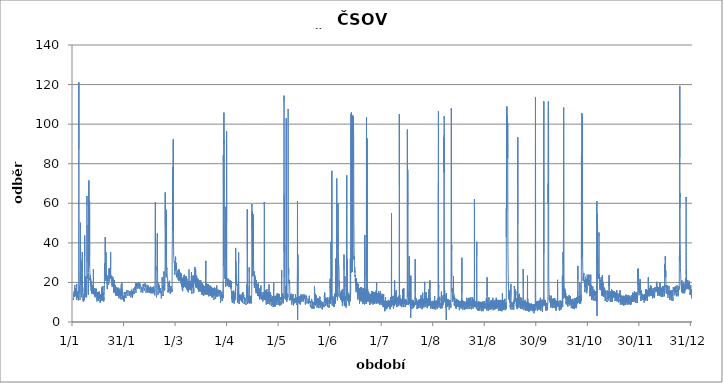
| Category | Series 0 |
|---|---|
| 2012-01-01 01:00:00 | 11.96 |
| 2012-01-01 02:00:00 | 12.22 |
| 2012-01-01 03:00:00 | 12.22 |
| 2012-01-01 04:00:00 | 11.7 |
| 2012-01-01 05:00:00 | 11.18 |
| 2012-01-01 06:00:00 | 11.44 |
| 2012-01-01 07:00:00 | 11.44 |
| 2012-01-01 08:00:00 | 11.7 |
| 2012-01-01 09:00:00 | 11.7 |
| 2012-01-01 10:00:00 | 11.7 |
| 2012-01-01 11:00:00 | 13 |
| 2012-01-01 12:00:00 | 13 |
| 2012-01-01 13:00:00 | 13.26 |
| 2012-01-01 14:00:00 | 13.26 |
| 2012-01-01 15:00:00 | 14.04 |
| 2012-01-01 16:00:00 | 12.74 |
| 2012-01-01 17:00:00 | 15.34 |
| 2012-01-01 18:00:00 | 13.78 |
| 2012-01-01 19:00:00 | 12.74 |
| 2012-01-01 20:00:00 | 13.26 |
| 2012-01-01 21:00:00 | 14.56 |
| 2012-01-01 22:00:00 | 14.3 |
| 2012-01-01 23:00:00 | 15.08 |
| 2012-01-02 | 16.12 |
| 2012-01-02 01:00:00 | 17.94 |
| 2012-01-02 02:00:00 | 18.72 |
| 2012-01-02 03:00:00 | 17.94 |
| 2012-01-02 04:00:00 | 14.82 |
| 2012-01-02 05:00:00 | 13.52 |
| 2012-01-02 06:00:00 | 13 |
| 2012-01-02 07:00:00 | 13 |
| 2012-01-02 08:00:00 | 12.74 |
| 2012-01-02 09:00:00 | 13.78 |
| 2012-01-02 10:00:00 | 16.38 |
| 2012-01-02 11:00:00 | 16.9 |
| 2012-01-02 12:00:00 | 15.34 |
| 2012-01-02 13:00:00 | 14.56 |
| 2012-01-02 14:00:00 | 14.3 |
| 2012-01-02 15:00:00 | 16.9 |
| 2012-01-02 16:00:00 | 15.86 |
| 2012-01-02 17:00:00 | 14.56 |
| 2012-01-02 18:00:00 | 14.04 |
| 2012-01-02 19:00:00 | 14.04 |
| 2012-01-02 20:00:00 | 14.3 |
| 2012-01-02 21:00:00 | 14.3 |
| 2012-01-02 22:00:00 | 13.26 |
| 2012-01-02 23:00:00 | 13 |
| 2012-01-03 | 14.82 |
| 2012-01-03 01:00:00 | 12.48 |
| 2012-01-03 02:00:00 | 11.18 |
| 2012-01-03 03:00:00 | 11.96 |
| 2012-01-03 04:00:00 | 17.16 |
| 2012-01-03 05:00:00 | 19.24 |
| 2012-01-03 06:00:00 | 17.68 |
| 2012-01-03 07:00:00 | 16.12 |
| 2012-01-03 08:00:00 | 14.3 |
| 2012-01-03 09:00:00 | 14.3 |
| 2012-01-03 10:00:00 | 15.6 |
| 2012-01-03 11:00:00 | 13.52 |
| 2012-01-03 12:00:00 | 13 |
| 2012-01-03 13:00:00 | 13.52 |
| 2012-01-03 14:00:00 | 14.82 |
| 2012-01-03 15:00:00 | 13.78 |
| 2012-01-03 16:00:00 | 14.04 |
| 2012-01-03 17:00:00 | 12.74 |
| 2012-01-03 18:00:00 | 12.22 |
| 2012-01-03 19:00:00 | 13.52 |
| 2012-01-03 20:00:00 | 14.56 |
| 2012-01-03 21:00:00 | 13 |
| 2012-01-03 22:00:00 | 14.04 |
| 2012-01-03 23:00:00 | 15.34 |
| 2012-01-04 | 14.3 |
| 2012-01-04 01:00:00 | 13 |
| 2012-01-04 02:00:00 | 11.44 |
| 2012-01-04 03:00:00 | 11.7 |
| 2012-01-04 04:00:00 | 10.92 |
| 2012-01-04 05:00:00 | 11.18 |
| 2012-01-04 06:00:00 | 12.22 |
| 2012-01-04 07:00:00 | 13 |
| 2012-01-04 08:00:00 | 12.22 |
| 2012-01-04 09:00:00 | 13.26 |
| 2012-01-04 10:00:00 | 20.02 |
| 2012-01-04 11:00:00 | 94.9 |
| 2012-01-04 12:00:00 | 121.16 |
| 2012-01-04 13:00:00 | 87.36 |
| 2012-01-04 14:00:00 | 41.86 |
| 2012-01-04 15:00:00 | 27.56 |
| 2012-01-04 16:00:00 | 24.18 |
| 2012-01-04 17:00:00 | 22.1 |
| 2012-01-04 18:00:00 | 15.08 |
| 2012-01-04 19:00:00 | 15.86 |
| 2012-01-04 20:00:00 | 16.12 |
| 2012-01-04 21:00:00 | 18.2 |
| 2012-01-04 22:00:00 | 16.12 |
| 2012-01-04 23:00:00 | 16.38 |
| 2012-01-05 | 15.6 |
| 2012-01-05 01:00:00 | 13.78 |
| 2012-01-05 02:00:00 | 12.48 |
| 2012-01-05 03:00:00 | 11.7 |
| 2012-01-05 04:00:00 | 11.18 |
| 2012-01-05 05:00:00 | 11.18 |
| 2012-01-05 06:00:00 | 11.96 |
| 2012-01-05 07:00:00 | 13.52 |
| 2012-01-05 08:00:00 | 14.04 |
| 2012-01-05 09:00:00 | 20.28 |
| 2012-01-05 10:00:00 | 50.18 |
| 2012-01-05 11:00:00 | 48.88 |
| 2012-01-05 12:00:00 | 43.16 |
| 2012-01-05 13:00:00 | 30.42 |
| 2012-01-05 14:00:00 | 23.66 |
| 2012-01-05 15:00:00 | 23.14 |
| 2012-01-05 16:00:00 | 30.16 |
| 2012-01-05 17:00:00 | 30.94 |
| 2012-01-05 18:00:00 | 23.92 |
| 2012-01-05 19:00:00 | 18.72 |
| 2012-01-05 20:00:00 | 22.62 |
| 2012-01-05 21:00:00 | 23.66 |
| 2012-01-05 22:00:00 | 18.72 |
| 2012-01-05 23:00:00 | 17.16 |
| 2012-01-06 | 15.6 |
| 2012-01-06 01:00:00 | 13.52 |
| 2012-01-06 02:00:00 | 14.3 |
| 2012-01-06 03:00:00 | 14.3 |
| 2012-01-06 04:00:00 | 13.52 |
| 2012-01-06 05:00:00 | 12.48 |
| 2012-01-06 06:00:00 | 12.22 |
| 2012-01-06 07:00:00 | 15.08 |
| 2012-01-06 08:00:00 | 15.34 |
| 2012-01-06 09:00:00 | 21.84 |
| 2012-01-06 10:00:00 | 29.38 |
| 2012-01-06 11:00:00 | 26.52 |
| 2012-01-06 12:00:00 | 31.98 |
| 2012-01-06 13:00:00 | 35.36 |
| 2012-01-06 14:00:00 | 27.56 |
| 2012-01-06 15:00:00 | 22.62 |
| 2012-01-06 16:00:00 | 16.9 |
| 2012-01-06 17:00:00 | 15.08 |
| 2012-01-06 18:00:00 | 17.42 |
| 2012-01-06 19:00:00 | 15.34 |
| 2012-01-06 20:00:00 | 15.34 |
| 2012-01-06 21:00:00 | 15.34 |
| 2012-01-06 22:00:00 | 15.08 |
| 2012-01-06 23:00:00 | 14.82 |
| 2012-01-07 | 13 |
| 2012-01-07 01:00:00 | 11.96 |
| 2012-01-07 02:00:00 | 10.66 |
| 2012-01-07 03:00:00 | 12.74 |
| 2012-01-07 04:00:00 | 10.4 |
| 2012-01-07 05:00:00 | 10.4 |
| 2012-01-07 06:00:00 | 10.14 |
| 2012-01-07 07:00:00 | 10.66 |
| 2012-01-07 08:00:00 | 11.7 |
| 2012-01-07 09:00:00 | 10.66 |
| 2012-01-07 10:00:00 | 11.44 |
| 2012-01-07 11:00:00 | 13.26 |
| 2012-01-07 12:00:00 | 13 |
| 2012-01-07 13:00:00 | 13 |
| 2012-01-07 14:00:00 | 14.3 |
| 2012-01-07 15:00:00 | 12.74 |
| 2012-01-07 16:00:00 | 12.22 |
| 2012-01-07 17:00:00 | 11.96 |
| 2012-01-07 18:00:00 | 11.7 |
| 2012-01-07 19:00:00 | 11.18 |
| 2012-01-07 20:00:00 | 11.44 |
| 2012-01-07 21:00:00 | 16.9 |
| 2012-01-07 22:00:00 | 40.56 |
| 2012-01-07 23:00:00 | 43.68 |
| 2012-01-08 | 33.28 |
| 2012-01-08 01:00:00 | 24.7 |
| 2012-01-08 02:00:00 | 17.94 |
| 2012-01-08 03:00:00 | 13.26 |
| 2012-01-08 04:00:00 | 12.48 |
| 2012-01-08 05:00:00 | 20.02 |
| 2012-01-08 06:00:00 | 19.5 |
| 2012-01-08 07:00:00 | 16.12 |
| 2012-01-08 08:00:00 | 21.58 |
| 2012-01-08 09:00:00 | 18.46 |
| 2012-01-08 10:00:00 | 16.12 |
| 2012-01-08 11:00:00 | 14.04 |
| 2012-01-08 12:00:00 | 14.3 |
| 2012-01-08 13:00:00 | 14.04 |
| 2012-01-08 14:00:00 | 17.16 |
| 2012-01-08 15:00:00 | 23.14 |
| 2012-01-08 16:00:00 | 17.42 |
| 2012-01-08 17:00:00 | 15.34 |
| 2012-01-08 18:00:00 | 21.06 |
| 2012-01-08 19:00:00 | 20.28 |
| 2012-01-08 20:00:00 | 16.12 |
| 2012-01-08 21:00:00 | 15.86 |
| 2012-01-08 22:00:00 | 15.08 |
| 2012-01-08 23:00:00 | 14.3 |
| 2012-01-09 | 14.56 |
| 2012-01-09 01:00:00 | 12.48 |
| 2012-01-09 02:00:00 | 13.52 |
| 2012-01-09 03:00:00 | 13.26 |
| 2012-01-09 04:00:00 | 18.46 |
| 2012-01-09 05:00:00 | 24.18 |
| 2012-01-09 06:00:00 | 63.7 |
| 2012-01-09 07:00:00 | 59.02 |
| 2012-01-09 08:00:00 | 48.1 |
| 2012-01-09 09:00:00 | 48.62 |
| 2012-01-09 10:00:00 | 30.16 |
| 2012-01-09 11:00:00 | 24.96 |
| 2012-01-09 12:00:00 | 23.66 |
| 2012-01-09 13:00:00 | 22.36 |
| 2012-01-09 14:00:00 | 22.1 |
| 2012-01-09 15:00:00 | 21.84 |
| 2012-01-09 16:00:00 | 21.58 |
| 2012-01-09 17:00:00 | 23.14 |
| 2012-01-09 18:00:00 | 23.14 |
| 2012-01-09 19:00:00 | 23.14 |
| 2012-01-09 20:00:00 | 23.92 |
| 2012-01-09 21:00:00 | 24.18 |
| 2012-01-09 22:00:00 | 23.66 |
| 2012-01-09 23:00:00 | 23.14 |
| 2012-01-10 | 22.1 |
| 2012-01-10 01:00:00 | 17.94 |
| 2012-01-10 02:00:00 | 13.78 |
| 2012-01-10 03:00:00 | 20.8 |
| 2012-01-10 04:00:00 | 24.96 |
| 2012-01-10 05:00:00 | 28.86 |
| 2012-01-10 06:00:00 | 42.38 |
| 2012-01-10 07:00:00 | 62.14 |
| 2012-01-10 08:00:00 | 47.32 |
| 2012-01-10 09:00:00 | 71.5 |
| 2012-01-10 10:00:00 | 40.3 |
| 2012-01-10 11:00:00 | 33.02 |
| 2012-01-10 12:00:00 | 33.54 |
| 2012-01-10 13:00:00 | 32.24 |
| 2012-01-10 14:00:00 | 28.34 |
| 2012-01-10 15:00:00 | 28.34 |
| 2012-01-10 16:00:00 | 30.42 |
| 2012-01-10 17:00:00 | 33.02 |
| 2012-01-10 18:00:00 | 29.64 |
| 2012-01-10 19:00:00 | 40.56 |
| 2012-01-10 20:00:00 | 60.84 |
| 2012-01-10 21:00:00 | 33.8 |
| 2012-01-10 22:00:00 | 27.04 |
| 2012-01-10 23:00:00 | 26.52 |
| 2012-01-11 | 26 |
| 2012-01-11 01:00:00 | 23.66 |
| 2012-01-11 02:00:00 | 21.32 |
| 2012-01-11 03:00:00 | 22.36 |
| 2012-01-11 04:00:00 | 22.62 |
| 2012-01-11 05:00:00 | 20.8 |
| 2012-01-11 06:00:00 | 20.8 |
| 2012-01-11 07:00:00 | 22.62 |
| 2012-01-11 08:00:00 | 23.66 |
| 2012-01-11 09:00:00 | 23.14 |
| 2012-01-11 10:00:00 | 21.32 |
| 2012-01-11 11:00:00 | 22.1 |
| 2012-01-11 12:00:00 | 19.5 |
| 2012-01-11 13:00:00 | 18.2 |
| 2012-01-11 14:00:00 | 18.2 |
| 2012-01-11 15:00:00 | 18.46 |
| 2012-01-11 16:00:00 | 20.02 |
| 2012-01-11 17:00:00 | 18.46 |
| 2012-01-11 18:00:00 | 15.86 |
| 2012-01-11 19:00:00 | 18.98 |
| 2012-01-11 20:00:00 | 18.98 |
| 2012-01-11 21:00:00 | 18.72 |
| 2012-01-11 22:00:00 | 17.94 |
| 2012-01-11 23:00:00 | 18.98 |
| 2012-01-12 | 20.8 |
| 2012-01-12 01:00:00 | 19.5 |
| 2012-01-12 02:00:00 | 14.56 |
| 2012-01-12 03:00:00 | 14.56 |
| 2012-01-12 04:00:00 | 15.86 |
| 2012-01-12 05:00:00 | 16.12 |
| 2012-01-12 06:00:00 | 14.3 |
| 2012-01-12 07:00:00 | 16.12 |
| 2012-01-12 08:00:00 | 18.46 |
| 2012-01-12 09:00:00 | 16.38 |
| 2012-01-12 10:00:00 | 16.12 |
| 2012-01-12 11:00:00 | 16.38 |
| 2012-01-12 12:00:00 | 18.2 |
| 2012-01-12 13:00:00 | 14.56 |
| 2012-01-12 14:00:00 | 16.9 |
| 2012-01-12 15:00:00 | 17.94 |
| 2012-01-12 16:00:00 | 18.2 |
| 2012-01-12 17:00:00 | 18.2 |
| 2012-01-12 18:00:00 | 14.56 |
| 2012-01-12 19:00:00 | 17.16 |
| 2012-01-12 20:00:00 | 18.72 |
| 2012-01-12 21:00:00 | 17.42 |
| 2012-01-12 22:00:00 | 16.38 |
| 2012-01-12 23:00:00 | 17.94 |
| 2012-01-13 | 17.94 |
| 2012-01-13 01:00:00 | 20.8 |
| 2012-01-13 02:00:00 | 26.78 |
| 2012-01-13 03:00:00 | 21.32 |
| 2012-01-13 04:00:00 | 17.42 |
| 2012-01-13 05:00:00 | 14.04 |
| 2012-01-13 06:00:00 | 14.04 |
| 2012-01-13 07:00:00 | 15.6 |
| 2012-01-13 08:00:00 | 16.64 |
| 2012-01-13 09:00:00 | 15.34 |
| 2012-01-13 10:00:00 | 14.56 |
| 2012-01-13 11:00:00 | 15.34 |
| 2012-01-13 12:00:00 | 17.16 |
| 2012-01-13 13:00:00 | 14.82 |
| 2012-01-13 14:00:00 | 15.08 |
| 2012-01-13 15:00:00 | 15.6 |
| 2012-01-13 16:00:00 | 16.9 |
| 2012-01-13 17:00:00 | 13.52 |
| 2012-01-13 18:00:00 | 14.82 |
| 2012-01-13 19:00:00 | 15.34 |
| 2012-01-13 20:00:00 | 17.16 |
| 2012-01-13 21:00:00 | 16.12 |
| 2012-01-13 22:00:00 | 13.78 |
| 2012-01-13 23:00:00 | 15.86 |
| 2012-01-14 | 14.3 |
| 2012-01-14 01:00:00 | 13.26 |
| 2012-01-14 02:00:00 | 12.48 |
| 2012-01-14 03:00:00 | 14.3 |
| 2012-01-14 04:00:00 | 13 |
| 2012-01-14 05:00:00 | 12.74 |
| 2012-01-14 06:00:00 | 13 |
| 2012-01-14 07:00:00 | 15.34 |
| 2012-01-14 08:00:00 | 13.78 |
| 2012-01-14 09:00:00 | 13.78 |
| 2012-01-14 10:00:00 | 14.04 |
| 2012-01-14 11:00:00 | 13.26 |
| 2012-01-14 12:00:00 | 15.08 |
| 2012-01-14 13:00:00 | 15.08 |
| 2012-01-14 14:00:00 | 15.08 |
| 2012-01-14 15:00:00 | 16.9 |
| 2012-01-14 16:00:00 | 13.78 |
| 2012-01-14 17:00:00 | 13.78 |
| 2012-01-14 18:00:00 | 13.78 |
| 2012-01-14 19:00:00 | 13.78 |
| 2012-01-14 20:00:00 | 13.52 |
| 2012-01-14 21:00:00 | 13.52 |
| 2012-01-14 22:00:00 | 16.64 |
| 2012-01-14 23:00:00 | 13.26 |
| 2012-01-15 | 13.26 |
| 2012-01-15 01:00:00 | 12.48 |
| 2012-01-15 02:00:00 | 11.7 |
| 2012-01-15 03:00:00 | 11.44 |
| 2012-01-15 04:00:00 | 10.4 |
| 2012-01-15 05:00:00 | 10.92 |
| 2012-01-15 06:00:00 | 10.92 |
| 2012-01-15 07:00:00 | 12.48 |
| 2012-01-15 08:00:00 | 11.44 |
| 2012-01-15 09:00:00 | 11.44 |
| 2012-01-15 10:00:00 | 12.22 |
| 2012-01-15 11:00:00 | 13.26 |
| 2012-01-15 12:00:00 | 13.52 |
| 2012-01-15 13:00:00 | 13.26 |
| 2012-01-15 14:00:00 | 13.52 |
| 2012-01-15 15:00:00 | 15.08 |
| 2012-01-15 16:00:00 | 13.52 |
| 2012-01-15 17:00:00 | 12.48 |
| 2012-01-15 18:00:00 | 13.26 |
| 2012-01-15 19:00:00 | 13.26 |
| 2012-01-15 20:00:00 | 13 |
| 2012-01-15 21:00:00 | 13.26 |
| 2012-01-15 22:00:00 | 14.3 |
| 2012-01-15 23:00:00 | 15.08 |
| 2012-01-16 | 13.26 |
| 2012-01-16 01:00:00 | 11.96 |
| 2012-01-16 02:00:00 | 10.66 |
| 2012-01-16 03:00:00 | 13 |
| 2012-01-16 04:00:00 | 11.96 |
| 2012-01-16 05:00:00 | 10.66 |
| 2012-01-16 06:00:00 | 10.66 |
| 2012-01-16 07:00:00 | 13.26 |
| 2012-01-16 08:00:00 | 13 |
| 2012-01-16 09:00:00 | 12.48 |
| 2012-01-16 10:00:00 | 12.74 |
| 2012-01-16 11:00:00 | 15.34 |
| 2012-01-16 12:00:00 | 13.52 |
| 2012-01-16 13:00:00 | 13.26 |
| 2012-01-16 14:00:00 | 11.7 |
| 2012-01-16 15:00:00 | 15.08 |
| 2012-01-16 16:00:00 | 15.34 |
| 2012-01-16 17:00:00 | 14.82 |
| 2012-01-16 18:00:00 | 12.48 |
| 2012-01-16 19:00:00 | 11.96 |
| 2012-01-16 20:00:00 | 13.78 |
| 2012-01-16 21:00:00 | 13.78 |
| 2012-01-16 22:00:00 | 12.22 |
| 2012-01-16 23:00:00 | 13.78 |
| 2012-01-17 | 13.26 |
| 2012-01-17 01:00:00 | 11.96 |
| 2012-01-17 02:00:00 | 9.88 |
| 2012-01-17 03:00:00 | 10.4 |
| 2012-01-17 04:00:00 | 11.18 |
| 2012-01-17 05:00:00 | 10.66 |
| 2012-01-17 06:00:00 | 9.62 |
| 2012-01-17 07:00:00 | 10.92 |
| 2012-01-17 08:00:00 | 13 |
| 2012-01-17 09:00:00 | 12.22 |
| 2012-01-17 10:00:00 | 11.96 |
| 2012-01-17 11:00:00 | 12.74 |
| 2012-01-17 12:00:00 | 12.74 |
| 2012-01-17 13:00:00 | 11.44 |
| 2012-01-17 14:00:00 | 14.04 |
| 2012-01-17 15:00:00 | 13.78 |
| 2012-01-17 16:00:00 | 14.3 |
| 2012-01-17 17:00:00 | 14.04 |
| 2012-01-17 18:00:00 | 14.3 |
| 2012-01-17 19:00:00 | 14.3 |
| 2012-01-17 20:00:00 | 13.52 |
| 2012-01-17 21:00:00 | 13.78 |
| 2012-01-17 22:00:00 | 17.42 |
| 2012-01-17 23:00:00 | 14.3 |
| 2012-01-18 | 15.08 |
| 2012-01-18 01:00:00 | 11.96 |
| 2012-01-18 02:00:00 | 11.96 |
| 2012-01-18 03:00:00 | 13 |
| 2012-01-18 04:00:00 | 11.18 |
| 2012-01-18 05:00:00 | 10.66 |
| 2012-01-18 06:00:00 | 12.48 |
| 2012-01-18 07:00:00 | 13.26 |
| 2012-01-18 08:00:00 | 13.52 |
| 2012-01-18 09:00:00 | 13.78 |
| 2012-01-18 10:00:00 | 12.48 |
| 2012-01-18 11:00:00 | 16.12 |
| 2012-01-18 12:00:00 | 14.82 |
| 2012-01-18 13:00:00 | 13.52 |
| 2012-01-18 14:00:00 | 13 |
| 2012-01-18 15:00:00 | 15.34 |
| 2012-01-18 16:00:00 | 18.2 |
| 2012-01-18 17:00:00 | 16.38 |
| 2012-01-18 18:00:00 | 14.3 |
| 2012-01-18 19:00:00 | 13 |
| 2012-01-18 20:00:00 | 13.26 |
| 2012-01-18 21:00:00 | 14.82 |
| 2012-01-18 22:00:00 | 15.08 |
| 2012-01-18 23:00:00 | 13.26 |
| 2012-01-19 | 12.48 |
| 2012-01-19 01:00:00 | 11.44 |
| 2012-01-19 02:00:00 | 12.22 |
| 2012-01-19 03:00:00 | 11.44 |
| 2012-01-19 04:00:00 | 10.4 |
| 2012-01-19 05:00:00 | 10.14 |
| 2012-01-19 06:00:00 | 11.96 |
| 2012-01-19 07:00:00 | 11.7 |
| 2012-01-19 08:00:00 | 11.44 |
| 2012-01-19 09:00:00 | 12.22 |
| 2012-01-19 10:00:00 | 13.26 |
| 2012-01-19 11:00:00 | 13.26 |
| 2012-01-19 12:00:00 | 13 |
| 2012-01-19 13:00:00 | 15.34 |
| 2012-01-19 14:00:00 | 18.98 |
| 2012-01-19 15:00:00 | 26 |
| 2012-01-19 16:00:00 | 29.64 |
| 2012-01-19 17:00:00 | 28.86 |
| 2012-01-19 18:00:00 | 25.74 |
| 2012-01-19 19:00:00 | 25.74 |
| 2012-01-19 20:00:00 | 27.04 |
| 2012-01-19 21:00:00 | 27.82 |
| 2012-01-19 22:00:00 | 29.9 |
| 2012-01-19 23:00:00 | 34.32 |
| 2012-01-20 | 36.92 |
| 2012-01-20 01:00:00 | 40.56 |
| 2012-01-20 02:00:00 | 42.9 |
| 2012-01-20 03:00:00 | 34.06 |
| 2012-01-20 04:00:00 | 28.08 |
| 2012-01-20 05:00:00 | 24.96 |
| 2012-01-20 06:00:00 | 25.48 |
| 2012-01-20 07:00:00 | 22.88 |
| 2012-01-20 08:00:00 | 22.36 |
| 2012-01-20 09:00:00 | 22.1 |
| 2012-01-20 10:00:00 | 21.32 |
| 2012-01-20 11:00:00 | 21.58 |
| 2012-01-20 12:00:00 | 20.8 |
| 2012-01-20 13:00:00 | 23.92 |
| 2012-01-20 14:00:00 | 35.1 |
| 2012-01-20 15:00:00 | 33.8 |
| 2012-01-20 16:00:00 | 32.24 |
| 2012-01-20 17:00:00 | 28.08 |
| 2012-01-20 18:00:00 | 23.66 |
| 2012-01-20 19:00:00 | 22.1 |
| 2012-01-20 20:00:00 | 23.4 |
| 2012-01-20 21:00:00 | 23.4 |
| 2012-01-20 22:00:00 | 21.58 |
| 2012-01-20 23:00:00 | 20.8 |
| 2012-01-21 | 21.06 |
| 2012-01-21 01:00:00 | 18.98 |
| 2012-01-21 02:00:00 | 18.98 |
| 2012-01-21 03:00:00 | 18.98 |
| 2012-01-21 04:00:00 | 18.98 |
| 2012-01-21 05:00:00 | 17.42 |
| 2012-01-21 06:00:00 | 17.68 |
| 2012-01-21 07:00:00 | 16.64 |
| 2012-01-21 08:00:00 | 16.9 |
| 2012-01-21 09:00:00 | 18.2 |
| 2012-01-21 10:00:00 | 19.24 |
| 2012-01-21 11:00:00 | 19.5 |
| 2012-01-21 12:00:00 | 23.4 |
| 2012-01-21 13:00:00 | 23.14 |
| 2012-01-21 14:00:00 | 22.1 |
| 2012-01-21 15:00:00 | 21.58 |
| 2012-01-21 16:00:00 | 20.54 |
| 2012-01-21 17:00:00 | 19.76 |
| 2012-01-21 18:00:00 | 19.24 |
| 2012-01-21 19:00:00 | 19.24 |
| 2012-01-21 20:00:00 | 18.98 |
| 2012-01-21 21:00:00 | 19.5 |
| 2012-01-21 22:00:00 | 18.98 |
| 2012-01-21 23:00:00 | 18.72 |
| 2012-01-22 | 18.72 |
| 2012-01-22 01:00:00 | 18.98 |
| 2012-01-22 02:00:00 | 18.72 |
| 2012-01-22 03:00:00 | 18.72 |
| 2012-01-22 04:00:00 | 18.98 |
| 2012-01-22 05:00:00 | 19.24 |
| 2012-01-22 06:00:00 | 19.5 |
| 2012-01-22 07:00:00 | 27.04 |
| 2012-01-22 08:00:00 | 23.14 |
| 2012-01-22 09:00:00 | 20.54 |
| 2012-01-22 10:00:00 | 22.1 |
| 2012-01-22 11:00:00 | 25.48 |
| 2012-01-22 12:00:00 | 25.48 |
| 2012-01-22 13:00:00 | 26 |
| 2012-01-22 14:00:00 | 26.78 |
| 2012-01-22 15:00:00 | 26 |
| 2012-01-22 16:00:00 | 27.04 |
| 2012-01-22 17:00:00 | 26.52 |
| 2012-01-22 18:00:00 | 25.22 |
| 2012-01-22 19:00:00 | 24.96 |
| 2012-01-22 20:00:00 | 26 |
| 2012-01-22 21:00:00 | 25.74 |
| 2012-01-22 22:00:00 | 24.7 |
| 2012-01-22 23:00:00 | 25.48 |
| 2012-01-23 | 23.66 |
| 2012-01-23 01:00:00 | 22.36 |
| 2012-01-23 02:00:00 | 21.84 |
| 2012-01-23 03:00:00 | 22.62 |
| 2012-01-23 04:00:00 | 22.88 |
| 2012-01-23 05:00:00 | 29.9 |
| 2012-01-23 06:00:00 | 35.36 |
| 2012-01-23 07:00:00 | 26.78 |
| 2012-01-23 08:00:00 | 24.96 |
| 2012-01-23 09:00:00 | 24.7 |
| 2012-01-23 10:00:00 | 23.14 |
| 2012-01-23 11:00:00 | 22.1 |
| 2012-01-23 12:00:00 | 22.1 |
| 2012-01-23 13:00:00 | 23.4 |
| 2012-01-23 14:00:00 | 22.1 |
| 2012-01-23 15:00:00 | 21.84 |
| 2012-01-23 16:00:00 | 22.36 |
| 2012-01-23 17:00:00 | 21.32 |
| 2012-01-23 18:00:00 | 20.28 |
| 2012-01-23 19:00:00 | 21.06 |
| 2012-01-23 20:00:00 | 21.84 |
| 2012-01-23 21:00:00 | 21.06 |
| 2012-01-23 22:00:00 | 20.28 |
| 2012-01-23 23:00:00 | 21.06 |
| 2012-01-24 | 20.54 |
| 2012-01-24 01:00:00 | 18.98 |
| 2012-01-24 02:00:00 | 18.72 |
| 2012-01-24 03:00:00 | 19.24 |
| 2012-01-24 04:00:00 | 19.76 |
| 2012-01-24 05:00:00 | 17.68 |
| 2012-01-24 06:00:00 | 17.68 |
| 2012-01-24 07:00:00 | 19.76 |
| 2012-01-24 08:00:00 | 22.62 |
| 2012-01-24 09:00:00 | 21.32 |
| 2012-01-24 10:00:00 | 21.58 |
| 2012-01-24 11:00:00 | 22.88 |
| 2012-01-24 12:00:00 | 22.1 |
| 2012-01-24 13:00:00 | 21.84 |
| 2012-01-24 14:00:00 | 19.24 |
| 2012-01-24 15:00:00 | 19.76 |
| 2012-01-24 16:00:00 | 20.8 |
| 2012-01-24 17:00:00 | 19.24 |
| 2012-01-24 18:00:00 | 18.46 |
| 2012-01-24 19:00:00 | 18.72 |
| 2012-01-24 20:00:00 | 19.76 |
| 2012-01-24 21:00:00 | 21.84 |
| 2012-01-24 22:00:00 | 18.98 |
| 2012-01-24 23:00:00 | 20.02 |
| 2012-01-25 | 19.76 |
| 2012-01-25 01:00:00 | 17.68 |
| 2012-01-25 02:00:00 | 15.08 |
| 2012-01-25 03:00:00 | 17.16 |
| 2012-01-25 04:00:00 | 17.16 |
| 2012-01-25 05:00:00 | 14.82 |
| 2012-01-25 06:00:00 | 15.08 |
| 2012-01-25 07:00:00 | 17.94 |
| 2012-01-25 08:00:00 | 18.72 |
| 2012-01-25 09:00:00 | 17.68 |
| 2012-01-25 10:00:00 | 15.86 |
| 2012-01-25 11:00:00 | 18.2 |
| 2012-01-25 12:00:00 | 19.76 |
| 2012-01-25 13:00:00 | 21.06 |
| 2012-01-25 14:00:00 | 17.42 |
| 2012-01-25 15:00:00 | 17.68 |
| 2012-01-25 16:00:00 | 18.46 |
| 2012-01-25 17:00:00 | 18.2 |
| 2012-01-25 18:00:00 | 16.38 |
| 2012-01-25 19:00:00 | 16.64 |
| 2012-01-25 20:00:00 | 17.68 |
| 2012-01-25 21:00:00 | 18.46 |
| 2012-01-25 22:00:00 | 16.9 |
| 2012-01-25 23:00:00 | 18.46 |
| 2012-01-26 | 17.68 |
| 2012-01-26 01:00:00 | 14.82 |
| 2012-01-26 02:00:00 | 13.52 |
| 2012-01-26 03:00:00 | 13.52 |
| 2012-01-26 04:00:00 | 14.82 |
| 2012-01-26 05:00:00 | 13.52 |
| 2012-01-26 06:00:00 | 13.26 |
| 2012-01-26 07:00:00 | 15.08 |
| 2012-01-26 08:00:00 | 16.9 |
| 2012-01-26 09:00:00 | 16.9 |
| 2012-01-26 10:00:00 | 13.78 |
| 2012-01-26 11:00:00 | 17.16 |
| 2012-01-26 12:00:00 | 17.68 |
| 2012-01-26 13:00:00 | 15.34 |
| 2012-01-26 14:00:00 | 14.82 |
| 2012-01-26 15:00:00 | 17.42 |
| 2012-01-26 16:00:00 | 16.12 |
| 2012-01-26 17:00:00 | 16.38 |
| 2012-01-26 18:00:00 | 17.16 |
| 2012-01-26 19:00:00 | 13.52 |
| 2012-01-26 20:00:00 | 16.38 |
| 2012-01-26 21:00:00 | 17.16 |
| 2012-01-26 22:00:00 | 17.42 |
| 2012-01-26 23:00:00 | 17.42 |
| 2012-01-27 | 13.52 |
| 2012-01-27 01:00:00 | 13.78 |
| 2012-01-27 02:00:00 | 14.82 |
| 2012-01-27 03:00:00 | 14.82 |
| 2012-01-27 04:00:00 | 13.26 |
| 2012-01-27 05:00:00 | 15.34 |
| 2012-01-27 06:00:00 | 15.34 |
| 2012-01-27 07:00:00 | 15.08 |
| 2012-01-27 08:00:00 | 16.64 |
| 2012-01-27 09:00:00 | 13.78 |
| 2012-01-27 10:00:00 | 14.3 |
| 2012-01-27 11:00:00 | 16.9 |
| 2012-01-27 12:00:00 | 15.34 |
| 2012-01-27 13:00:00 | 14.04 |
| 2012-01-27 14:00:00 | 16.12 |
| 2012-01-27 15:00:00 | 17.42 |
| 2012-01-27 16:00:00 | 16.9 |
| 2012-01-27 17:00:00 | 13.26 |
| 2012-01-27 18:00:00 | 14.56 |
| 2012-01-27 19:00:00 | 16.64 |
| 2012-01-27 20:00:00 | 15.34 |
| 2012-01-27 21:00:00 | 14.82 |
| 2012-01-27 22:00:00 | 14.82 |
| 2012-01-27 23:00:00 | 16.38 |
| 2012-01-28 | 15.08 |
| 2012-01-28 01:00:00 | 13.26 |
| 2012-01-28 02:00:00 | 13 |
| 2012-01-28 03:00:00 | 13 |
| 2012-01-28 04:00:00 | 11.96 |
| 2012-01-28 05:00:00 | 12.22 |
| 2012-01-28 06:00:00 | 11.96 |
| 2012-01-28 07:00:00 | 12.22 |
| 2012-01-28 08:00:00 | 14.04 |
| 2012-01-28 09:00:00 | 13.78 |
| 2012-01-28 10:00:00 | 13.52 |
| 2012-01-28 11:00:00 | 14.56 |
| 2012-01-28 12:00:00 | 15.34 |
| 2012-01-28 13:00:00 | 15.08 |
| 2012-01-28 14:00:00 | 15.08 |
| 2012-01-28 15:00:00 | 15.08 |
| 2012-01-28 16:00:00 | 15.86 |
| 2012-01-28 17:00:00 | 16.9 |
| 2012-01-28 18:00:00 | 13.52 |
| 2012-01-28 19:00:00 | 13.78 |
| 2012-01-28 20:00:00 | 13.78 |
| 2012-01-28 21:00:00 | 13.78 |
| 2012-01-28 22:00:00 | 14.04 |
| 2012-01-28 23:00:00 | 15.6 |
| 2012-01-29 | 13.78 |
| 2012-01-29 01:00:00 | 13.52 |
| 2012-01-29 02:00:00 | 12.48 |
| 2012-01-29 03:00:00 | 12.48 |
| 2012-01-29 04:00:00 | 12.22 |
| 2012-01-29 05:00:00 | 12.48 |
| 2012-01-29 06:00:00 | 12.22 |
| 2012-01-29 07:00:00 | 11.44 |
| 2012-01-29 08:00:00 | 13 |
| 2012-01-29 09:00:00 | 14.56 |
| 2012-01-29 10:00:00 | 13.26 |
| 2012-01-29 11:00:00 | 15.08 |
| 2012-01-29 12:00:00 | 15.86 |
| 2012-01-29 13:00:00 | 18.98 |
| 2012-01-29 14:00:00 | 15.6 |
| 2012-01-29 15:00:00 | 15.34 |
| 2012-01-29 16:00:00 | 15.34 |
| 2012-01-29 17:00:00 | 17.94 |
| 2012-01-29 18:00:00 | 14.3 |
| 2012-01-29 19:00:00 | 14.04 |
| 2012-01-29 20:00:00 | 15.6 |
| 2012-01-29 21:00:00 | 20.02 |
| 2012-01-29 22:00:00 | 15.86 |
| 2012-01-29 23:00:00 | 16.38 |
| 2012-01-30 | 16.38 |
| 2012-01-30 01:00:00 | 15.6 |
| 2012-01-30 02:00:00 | 12.48 |
| 2012-01-30 03:00:00 | 11.44 |
| 2012-01-30 04:00:00 | 12.48 |
| 2012-01-30 05:00:00 | 13 |
| 2012-01-30 06:00:00 | 12.48 |
| 2012-01-30 07:00:00 | 12.48 |
| 2012-01-30 08:00:00 | 13 |
| 2012-01-30 09:00:00 | 15.34 |
| 2012-01-30 10:00:00 | 13.26 |
| 2012-01-30 11:00:00 | 13 |
| 2012-01-30 12:00:00 | 12.22 |
| 2012-01-30 13:00:00 | 13.26 |
| 2012-01-30 14:00:00 | 12.74 |
| 2012-01-30 15:00:00 | 13 |
| 2012-01-30 16:00:00 | 13 |
| 2012-01-30 17:00:00 | 12.48 |
| 2012-01-30 18:00:00 | 11.7 |
| 2012-01-30 19:00:00 | 11.96 |
| 2012-01-30 20:00:00 | 11.44 |
| 2012-01-30 21:00:00 | 13 |
| 2012-01-30 22:00:00 | 12.22 |
| 2012-01-30 23:00:00 | 11.96 |
| 2012-01-31 | 12.22 |
| 2012-01-31 01:00:00 | 11.7 |
| 2012-01-31 02:00:00 | 10.92 |
| 2012-01-31 03:00:00 | 11.44 |
| 2012-01-31 04:00:00 | 10.4 |
| 2012-01-31 05:00:00 | 11.18 |
| 2012-01-31 06:00:00 | 10.66 |
| 2012-01-31 07:00:00 | 11.7 |
| 2012-01-31 08:00:00 | 12.48 |
| 2012-01-31 09:00:00 | 13 |
| 2012-01-31 10:00:00 | 12.22 |
| 2012-01-31 11:00:00 | 12.22 |
| 2012-01-31 12:00:00 | 12.22 |
| 2012-01-31 13:00:00 | 13.78 |
| 2012-01-31 14:00:00 | 14.56 |
| 2012-01-31 15:00:00 | 14.04 |
| 2012-01-31 16:00:00 | 14.3 |
| 2012-01-31 17:00:00 | 14.04 |
| 2012-01-31 18:00:00 | 14.04 |
| 2012-01-31 19:00:00 | 15.08 |
| 2012-01-31 20:00:00 | 14.3 |
| 2012-01-31 21:00:00 | 15.08 |
| 2012-01-31 22:00:00 | 15.34 |
| 2012-01-31 23:00:00 | 14.3 |
| 2012-02-01 | 14.3 |
| 2012-02-01 01:00:00 | 13.52 |
| 2012-02-01 02:00:00 | 13.78 |
| 2012-02-01 03:00:00 | 12.22 |
| 2012-02-01 04:00:00 | 12.74 |
| 2012-02-01 05:00:00 | 12.22 |
| 2012-02-01 06:00:00 | 12.74 |
| 2012-02-01 07:00:00 | 12.74 |
| 2012-02-01 08:00:00 | 13.26 |
| 2012-02-01 09:00:00 | 14.04 |
| 2012-02-01 10:00:00 | 14.3 |
| 2012-02-01 11:00:00 | 14.3 |
| 2012-02-01 12:00:00 | 14.82 |
| 2012-02-01 13:00:00 | 15.08 |
| 2012-02-01 14:00:00 | 15.6 |
| 2012-02-01 15:00:00 | 15.86 |
| 2012-02-01 16:00:00 | 15.86 |
| 2012-02-01 17:00:00 | 15.86 |
| 2012-02-01 18:00:00 | 14.82 |
| 2012-02-01 19:00:00 | 15.6 |
| 2012-02-01 20:00:00 | 15.34 |
| 2012-02-01 21:00:00 | 16.12 |
| 2012-02-01 22:00:00 | 16.38 |
| 2012-02-01 23:00:00 | 16.38 |
| 2012-02-02 | 15.6 |
| 2012-02-02 01:00:00 | 14.56 |
| 2012-02-02 02:00:00 | 13.78 |
| 2012-02-02 03:00:00 | 13.26 |
| 2012-02-02 04:00:00 | 13.26 |
| 2012-02-02 05:00:00 | 13.26 |
| 2012-02-02 06:00:00 | 13.26 |
| 2012-02-02 07:00:00 | 13 |
| 2012-02-02 08:00:00 | 13.78 |
| 2012-02-02 09:00:00 | 14.04 |
| 2012-02-02 10:00:00 | 14.3 |
| 2012-02-02 11:00:00 | 14.3 |
| 2012-02-02 12:00:00 | 14.3 |
| 2012-02-02 13:00:00 | 14.82 |
| 2012-02-02 14:00:00 | 15.34 |
| 2012-02-02 15:00:00 | 15.08 |
| 2012-02-02 16:00:00 | 15.34 |
| 2012-02-02 17:00:00 | 15.34 |
| 2012-02-02 18:00:00 | 15.08 |
| 2012-02-02 19:00:00 | 15.34 |
| 2012-02-02 20:00:00 | 15.86 |
| 2012-02-02 21:00:00 | 15.6 |
| 2012-02-02 22:00:00 | 15.86 |
| 2012-02-02 23:00:00 | 15.86 |
| 2012-02-03 | 15.34 |
| 2012-02-03 01:00:00 | 14.56 |
| 2012-02-03 02:00:00 | 14.04 |
| 2012-02-03 03:00:00 | 13.26 |
| 2012-02-03 04:00:00 | 13.26 |
| 2012-02-03 05:00:00 | 13.26 |
| 2012-02-03 06:00:00 | 13 |
| 2012-02-03 07:00:00 | 13.26 |
| 2012-02-03 08:00:00 | 13 |
| 2012-02-03 09:00:00 | 14.3 |
| 2012-02-03 10:00:00 | 15.34 |
| 2012-02-03 11:00:00 | 14.82 |
| 2012-02-03 12:00:00 | 15.08 |
| 2012-02-03 13:00:00 | 15.34 |
| 2012-02-03 14:00:00 | 15.34 |
| 2012-02-03 15:00:00 | 15.34 |
| 2012-02-03 16:00:00 | 14.56 |
| 2012-02-03 17:00:00 | 14.3 |
| 2012-02-03 18:00:00 | 14.56 |
| 2012-02-03 19:00:00 | 14.56 |
| 2012-02-03 20:00:00 | 14.56 |
| 2012-02-03 21:00:00 | 14.82 |
| 2012-02-03 22:00:00 | 15.34 |
| 2012-02-03 23:00:00 | 14.3 |
| 2012-02-04 | 14.56 |
| 2012-02-04 01:00:00 | 14.3 |
| 2012-02-04 02:00:00 | 14.04 |
| 2012-02-04 03:00:00 | 13.52 |
| 2012-02-04 04:00:00 | 13.26 |
| 2012-02-04 05:00:00 | 12.48 |
| 2012-02-04 06:00:00 | 13 |
| 2012-02-04 07:00:00 | 13.26 |
| 2012-02-04 08:00:00 | 13.26 |
| 2012-02-04 09:00:00 | 13.26 |
| 2012-02-04 10:00:00 | 14.56 |
| 2012-02-04 11:00:00 | 15.34 |
| 2012-02-04 12:00:00 | 15.34 |
| 2012-02-04 13:00:00 | 16.38 |
| 2012-02-04 14:00:00 | 15.6 |
| 2012-02-04 15:00:00 | 15.34 |
| 2012-02-04 16:00:00 | 14.56 |
| 2012-02-04 17:00:00 | 14.3 |
| 2012-02-04 18:00:00 | 14.3 |
| 2012-02-04 19:00:00 | 14.56 |
| 2012-02-04 20:00:00 | 14.82 |
| 2012-02-04 21:00:00 | 14.56 |
| 2012-02-04 22:00:00 | 15.6 |
| 2012-02-04 23:00:00 | 13.52 |
| 2012-02-05 | 14.56 |
| 2012-02-05 01:00:00 | 14.3 |
| 2012-02-05 02:00:00 | 13.26 |
| 2012-02-05 03:00:00 | 13.26 |
| 2012-02-05 04:00:00 | 12.22 |
| 2012-02-05 05:00:00 | 13 |
| 2012-02-05 06:00:00 | 13 |
| 2012-02-05 07:00:00 | 13 |
| 2012-02-05 08:00:00 | 13.26 |
| 2012-02-05 09:00:00 | 13.52 |
| 2012-02-05 10:00:00 | 14.3 |
| 2012-02-05 11:00:00 | 15.08 |
| 2012-02-05 12:00:00 | 15.86 |
| 2012-02-05 13:00:00 | 16.12 |
| 2012-02-05 14:00:00 | 15.6 |
| 2012-02-05 15:00:00 | 16.9 |
| 2012-02-05 16:00:00 | 16.9 |
| 2012-02-05 17:00:00 | 16.12 |
| 2012-02-05 18:00:00 | 15.08 |
| 2012-02-05 19:00:00 | 14.82 |
| 2012-02-05 20:00:00 | 15.34 |
| 2012-02-05 21:00:00 | 15.6 |
| 2012-02-05 22:00:00 | 15.6 |
| 2012-02-05 23:00:00 | 15.6 |
| 2012-02-06 | 15.08 |
| 2012-02-06 01:00:00 | 14.56 |
| 2012-02-06 02:00:00 | 15.08 |
| 2012-02-06 03:00:00 | 15.34 |
| 2012-02-06 04:00:00 | 14.3 |
| 2012-02-06 05:00:00 | 15.08 |
| 2012-02-06 06:00:00 | 14.3 |
| 2012-02-06 07:00:00 | 15.34 |
| 2012-02-06 08:00:00 | 16.12 |
| 2012-02-06 09:00:00 | 16.12 |
| 2012-02-06 10:00:00 | 16.38 |
| 2012-02-06 11:00:00 | 16.38 |
| 2012-02-06 12:00:00 | 17.16 |
| 2012-02-06 13:00:00 | 16.9 |
| 2012-02-06 14:00:00 | 16.64 |
| 2012-02-06 15:00:00 | 17.68 |
| 2012-02-06 16:00:00 | 16.38 |
| 2012-02-06 17:00:00 | 17.68 |
| 2012-02-06 18:00:00 | 17.94 |
| 2012-02-06 19:00:00 | 17.94 |
| 2012-02-06 20:00:00 | 18.46 |
| 2012-02-06 21:00:00 | 18.98 |
| 2012-02-06 22:00:00 | 19.5 |
| 2012-02-06 23:00:00 | 18.2 |
| 2012-02-07 | 17.42 |
| 2012-02-07 01:00:00 | 17.42 |
| 2012-02-07 02:00:00 | 16.12 |
| 2012-02-07 03:00:00 | 15.6 |
| 2012-02-07 04:00:00 | 15.6 |
| 2012-02-07 05:00:00 | 14.82 |
| 2012-02-07 06:00:00 | 15.34 |
| 2012-02-07 07:00:00 | 15.34 |
| 2012-02-07 08:00:00 | 15.34 |
| 2012-02-07 09:00:00 | 16.38 |
| 2012-02-07 10:00:00 | 16.64 |
| 2012-02-07 11:00:00 | 18.72 |
| 2012-02-07 12:00:00 | 18.46 |
| 2012-02-07 13:00:00 | 19.5 |
| 2012-02-07 14:00:00 | 18.72 |
| 2012-02-07 15:00:00 | 18.46 |
| 2012-02-07 16:00:00 | 18.2 |
| 2012-02-07 17:00:00 | 17.94 |
| 2012-02-07 18:00:00 | 17.68 |
| 2012-02-07 19:00:00 | 17.94 |
| 2012-02-07 20:00:00 | 17.94 |
| 2012-02-07 21:00:00 | 17.94 |
| 2012-02-07 22:00:00 | 19.5 |
| 2012-02-07 23:00:00 | 17.94 |
| 2012-02-08 | 18.2 |
| 2012-02-08 01:00:00 | 17.94 |
| 2012-02-08 02:00:00 | 17.94 |
| 2012-02-08 03:00:00 | 16.9 |
| 2012-02-08 04:00:00 | 16.9 |
| 2012-02-08 05:00:00 | 16.64 |
| 2012-02-08 06:00:00 | 16.9 |
| 2012-02-08 07:00:00 | 17.42 |
| 2012-02-08 08:00:00 | 17.42 |
| 2012-02-08 09:00:00 | 17.94 |
| 2012-02-08 10:00:00 | 17.94 |
| 2012-02-08 11:00:00 | 17.94 |
| 2012-02-08 12:00:00 | 17.94 |
| 2012-02-08 13:00:00 | 18.2 |
| 2012-02-08 14:00:00 | 17.94 |
| 2012-02-08 15:00:00 | 18.2 |
| 2012-02-08 16:00:00 | 18.2 |
| 2012-02-08 17:00:00 | 17.68 |
| 2012-02-08 18:00:00 | 17.42 |
| 2012-02-08 19:00:00 | 18.2 |
| 2012-02-08 20:00:00 | 18.46 |
| 2012-02-08 21:00:00 | 20.02 |
| 2012-02-08 22:00:00 | 18.72 |
| 2012-02-08 23:00:00 | 18.72 |
| 2012-02-09 | 18.72 |
| 2012-02-09 01:00:00 | 18.46 |
| 2012-02-09 02:00:00 | 18.2 |
| 2012-02-09 03:00:00 | 17.42 |
| 2012-02-09 04:00:00 | 16.64 |
| 2012-02-09 05:00:00 | 17.16 |
| 2012-02-09 06:00:00 | 17.16 |
| 2012-02-09 07:00:00 | 17.68 |
| 2012-02-09 08:00:00 | 17.68 |
| 2012-02-09 09:00:00 | 17.94 |
| 2012-02-09 10:00:00 | 18.2 |
| 2012-02-09 11:00:00 | 18.2 |
| 2012-02-09 12:00:00 | 19.5 |
| 2012-02-09 13:00:00 | 17.94 |
| 2012-02-09 14:00:00 | 17.94 |
| 2012-02-09 15:00:00 | 17.94 |
| 2012-02-09 16:00:00 | 17.94 |
| 2012-02-09 17:00:00 | 17.94 |
| 2012-02-09 18:00:00 | 17.94 |
| 2012-02-09 19:00:00 | 18.46 |
| 2012-02-09 20:00:00 | 17.94 |
| 2012-02-09 21:00:00 | 18.2 |
| 2012-02-09 22:00:00 | 18.46 |
| 2012-02-09 23:00:00 | 17.94 |
| 2012-02-10 | 17.94 |
| 2012-02-10 01:00:00 | 16.9 |
| 2012-02-10 02:00:00 | 16.9 |
| 2012-02-10 03:00:00 | 16.38 |
| 2012-02-10 04:00:00 | 15.08 |
| 2012-02-10 05:00:00 | 15.6 |
| 2012-02-10 06:00:00 | 15.6 |
| 2012-02-10 07:00:00 | 15.86 |
| 2012-02-10 08:00:00 | 16.12 |
| 2012-02-10 09:00:00 | 16.9 |
| 2012-02-10 10:00:00 | 17.16 |
| 2012-02-10 11:00:00 | 16.9 |
| 2012-02-10 12:00:00 | 17.42 |
| 2012-02-10 13:00:00 | 16.9 |
| 2012-02-10 14:00:00 | 17.68 |
| 2012-02-10 15:00:00 | 17.42 |
| 2012-02-10 16:00:00 | 17.68 |
| 2012-02-10 17:00:00 | 16.64 |
| 2012-02-10 18:00:00 | 16.9 |
| 2012-02-10 19:00:00 | 17.16 |
| 2012-02-10 20:00:00 | 17.42 |
| 2012-02-10 21:00:00 | 17.42 |
| 2012-02-10 22:00:00 | 17.16 |
| 2012-02-10 23:00:00 | 17.16 |
| 2012-02-11 | 16.9 |
| 2012-02-11 01:00:00 | 16.38 |
| 2012-02-11 02:00:00 | 15.34 |
| 2012-02-11 03:00:00 | 15.34 |
| 2012-02-11 04:00:00 | 15.34 |
| 2012-02-11 05:00:00 | 14.82 |
| 2012-02-11 06:00:00 | 14.56 |
| 2012-02-11 07:00:00 | 15.34 |
| 2012-02-11 08:00:00 | 15.34 |
| 2012-02-11 09:00:00 | 16.12 |
| 2012-02-11 10:00:00 | 17.42 |
| 2012-02-11 11:00:00 | 17.42 |
| 2012-02-11 12:00:00 | 18.98 |
| 2012-02-11 13:00:00 | 17.94 |
| 2012-02-11 14:00:00 | 19.24 |
| 2012-02-11 15:00:00 | 17.42 |
| 2012-02-11 16:00:00 | 17.68 |
| 2012-02-11 17:00:00 | 17.68 |
| 2012-02-11 18:00:00 | 17.68 |
| 2012-02-11 19:00:00 | 17.42 |
| 2012-02-11 20:00:00 | 17.68 |
| 2012-02-11 21:00:00 | 17.42 |
| 2012-02-11 22:00:00 | 17.68 |
| 2012-02-11 23:00:00 | 17.68 |
| 2012-02-12 | 17.68 |
| 2012-02-12 01:00:00 | 16.64 |
| 2012-02-12 02:00:00 | 16.64 |
| 2012-02-12 03:00:00 | 15.86 |
| 2012-02-12 04:00:00 | 15.86 |
| 2012-02-12 05:00:00 | 15.6 |
| 2012-02-12 06:00:00 | 15.6 |
| 2012-02-12 07:00:00 | 16.12 |
| 2012-02-12 08:00:00 | 15.6 |
| 2012-02-12 09:00:00 | 16.9 |
| 2012-02-12 10:00:00 | 17.42 |
| 2012-02-12 11:00:00 | 17.68 |
| 2012-02-12 12:00:00 | 17.68 |
| 2012-02-12 13:00:00 | 19.5 |
| 2012-02-12 14:00:00 | 18.2 |
| 2012-02-12 15:00:00 | 18.46 |
| 2012-02-12 16:00:00 | 17.68 |
| 2012-02-12 17:00:00 | 17.94 |
| 2012-02-12 18:00:00 | 17.68 |
| 2012-02-12 19:00:00 | 17.68 |
| 2012-02-12 20:00:00 | 17.42 |
| 2012-02-12 21:00:00 | 17.94 |
| 2012-02-12 22:00:00 | 19.24 |
| 2012-02-12 23:00:00 | 17.94 |
| 2012-02-13 | 17.68 |
| 2012-02-13 01:00:00 | 17.16 |
| 2012-02-13 02:00:00 | 14.82 |
| 2012-02-13 03:00:00 | 14.82 |
| 2012-02-13 04:00:00 | 14.56 |
| 2012-02-13 05:00:00 | 14.56 |
| 2012-02-13 06:00:00 | 14.56 |
| 2012-02-13 07:00:00 | 14.82 |
| 2012-02-13 08:00:00 | 15.34 |
| 2012-02-13 09:00:00 | 16.12 |
| 2012-02-13 10:00:00 | 15.86 |
| 2012-02-13 11:00:00 | 16.12 |
| 2012-02-13 12:00:00 | 15.6 |
| 2012-02-13 13:00:00 | 16.12 |
| 2012-02-13 14:00:00 | 15.86 |
| 2012-02-13 15:00:00 | 16.9 |
| 2012-02-13 16:00:00 | 16.38 |
| 2012-02-13 17:00:00 | 16.12 |
| 2012-02-13 18:00:00 | 16.38 |
| 2012-02-13 19:00:00 | 16.64 |
| 2012-02-13 20:00:00 | 16.64 |
| 2012-02-13 21:00:00 | 18.72 |
| 2012-02-13 22:00:00 | 17.68 |
| 2012-02-13 23:00:00 | 16.9 |
| 2012-02-14 | 17.16 |
| 2012-02-14 01:00:00 | 15.86 |
| 2012-02-14 02:00:00 | 16.12 |
| 2012-02-14 03:00:00 | 15.86 |
| 2012-02-14 04:00:00 | 15.08 |
| 2012-02-14 05:00:00 | 15.86 |
| 2012-02-14 06:00:00 | 14.82 |
| 2012-02-14 07:00:00 | 15.86 |
| 2012-02-14 08:00:00 | 17.16 |
| 2012-02-14 09:00:00 | 16.64 |
| 2012-02-14 10:00:00 | 17.16 |
| 2012-02-14 11:00:00 | 18.46 |
| 2012-02-14 12:00:00 | 18.72 |
| 2012-02-14 13:00:00 | 17.94 |
| 2012-02-14 14:00:00 | 16.12 |
| 2012-02-14 15:00:00 | 17.16 |
| 2012-02-14 16:00:00 | 16.64 |
| 2012-02-14 17:00:00 | 17.16 |
| 2012-02-14 18:00:00 | 16.38 |
| 2012-02-14 19:00:00 | 16.64 |
| 2012-02-14 20:00:00 | 16.9 |
| 2012-02-14 21:00:00 | 17.68 |
| 2012-02-14 22:00:00 | 17.94 |
| 2012-02-14 23:00:00 | 17.68 |
| 2012-02-15 | 16.38 |
| 2012-02-15 01:00:00 | 16.64 |
| 2012-02-15 02:00:00 | 16.12 |
| 2012-02-15 03:00:00 | 15.34 |
| 2012-02-15 04:00:00 | 15.08 |
| 2012-02-15 05:00:00 | 14.82 |
| 2012-02-15 06:00:00 | 15.34 |
| 2012-02-15 07:00:00 | 16.12 |
| 2012-02-15 08:00:00 | 16.12 |
| 2012-02-15 09:00:00 | 17.42 |
| 2012-02-15 10:00:00 | 17.16 |
| 2012-02-15 11:00:00 | 17.42 |
| 2012-02-15 12:00:00 | 17.16 |
| 2012-02-15 13:00:00 | 15.86 |
| 2012-02-15 14:00:00 | 16.12 |
| 2012-02-15 15:00:00 | 16.12 |
| 2012-02-15 16:00:00 | 15.86 |
| 2012-02-15 17:00:00 | 15.34 |
| 2012-02-15 18:00:00 | 16.12 |
| 2012-02-15 19:00:00 | 16.9 |
| 2012-02-15 20:00:00 | 16.9 |
| 2012-02-15 21:00:00 | 17.94 |
| 2012-02-15 22:00:00 | 17.16 |
| 2012-02-15 23:00:00 | 17.16 |
| 2012-02-16 | 16.64 |
| 2012-02-16 01:00:00 | 16.64 |
| 2012-02-16 02:00:00 | 15.6 |
| 2012-02-16 03:00:00 | 14.56 |
| 2012-02-16 04:00:00 | 15.34 |
| 2012-02-16 05:00:00 | 14.56 |
| 2012-02-16 06:00:00 | 15.08 |
| 2012-02-16 07:00:00 | 15.6 |
| 2012-02-16 08:00:00 | 16.12 |
| 2012-02-16 09:00:00 | 16.64 |
| 2012-02-16 10:00:00 | 15.86 |
| 2012-02-16 11:00:00 | 16.38 |
| 2012-02-16 12:00:00 | 16.64 |
| 2012-02-16 13:00:00 | 15.86 |
| 2012-02-16 14:00:00 | 16.9 |
| 2012-02-16 15:00:00 | 16.64 |
| 2012-02-16 16:00:00 | 16.64 |
| 2012-02-16 17:00:00 | 16.38 |
| 2012-02-16 18:00:00 | 17.16 |
| 2012-02-16 19:00:00 | 16.38 |
| 2012-02-16 20:00:00 | 17.42 |
| 2012-02-16 21:00:00 | 16.64 |
| 2012-02-16 22:00:00 | 17.68 |
| 2012-02-16 23:00:00 | 16.9 |
| 2012-02-17 | 16.64 |
| 2012-02-17 01:00:00 | 15.86 |
| 2012-02-17 02:00:00 | 15.6 |
| 2012-02-17 03:00:00 | 14.56 |
| 2012-02-17 04:00:00 | 15.34 |
| 2012-02-17 05:00:00 | 15.08 |
| 2012-02-17 06:00:00 | 14.56 |
| 2012-02-17 07:00:00 | 15.86 |
| 2012-02-17 08:00:00 | 15.34 |
| 2012-02-17 09:00:00 | 16.38 |
| 2012-02-17 10:00:00 | 17.16 |
| 2012-02-17 11:00:00 | 16.12 |
| 2012-02-17 12:00:00 | 16.64 |
| 2012-02-17 13:00:00 | 16.12 |
| 2012-02-17 14:00:00 | 17.42 |
| 2012-02-17 15:00:00 | 17.68 |
| 2012-02-17 16:00:00 | 17.68 |
| 2012-02-17 17:00:00 | 17.42 |
| 2012-02-17 18:00:00 | 17.94 |
| 2012-02-17 19:00:00 | 17.94 |
| 2012-02-17 20:00:00 | 15.86 |
| 2012-02-17 21:00:00 | 15.6 |
| 2012-02-17 22:00:00 | 16.38 |
| 2012-02-17 23:00:00 | 15.6 |
| 2012-02-18 | 16.12 |
| 2012-02-18 01:00:00 | 16.12 |
| 2012-02-18 02:00:00 | 15.6 |
| 2012-02-18 03:00:00 | 15.08 |
| 2012-02-18 04:00:00 | 14.3 |
| 2012-02-18 05:00:00 | 14.3 |
| 2012-02-18 06:00:00 | 13.52 |
| 2012-02-18 07:00:00 | 14.3 |
| 2012-02-18 08:00:00 | 14.3 |
| 2012-02-18 09:00:00 | 14.3 |
| 2012-02-18 10:00:00 | 17.16 |
| 2012-02-18 11:00:00 | 22.1 |
| 2012-02-18 12:00:00 | 29.12 |
| 2012-02-18 13:00:00 | 35.62 |
| 2012-02-18 14:00:00 | 45.5 |
| 2012-02-18 15:00:00 | 51.74 |
| 2012-02-18 16:00:00 | 60.58 |
| 2012-02-18 17:00:00 | 40.82 |
| 2012-02-18 18:00:00 | 30.42 |
| 2012-02-18 19:00:00 | 26.26 |
| 2012-02-18 20:00:00 | 23.4 |
| 2012-02-18 21:00:00 | 22.1 |
| 2012-02-18 22:00:00 | 21.32 |
| 2012-02-18 23:00:00 | 17.68 |
| 2012-02-19 | 16.64 |
| 2012-02-19 01:00:00 | 15.34 |
| 2012-02-19 02:00:00 | 14.3 |
| 2012-02-19 03:00:00 | 13.78 |
| 2012-02-19 04:00:00 | 13.78 |
| 2012-02-19 05:00:00 | 13.52 |
| 2012-02-19 06:00:00 | 13 |
| 2012-02-19 07:00:00 | 12.48 |
| 2012-02-19 08:00:00 | 12.22 |
| 2012-02-19 09:00:00 | 13.26 |
| 2012-02-19 10:00:00 | 14.56 |
| 2012-02-19 11:00:00 | 16.38 |
| 2012-02-19 12:00:00 | 18.98 |
| 2012-02-19 13:00:00 | 23.14 |
| 2012-02-19 14:00:00 | 26.78 |
| 2012-02-19 15:00:00 | 28.08 |
| 2012-02-19 16:00:00 | 27.82 |
| 2012-02-19 17:00:00 | 27.56 |
| 2012-02-19 18:00:00 | 25.74 |
| 2012-02-19 19:00:00 | 41.6 |
| 2012-02-19 20:00:00 | 44.72 |
| 2012-02-19 21:00:00 | 34.84 |
| 2012-02-19 22:00:00 | 28.08 |
| 2012-02-19 23:00:00 | 28.34 |
| 2012-02-20 | 22.62 |
| 2012-02-20 01:00:00 | 17.68 |
| 2012-02-20 02:00:00 | 15.86 |
| 2012-02-20 03:00:00 | 14.82 |
| 2012-02-20 04:00:00 | 14.56 |
| 2012-02-20 05:00:00 | 13.78 |
| 2012-02-20 06:00:00 | 13.78 |
| 2012-02-20 07:00:00 | 13.78 |
| 2012-02-20 08:00:00 | 14.82 |
| 2012-02-20 09:00:00 | 15.08 |
| 2012-02-20 10:00:00 | 15.08 |
| 2012-02-20 11:00:00 | 14.82 |
| 2012-02-20 12:00:00 | 15.86 |
| 2012-02-20 13:00:00 | 17.42 |
| 2012-02-20 14:00:00 | 19.5 |
| 2012-02-20 15:00:00 | 19.76 |
| 2012-02-20 16:00:00 | 19.76 |
| 2012-02-20 17:00:00 | 19.24 |
| 2012-02-20 18:00:00 | 17.42 |
| 2012-02-20 19:00:00 | 16.12 |
| 2012-02-20 20:00:00 | 17.94 |
| 2012-02-20 21:00:00 | 18.46 |
| 2012-02-20 22:00:00 | 18.46 |
| 2012-02-20 23:00:00 | 18.72 |
| 2012-02-21 | 17.16 |
| 2012-02-21 01:00:00 | 16.38 |
| 2012-02-21 02:00:00 | 16.12 |
| 2012-02-21 03:00:00 | 15.08 |
| 2012-02-21 04:00:00 | 15.08 |
| 2012-02-21 05:00:00 | 15.86 |
| 2012-02-21 06:00:00 | 14.82 |
| 2012-02-21 07:00:00 | 15.08 |
| 2012-02-21 08:00:00 | 16.64 |
| 2012-02-21 09:00:00 | 17.16 |
| 2012-02-21 10:00:00 | 16.9 |
| 2012-02-21 11:00:00 | 15.34 |
| 2012-02-21 12:00:00 | 14.56 |
| 2012-02-21 13:00:00 | 14.56 |
| 2012-02-21 14:00:00 | 15.34 |
| 2012-02-21 15:00:00 | 15.86 |
| 2012-02-21 16:00:00 | 17.16 |
| 2012-02-21 17:00:00 | 15.6 |
| 2012-02-21 18:00:00 | 15.6 |
| 2012-02-21 19:00:00 | 14.82 |
| 2012-02-21 20:00:00 | 14.82 |
| 2012-02-21 21:00:00 | 15.6 |
| 2012-02-21 22:00:00 | 15.86 |
| 2012-02-21 23:00:00 | 14.82 |
| 2012-02-22 | 14.04 |
| 2012-02-22 01:00:00 | 13.78 |
| 2012-02-22 02:00:00 | 13 |
| 2012-02-22 03:00:00 | 12.48 |
| 2012-02-22 04:00:00 | 11.96 |
| 2012-02-22 05:00:00 | 12.48 |
| 2012-02-22 06:00:00 | 12.74 |
| 2012-02-22 07:00:00 | 12.74 |
| 2012-02-22 08:00:00 | 14.56 |
| 2012-02-22 09:00:00 | 14.82 |
| 2012-02-22 10:00:00 | 14.3 |
| 2012-02-22 11:00:00 | 15.86 |
| 2012-02-22 12:00:00 | 15.86 |
| 2012-02-22 13:00:00 | 15.86 |
| 2012-02-22 14:00:00 | 18.2 |
| 2012-02-22 15:00:00 | 21.58 |
| 2012-02-22 16:00:00 | 21.58 |
| 2012-02-22 17:00:00 | 22.62 |
| 2012-02-22 18:00:00 | 20.8 |
| 2012-02-22 19:00:00 | 19.5 |
| 2012-02-22 20:00:00 | 18.98 |
| 2012-02-22 21:00:00 | 18.72 |
| 2012-02-22 22:00:00 | 17.16 |
| 2012-02-22 23:00:00 | 18.2 |
| 2012-02-23 | 15.6 |
| 2012-02-23 01:00:00 | 15.6 |
| 2012-02-23 02:00:00 | 14.04 |
| 2012-02-23 03:00:00 | 14.3 |
| 2012-02-23 04:00:00 | 13.26 |
| 2012-02-23 05:00:00 | 13.78 |
| 2012-02-23 06:00:00 | 13.26 |
| 2012-02-23 07:00:00 | 13.78 |
| 2012-02-23 08:00:00 | 14.3 |
| 2012-02-23 09:00:00 | 15.86 |
| 2012-02-23 10:00:00 | 17.94 |
| 2012-02-23 11:00:00 | 16.64 |
| 2012-02-23 12:00:00 | 17.42 |
| 2012-02-23 13:00:00 | 23.4 |
| 2012-02-23 14:00:00 | 24.96 |
| 2012-02-23 15:00:00 | 24.7 |
| 2012-02-23 16:00:00 | 24.96 |
| 2012-02-23 17:00:00 | 24.44 |
| 2012-02-23 18:00:00 | 25.48 |
| 2012-02-23 19:00:00 | 25.48 |
| 2012-02-23 20:00:00 | 25.22 |
| 2012-02-23 21:00:00 | 24.44 |
| 2012-02-23 22:00:00 | 22.62 |
| 2012-02-23 23:00:00 | 21.58 |
| 2012-02-24 | 19.5 |
| 2012-02-24 01:00:00 | 17.94 |
| 2012-02-24 02:00:00 | 15.86 |
| 2012-02-24 03:00:00 | 15.86 |
| 2012-02-24 04:00:00 | 15.6 |
| 2012-02-24 05:00:00 | 15.86 |
| 2012-02-24 06:00:00 | 17.16 |
| 2012-02-24 07:00:00 | 19.76 |
| 2012-02-24 08:00:00 | 24.18 |
| 2012-02-24 09:00:00 | 26.78 |
| 2012-02-24 10:00:00 | 28.86 |
| 2012-02-24 11:00:00 | 65 |
| 2012-02-24 12:00:00 | 65.52 |
| 2012-02-24 13:00:00 | 48.1 |
| 2012-02-24 14:00:00 | 45.24 |
| 2012-02-24 15:00:00 | 42.38 |
| 2012-02-24 16:00:00 | 39.26 |
| 2012-02-24 17:00:00 | 34.32 |
| 2012-02-24 18:00:00 | 31.2 |
| 2012-02-24 19:00:00 | 29.38 |
| 2012-02-24 20:00:00 | 26.78 |
| 2012-02-24 21:00:00 | 25.74 |
| 2012-02-24 22:00:00 | 24.7 |
| 2012-02-24 23:00:00 | 23.4 |
| 2012-02-25 | 23.14 |
| 2012-02-25 01:00:00 | 22.62 |
| 2012-02-25 02:00:00 | 22.62 |
| 2012-02-25 03:00:00 | 24.44 |
| 2012-02-25 04:00:00 | 56.68 |
| 2012-02-25 05:00:00 | 47.84 |
| 2012-02-25 06:00:00 | 31.46 |
| 2012-02-25 07:00:00 | 28.34 |
| 2012-02-25 08:00:00 | 27.3 |
| 2012-02-25 09:00:00 | 26.78 |
| 2012-02-25 10:00:00 | 27.3 |
| 2012-02-25 11:00:00 | 27.3 |
| 2012-02-25 12:00:00 | 26.52 |
| 2012-02-25 13:00:00 | 26.26 |
| 2012-02-25 14:00:00 | 26 |
| 2012-02-25 15:00:00 | 24.96 |
| 2012-02-25 16:00:00 | 24.44 |
| 2012-02-25 17:00:00 | 24.18 |
| 2012-02-25 18:00:00 | 23.4 |
| 2012-02-25 19:00:00 | 23.14 |
| 2012-02-25 20:00:00 | 23.14 |
| 2012-02-25 21:00:00 | 22.88 |
| 2012-02-25 22:00:00 | 22.62 |
| 2012-02-25 23:00:00 | 19.76 |
| 2012-02-26 | 18.98 |
| 2012-02-26 01:00:00 | 17.68 |
| 2012-02-26 02:00:00 | 17.68 |
| 2012-02-26 03:00:00 | 16.38 |
| 2012-02-26 04:00:00 | 16.38 |
| 2012-02-26 05:00:00 | 15.08 |
| 2012-02-26 06:00:00 | 16.12 |
| 2012-02-26 07:00:00 | 15.08 |
| 2012-02-26 08:00:00 | 17.42 |
| 2012-02-26 09:00:00 | 19.5 |
| 2012-02-26 10:00:00 | 20.02 |
| 2012-02-26 11:00:00 | 19.76 |
| 2012-02-26 12:00:00 | 19.76 |
| 2012-02-26 13:00:00 | 19.5 |
| 2012-02-26 14:00:00 | 19.5 |
| 2012-02-26 15:00:00 | 18.98 |
| 2012-02-26 16:00:00 | 18.72 |
| 2012-02-26 17:00:00 | 18.72 |
| 2012-02-26 18:00:00 | 18.2 |
| 2012-02-26 19:00:00 | 18.2 |
| 2012-02-26 20:00:00 | 18.2 |
| 2012-02-26 21:00:00 | 19.24 |
| 2012-02-26 22:00:00 | 17.94 |
| 2012-02-26 23:00:00 | 20.8 |
| 2012-02-27 | 18.98 |
| 2012-02-27 01:00:00 | 17.16 |
| 2012-02-27 02:00:00 | 16.9 |
| 2012-02-27 03:00:00 | 15.86 |
| 2012-02-27 04:00:00 | 16.12 |
| 2012-02-27 05:00:00 | 15.6 |
| 2012-02-27 06:00:00 | 16.64 |
| 2012-02-27 07:00:00 | 16.64 |
| 2012-02-27 08:00:00 | 16.64 |
| 2012-02-27 09:00:00 | 16.9 |
| 2012-02-27 10:00:00 | 16.64 |
| 2012-02-27 11:00:00 | 14.3 |
| 2012-02-27 12:00:00 | 14.3 |
| 2012-02-27 13:00:00 | 14.3 |
| 2012-02-27 14:00:00 | 14.3 |
| 2012-02-27 15:00:00 | 14.04 |
| 2012-02-27 16:00:00 | 14.3 |
| 2012-02-27 17:00:00 | 14.3 |
| 2012-02-27 18:00:00 | 14.56 |
| 2012-02-27 19:00:00 | 14.56 |
| 2012-02-27 20:00:00 | 14.3 |
| 2012-02-27 21:00:00 | 14.3 |
| 2012-02-27 22:00:00 | 18.2 |
| 2012-02-27 23:00:00 | 17.16 |
| 2012-02-28 | 17.42 |
| 2012-02-28 01:00:00 | 17.42 |
| 2012-02-28 02:00:00 | 15.86 |
| 2012-02-28 03:00:00 | 15.6 |
| 2012-02-28 04:00:00 | 15.08 |
| 2012-02-28 05:00:00 | 15.6 |
| 2012-02-28 06:00:00 | 15.6 |
| 2012-02-28 07:00:00 | 15.86 |
| 2012-02-28 08:00:00 | 16.38 |
| 2012-02-28 09:00:00 | 16.9 |
| 2012-02-28 10:00:00 | 16.9 |
| 2012-02-28 11:00:00 | 15.34 |
| 2012-02-28 12:00:00 | 16.12 |
| 2012-02-28 13:00:00 | 22.88 |
| 2012-02-28 14:00:00 | 36.92 |
| 2012-02-28 15:00:00 | 37.96 |
| 2012-02-28 16:00:00 | 41.6 |
| 2012-02-28 17:00:00 | 48.88 |
| 2012-02-28 18:00:00 | 60.58 |
| 2012-02-28 19:00:00 | 78.26 |
| 2012-02-28 20:00:00 | 49.66 |
| 2012-02-28 21:00:00 | 50.44 |
| 2012-02-28 22:00:00 | 52 |
| 2012-02-28 23:00:00 | 58.76 |
| 2012-02-29 | 66.04 |
| 2012-02-29 01:00:00 | 50.18 |
| 2012-02-29 02:00:00 | 46.28 |
| 2012-02-29 03:00:00 | 50.44 |
| 2012-02-29 04:00:00 | 72.02 |
| 2012-02-29 05:00:00 | 92.3 |
| 2012-02-29 06:00:00 | 70.2 |
| 2012-02-29 07:00:00 | 48.88 |
| 2012-02-29 08:00:00 | 43.94 |
| 2012-02-29 09:00:00 | 39.78 |
| 2012-02-29 10:00:00 | 37.44 |
| 2012-02-29 11:00:00 | 36.14 |
| 2012-02-29 12:00:00 | 33.54 |
| 2012-02-29 13:00:00 | 33.28 |
| 2012-02-29 14:00:00 | 32.76 |
| 2012-02-29 15:00:00 | 31.46 |
| 2012-02-29 16:00:00 | 30.94 |
| 2012-02-29 17:00:00 | 30.42 |
| 2012-02-29 18:00:00 | 30.16 |
| 2012-02-29 19:00:00 | 29.9 |
| 2012-02-29 20:00:00 | 29.9 |
| 2012-02-29 21:00:00 | 29.9 |
| 2012-02-29 22:00:00 | 28.86 |
| 2012-02-29 23:00:00 | 28.34 |
| 2012-03-01 | 26.78 |
| 2012-03-01 01:00:00 | 25.74 |
| 2012-03-01 02:00:00 | 24.7 |
| 2012-03-01 03:00:00 | 23.92 |
| 2012-03-01 04:00:00 | 24.96 |
| 2012-03-01 05:00:00 | 27.04 |
| 2012-03-01 06:00:00 | 28.34 |
| 2012-03-01 07:00:00 | 30.94 |
| 2012-03-01 08:00:00 | 31.2 |
| 2012-03-01 09:00:00 | 28.34 |
| 2012-03-01 10:00:00 | 26.78 |
| 2012-03-01 11:00:00 | 26.78 |
| 2012-03-01 12:00:00 | 25.74 |
| 2012-03-01 13:00:00 | 28.86 |
| 2012-03-01 14:00:00 | 33.02 |
| 2012-03-01 15:00:00 | 31.2 |
| 2012-03-01 16:00:00 | 27.82 |
| 2012-03-01 17:00:00 | 27.3 |
| 2012-03-01 18:00:00 | 27.04 |
| 2012-03-01 19:00:00 | 26.52 |
| 2012-03-01 20:00:00 | 27.3 |
| 2012-03-01 21:00:00 | 27.3 |
| 2012-03-01 22:00:00 | 28.08 |
| 2012-03-01 23:00:00 | 29.9 |
| 2012-03-02 | 26 |
| 2012-03-02 01:00:00 | 24.44 |
| 2012-03-02 02:00:00 | 23.14 |
| 2012-03-02 03:00:00 | 22.88 |
| 2012-03-02 04:00:00 | 22.62 |
| 2012-03-02 05:00:00 | 22.36 |
| 2012-03-02 06:00:00 | 22.36 |
| 2012-03-02 07:00:00 | 24.44 |
| 2012-03-02 08:00:00 | 24.7 |
| 2012-03-02 09:00:00 | 23.92 |
| 2012-03-02 10:00:00 | 23.66 |
| 2012-03-02 11:00:00 | 23.4 |
| 2012-03-02 12:00:00 | 24.7 |
| 2012-03-02 13:00:00 | 23.4 |
| 2012-03-02 14:00:00 | 22.62 |
| 2012-03-02 15:00:00 | 24.7 |
| 2012-03-02 16:00:00 | 24.7 |
| 2012-03-02 17:00:00 | 24.44 |
| 2012-03-02 18:00:00 | 23.66 |
| 2012-03-02 19:00:00 | 22.88 |
| 2012-03-02 20:00:00 | 25.22 |
| 2012-03-02 21:00:00 | 26 |
| 2012-03-02 22:00:00 | 25.22 |
| 2012-03-02 23:00:00 | 24.7 |
| 2012-03-03 | 22.88 |
| 2012-03-03 01:00:00 | 23.14 |
| 2012-03-03 02:00:00 | 23.14 |
| 2012-03-03 03:00:00 | 21.58 |
| 2012-03-03 04:00:00 | 21.84 |
| 2012-03-03 05:00:00 | 22.36 |
| 2012-03-03 06:00:00 | 21.32 |
| 2012-03-03 07:00:00 | 21.58 |
| 2012-03-03 08:00:00 | 23.92 |
| 2012-03-03 09:00:00 | 20.8 |
| 2012-03-03 10:00:00 | 23.14 |
| 2012-03-03 11:00:00 | 22.88 |
| 2012-03-03 12:00:00 | 26.78 |
| 2012-03-03 13:00:00 | 24.96 |
| 2012-03-03 14:00:00 | 25.22 |
| 2012-03-03 15:00:00 | 23.14 |
| 2012-03-03 16:00:00 | 24.96 |
| 2012-03-03 17:00:00 | 23.4 |
| 2012-03-03 18:00:00 | 22.36 |
| 2012-03-03 19:00:00 | 22.36 |
| 2012-03-03 20:00:00 | 22.62 |
| 2012-03-03 21:00:00 | 26.26 |
| 2012-03-03 22:00:00 | 22.62 |
| 2012-03-03 23:00:00 | 21.06 |
| 2012-03-04 | 23.14 |
| 2012-03-04 01:00:00 | 23.66 |
| 2012-03-04 02:00:00 | 25.22 |
| 2012-03-04 03:00:00 | 21.58 |
| 2012-03-04 04:00:00 | 21.84 |
| 2012-03-04 05:00:00 | 20.8 |
| 2012-03-04 06:00:00 | 21.06 |
| 2012-03-04 07:00:00 | 22.1 |
| 2012-03-04 08:00:00 | 23.92 |
| 2012-03-04 09:00:00 | 23.14 |
| 2012-03-04 10:00:00 | 22.88 |
| 2012-03-04 11:00:00 | 22.1 |
| 2012-03-04 12:00:00 | 22.36 |
| 2012-03-04 13:00:00 | 23.14 |
| 2012-03-04 14:00:00 | 22.1 |
| 2012-03-04 15:00:00 | 24.7 |
| 2012-03-04 16:00:00 | 20.54 |
| 2012-03-04 17:00:00 | 20.28 |
| 2012-03-04 18:00:00 | 20.28 |
| 2012-03-04 19:00:00 | 21.06 |
| 2012-03-04 20:00:00 | 22.88 |
| 2012-03-04 21:00:00 | 24.44 |
| 2012-03-04 22:00:00 | 19.5 |
| 2012-03-04 23:00:00 | 20.8 |
| 2012-03-05 | 20.54 |
| 2012-03-05 01:00:00 | 18.98 |
| 2012-03-05 02:00:00 | 20.54 |
| 2012-03-05 03:00:00 | 20.8 |
| 2012-03-05 04:00:00 | 20.02 |
| 2012-03-05 05:00:00 | 17.68 |
| 2012-03-05 06:00:00 | 21.06 |
| 2012-03-05 07:00:00 | 22.1 |
| 2012-03-05 08:00:00 | 22.62 |
| 2012-03-05 09:00:00 | 20.02 |
| 2012-03-05 10:00:00 | 21.84 |
| 2012-03-05 11:00:00 | 20.54 |
| 2012-03-05 12:00:00 | 18.46 |
| 2012-03-05 13:00:00 | 17.94 |
| 2012-03-05 14:00:00 | 16.12 |
| 2012-03-05 15:00:00 | 18.2 |
| 2012-03-05 16:00:00 | 20.02 |
| 2012-03-05 17:00:00 | 18.2 |
| 2012-03-05 18:00:00 | 15.6 |
| 2012-03-05 19:00:00 | 18.72 |
| 2012-03-05 20:00:00 | 19.5 |
| 2012-03-05 21:00:00 | 20.02 |
| 2012-03-05 22:00:00 | 19.24 |
| 2012-03-05 23:00:00 | 21.32 |
| 2012-03-06 | 21.06 |
| 2012-03-06 01:00:00 | 17.94 |
| 2012-03-06 02:00:00 | 17.68 |
| 2012-03-06 03:00:00 | 19.24 |
| 2012-03-06 04:00:00 | 20.8 |
| 2012-03-06 05:00:00 | 17.42 |
| 2012-03-06 06:00:00 | 17.42 |
| 2012-03-06 07:00:00 | 18.98 |
| 2012-03-06 08:00:00 | 21.58 |
| 2012-03-06 09:00:00 | 22.36 |
| 2012-03-06 10:00:00 | 18.98 |
| 2012-03-06 11:00:00 | 22.36 |
| 2012-03-06 12:00:00 | 23.66 |
| 2012-03-06 13:00:00 | 20.54 |
| 2012-03-06 14:00:00 | 17.68 |
| 2012-03-06 15:00:00 | 20.54 |
| 2012-03-06 16:00:00 | 20.8 |
| 2012-03-06 17:00:00 | 20.02 |
| 2012-03-06 18:00:00 | 18.2 |
| 2012-03-06 19:00:00 | 18.46 |
| 2012-03-06 20:00:00 | 23.4 |
| 2012-03-06 21:00:00 | 23.92 |
| 2012-03-06 22:00:00 | 23.66 |
| 2012-03-06 23:00:00 | 22.62 |
| 2012-03-07 | 21.58 |
| 2012-03-07 01:00:00 | 18.46 |
| 2012-03-07 02:00:00 | 20.02 |
| 2012-03-07 03:00:00 | 18.46 |
| 2012-03-07 04:00:00 | 18.2 |
| 2012-03-07 05:00:00 | 17.68 |
| 2012-03-07 06:00:00 | 19.76 |
| 2012-03-07 07:00:00 | 20.54 |
| 2012-03-07 08:00:00 | 18.98 |
| 2012-03-07 09:00:00 | 22.88 |
| 2012-03-07 10:00:00 | 22.88 |
| 2012-03-07 11:00:00 | 18.98 |
| 2012-03-07 12:00:00 | 18.2 |
| 2012-03-07 13:00:00 | 20.02 |
| 2012-03-07 14:00:00 | 19.76 |
| 2012-03-07 15:00:00 | 18.98 |
| 2012-03-07 16:00:00 | 18.72 |
| 2012-03-07 17:00:00 | 18.98 |
| 2012-03-07 18:00:00 | 17.16 |
| 2012-03-07 19:00:00 | 18.72 |
| 2012-03-07 20:00:00 | 18.98 |
| 2012-03-07 21:00:00 | 20.02 |
| 2012-03-07 22:00:00 | 20.28 |
| 2012-03-07 23:00:00 | 23.14 |
| 2012-03-08 | 21.06 |
| 2012-03-08 01:00:00 | 20.8 |
| 2012-03-08 02:00:00 | 17.94 |
| 2012-03-08 03:00:00 | 17.42 |
| 2012-03-08 04:00:00 | 18.46 |
| 2012-03-08 05:00:00 | 17.16 |
| 2012-03-08 06:00:00 | 17.42 |
| 2012-03-08 07:00:00 | 18.2 |
| 2012-03-08 08:00:00 | 21.84 |
| 2012-03-08 09:00:00 | 19.24 |
| 2012-03-08 10:00:00 | 16.12 |
| 2012-03-08 11:00:00 | 19.5 |
| 2012-03-08 12:00:00 | 19.5 |
| 2012-03-08 13:00:00 | 16.12 |
| 2012-03-08 14:00:00 | 19.24 |
| 2012-03-08 15:00:00 | 17.68 |
| 2012-03-08 16:00:00 | 19.5 |
| 2012-03-08 17:00:00 | 17.16 |
| 2012-03-08 18:00:00 | 16.12 |
| 2012-03-08 19:00:00 | 19.24 |
| 2012-03-08 20:00:00 | 17.94 |
| 2012-03-08 21:00:00 | 17.68 |
| 2012-03-08 22:00:00 | 18.46 |
| 2012-03-08 23:00:00 | 20.28 |
| 2012-03-09 | 17.94 |
| 2012-03-09 01:00:00 | 17.94 |
| 2012-03-09 02:00:00 | 15.08 |
| 2012-03-09 03:00:00 | 16.12 |
| 2012-03-09 04:00:00 | 15.86 |
| 2012-03-09 05:00:00 | 15.08 |
| 2012-03-09 06:00:00 | 15.08 |
| 2012-03-09 07:00:00 | 17.16 |
| 2012-03-09 08:00:00 | 19.24 |
| 2012-03-09 09:00:00 | 17.68 |
| 2012-03-09 10:00:00 | 20.8 |
| 2012-03-09 11:00:00 | 20.8 |
| 2012-03-09 12:00:00 | 26.52 |
| 2012-03-09 13:00:00 | 26 |
| 2012-03-09 14:00:00 | 21.32 |
| 2012-03-09 15:00:00 | 20.54 |
| 2012-03-09 16:00:00 | 18.46 |
| 2012-03-09 17:00:00 | 16.38 |
| 2012-03-09 18:00:00 | 18.2 |
| 2012-03-09 19:00:00 | 17.94 |
| 2012-03-09 20:00:00 | 18.2 |
| 2012-03-09 21:00:00 | 17.94 |
| 2012-03-09 22:00:00 | 19.5 |
| 2012-03-09 23:00:00 | 20.8 |
| 2012-03-10 | 20.8 |
| 2012-03-10 01:00:00 | 20.28 |
| 2012-03-10 02:00:00 | 17.94 |
| 2012-03-10 03:00:00 | 18.2 |
| 2012-03-10 04:00:00 | 18.2 |
| 2012-03-10 05:00:00 | 18.2 |
| 2012-03-10 06:00:00 | 18.2 |
| 2012-03-10 07:00:00 | 16.64 |
| 2012-03-10 08:00:00 | 18.46 |
| 2012-03-10 09:00:00 | 16.9 |
| 2012-03-10 10:00:00 | 16.12 |
| 2012-03-10 11:00:00 | 17.68 |
| 2012-03-10 12:00:00 | 17.68 |
| 2012-03-10 13:00:00 | 20.54 |
| 2012-03-10 14:00:00 | 17.94 |
| 2012-03-10 15:00:00 | 16.12 |
| 2012-03-10 16:00:00 | 16.38 |
| 2012-03-10 17:00:00 | 18.46 |
| 2012-03-10 18:00:00 | 16.38 |
| 2012-03-10 19:00:00 | 16.38 |
| 2012-03-10 20:00:00 | 16.38 |
| 2012-03-10 21:00:00 | 16.38 |
| 2012-03-10 22:00:00 | 23.4 |
| 2012-03-10 23:00:00 | 25.22 |
| 2012-03-11 | 20.54 |
| 2012-03-11 01:00:00 | 17.42 |
| 2012-03-11 02:00:00 | 15.34 |
| 2012-03-11 03:00:00 | 15.34 |
| 2012-03-11 04:00:00 | 14.3 |
| 2012-03-11 05:00:00 | 14.56 |
| 2012-03-11 06:00:00 | 15.08 |
| 2012-03-11 07:00:00 | 19.24 |
| 2012-03-11 08:00:00 | 17.42 |
| 2012-03-11 09:00:00 | 19.24 |
| 2012-03-11 10:00:00 | 23.4 |
| 2012-03-11 11:00:00 | 23.66 |
| 2012-03-11 12:00:00 | 19.76 |
| 2012-03-11 13:00:00 | 20.54 |
| 2012-03-11 14:00:00 | 22.1 |
| 2012-03-11 15:00:00 | 19.5 |
| 2012-03-11 16:00:00 | 20.28 |
| 2012-03-11 17:00:00 | 18.98 |
| 2012-03-11 18:00:00 | 19.24 |
| 2012-03-11 19:00:00 | 17.94 |
| 2012-03-11 20:00:00 | 18.46 |
| 2012-03-11 21:00:00 | 20.28 |
| 2012-03-11 22:00:00 | 22.88 |
| 2012-03-11 23:00:00 | 18.46 |
| 2012-03-12 | 18.98 |
| 2012-03-12 01:00:00 | 16.9 |
| 2012-03-12 02:00:00 | 16.38 |
| 2012-03-12 03:00:00 | 16.38 |
| 2012-03-12 04:00:00 | 14.56 |
| 2012-03-12 05:00:00 | 14.82 |
| 2012-03-12 06:00:00 | 17.16 |
| 2012-03-12 07:00:00 | 14.82 |
| 2012-03-12 08:00:00 | 15.34 |
| 2012-03-12 09:00:00 | 20.02 |
| 2012-03-12 10:00:00 | 22.36 |
| 2012-03-12 11:00:00 | 23.66 |
| 2012-03-12 12:00:00 | 21.32 |
| 2012-03-12 13:00:00 | 20.8 |
| 2012-03-12 14:00:00 | 19.5 |
| 2012-03-12 15:00:00 | 20.02 |
| 2012-03-12 16:00:00 | 21.84 |
| 2012-03-12 17:00:00 | 22.36 |
| 2012-03-12 18:00:00 | 20.54 |
| 2012-03-12 19:00:00 | 23.66 |
| 2012-03-12 20:00:00 | 24.18 |
| 2012-03-12 21:00:00 | 24.7 |
| 2012-03-12 22:00:00 | 22.1 |
| 2012-03-12 23:00:00 | 27.04 |
| 2012-03-13 | 27.82 |
| 2012-03-13 01:00:00 | 26 |
| 2012-03-13 02:00:00 | 23.4 |
| 2012-03-13 03:00:00 | 20.28 |
| 2012-03-13 04:00:00 | 22.62 |
| 2012-03-13 05:00:00 | 20.8 |
| 2012-03-13 06:00:00 | 23.66 |
| 2012-03-13 07:00:00 | 23.14 |
| 2012-03-13 08:00:00 | 19.5 |
| 2012-03-13 09:00:00 | 20.54 |
| 2012-03-13 10:00:00 | 26.52 |
| 2012-03-13 11:00:00 | 23.92 |
| 2012-03-13 12:00:00 | 17.68 |
| 2012-03-13 13:00:00 | 21.06 |
| 2012-03-13 14:00:00 | 22.88 |
| 2012-03-13 15:00:00 | 19.76 |
| 2012-03-13 16:00:00 | 17.42 |
| 2012-03-13 17:00:00 | 20.8 |
| 2012-03-13 18:00:00 | 22.36 |
| 2012-03-13 19:00:00 | 17.68 |
| 2012-03-13 20:00:00 | 22.1 |
| 2012-03-13 21:00:00 | 21.32 |
| 2012-03-13 22:00:00 | 21.06 |
| 2012-03-13 23:00:00 | 20.02 |
| 2012-03-14 | 23.4 |
| 2012-03-14 01:00:00 | 17.68 |
| 2012-03-14 02:00:00 | 18.2 |
| 2012-03-14 03:00:00 | 17.68 |
| 2012-03-14 04:00:00 | 20.02 |
| 2012-03-14 05:00:00 | 17.42 |
| 2012-03-14 06:00:00 | 17.68 |
| 2012-03-14 07:00:00 | 20.02 |
| 2012-03-14 08:00:00 | 20.54 |
| 2012-03-14 09:00:00 | 19.76 |
| 2012-03-14 10:00:00 | 22.1 |
| 2012-03-14 11:00:00 | 21.84 |
| 2012-03-14 12:00:00 | 19.5 |
| 2012-03-14 13:00:00 | 20.02 |
| 2012-03-14 14:00:00 | 19.24 |
| 2012-03-14 15:00:00 | 17.16 |
| 2012-03-14 16:00:00 | 20.54 |
| 2012-03-14 17:00:00 | 21.32 |
| 2012-03-14 18:00:00 | 16.64 |
| 2012-03-14 19:00:00 | 20.28 |
| 2012-03-14 20:00:00 | 21.84 |
| 2012-03-14 21:00:00 | 18.2 |
| 2012-03-14 22:00:00 | 19.76 |
| 2012-03-14 23:00:00 | 20.8 |
| 2012-03-15 | 18.46 |
| 2012-03-15 01:00:00 | 18.72 |
| 2012-03-15 02:00:00 | 16.64 |
| 2012-03-15 03:00:00 | 17.16 |
| 2012-03-15 04:00:00 | 15.34 |
| 2012-03-15 05:00:00 | 16.64 |
| 2012-03-15 06:00:00 | 18.2 |
| 2012-03-15 07:00:00 | 16.38 |
| 2012-03-15 08:00:00 | 18.72 |
| 2012-03-15 09:00:00 | 19.76 |
| 2012-03-15 10:00:00 | 17.94 |
| 2012-03-15 11:00:00 | 21.06 |
| 2012-03-15 12:00:00 | 18.72 |
| 2012-03-15 13:00:00 | 17.42 |
| 2012-03-15 14:00:00 | 18.98 |
| 2012-03-15 15:00:00 | 18.46 |
| 2012-03-15 16:00:00 | 18.46 |
| 2012-03-15 17:00:00 | 15.6 |
| 2012-03-15 18:00:00 | 17.68 |
| 2012-03-15 19:00:00 | 19.76 |
| 2012-03-15 20:00:00 | 15.86 |
| 2012-03-15 21:00:00 | 17.68 |
| 2012-03-15 22:00:00 | 20.28 |
| 2012-03-15 23:00:00 | 18.2 |
| 2012-03-16 | 17.16 |
| 2012-03-16 01:00:00 | 16.12 |
| 2012-03-16 02:00:00 | 18.46 |
| 2012-03-16 03:00:00 | 17.42 |
| 2012-03-16 04:00:00 | 15.34 |
| 2012-03-16 05:00:00 | 15.08 |
| 2012-03-16 06:00:00 | 15.34 |
| 2012-03-16 07:00:00 | 17.94 |
| 2012-03-16 08:00:00 | 16.9 |
| 2012-03-16 09:00:00 | 17.42 |
| 2012-03-16 10:00:00 | 17.68 |
| 2012-03-16 11:00:00 | 18.98 |
| 2012-03-16 12:00:00 | 21.06 |
| 2012-03-16 13:00:00 | 17.68 |
| 2012-03-16 14:00:00 | 17.68 |
| 2012-03-16 15:00:00 | 18.98 |
| 2012-03-16 16:00:00 | 18.72 |
| 2012-03-16 17:00:00 | 17.68 |
| 2012-03-16 18:00:00 | 16.12 |
| 2012-03-16 19:00:00 | 16.9 |
| 2012-03-16 20:00:00 | 19.5 |
| 2012-03-16 21:00:00 | 19.24 |
| 2012-03-16 22:00:00 | 16.9 |
| 2012-03-16 23:00:00 | 18.98 |
| 2012-03-17 | 17.68 |
| 2012-03-17 01:00:00 | 16.38 |
| 2012-03-17 02:00:00 | 15.34 |
| 2012-03-17 03:00:00 | 15.6 |
| 2012-03-17 04:00:00 | 14.3 |
| 2012-03-17 05:00:00 | 15.86 |
| 2012-03-17 06:00:00 | 13.78 |
| 2012-03-17 07:00:00 | 13.52 |
| 2012-03-17 08:00:00 | 16.38 |
| 2012-03-17 09:00:00 | 15.6 |
| 2012-03-17 10:00:00 | 16.64 |
| 2012-03-17 11:00:00 | 16.38 |
| 2012-03-17 12:00:00 | 19.5 |
| 2012-03-17 13:00:00 | 19.24 |
| 2012-03-17 14:00:00 | 16.12 |
| 2012-03-17 15:00:00 | 16.12 |
| 2012-03-17 16:00:00 | 16.12 |
| 2012-03-17 17:00:00 | 18.72 |
| 2012-03-17 18:00:00 | 14.82 |
| 2012-03-17 19:00:00 | 16.38 |
| 2012-03-17 20:00:00 | 16.12 |
| 2012-03-17 21:00:00 | 16.38 |
| 2012-03-17 22:00:00 | 16.12 |
| 2012-03-17 23:00:00 | 18.72 |
| 2012-03-18 | 15.34 |
| 2012-03-18 01:00:00 | 14.3 |
| 2012-03-18 02:00:00 | 14.04 |
| 2012-03-18 03:00:00 | 14.04 |
| 2012-03-18 04:00:00 | 13.26 |
| 2012-03-18 05:00:00 | 13.26 |
| 2012-03-18 06:00:00 | 13.26 |
| 2012-03-18 07:00:00 | 14.3 |
| 2012-03-18 08:00:00 | 14.04 |
| 2012-03-18 09:00:00 | 14.04 |
| 2012-03-18 10:00:00 | 15.86 |
| 2012-03-18 11:00:00 | 16.38 |
| 2012-03-18 12:00:00 | 17.42 |
| 2012-03-18 13:00:00 | 17.68 |
| 2012-03-18 14:00:00 | 17.68 |
| 2012-03-18 15:00:00 | 17.16 |
| 2012-03-18 16:00:00 | 18.2 |
| 2012-03-18 17:00:00 | 14.3 |
| 2012-03-18 18:00:00 | 14.56 |
| 2012-03-18 19:00:00 | 14.3 |
| 2012-03-18 20:00:00 | 14.56 |
| 2012-03-18 21:00:00 | 18.2 |
| 2012-03-18 22:00:00 | 18.2 |
| 2012-03-18 23:00:00 | 17.42 |
| 2012-03-19 | 15.08 |
| 2012-03-19 01:00:00 | 15.08 |
| 2012-03-19 02:00:00 | 16.12 |
| 2012-03-19 03:00:00 | 15.34 |
| 2012-03-19 04:00:00 | 13.78 |
| 2012-03-19 05:00:00 | 13.78 |
| 2012-03-19 06:00:00 | 16.12 |
| 2012-03-19 07:00:00 | 16.12 |
| 2012-03-19 08:00:00 | 15.6 |
| 2012-03-19 09:00:00 | 24.18 |
| 2012-03-19 10:00:00 | 30.94 |
| 2012-03-19 11:00:00 | 23.66 |
| 2012-03-19 12:00:00 | 18.2 |
| 2012-03-19 13:00:00 | 17.68 |
| 2012-03-19 14:00:00 | 19.5 |
| 2012-03-19 15:00:00 | 18.2 |
| 2012-03-19 16:00:00 | 18.2 |
| 2012-03-19 17:00:00 | 16.38 |
| 2012-03-19 18:00:00 | 15.86 |
| 2012-03-19 19:00:00 | 18.2 |
| 2012-03-19 20:00:00 | 18.46 |
| 2012-03-19 21:00:00 | 17.68 |
| 2012-03-19 22:00:00 | 17.42 |
| 2012-03-19 23:00:00 | 17.68 |
| 2012-03-20 | 19.24 |
| 2012-03-20 01:00:00 | 15.34 |
| 2012-03-20 02:00:00 | 14.04 |
| 2012-03-20 03:00:00 | 16.64 |
| 2012-03-20 04:00:00 | 14.56 |
| 2012-03-20 05:00:00 | 13.78 |
| 2012-03-20 06:00:00 | 13.78 |
| 2012-03-20 07:00:00 | 17.68 |
| 2012-03-20 08:00:00 | 16.64 |
| 2012-03-20 09:00:00 | 16.64 |
| 2012-03-20 10:00:00 | 16.64 |
| 2012-03-20 11:00:00 | 16.38 |
| 2012-03-20 12:00:00 | 18.98 |
| 2012-03-20 13:00:00 | 14.56 |
| 2012-03-20 14:00:00 | 16.9 |
| 2012-03-20 15:00:00 | 16.9 |
| 2012-03-20 16:00:00 | 17.94 |
| 2012-03-20 17:00:00 | 17.68 |
| 2012-03-20 18:00:00 | 14.3 |
| 2012-03-20 19:00:00 | 16.9 |
| 2012-03-20 20:00:00 | 17.42 |
| 2012-03-20 21:00:00 | 16.38 |
| 2012-03-20 22:00:00 | 18.98 |
| 2012-03-20 23:00:00 | 18.2 |
| 2012-03-21 | 17.16 |
| 2012-03-21 01:00:00 | 14.56 |
| 2012-03-21 02:00:00 | 14.04 |
| 2012-03-21 03:00:00 | 14.82 |
| 2012-03-21 04:00:00 | 14.82 |
| 2012-03-21 05:00:00 | 13 |
| 2012-03-21 06:00:00 | 14.56 |
| 2012-03-21 07:00:00 | 16.12 |
| 2012-03-21 08:00:00 | 17.94 |
| 2012-03-21 09:00:00 | 16.9 |
| 2012-03-21 10:00:00 | 15.86 |
| 2012-03-21 11:00:00 | 14.56 |
| 2012-03-21 12:00:00 | 16.12 |
| 2012-03-21 13:00:00 | 17.68 |
| 2012-03-21 14:00:00 | 16.12 |
| 2012-03-21 15:00:00 | 16.12 |
| 2012-03-21 16:00:00 | 17.94 |
| 2012-03-21 17:00:00 | 16.12 |
| 2012-03-21 18:00:00 | 16.38 |
| 2012-03-21 19:00:00 | 16.12 |
| 2012-03-21 20:00:00 | 16.9 |
| 2012-03-21 21:00:00 | 18.46 |
| 2012-03-21 22:00:00 | 18.2 |
| 2012-03-21 23:00:00 | 16.64 |
| 2012-03-22 | 16.38 |
| 2012-03-22 01:00:00 | 14.56 |
| 2012-03-22 02:00:00 | 14.56 |
| 2012-03-22 03:00:00 | 13.26 |
| 2012-03-22 04:00:00 | 13 |
| 2012-03-22 05:00:00 | 14.82 |
| 2012-03-22 06:00:00 | 14.3 |
| 2012-03-22 07:00:00 | 14.56 |
| 2012-03-22 08:00:00 | 16.12 |
| 2012-03-22 09:00:00 | 16.12 |
| 2012-03-22 10:00:00 | 16.38 |
| 2012-03-22 11:00:00 | 17.94 |
| 2012-03-22 12:00:00 | 13.26 |
| 2012-03-22 13:00:00 | 14.82 |
| 2012-03-22 14:00:00 | 15.08 |
| 2012-03-22 15:00:00 | 15.08 |
| 2012-03-22 16:00:00 | 15.08 |
| 2012-03-22 17:00:00 | 14.82 |
| 2012-03-22 18:00:00 | 15.08 |
| 2012-03-22 19:00:00 | 15.08 |
| 2012-03-22 20:00:00 | 13.26 |
| 2012-03-22 21:00:00 | 17.16 |
| 2012-03-22 22:00:00 | 15.6 |
| 2012-03-22 23:00:00 | 17.42 |
| 2012-03-23 | 15.08 |
| 2012-03-23 01:00:00 | 13.52 |
| 2012-03-23 02:00:00 | 12.48 |
| 2012-03-23 03:00:00 | 12.74 |
| 2012-03-23 04:00:00 | 13.26 |
| 2012-03-23 05:00:00 | 13.52 |
| 2012-03-23 06:00:00 | 12.48 |
| 2012-03-23 07:00:00 | 12.74 |
| 2012-03-23 08:00:00 | 14.04 |
| 2012-03-23 09:00:00 | 16.38 |
| 2012-03-23 10:00:00 | 15.08 |
| 2012-03-23 11:00:00 | 15.34 |
| 2012-03-23 12:00:00 | 15.34 |
| 2012-03-23 13:00:00 | 17.16 |
| 2012-03-23 14:00:00 | 15.34 |
| 2012-03-23 15:00:00 | 15.34 |
| 2012-03-23 16:00:00 | 16.9 |
| 2012-03-23 17:00:00 | 14.82 |
| 2012-03-23 18:00:00 | 13.26 |
| 2012-03-23 19:00:00 | 13 |
| 2012-03-23 20:00:00 | 16.9 |
| 2012-03-23 21:00:00 | 15.34 |
| 2012-03-23 22:00:00 | 15.08 |
| 2012-03-23 23:00:00 | 14.82 |
| 2012-03-24 | 15.08 |
| 2012-03-24 01:00:00 | 13 |
| 2012-03-24 02:00:00 | 13.26 |
| 2012-03-24 03:00:00 | 13.26 |
| 2012-03-24 04:00:00 | 11.96 |
| 2012-03-24 05:00:00 | 11.18 |
| 2012-03-24 06:00:00 | 11.44 |
| 2012-03-24 07:00:00 | 11.96 |
| 2012-03-24 08:00:00 | 13.26 |
| 2012-03-24 09:00:00 | 13.26 |
| 2012-03-24 10:00:00 | 13.78 |
| 2012-03-24 11:00:00 | 13.78 |
| 2012-03-24 12:00:00 | 14.82 |
| 2012-03-24 13:00:00 | 16.9 |
| 2012-03-24 14:00:00 | 17.42 |
| 2012-03-24 15:00:00 | 15.08 |
| 2012-03-24 16:00:00 | 15.34 |
| 2012-03-24 17:00:00 | 15.6 |
| 2012-03-24 18:00:00 | 17.16 |
| 2012-03-24 19:00:00 | 13.52 |
| 2012-03-24 20:00:00 | 15.6 |
| 2012-03-24 21:00:00 | 15.34 |
| 2012-03-24 22:00:00 | 15.34 |
| 2012-03-24 23:00:00 | 13.78 |
| 2012-03-25 | 14.56 |
| 2012-03-25 01:00:00 | 14.82 |
| 2012-03-25 03:00:00 | 13.52 |
| 2012-03-25 04:00:00 | 12.74 |
| 2012-03-25 05:00:00 | 12.48 |
| 2012-03-25 06:00:00 | 11.7 |
| 2012-03-25 07:00:00 | 13 |
| 2012-03-25 08:00:00 | 13.26 |
| 2012-03-25 09:00:00 | 13 |
| 2012-03-25 10:00:00 | 13 |
| 2012-03-25 11:00:00 | 15.34 |
| 2012-03-25 12:00:00 | 16.12 |
| 2012-03-25 13:00:00 | 14.82 |
| 2012-03-25 14:00:00 | 16.64 |
| 2012-03-25 15:00:00 | 14.82 |
| 2012-03-25 16:00:00 | 15.08 |
| 2012-03-25 17:00:00 | 16.9 |
| 2012-03-25 18:00:00 | 14.56 |
| 2012-03-25 19:00:00 | 13 |
| 2012-03-25 20:00:00 | 14.82 |
| 2012-03-25 21:00:00 | 17.94 |
| 2012-03-25 22:00:00 | 18.46 |
| 2012-03-25 23:00:00 | 16.12 |
| 2012-03-26 | 14.56 |
| 2012-03-26 01:00:00 | 13.26 |
| 2012-03-26 02:00:00 | 13.78 |
| 2012-03-26 03:00:00 | 13.26 |
| 2012-03-26 04:00:00 | 13.52 |
| 2012-03-26 05:00:00 | 13.78 |
| 2012-03-26 06:00:00 | 12.74 |
| 2012-03-26 07:00:00 | 13.78 |
| 2012-03-26 08:00:00 | 15.6 |
| 2012-03-26 09:00:00 | 15.86 |
| 2012-03-26 10:00:00 | 15.6 |
| 2012-03-26 11:00:00 | 15.6 |
| 2012-03-26 12:00:00 | 15.6 |
| 2012-03-26 13:00:00 | 15.08 |
| 2012-03-26 14:00:00 | 14.56 |
| 2012-03-26 15:00:00 | 15.86 |
| 2012-03-26 16:00:00 | 16.38 |
| 2012-03-26 17:00:00 | 15.6 |
| 2012-03-26 18:00:00 | 16.12 |
| 2012-03-26 19:00:00 | 15.6 |
| 2012-03-26 20:00:00 | 15.86 |
| 2012-03-26 21:00:00 | 15.86 |
| 2012-03-26 22:00:00 | 15.86 |
| 2012-03-26 23:00:00 | 16.12 |
| 2012-03-27 | 16.12 |
| 2012-03-27 01:00:00 | 15.34 |
| 2012-03-27 02:00:00 | 14.04 |
| 2012-03-27 03:00:00 | 14.04 |
| 2012-03-27 04:00:00 | 14.04 |
| 2012-03-27 05:00:00 | 14.3 |
| 2012-03-27 06:00:00 | 13 |
| 2012-03-27 07:00:00 | 14.82 |
| 2012-03-27 08:00:00 | 14.3 |
| 2012-03-27 09:00:00 | 15.34 |
| 2012-03-27 10:00:00 | 14.56 |
| 2012-03-27 11:00:00 | 15.08 |
| 2012-03-27 12:00:00 | 15.86 |
| 2012-03-27 13:00:00 | 16.12 |
| 2012-03-27 14:00:00 | 15.34 |
| 2012-03-27 15:00:00 | 14.56 |
| 2012-03-27 16:00:00 | 14.82 |
| 2012-03-27 17:00:00 | 14.56 |
| 2012-03-27 18:00:00 | 14.56 |
| 2012-03-27 19:00:00 | 14.3 |
| 2012-03-27 20:00:00 | 14.3 |
| 2012-03-27 21:00:00 | 14.3 |
| 2012-03-27 22:00:00 | 16.12 |
| 2012-03-27 23:00:00 | 14.04 |
| 2012-03-28 | 14.04 |
| 2012-03-28 01:00:00 | 12.74 |
| 2012-03-28 02:00:00 | 12.74 |
| 2012-03-28 03:00:00 | 11.44 |
| 2012-03-28 04:00:00 | 9.62 |
| 2012-03-28 05:00:00 | 10.4 |
| 2012-03-28 06:00:00 | 11.7 |
| 2012-03-28 07:00:00 | 12.22 |
| 2012-03-28 08:00:00 | 12.22 |
| 2012-03-28 09:00:00 | 13.26 |
| 2012-03-28 10:00:00 | 13.52 |
| 2012-03-28 11:00:00 | 12.48 |
| 2012-03-28 12:00:00 | 13 |
| 2012-03-28 13:00:00 | 13.26 |
| 2012-03-28 14:00:00 | 14.04 |
| 2012-03-28 15:00:00 | 13 |
| 2012-03-28 16:00:00 | 14.04 |
| 2012-03-28 17:00:00 | 13.26 |
| 2012-03-28 18:00:00 | 13.78 |
| 2012-03-28 19:00:00 | 13.26 |
| 2012-03-28 20:00:00 | 11.96 |
| 2012-03-28 21:00:00 | 13.26 |
| 2012-03-28 22:00:00 | 15.34 |
| 2012-03-28 23:00:00 | 13.52 |
| 2012-03-29 | 14.04 |
| 2012-03-29 01:00:00 | 14.3 |
| 2012-03-29 02:00:00 | 12.22 |
| 2012-03-29 03:00:00 | 10.66 |
| 2012-03-29 04:00:00 | 10.66 |
| 2012-03-29 05:00:00 | 11.7 |
| 2012-03-29 06:00:00 | 12.74 |
| 2012-03-29 07:00:00 | 12.74 |
| 2012-03-29 08:00:00 | 13.52 |
| 2012-03-29 09:00:00 | 12.74 |
| 2012-03-29 10:00:00 | 13.52 |
| 2012-03-29 11:00:00 | 12.48 |
| 2012-03-29 12:00:00 | 12.74 |
| 2012-03-29 13:00:00 | 12.22 |
| 2012-03-29 14:00:00 | 11.96 |
| 2012-03-29 15:00:00 | 13.26 |
| 2012-03-29 16:00:00 | 13.26 |
| 2012-03-29 17:00:00 | 12.48 |
| 2012-03-29 18:00:00 | 20.8 |
| 2012-03-29 19:00:00 | 84.24 |
| 2012-03-29 20:00:00 | 81.38 |
| 2012-03-29 21:00:00 | 48.88 |
| 2012-03-29 22:00:00 | 31.98 |
| 2012-03-29 23:00:00 | 28.34 |
| 2012-03-30 | 36.14 |
| 2012-03-30 01:00:00 | 53.3 |
| 2012-03-30 02:00:00 | 74.36 |
| 2012-03-30 03:00:00 | 102.44 |
| 2012-03-30 04:00:00 | 105.82 |
| 2012-03-30 05:00:00 | 89.96 |
| 2012-03-30 06:00:00 | 91.78 |
| 2012-03-30 07:00:00 | 57.46 |
| 2012-03-30 08:00:00 | 32.24 |
| 2012-03-30 09:00:00 | 29.12 |
| 2012-03-30 10:00:00 | 26.26 |
| 2012-03-30 11:00:00 | 24.96 |
| 2012-03-30 12:00:00 | 23.66 |
| 2012-03-30 13:00:00 | 23.14 |
| 2012-03-30 14:00:00 | 22.88 |
| 2012-03-30 15:00:00 | 22.36 |
| 2012-03-30 16:00:00 | 21.84 |
| 2012-03-30 17:00:00 | 22.1 |
| 2012-03-30 18:00:00 | 21.84 |
| 2012-03-30 19:00:00 | 22.36 |
| 2012-03-30 20:00:00 | 22.1 |
| 2012-03-30 21:00:00 | 30.16 |
| 2012-03-30 22:00:00 | 58.24 |
| 2012-03-30 23:00:00 | 31.98 |
| 2012-03-31 | 24.18 |
| 2012-03-31 01:00:00 | 21.58 |
| 2012-03-31 02:00:00 | 20.54 |
| 2012-03-31 03:00:00 | 19.5 |
| 2012-03-31 04:00:00 | 19.24 |
| 2012-03-31 05:00:00 | 18.98 |
| 2012-03-31 06:00:00 | 17.94 |
| 2012-03-31 07:00:00 | 17.94 |
| 2012-03-31 08:00:00 | 19.5 |
| 2012-03-31 09:00:00 | 20.8 |
| 2012-03-31 10:00:00 | 20.54 |
| 2012-03-31 11:00:00 | 21.06 |
| 2012-03-31 12:00:00 | 22.36 |
| 2012-03-31 13:00:00 | 23.66 |
| 2012-03-31 14:00:00 | 22.62 |
| 2012-03-31 15:00:00 | 21.58 |
| 2012-03-31 16:00:00 | 21.06 |
| 2012-03-31 17:00:00 | 41.6 |
| 2012-03-31 18:00:00 | 96.46 |
| 2012-03-31 19:00:00 | 50.7 |
| 2012-03-31 20:00:00 | 33.28 |
| 2012-03-31 21:00:00 | 23.92 |
| 2012-03-31 22:00:00 | 22.62 |
| 2012-03-31 23:00:00 | 21.32 |
| 2012-04-01 | 20.54 |
| 2012-04-01 01:00:00 | 20.28 |
| 2012-04-01 02:00:00 | 18.98 |
| 2012-04-01 03:00:00 | 20.28 |
| 2012-04-01 04:00:00 | 18.98 |
| 2012-04-01 05:00:00 | 18.2 |
| 2012-04-01 06:00:00 | 18.2 |
| 2012-04-01 07:00:00 | 17.94 |
| 2012-04-01 08:00:00 | 18.2 |
| 2012-04-01 09:00:00 | 18.98 |
| 2012-04-01 10:00:00 | 21.06 |
| 2012-04-01 11:00:00 | 21.84 |
| 2012-04-01 12:00:00 | 21.58 |
| 2012-04-01 13:00:00 | 21.06 |
| 2012-04-01 14:00:00 | 20.8 |
| 2012-04-01 15:00:00 | 20.54 |
| 2012-04-01 16:00:00 | 20.8 |
| 2012-04-01 17:00:00 | 21.32 |
| 2012-04-01 18:00:00 | 20.28 |
| 2012-04-01 19:00:00 | 20.02 |
| 2012-04-01 20:00:00 | 20.54 |
| 2012-04-01 21:00:00 | 21.32 |
| 2012-04-01 22:00:00 | 21.84 |
| 2012-04-01 23:00:00 | 21.58 |
| 2012-04-02 | 20.8 |
| 2012-04-02 01:00:00 | 18.46 |
| 2012-04-02 02:00:00 | 17.68 |
| 2012-04-02 03:00:00 | 18.2 |
| 2012-04-02 04:00:00 | 18.2 |
| 2012-04-02 05:00:00 | 17.94 |
| 2012-04-02 06:00:00 | 17.68 |
| 2012-04-02 07:00:00 | 17.94 |
| 2012-04-02 08:00:00 | 19.76 |
| 2012-04-02 09:00:00 | 19.24 |
| 2012-04-02 10:00:00 | 18.72 |
| 2012-04-02 11:00:00 | 20.8 |
| 2012-04-02 12:00:00 | 21.06 |
| 2012-04-02 13:00:00 | 20.28 |
| 2012-04-02 14:00:00 | 18.46 |
| 2012-04-02 15:00:00 | 20.54 |
| 2012-04-02 16:00:00 | 20.02 |
| 2012-04-02 17:00:00 | 20.02 |
| 2012-04-02 18:00:00 | 18.98 |
| 2012-04-02 19:00:00 | 17.94 |
| 2012-04-02 20:00:00 | 20.54 |
| 2012-04-02 21:00:00 | 21.06 |
| 2012-04-02 22:00:00 | 20.54 |
| 2012-04-02 23:00:00 | 20.28 |
| 2012-04-03 | 20.54 |
| 2012-04-03 01:00:00 | 18.2 |
| 2012-04-03 02:00:00 | 17.16 |
| 2012-04-03 03:00:00 | 17.68 |
| 2012-04-03 04:00:00 | 18.46 |
| 2012-04-03 05:00:00 | 16.9 |
| 2012-04-03 06:00:00 | 16.9 |
| 2012-04-03 07:00:00 | 19.24 |
| 2012-04-03 08:00:00 | 20.02 |
| 2012-04-03 09:00:00 | 18.98 |
| 2012-04-03 10:00:00 | 19.24 |
| 2012-04-03 11:00:00 | 20.54 |
| 2012-04-03 12:00:00 | 17.16 |
| 2012-04-03 13:00:00 | 16.38 |
| 2012-04-03 14:00:00 | 14.82 |
| 2012-04-03 15:00:00 | 14.82 |
| 2012-04-03 16:00:00 | 14.04 |
| 2012-04-03 17:00:00 | 13.26 |
| 2012-04-03 18:00:00 | 11.7 |
| 2012-04-03 19:00:00 | 13.26 |
| 2012-04-03 20:00:00 | 15.34 |
| 2012-04-03 21:00:00 | 13.52 |
| 2012-04-03 22:00:00 | 13.26 |
| 2012-04-03 23:00:00 | 15.34 |
| 2012-04-04 | 13.52 |
| 2012-04-04 01:00:00 | 13 |
| 2012-04-04 02:00:00 | 10.14 |
| 2012-04-04 03:00:00 | 11.7 |
| 2012-04-04 04:00:00 | 11.44 |
| 2012-04-04 05:00:00 | 9.62 |
| 2012-04-04 06:00:00 | 10.4 |
| 2012-04-04 07:00:00 | 12.74 |
| 2012-04-04 08:00:00 | 12.74 |
| 2012-04-04 09:00:00 | 14.04 |
| 2012-04-04 10:00:00 | 13 |
| 2012-04-04 11:00:00 | 15.6 |
| 2012-04-04 12:00:00 | 15.34 |
| 2012-04-04 13:00:00 | 11.44 |
| 2012-04-04 14:00:00 | 13 |
| 2012-04-04 15:00:00 | 13.52 |
| 2012-04-04 16:00:00 | 14.3 |
| 2012-04-04 17:00:00 | 13 |
| 2012-04-04 18:00:00 | 11.44 |
| 2012-04-04 19:00:00 | 11.18 |
| 2012-04-04 20:00:00 | 14.82 |
| 2012-04-04 21:00:00 | 13.26 |
| 2012-04-04 22:00:00 | 15.08 |
| 2012-04-04 23:00:00 | 15.86 |
| 2012-04-05 | 14.04 |
| 2012-04-05 01:00:00 | 12.22 |
| 2012-04-05 02:00:00 | 10.66 |
| 2012-04-05 03:00:00 | 10.14 |
| 2012-04-05 04:00:00 | 10.92 |
| 2012-04-05 05:00:00 | 9.36 |
| 2012-04-05 06:00:00 | 9.88 |
| 2012-04-05 07:00:00 | 11.18 |
| 2012-04-05 08:00:00 | 12.48 |
| 2012-04-05 09:00:00 | 11.44 |
| 2012-04-05 10:00:00 | 11.96 |
| 2012-04-05 11:00:00 | 13.52 |
| 2012-04-05 12:00:00 | 13.26 |
| 2012-04-05 13:00:00 | 13 |
| 2012-04-05 14:00:00 | 10.92 |
| 2012-04-05 15:00:00 | 13.78 |
| 2012-04-05 16:00:00 | 14.56 |
| 2012-04-05 17:00:00 | 13 |
| 2012-04-05 18:00:00 | 12.48 |
| 2012-04-05 19:00:00 | 11.18 |
| 2012-04-05 20:00:00 | 13.52 |
| 2012-04-05 21:00:00 | 15.08 |
| 2012-04-05 22:00:00 | 13.26 |
| 2012-04-05 23:00:00 | 13.78 |
| 2012-04-06 | 13.78 |
| 2012-04-06 01:00:00 | 18.46 |
| 2012-04-06 02:00:00 | 37.44 |
| 2012-04-06 03:00:00 | 22.1 |
| 2012-04-06 04:00:00 | 23.14 |
| 2012-04-06 05:00:00 | 30.68 |
| 2012-04-06 06:00:00 | 21.58 |
| 2012-04-06 07:00:00 | 19.24 |
| 2012-04-06 08:00:00 | 19.24 |
| 2012-04-06 09:00:00 | 23.4 |
| 2012-04-06 10:00:00 | 23.92 |
| 2012-04-06 11:00:00 | 19.5 |
| 2012-04-06 12:00:00 | 19.5 |
| 2012-04-06 13:00:00 | 20.02 |
| 2012-04-06 14:00:00 | 19.76 |
| 2012-04-06 15:00:00 | 19.76 |
| 2012-04-06 16:00:00 | 19.76 |
| 2012-04-06 17:00:00 | 19.24 |
| 2012-04-06 18:00:00 | 18.2 |
| 2012-04-06 19:00:00 | 18.2 |
| 2012-04-06 20:00:00 | 18.98 |
| 2012-04-06 21:00:00 | 19.24 |
| 2012-04-06 22:00:00 | 18.2 |
| 2012-04-06 23:00:00 | 18.98 |
| 2012-04-07 | 18.98 |
| 2012-04-07 01:00:00 | 18.2 |
| 2012-04-07 02:00:00 | 11.18 |
| 2012-04-07 03:00:00 | 10.66 |
| 2012-04-07 04:00:00 | 9.88 |
| 2012-04-07 05:00:00 | 11.44 |
| 2012-04-07 06:00:00 | 10.4 |
| 2012-04-07 07:00:00 | 9.62 |
| 2012-04-07 08:00:00 | 11.18 |
| 2012-04-07 09:00:00 | 13 |
| 2012-04-07 10:00:00 | 11.44 |
| 2012-04-07 11:00:00 | 13 |
| 2012-04-07 12:00:00 | 13.26 |
| 2012-04-07 13:00:00 | 15.34 |
| 2012-04-07 14:00:00 | 14.04 |
| 2012-04-07 15:00:00 | 11.7 |
| 2012-04-07 16:00:00 | 11.7 |
| 2012-04-07 17:00:00 | 11.7 |
| 2012-04-07 18:00:00 | 11.44 |
| 2012-04-07 19:00:00 | 11.7 |
| 2012-04-07 20:00:00 | 35.1 |
| 2012-04-07 21:00:00 | 29.64 |
| 2012-04-07 22:00:00 | 20.28 |
| 2012-04-07 23:00:00 | 18.98 |
| 2012-04-08 | 16.38 |
| 2012-04-08 01:00:00 | 11.7 |
| 2012-04-08 02:00:00 | 10.66 |
| 2012-04-08 03:00:00 | 10.92 |
| 2012-04-08 04:00:00 | 11.7 |
| 2012-04-08 05:00:00 | 9.1 |
| 2012-04-08 06:00:00 | 10.14 |
| 2012-04-08 07:00:00 | 10.14 |
| 2012-04-08 08:00:00 | 10.92 |
| 2012-04-08 09:00:00 | 10.66 |
| 2012-04-08 10:00:00 | 13.26 |
| 2012-04-08 11:00:00 | 13.78 |
| 2012-04-08 12:00:00 | 11.7 |
| 2012-04-08 13:00:00 | 13.52 |
| 2012-04-08 14:00:00 | 11.7 |
| 2012-04-08 15:00:00 | 11.96 |
| 2012-04-08 16:00:00 | 13.78 |
| 2012-04-08 17:00:00 | 12.22 |
| 2012-04-08 18:00:00 | 10.92 |
| 2012-04-08 19:00:00 | 12.48 |
| 2012-04-08 20:00:00 | 11.96 |
| 2012-04-08 21:00:00 | 11.7 |
| 2012-04-08 22:00:00 | 11.7 |
| 2012-04-08 23:00:00 | 11.7 |
| 2012-04-09 | 13.26 |
| 2012-04-09 01:00:00 | 12.74 |
| 2012-04-09 02:00:00 | 13.26 |
| 2012-04-09 03:00:00 | 11.96 |
| 2012-04-09 04:00:00 | 11.7 |
| 2012-04-09 05:00:00 | 11.7 |
| 2012-04-09 06:00:00 | 11.96 |
| 2012-04-09 07:00:00 | 12.48 |
| 2012-04-09 08:00:00 | 13 |
| 2012-04-09 09:00:00 | 12.74 |
| 2012-04-09 10:00:00 | 13 |
| 2012-04-09 11:00:00 | 12.48 |
| 2012-04-09 12:00:00 | 12.22 |
| 2012-04-09 13:00:00 | 12.22 |
| 2012-04-09 14:00:00 | 12.74 |
| 2012-04-09 15:00:00 | 12.74 |
| 2012-04-09 16:00:00 | 10.66 |
| 2012-04-09 17:00:00 | 10.4 |
| 2012-04-09 18:00:00 | 11.18 |
| 2012-04-09 19:00:00 | 10.14 |
| 2012-04-09 20:00:00 | 12.48 |
| 2012-04-09 21:00:00 | 13.52 |
| 2012-04-09 22:00:00 | 14.04 |
| 2012-04-09 23:00:00 | 12.74 |
| 2012-04-10 | 14.3 |
| 2012-04-10 01:00:00 | 13 |
| 2012-04-10 02:00:00 | 11.96 |
| 2012-04-10 03:00:00 | 9.62 |
| 2012-04-10 04:00:00 | 12.22 |
| 2012-04-10 05:00:00 | 14.3 |
| 2012-04-10 06:00:00 | 13 |
| 2012-04-10 07:00:00 | 12.48 |
| 2012-04-10 08:00:00 | 15.08 |
| 2012-04-10 09:00:00 | 13.52 |
| 2012-04-10 10:00:00 | 13.26 |
| 2012-04-10 11:00:00 | 11.96 |
| 2012-04-10 12:00:00 | 13.52 |
| 2012-04-10 13:00:00 | 13.52 |
| 2012-04-10 14:00:00 | 13.78 |
| 2012-04-10 15:00:00 | 13.26 |
| 2012-04-10 16:00:00 | 13.78 |
| 2012-04-10 17:00:00 | 12.74 |
| 2012-04-10 18:00:00 | 12.48 |
| 2012-04-10 19:00:00 | 13.78 |
| 2012-04-10 20:00:00 | 13.52 |
| 2012-04-10 21:00:00 | 13.78 |
| 2012-04-10 22:00:00 | 13.26 |
| 2012-04-10 23:00:00 | 11.96 |
| 2012-04-11 | 11.7 |
| 2012-04-11 01:00:00 | 11.44 |
| 2012-04-11 02:00:00 | 10.66 |
| 2012-04-11 03:00:00 | 9.1 |
| 2012-04-11 04:00:00 | 10.14 |
| 2012-04-11 05:00:00 | 10.4 |
| 2012-04-11 06:00:00 | 10.14 |
| 2012-04-11 07:00:00 | 10.66 |
| 2012-04-11 08:00:00 | 12.48 |
| 2012-04-11 09:00:00 | 12.22 |
| 2012-04-11 10:00:00 | 12.48 |
| 2012-04-11 11:00:00 | 12.74 |
| 2012-04-11 12:00:00 | 12.48 |
| 2012-04-11 13:00:00 | 12.48 |
| 2012-04-11 14:00:00 | 12.48 |
| 2012-04-11 15:00:00 | 11.7 |
| 2012-04-11 16:00:00 | 11.44 |
| 2012-04-11 17:00:00 | 11.44 |
| 2012-04-11 18:00:00 | 10.66 |
| 2012-04-11 19:00:00 | 11.7 |
| 2012-04-11 20:00:00 | 11.44 |
| 2012-04-11 21:00:00 | 11.7 |
| 2012-04-11 22:00:00 | 11.7 |
| 2012-04-11 23:00:00 | 11.7 |
| 2012-04-12 | 11.7 |
| 2012-04-12 01:00:00 | 10.92 |
| 2012-04-12 02:00:00 | 9.88 |
| 2012-04-12 03:00:00 | 9.1 |
| 2012-04-12 04:00:00 | 8.58 |
| 2012-04-12 05:00:00 | 9.1 |
| 2012-04-12 06:00:00 | 10.14 |
| 2012-04-12 07:00:00 | 10.4 |
| 2012-04-12 08:00:00 | 11.96 |
| 2012-04-12 09:00:00 | 11.96 |
| 2012-04-12 10:00:00 | 11.96 |
| 2012-04-12 11:00:00 | 12.22 |
| 2012-04-12 12:00:00 | 12.22 |
| 2012-04-12 13:00:00 | 12.22 |
| 2012-04-12 14:00:00 | 12.22 |
| 2012-04-12 15:00:00 | 11.96 |
| 2012-04-12 16:00:00 | 14.56 |
| 2012-04-12 17:00:00 | 18.98 |
| 2012-04-12 18:00:00 | 12.48 |
| 2012-04-12 19:00:00 | 11.7 |
| 2012-04-12 20:00:00 | 11.44 |
| 2012-04-12 21:00:00 | 13.78 |
| 2012-04-12 22:00:00 | 32.76 |
| 2012-04-12 23:00:00 | 56.94 |
| 2012-04-13 | 36.66 |
| 2012-04-13 01:00:00 | 19.76 |
| 2012-04-13 02:00:00 | 11.7 |
| 2012-04-13 03:00:00 | 9.1 |
| 2012-04-13 04:00:00 | 9.36 |
| 2012-04-13 05:00:00 | 10.4 |
| 2012-04-13 06:00:00 | 10.14 |
| 2012-04-13 07:00:00 | 10.14 |
| 2012-04-13 08:00:00 | 11.18 |
| 2012-04-13 09:00:00 | 11.7 |
| 2012-04-13 10:00:00 | 11.7 |
| 2012-04-13 11:00:00 | 11.7 |
| 2012-04-13 12:00:00 | 11.7 |
| 2012-04-13 13:00:00 | 11.7 |
| 2012-04-13 14:00:00 | 10.66 |
| 2012-04-13 15:00:00 | 10.66 |
| 2012-04-13 16:00:00 | 11.44 |
| 2012-04-13 17:00:00 | 11.44 |
| 2012-04-13 18:00:00 | 11.44 |
| 2012-04-13 19:00:00 | 9.88 |
| 2012-04-13 20:00:00 | 11.44 |
| 2012-04-13 21:00:00 | 13.26 |
| 2012-04-13 22:00:00 | 11.7 |
| 2012-04-13 23:00:00 | 11.44 |
| 2012-04-14 | 11.44 |
| 2012-04-14 01:00:00 | 18.2 |
| 2012-04-14 02:00:00 | 27.56 |
| 2012-04-14 03:00:00 | 25.22 |
| 2012-04-14 04:00:00 | 14.04 |
| 2012-04-14 05:00:00 | 9.88 |
| 2012-04-14 06:00:00 | 9.36 |
| 2012-04-14 07:00:00 | 10.92 |
| 2012-04-14 08:00:00 | 10.66 |
| 2012-04-14 09:00:00 | 9.88 |
| 2012-04-14 10:00:00 | 10.92 |
| 2012-04-14 11:00:00 | 11.7 |
| 2012-04-14 12:00:00 | 13 |
| 2012-04-14 13:00:00 | 11.44 |
| 2012-04-14 14:00:00 | 11.44 |
| 2012-04-14 15:00:00 | 11.7 |
| 2012-04-14 16:00:00 | 11.7 |
| 2012-04-14 17:00:00 | 10.66 |
| 2012-04-14 18:00:00 | 10.66 |
| 2012-04-14 19:00:00 | 10.66 |
| 2012-04-14 20:00:00 | 11.18 |
| 2012-04-14 21:00:00 | 11.44 |
| 2012-04-14 22:00:00 | 11.18 |
| 2012-04-14 23:00:00 | 10.66 |
| 2012-04-15 | 10.66 |
| 2012-04-15 01:00:00 | 9.62 |
| 2012-04-15 02:00:00 | 10.66 |
| 2012-04-15 03:00:00 | 13.26 |
| 2012-04-15 04:00:00 | 9.88 |
| 2012-04-15 05:00:00 | 9.62 |
| 2012-04-15 06:00:00 | 9.36 |
| 2012-04-15 07:00:00 | 10.14 |
| 2012-04-15 08:00:00 | 11.18 |
| 2012-04-15 09:00:00 | 11.18 |
| 2012-04-15 10:00:00 | 11.44 |
| 2012-04-15 11:00:00 | 11.44 |
| 2012-04-15 12:00:00 | 11.44 |
| 2012-04-15 13:00:00 | 11.44 |
| 2012-04-15 14:00:00 | 13.78 |
| 2012-04-15 15:00:00 | 44.72 |
| 2012-04-15 16:00:00 | 59.54 |
| 2012-04-15 17:00:00 | 57.98 |
| 2012-04-15 18:00:00 | 57.72 |
| 2012-04-15 19:00:00 | 53.56 |
| 2012-04-15 20:00:00 | 47.84 |
| 2012-04-15 21:00:00 | 55.9 |
| 2012-04-15 22:00:00 | 53.82 |
| 2012-04-15 23:00:00 | 40.56 |
| 2012-04-16 | 50.96 |
| 2012-04-16 01:00:00 | 32.76 |
| 2012-04-16 02:00:00 | 30.42 |
| 2012-04-16 03:00:00 | 31.98 |
| 2012-04-16 04:00:00 | 28.34 |
| 2012-04-16 05:00:00 | 23.14 |
| 2012-04-16 06:00:00 | 25.22 |
| 2012-04-16 07:00:00 | 53.04 |
| 2012-04-16 08:00:00 | 54.6 |
| 2012-04-16 09:00:00 | 41.34 |
| 2012-04-16 10:00:00 | 33.02 |
| 2012-04-16 11:00:00 | 52.52 |
| 2012-04-16 12:00:00 | 54.08 |
| 2012-04-16 13:00:00 | 34.32 |
| 2012-04-16 14:00:00 | 44.98 |
| 2012-04-16 15:00:00 | 32.5 |
| 2012-04-16 16:00:00 | 30.42 |
| 2012-04-16 17:00:00 | 28.34 |
| 2012-04-16 18:00:00 | 26 |
| 2012-04-16 19:00:00 | 24.96 |
| 2012-04-16 20:00:00 | 23.4 |
| 2012-04-16 21:00:00 | 23.92 |
| 2012-04-16 22:00:00 | 25.74 |
| 2012-04-16 23:00:00 | 24.7 |
| 2012-04-17 | 23.4 |
| 2012-04-17 01:00:00 | 19.76 |
| 2012-04-17 02:00:00 | 18.98 |
| 2012-04-17 03:00:00 | 19.5 |
| 2012-04-17 04:00:00 | 17.42 |
| 2012-04-17 05:00:00 | 20.54 |
| 2012-04-17 06:00:00 | 21.06 |
| 2012-04-17 07:00:00 | 21.58 |
| 2012-04-17 08:00:00 | 21.32 |
| 2012-04-17 09:00:00 | 23.66 |
| 2012-04-17 10:00:00 | 21.06 |
| 2012-04-17 11:00:00 | 19.24 |
| 2012-04-17 12:00:00 | 22.88 |
| 2012-04-17 13:00:00 | 21.58 |
| 2012-04-17 14:00:00 | 21.06 |
| 2012-04-17 15:00:00 | 19.24 |
| 2012-04-17 16:00:00 | 20.54 |
| 2012-04-17 17:00:00 | 20.8 |
| 2012-04-17 18:00:00 | 18.72 |
| 2012-04-17 19:00:00 | 18.98 |
| 2012-04-17 20:00:00 | 21.06 |
| 2012-04-17 21:00:00 | 21.06 |
| 2012-04-17 22:00:00 | 21.32 |
| 2012-04-17 23:00:00 | 19.24 |
| 2012-04-18 | 20.8 |
| 2012-04-18 01:00:00 | 17.16 |
| 2012-04-18 02:00:00 | 16.64 |
| 2012-04-18 03:00:00 | 15.6 |
| 2012-04-18 04:00:00 | 17.68 |
| 2012-04-18 05:00:00 | 14.56 |
| 2012-04-18 06:00:00 | 16.64 |
| 2012-04-18 07:00:00 | 17.16 |
| 2012-04-18 08:00:00 | 21.06 |
| 2012-04-18 09:00:00 | 18.98 |
| 2012-04-18 10:00:00 | 17.16 |
| 2012-04-18 11:00:00 | 19.24 |
| 2012-04-18 12:00:00 | 17.94 |
| 2012-04-18 13:00:00 | 18.2 |
| 2012-04-18 14:00:00 | 16.9 |
| 2012-04-18 15:00:00 | 17.16 |
| 2012-04-18 16:00:00 | 18.98 |
| 2012-04-18 17:00:00 | 16.9 |
| 2012-04-18 18:00:00 | 18.72 |
| 2012-04-18 19:00:00 | 16.9 |
| 2012-04-18 20:00:00 | 15.86 |
| 2012-04-18 21:00:00 | 17.68 |
| 2012-04-18 22:00:00 | 18.98 |
| 2012-04-18 23:00:00 | 18.98 |
| 2012-04-19 | 16.9 |
| 2012-04-19 01:00:00 | 16.38 |
| 2012-04-19 02:00:00 | 13.26 |
| 2012-04-19 03:00:00 | 13 |
| 2012-04-19 04:00:00 | 16.12 |
| 2012-04-19 05:00:00 | 13.26 |
| 2012-04-19 06:00:00 | 13 |
| 2012-04-19 07:00:00 | 16.12 |
| 2012-04-19 08:00:00 | 16.64 |
| 2012-04-19 09:00:00 | 16.9 |
| 2012-04-19 10:00:00 | 15.34 |
| 2012-04-19 11:00:00 | 19.5 |
| 2012-04-19 12:00:00 | 16.64 |
| 2012-04-19 13:00:00 | 16.38 |
| 2012-04-19 14:00:00 | 14.82 |
| 2012-04-19 15:00:00 | 16.38 |
| 2012-04-19 16:00:00 | 16.12 |
| 2012-04-19 17:00:00 | 16.12 |
| 2012-04-19 18:00:00 | 16.12 |
| 2012-04-19 19:00:00 | 13.26 |
| 2012-04-19 20:00:00 | 16.38 |
| 2012-04-19 21:00:00 | 17.16 |
| 2012-04-19 22:00:00 | 17.16 |
| 2012-04-19 23:00:00 | 16.38 |
| 2012-04-20 | 14.82 |
| 2012-04-20 01:00:00 | 12.74 |
| 2012-04-20 02:00:00 | 12.74 |
| 2012-04-20 03:00:00 | 14.56 |
| 2012-04-20 04:00:00 | 13 |
| 2012-04-20 05:00:00 | 11.44 |
| 2012-04-20 06:00:00 | 11.44 |
| 2012-04-20 07:00:00 | 14.56 |
| 2012-04-20 08:00:00 | 15.34 |
| 2012-04-20 09:00:00 | 15.6 |
| 2012-04-20 10:00:00 | 14.3 |
| 2012-04-20 11:00:00 | 15.34 |
| 2012-04-20 12:00:00 | 16.64 |
| 2012-04-20 13:00:00 | 15.34 |
| 2012-04-20 14:00:00 | 14.82 |
| 2012-04-20 15:00:00 | 14.56 |
| 2012-04-20 16:00:00 | 14.82 |
| 2012-04-20 17:00:00 | 13.52 |
| 2012-04-20 18:00:00 | 13 |
| 2012-04-20 19:00:00 | 15.08 |
| 2012-04-20 20:00:00 | 14.82 |
| 2012-04-20 21:00:00 | 12.74 |
| 2012-04-20 22:00:00 | 15.34 |
| 2012-04-20 23:00:00 | 16.12 |
| 2012-04-21 | 18.46 |
| 2012-04-21 01:00:00 | 16.12 |
| 2012-04-21 02:00:00 | 11.7 |
| 2012-04-21 03:00:00 | 11.7 |
| 2012-04-21 04:00:00 | 11.7 |
| 2012-04-21 05:00:00 | 12.74 |
| 2012-04-21 06:00:00 | 11.44 |
| 2012-04-21 07:00:00 | 11.18 |
| 2012-04-21 08:00:00 | 11.44 |
| 2012-04-21 09:00:00 | 13 |
| 2012-04-21 10:00:00 | 13.26 |
| 2012-04-21 11:00:00 | 14.04 |
| 2012-04-21 12:00:00 | 13.26 |
| 2012-04-21 13:00:00 | 15.08 |
| 2012-04-21 14:00:00 | 15.34 |
| 2012-04-21 15:00:00 | 13 |
| 2012-04-21 16:00:00 | 13 |
| 2012-04-21 17:00:00 | 13.26 |
| 2012-04-21 18:00:00 | 13.26 |
| 2012-04-21 19:00:00 | 13 |
| 2012-04-21 20:00:00 | 12.48 |
| 2012-04-21 21:00:00 | 11.96 |
| 2012-04-21 22:00:00 | 13 |
| 2012-04-21 23:00:00 | 12.74 |
| 2012-04-22 | 13.26 |
| 2012-04-22 01:00:00 | 13 |
| 2012-04-22 02:00:00 | 11.7 |
| 2012-04-22 03:00:00 | 10.4 |
| 2012-04-22 04:00:00 | 10.66 |
| 2012-04-22 05:00:00 | 10.14 |
| 2012-04-22 06:00:00 | 10.4 |
| 2012-04-22 07:00:00 | 11.18 |
| 2012-04-22 08:00:00 | 11.18 |
| 2012-04-22 09:00:00 | 11.18 |
| 2012-04-22 10:00:00 | 12.48 |
| 2012-04-22 11:00:00 | 13 |
| 2012-04-22 12:00:00 | 14.04 |
| 2012-04-22 13:00:00 | 13.78 |
| 2012-04-22 14:00:00 | 15.08 |
| 2012-04-22 15:00:00 | 12.74 |
| 2012-04-22 16:00:00 | 11.44 |
| 2012-04-22 17:00:00 | 12.48 |
| 2012-04-22 18:00:00 | 11.96 |
| 2012-04-22 19:00:00 | 13.78 |
| 2012-04-22 20:00:00 | 13 |
| 2012-04-22 21:00:00 | 13.52 |
| 2012-04-22 22:00:00 | 19.24 |
| 2012-04-22 23:00:00 | 37.96 |
| 2012-04-23 | 60.58 |
| 2012-04-23 01:00:00 | 58.76 |
| 2012-04-23 02:00:00 | 43.94 |
| 2012-04-23 03:00:00 | 20.8 |
| 2012-04-23 04:00:00 | 16.38 |
| 2012-04-23 05:00:00 | 13 |
| 2012-04-23 06:00:00 | 11.18 |
| 2012-04-23 07:00:00 | 12.48 |
| 2012-04-23 08:00:00 | 15.34 |
| 2012-04-23 09:00:00 | 15.34 |
| 2012-04-23 10:00:00 | 12.74 |
| 2012-04-23 11:00:00 | 13.26 |
| 2012-04-23 12:00:00 | 15.86 |
| 2012-04-23 13:00:00 | 13.52 |
| 2012-04-23 14:00:00 | 15.08 |
| 2012-04-23 15:00:00 | 14.82 |
| 2012-04-23 16:00:00 | 13.26 |
| 2012-04-23 17:00:00 | 13.26 |
| 2012-04-23 18:00:00 | 11.18 |
| 2012-04-23 19:00:00 | 10.92 |
| 2012-04-23 20:00:00 | 14.04 |
| 2012-04-23 21:00:00 | 15.6 |
| 2012-04-23 22:00:00 | 14.3 |
| 2012-04-23 23:00:00 | 15.86 |
| 2012-04-24 | 10.66 |
| 2012-04-24 01:00:00 | 10.92 |
| 2012-04-24 02:00:00 | 10.92 |
| 2012-04-24 03:00:00 | 10.92 |
| 2012-04-24 04:00:00 | 8.84 |
| 2012-04-24 05:00:00 | 9.88 |
| 2012-04-24 06:00:00 | 10.92 |
| 2012-04-24 07:00:00 | 10.92 |
| 2012-04-24 08:00:00 | 12.74 |
| 2012-04-24 09:00:00 | 11.18 |
| 2012-04-24 10:00:00 | 14.56 |
| 2012-04-24 11:00:00 | 15.08 |
| 2012-04-24 12:00:00 | 16.64 |
| 2012-04-24 13:00:00 | 14.56 |
| 2012-04-24 14:00:00 | 13.78 |
| 2012-04-24 15:00:00 | 12.74 |
| 2012-04-24 16:00:00 | 13 |
| 2012-04-24 17:00:00 | 10.92 |
| 2012-04-24 18:00:00 | 10.66 |
| 2012-04-24 19:00:00 | 13.78 |
| 2012-04-24 20:00:00 | 13.26 |
| 2012-04-24 21:00:00 | 13.52 |
| 2012-04-24 22:00:00 | 14.82 |
| 2012-04-24 23:00:00 | 15.08 |
| 2012-04-25 | 13 |
| 2012-04-25 01:00:00 | 10.4 |
| 2012-04-25 02:00:00 | 10.14 |
| 2012-04-25 03:00:00 | 10.92 |
| 2012-04-25 04:00:00 | 9.1 |
| 2012-04-25 05:00:00 | 9.36 |
| 2012-04-25 06:00:00 | 9.88 |
| 2012-04-25 07:00:00 | 10.92 |
| 2012-04-25 08:00:00 | 13.26 |
| 2012-04-25 09:00:00 | 15.08 |
| 2012-04-25 10:00:00 | 12.74 |
| 2012-04-25 11:00:00 | 12.48 |
| 2012-04-25 12:00:00 | 11.7 |
| 2012-04-25 13:00:00 | 13 |
| 2012-04-25 14:00:00 | 12.48 |
| 2012-04-25 15:00:00 | 11.44 |
| 2012-04-25 16:00:00 | 12.74 |
| 2012-04-25 17:00:00 | 13.52 |
| 2012-04-25 18:00:00 | 18.2 |
| 2012-04-25 19:00:00 | 18.98 |
| 2012-04-25 20:00:00 | 12.74 |
| 2012-04-25 21:00:00 | 14.04 |
| 2012-04-25 22:00:00 | 14.3 |
| 2012-04-25 23:00:00 | 13.26 |
| 2012-04-26 | 11.44 |
| 2012-04-26 01:00:00 | 9.62 |
| 2012-04-26 02:00:00 | 10.14 |
| 2012-04-26 03:00:00 | 10.4 |
| 2012-04-26 04:00:00 | 9.36 |
| 2012-04-26 05:00:00 | 8.84 |
| 2012-04-26 06:00:00 | 9.88 |
| 2012-04-26 07:00:00 | 10.92 |
| 2012-04-26 08:00:00 | 10.92 |
| 2012-04-26 09:00:00 | 12.74 |
| 2012-04-26 10:00:00 | 10.92 |
| 2012-04-26 11:00:00 | 11.44 |
| 2012-04-26 12:00:00 | 13.78 |
| 2012-04-26 13:00:00 | 15.08 |
| 2012-04-26 14:00:00 | 11.44 |
| 2012-04-26 15:00:00 | 11.18 |
| 2012-04-26 16:00:00 | 11.18 |
| 2012-04-26 17:00:00 | 10.14 |
| 2012-04-26 18:00:00 | 10.66 |
| 2012-04-26 19:00:00 | 10.92 |
| 2012-04-26 20:00:00 | 11.44 |
| 2012-04-26 21:00:00 | 11.44 |
| 2012-04-26 22:00:00 | 13.78 |
| 2012-04-26 23:00:00 | 10.66 |
| 2012-04-27 | 11.96 |
| 2012-04-27 01:00:00 | 11.44 |
| 2012-04-27 02:00:00 | 10.66 |
| 2012-04-27 03:00:00 | 9.88 |
| 2012-04-27 04:00:00 | 8.06 |
| 2012-04-27 05:00:00 | 9.1 |
| 2012-04-27 06:00:00 | 9.88 |
| 2012-04-27 07:00:00 | 10.14 |
| 2012-04-27 08:00:00 | 10.66 |
| 2012-04-27 09:00:00 | 11.96 |
| 2012-04-27 10:00:00 | 11.7 |
| 2012-04-27 11:00:00 | 10.92 |
| 2012-04-27 12:00:00 | 10.92 |
| 2012-04-27 13:00:00 | 10.14 |
| 2012-04-27 14:00:00 | 10.92 |
| 2012-04-27 15:00:00 | 10.92 |
| 2012-04-27 16:00:00 | 10.92 |
| 2012-04-27 17:00:00 | 10.92 |
| 2012-04-27 18:00:00 | 12.48 |
| 2012-04-27 19:00:00 | 10.92 |
| 2012-04-27 20:00:00 | 9.88 |
| 2012-04-27 21:00:00 | 10.14 |
| 2012-04-27 22:00:00 | 13 |
| 2012-04-27 23:00:00 | 11.18 |
| 2012-04-28 | 10.92 |
| 2012-04-28 01:00:00 | 10.14 |
| 2012-04-28 02:00:00 | 8.58 |
| 2012-04-28 03:00:00 | 9.62 |
| 2012-04-28 04:00:00 | 9.62 |
| 2012-04-28 05:00:00 | 8.84 |
| 2012-04-28 06:00:00 | 7.54 |
| 2012-04-28 07:00:00 | 10.14 |
| 2012-04-28 08:00:00 | 10.92 |
| 2012-04-28 09:00:00 | 10.92 |
| 2012-04-28 10:00:00 | 12.48 |
| 2012-04-28 11:00:00 | 10.92 |
| 2012-04-28 12:00:00 | 12.74 |
| 2012-04-28 13:00:00 | 19.76 |
| 2012-04-28 14:00:00 | 15.86 |
| 2012-04-28 15:00:00 | 13.26 |
| 2012-04-28 16:00:00 | 11.18 |
| 2012-04-28 17:00:00 | 13 |
| 2012-04-28 18:00:00 | 12.22 |
| 2012-04-28 19:00:00 | 9.62 |
| 2012-04-28 20:00:00 | 9.88 |
| 2012-04-28 21:00:00 | 9.62 |
| 2012-04-28 22:00:00 | 10.4 |
| 2012-04-28 23:00:00 | 12.22 |
| 2012-04-29 | 9.62 |
| 2012-04-29 01:00:00 | 9.1 |
| 2012-04-29 02:00:00 | 8.06 |
| 2012-04-29 03:00:00 | 8.32 |
| 2012-04-29 04:00:00 | 8.06 |
| 2012-04-29 05:00:00 | 8.58 |
| 2012-04-29 06:00:00 | 8.84 |
| 2012-04-29 07:00:00 | 7.8 |
| 2012-04-29 08:00:00 | 8.06 |
| 2012-04-29 09:00:00 | 8.58 |
| 2012-04-29 10:00:00 | 10.4 |
| 2012-04-29 11:00:00 | 13.26 |
| 2012-04-29 12:00:00 | 12.22 |
| 2012-04-29 13:00:00 | 10.14 |
| 2012-04-29 14:00:00 | 10.4 |
| 2012-04-29 15:00:00 | 10.4 |
| 2012-04-29 16:00:00 | 11.7 |
| 2012-04-29 17:00:00 | 11.96 |
| 2012-04-29 18:00:00 | 9.62 |
| 2012-04-29 19:00:00 | 9.36 |
| 2012-04-29 20:00:00 | 9.62 |
| 2012-04-29 21:00:00 | 10.14 |
| 2012-04-29 22:00:00 | 10.14 |
| 2012-04-29 23:00:00 | 12.48 |
| 2012-04-30 | 12.22 |
| 2012-04-30 01:00:00 | 8.58 |
| 2012-04-30 02:00:00 | 9.88 |
| 2012-04-30 03:00:00 | 10.92 |
| 2012-04-30 04:00:00 | 9.36 |
| 2012-04-30 05:00:00 | 9.1 |
| 2012-04-30 06:00:00 | 10.66 |
| 2012-04-30 07:00:00 | 10.66 |
| 2012-04-30 08:00:00 | 11.18 |
| 2012-04-30 09:00:00 | 11.96 |
| 2012-04-30 10:00:00 | 11.18 |
| 2012-04-30 11:00:00 | 13 |
| 2012-04-30 12:00:00 | 13.78 |
| 2012-04-30 13:00:00 | 10.92 |
| 2012-04-30 14:00:00 | 10.92 |
| 2012-04-30 15:00:00 | 13.78 |
| 2012-04-30 16:00:00 | 11.7 |
| 2012-04-30 17:00:00 | 14.56 |
| 2012-04-30 18:00:00 | 13.26 |
| 2012-04-30 19:00:00 | 10.92 |
| 2012-04-30 20:00:00 | 11.96 |
| 2012-04-30 21:00:00 | 12.22 |
| 2012-04-30 22:00:00 | 13.52 |
| 2012-04-30 23:00:00 | 11.96 |
| 2012-05-01 | 11.7 |
| 2012-05-01 01:00:00 | 11.7 |
| 2012-05-01 02:00:00 | 11.7 |
| 2012-05-01 03:00:00 | 10.4 |
| 2012-05-01 04:00:00 | 8.58 |
| 2012-05-01 05:00:00 | 11.18 |
| 2012-05-01 06:00:00 | 10.92 |
| 2012-05-01 07:00:00 | 10.14 |
| 2012-05-01 08:00:00 | 10.14 |
| 2012-05-01 09:00:00 | 10.4 |
| 2012-05-01 10:00:00 | 12.74 |
| 2012-05-01 11:00:00 | 12.74 |
| 2012-05-01 12:00:00 | 11.18 |
| 2012-05-01 13:00:00 | 13.52 |
| 2012-05-01 14:00:00 | 14.3 |
| 2012-05-01 15:00:00 | 12.74 |
| 2012-05-01 16:00:00 | 11.44 |
| 2012-05-01 17:00:00 | 11.18 |
| 2012-05-01 18:00:00 | 11.96 |
| 2012-05-01 19:00:00 | 11.96 |
| 2012-05-01 20:00:00 | 14.04 |
| 2012-05-01 21:00:00 | 11.7 |
| 2012-05-01 22:00:00 | 11.96 |
| 2012-05-01 23:00:00 | 14.04 |
| 2012-05-02 | 12.22 |
| 2012-05-02 01:00:00 | 11.44 |
| 2012-05-02 02:00:00 | 9.1 |
| 2012-05-02 03:00:00 | 9.88 |
| 2012-05-02 04:00:00 | 10.66 |
| 2012-05-02 05:00:00 | 8.32 |
| 2012-05-02 06:00:00 | 10.14 |
| 2012-05-02 07:00:00 | 10.66 |
| 2012-05-02 08:00:00 | 12.22 |
| 2012-05-02 09:00:00 | 12.48 |
| 2012-05-02 10:00:00 | 12.22 |
| 2012-05-02 11:00:00 | 12.22 |
| 2012-05-02 12:00:00 | 12.48 |
| 2012-05-02 13:00:00 | 11.44 |
| 2012-05-02 14:00:00 | 11.96 |
| 2012-05-02 15:00:00 | 12.48 |
| 2012-05-02 16:00:00 | 12.74 |
| 2012-05-02 17:00:00 | 11.18 |
| 2012-05-02 18:00:00 | 10.92 |
| 2012-05-02 19:00:00 | 10.92 |
| 2012-05-02 20:00:00 | 12.48 |
| 2012-05-02 21:00:00 | 12.74 |
| 2012-05-02 22:00:00 | 12.74 |
| 2012-05-02 23:00:00 | 11.44 |
| 2012-05-03 | 12.48 |
| 2012-05-03 01:00:00 | 11.18 |
| 2012-05-03 02:00:00 | 10.14 |
| 2012-05-03 03:00:00 | 8.84 |
| 2012-05-03 04:00:00 | 9.88 |
| 2012-05-03 05:00:00 | 10.14 |
| 2012-05-03 06:00:00 | 26.26 |
| 2012-05-03 07:00:00 | 22.36 |
| 2012-05-03 08:00:00 | 16.38 |
| 2012-05-03 09:00:00 | 13.78 |
| 2012-05-03 10:00:00 | 13.78 |
| 2012-05-03 11:00:00 | 13.78 |
| 2012-05-03 12:00:00 | 13.52 |
| 2012-05-03 13:00:00 | 13.26 |
| 2012-05-03 14:00:00 | 14.3 |
| 2012-05-03 15:00:00 | 13.52 |
| 2012-05-03 16:00:00 | 13.52 |
| 2012-05-03 17:00:00 | 13.52 |
| 2012-05-03 18:00:00 | 13.52 |
| 2012-05-03 19:00:00 | 11.96 |
| 2012-05-03 20:00:00 | 11.18 |
| 2012-05-03 21:00:00 | 13.52 |
| 2012-05-03 22:00:00 | 14.3 |
| 2012-05-03 23:00:00 | 13.78 |
| 2012-05-04 | 12.22 |
| 2012-05-04 01:00:00 | 12.74 |
| 2012-05-04 02:00:00 | 10.66 |
| 2012-05-04 03:00:00 | 9.36 |
| 2012-05-04 04:00:00 | 11.44 |
| 2012-05-04 05:00:00 | 10.92 |
| 2012-05-04 06:00:00 | 9.62 |
| 2012-05-04 07:00:00 | 10.66 |
| 2012-05-04 08:00:00 | 11.44 |
| 2012-05-04 09:00:00 | 13 |
| 2012-05-04 10:00:00 | 11.96 |
| 2012-05-04 11:00:00 | 12.74 |
| 2012-05-04 12:00:00 | 11.7 |
| 2012-05-04 13:00:00 | 12.74 |
| 2012-05-04 14:00:00 | 60.58 |
| 2012-05-04 15:00:00 | 114.4 |
| 2012-05-04 16:00:00 | 111.28 |
| 2012-05-04 17:00:00 | 107.64 |
| 2012-05-04 18:00:00 | 35.62 |
| 2012-05-04 19:00:00 | 38.74 |
| 2012-05-04 20:00:00 | 64.22 |
| 2012-05-04 21:00:00 | 51.48 |
| 2012-05-04 22:00:00 | 35.62 |
| 2012-05-04 23:00:00 | 36.4 |
| 2012-05-05 | 39 |
| 2012-05-05 01:00:00 | 22.62 |
| 2012-05-05 02:00:00 | 18.72 |
| 2012-05-05 03:00:00 | 18.2 |
| 2012-05-05 04:00:00 | 18.2 |
| 2012-05-05 05:00:00 | 18.46 |
| 2012-05-05 06:00:00 | 13.26 |
| 2012-05-05 07:00:00 | 12.48 |
| 2012-05-05 08:00:00 | 14.56 |
| 2012-05-05 09:00:00 | 14.3 |
| 2012-05-05 10:00:00 | 14.56 |
| 2012-05-05 11:00:00 | 17.68 |
| 2012-05-05 12:00:00 | 15.34 |
| 2012-05-05 13:00:00 | 18.2 |
| 2012-05-05 14:00:00 | 16.38 |
| 2012-05-05 15:00:00 | 17.16 |
| 2012-05-05 16:00:00 | 14.56 |
| 2012-05-05 17:00:00 | 12.48 |
| 2012-05-05 18:00:00 | 13.26 |
| 2012-05-05 19:00:00 | 11.18 |
| 2012-05-05 20:00:00 | 12.22 |
| 2012-05-05 21:00:00 | 15.34 |
| 2012-05-05 22:00:00 | 84.5 |
| 2012-05-05 23:00:00 | 102.96 |
| 2012-05-06 | 33.54 |
| 2012-05-06 01:00:00 | 22.36 |
| 2012-05-06 02:00:00 | 20.02 |
| 2012-05-06 03:00:00 | 12.48 |
| 2012-05-06 04:00:00 | 11.44 |
| 2012-05-06 05:00:00 | 10.92 |
| 2012-05-06 06:00:00 | 10.14 |
| 2012-05-06 07:00:00 | 11.96 |
| 2012-05-06 08:00:00 | 11.7 |
| 2012-05-06 09:00:00 | 11.96 |
| 2012-05-06 10:00:00 | 12.74 |
| 2012-05-06 11:00:00 | 12.48 |
| 2012-05-06 12:00:00 | 12.74 |
| 2012-05-06 13:00:00 | 14.3 |
| 2012-05-06 14:00:00 | 12.74 |
| 2012-05-06 15:00:00 | 12.74 |
| 2012-05-06 16:00:00 | 11.44 |
| 2012-05-06 17:00:00 | 12.48 |
| 2012-05-06 18:00:00 | 11.18 |
| 2012-05-06 19:00:00 | 11.7 |
| 2012-05-06 20:00:00 | 14.04 |
| 2012-05-06 21:00:00 | 12.48 |
| 2012-05-06 22:00:00 | 12.48 |
| 2012-05-06 23:00:00 | 13 |
| 2012-05-07 | 48.62 |
| 2012-05-07 01:00:00 | 107.64 |
| 2012-05-07 02:00:00 | 107.12 |
| 2012-05-07 03:00:00 | 81.64 |
| 2012-05-07 04:00:00 | 31.2 |
| 2012-05-07 05:00:00 | 26.52 |
| 2012-05-07 06:00:00 | 25.74 |
| 2012-05-07 07:00:00 | 24.18 |
| 2012-05-07 08:00:00 | 23.92 |
| 2012-05-07 09:00:00 | 27.04 |
| 2012-05-07 10:00:00 | 23.92 |
| 2012-05-07 11:00:00 | 21.58 |
| 2012-05-07 12:00:00 | 19.76 |
| 2012-05-07 13:00:00 | 21.32 |
| 2012-05-07 14:00:00 | 21.06 |
| 2012-05-07 15:00:00 | 20.8 |
| 2012-05-07 16:00:00 | 19.5 |
| 2012-05-07 17:00:00 | 19.24 |
| 2012-05-07 18:00:00 | 20.02 |
| 2012-05-07 19:00:00 | 19.5 |
| 2012-05-07 20:00:00 | 18.98 |
| 2012-05-07 21:00:00 | 20.02 |
| 2012-05-07 22:00:00 | 20.8 |
| 2012-05-07 23:00:00 | 19.76 |
| 2012-05-08 | 18.98 |
| 2012-05-08 01:00:00 | 18.98 |
| 2012-05-08 02:00:00 | 18.98 |
| 2012-05-08 03:00:00 | 10.92 |
| 2012-05-08 04:00:00 | 10.66 |
| 2012-05-08 05:00:00 | 12.22 |
| 2012-05-08 06:00:00 | 11.96 |
| 2012-05-08 07:00:00 | 11.96 |
| 2012-05-08 08:00:00 | 12.48 |
| 2012-05-08 09:00:00 | 11.18 |
| 2012-05-08 10:00:00 | 12.22 |
| 2012-05-08 11:00:00 | 13.78 |
| 2012-05-08 12:00:00 | 13.78 |
| 2012-05-08 13:00:00 | 11.96 |
| 2012-05-08 14:00:00 | 13.52 |
| 2012-05-08 15:00:00 | 11.7 |
| 2012-05-08 16:00:00 | 13.78 |
| 2012-05-08 17:00:00 | 12.22 |
| 2012-05-08 18:00:00 | 11.7 |
| 2012-05-08 19:00:00 | 11.44 |
| 2012-05-08 20:00:00 | 11.7 |
| 2012-05-08 21:00:00 | 13.78 |
| 2012-05-08 22:00:00 | 14.3 |
| 2012-05-08 23:00:00 | 13.52 |
| 2012-05-09 | 11.44 |
| 2012-05-09 01:00:00 | 10.92 |
| 2012-05-09 02:00:00 | 10.92 |
| 2012-05-09 03:00:00 | 10.14 |
| 2012-05-09 04:00:00 | 10.4 |
| 2012-05-09 05:00:00 | 8.84 |
| 2012-05-09 06:00:00 | 9.36 |
| 2012-05-09 07:00:00 | 10.92 |
| 2012-05-09 08:00:00 | 11.18 |
| 2012-05-09 09:00:00 | 13 |
| 2012-05-09 10:00:00 | 11.7 |
| 2012-05-09 11:00:00 | 12.74 |
| 2012-05-09 12:00:00 | 11.44 |
| 2012-05-09 13:00:00 | 10.4 |
| 2012-05-09 14:00:00 | 11.7 |
| 2012-05-09 15:00:00 | 11.7 |
| 2012-05-09 16:00:00 | 11.44 |
| 2012-05-09 17:00:00 | 11.7 |
| 2012-05-09 18:00:00 | 11.44 |
| 2012-05-09 19:00:00 | 11.44 |
| 2012-05-09 20:00:00 | 10.66 |
| 2012-05-09 21:00:00 | 10.66 |
| 2012-05-09 22:00:00 | 14.04 |
| 2012-05-09 23:00:00 | 13.26 |
| 2012-05-10 | 11.7 |
| 2012-05-10 01:00:00 | 10.66 |
| 2012-05-10 02:00:00 | 10.66 |
| 2012-05-10 03:00:00 | 9.1 |
| 2012-05-10 04:00:00 | 8.32 |
| 2012-05-10 05:00:00 | 9.88 |
| 2012-05-10 06:00:00 | 9.62 |
| 2012-05-10 07:00:00 | 10.66 |
| 2012-05-10 08:00:00 | 11.44 |
| 2012-05-10 09:00:00 | 11.18 |
| 2012-05-10 10:00:00 | 11.7 |
| 2012-05-10 11:00:00 | 11.7 |
| 2012-05-10 12:00:00 | 11.44 |
| 2012-05-10 13:00:00 | 11.44 |
| 2012-05-10 14:00:00 | 11.18 |
| 2012-05-10 15:00:00 | 10.4 |
| 2012-05-10 16:00:00 | 10.4 |
| 2012-05-10 17:00:00 | 9.36 |
| 2012-05-10 18:00:00 | 10.4 |
| 2012-05-10 19:00:00 | 11.96 |
| 2012-05-10 20:00:00 | 11.96 |
| 2012-05-10 21:00:00 | 11.96 |
| 2012-05-10 22:00:00 | 12.22 |
| 2012-05-10 23:00:00 | 12.22 |
| 2012-05-11 | 12.22 |
| 2012-05-11 01:00:00 | 11.18 |
| 2012-05-11 02:00:00 | 11.44 |
| 2012-05-11 03:00:00 | 10.4 |
| 2012-05-11 04:00:00 | 10.4 |
| 2012-05-11 05:00:00 | 9.62 |
| 2012-05-11 06:00:00 | 11.44 |
| 2012-05-11 07:00:00 | 11.18 |
| 2012-05-11 08:00:00 | 12.22 |
| 2012-05-11 09:00:00 | 12.48 |
| 2012-05-11 10:00:00 | 14.04 |
| 2012-05-11 11:00:00 | 12.48 |
| 2012-05-11 12:00:00 | 11.96 |
| 2012-05-11 13:00:00 | 11.96 |
| 2012-05-11 14:00:00 | 11.18 |
| 2012-05-11 15:00:00 | 11.44 |
| 2012-05-11 16:00:00 | 11.7 |
| 2012-05-11 17:00:00 | 10.92 |
| 2012-05-11 18:00:00 | 11.44 |
| 2012-05-11 19:00:00 | 10.92 |
| 2012-05-11 20:00:00 | 10.92 |
| 2012-05-11 21:00:00 | 11.7 |
| 2012-05-11 22:00:00 | 12.48 |
| 2012-05-11 23:00:00 | 11.7 |
| 2012-05-12 | 11.44 |
| 2012-05-12 01:00:00 | 9.88 |
| 2012-05-12 02:00:00 | 10.14 |
| 2012-05-12 03:00:00 | 9.62 |
| 2012-05-12 04:00:00 | 9.88 |
| 2012-05-12 05:00:00 | 9.1 |
| 2012-05-12 06:00:00 | 8.58 |
| 2012-05-12 07:00:00 | 9.88 |
| 2012-05-12 08:00:00 | 10.4 |
| 2012-05-12 09:00:00 | 10.92 |
| 2012-05-12 10:00:00 | 11.18 |
| 2012-05-12 11:00:00 | 10.92 |
| 2012-05-12 12:00:00 | 10.4 |
| 2012-05-12 13:00:00 | 24.44 |
| 2012-05-12 14:00:00 | 61.1 |
| 2012-05-12 15:00:00 | 50.18 |
| 2012-05-12 16:00:00 | 1.04 |
| 2012-05-12 17:00:00 | 0.78 |
| 2012-05-12 18:00:00 | 0.78 |
| 2012-05-12 19:00:00 | 27.56 |
| 2012-05-12 20:00:00 | 34.06 |
| 2012-05-12 21:00:00 | 21.06 |
| 2012-05-12 22:00:00 | 20.02 |
| 2012-05-12 23:00:00 | 12.74 |
| 2012-05-13 | 12.48 |
| 2012-05-13 01:00:00 | 12.22 |
| 2012-05-13 02:00:00 | 10.66 |
| 2012-05-13 03:00:00 | 10.4 |
| 2012-05-13 04:00:00 | 9.88 |
| 2012-05-13 05:00:00 | 10.4 |
| 2012-05-13 06:00:00 | 10.4 |
| 2012-05-13 07:00:00 | 9.62 |
| 2012-05-13 08:00:00 | 10.14 |
| 2012-05-13 09:00:00 | 10.14 |
| 2012-05-13 10:00:00 | 11.7 |
| 2012-05-13 11:00:00 | 13 |
| 2012-05-13 12:00:00 | 12.48 |
| 2012-05-13 13:00:00 | 12.48 |
| 2012-05-13 14:00:00 | 11.96 |
| 2012-05-13 15:00:00 | 12.74 |
| 2012-05-13 16:00:00 | 12.48 |
| 2012-05-13 17:00:00 | 10.4 |
| 2012-05-13 18:00:00 | 10.14 |
| 2012-05-13 19:00:00 | 10.14 |
| 2012-05-13 20:00:00 | 11.18 |
| 2012-05-13 21:00:00 | 11.96 |
| 2012-05-13 22:00:00 | 12.74 |
| 2012-05-13 23:00:00 | 10.92 |
| 2012-05-14 | 9.88 |
| 2012-05-14 01:00:00 | 9.1 |
| 2012-05-14 02:00:00 | 10.92 |
| 2012-05-14 03:00:00 | 11.18 |
| 2012-05-14 04:00:00 | 9.62 |
| 2012-05-14 05:00:00 | 8.84 |
| 2012-05-14 06:00:00 | 8.84 |
| 2012-05-14 07:00:00 | 11.7 |
| 2012-05-14 08:00:00 | 11.96 |
| 2012-05-14 09:00:00 | 11.96 |
| 2012-05-14 10:00:00 | 12.22 |
| 2012-05-14 11:00:00 | 12.48 |
| 2012-05-14 12:00:00 | 13.78 |
| 2012-05-14 13:00:00 | 12.48 |
| 2012-05-14 14:00:00 | 12.48 |
| 2012-05-14 15:00:00 | 12.74 |
| 2012-05-14 16:00:00 | 12.22 |
| 2012-05-14 17:00:00 | 12.48 |
| 2012-05-14 18:00:00 | 12.22 |
| 2012-05-14 19:00:00 | 12.22 |
| 2012-05-14 20:00:00 | 12.48 |
| 2012-05-14 21:00:00 | 13.78 |
| 2012-05-14 22:00:00 | 13.78 |
| 2012-05-14 23:00:00 | 12.22 |
| 2012-05-15 | 13.26 |
| 2012-05-15 01:00:00 | 11.96 |
| 2012-05-15 02:00:00 | 11.18 |
| 2012-05-15 03:00:00 | 11.18 |
| 2012-05-15 04:00:00 | 10.14 |
| 2012-05-15 05:00:00 | 10.14 |
| 2012-05-15 06:00:00 | 10.14 |
| 2012-05-15 07:00:00 | 11.96 |
| 2012-05-15 08:00:00 | 11.44 |
| 2012-05-15 09:00:00 | 11.96 |
| 2012-05-15 10:00:00 | 11.96 |
| 2012-05-15 11:00:00 | 12.22 |
| 2012-05-15 12:00:00 | 12.74 |
| 2012-05-15 13:00:00 | 12.22 |
| 2012-05-15 14:00:00 | 11.96 |
| 2012-05-15 15:00:00 | 11.96 |
| 2012-05-15 16:00:00 | 12.22 |
| 2012-05-15 17:00:00 | 11.96 |
| 2012-05-15 18:00:00 | 12.22 |
| 2012-05-15 19:00:00 | 12.48 |
| 2012-05-15 20:00:00 | 12.74 |
| 2012-05-15 21:00:00 | 12.48 |
| 2012-05-15 22:00:00 | 14.04 |
| 2012-05-15 23:00:00 | 12.48 |
| 2012-05-16 | 12.48 |
| 2012-05-16 01:00:00 | 12.22 |
| 2012-05-16 02:00:00 | 11.44 |
| 2012-05-16 03:00:00 | 10.4 |
| 2012-05-16 04:00:00 | 10.14 |
| 2012-05-16 05:00:00 | 10.14 |
| 2012-05-16 06:00:00 | 11.18 |
| 2012-05-16 07:00:00 | 10.92 |
| 2012-05-16 08:00:00 | 11.18 |
| 2012-05-16 09:00:00 | 12.48 |
| 2012-05-16 10:00:00 | 13.26 |
| 2012-05-16 11:00:00 | 11.7 |
| 2012-05-16 12:00:00 | 11.7 |
| 2012-05-16 13:00:00 | 11.44 |
| 2012-05-16 14:00:00 | 11.44 |
| 2012-05-16 15:00:00 | 11.44 |
| 2012-05-16 16:00:00 | 11.44 |
| 2012-05-16 17:00:00 | 11.7 |
| 2012-05-16 18:00:00 | 11.44 |
| 2012-05-16 19:00:00 | 11.7 |
| 2012-05-16 20:00:00 | 13.26 |
| 2012-05-16 21:00:00 | 11.96 |
| 2012-05-16 22:00:00 | 13.78 |
| 2012-05-16 23:00:00 | 12.48 |
| 2012-05-17 | 12.22 |
| 2012-05-17 01:00:00 | 11.7 |
| 2012-05-17 02:00:00 | 10.92 |
| 2012-05-17 03:00:00 | 10.4 |
| 2012-05-17 04:00:00 | 9.36 |
| 2012-05-17 05:00:00 | 9.62 |
| 2012-05-17 06:00:00 | 8.84 |
| 2012-05-17 07:00:00 | 10.4 |
| 2012-05-17 08:00:00 | 11.18 |
| 2012-05-17 09:00:00 | 11.44 |
| 2012-05-17 10:00:00 | 11.7 |
| 2012-05-17 11:00:00 | 11.7 |
| 2012-05-17 12:00:00 | 11.7 |
| 2012-05-17 13:00:00 | 11.44 |
| 2012-05-17 14:00:00 | 12.22 |
| 2012-05-17 15:00:00 | 11.96 |
| 2012-05-17 16:00:00 | 11.7 |
| 2012-05-17 17:00:00 | 11.96 |
| 2012-05-17 18:00:00 | 11.7 |
| 2012-05-17 19:00:00 | 11.96 |
| 2012-05-17 20:00:00 | 11.7 |
| 2012-05-17 21:00:00 | 13.26 |
| 2012-05-17 22:00:00 | 12.48 |
| 2012-05-17 23:00:00 | 13 |
| 2012-05-18 | 12.22 |
| 2012-05-18 01:00:00 | 11.96 |
| 2012-05-18 02:00:00 | 10.92 |
| 2012-05-18 03:00:00 | 10.14 |
| 2012-05-18 04:00:00 | 9.88 |
| 2012-05-18 05:00:00 | 9.36 |
| 2012-05-18 06:00:00 | 9.1 |
| 2012-05-18 07:00:00 | 10.66 |
| 2012-05-18 08:00:00 | 11.44 |
| 2012-05-18 09:00:00 | 11.44 |
| 2012-05-18 10:00:00 | 11.7 |
| 2012-05-18 11:00:00 | 11.7 |
| 2012-05-18 12:00:00 | 11.7 |
| 2012-05-18 13:00:00 | 11.7 |
| 2012-05-18 14:00:00 | 11.7 |
| 2012-05-18 15:00:00 | 11.7 |
| 2012-05-18 16:00:00 | 11.7 |
| 2012-05-18 17:00:00 | 11.7 |
| 2012-05-18 18:00:00 | 11.7 |
| 2012-05-18 19:00:00 | 11.96 |
| 2012-05-18 20:00:00 | 11.7 |
| 2012-05-18 21:00:00 | 11.96 |
| 2012-05-18 22:00:00 | 11.96 |
| 2012-05-18 23:00:00 | 11.96 |
| 2012-05-19 | 11.7 |
| 2012-05-19 01:00:00 | 11.44 |
| 2012-05-19 02:00:00 | 11.18 |
| 2012-05-19 03:00:00 | 9.36 |
| 2012-05-19 04:00:00 | 9.88 |
| 2012-05-19 05:00:00 | 9.88 |
| 2012-05-19 06:00:00 | 9.62 |
| 2012-05-19 07:00:00 | 10.4 |
| 2012-05-19 08:00:00 | 9.62 |
| 2012-05-19 09:00:00 | 10.66 |
| 2012-05-19 10:00:00 | 10.66 |
| 2012-05-19 11:00:00 | 11.7 |
| 2012-05-19 12:00:00 | 11.7 |
| 2012-05-19 13:00:00 | 12.22 |
| 2012-05-19 14:00:00 | 13.26 |
| 2012-05-19 15:00:00 | 11.7 |
| 2012-05-19 16:00:00 | 10.4 |
| 2012-05-19 17:00:00 | 10.14 |
| 2012-05-19 18:00:00 | 9.88 |
| 2012-05-19 19:00:00 | 10.4 |
| 2012-05-19 20:00:00 | 9.88 |
| 2012-05-19 21:00:00 | 10.4 |
| 2012-05-19 22:00:00 | 10.4 |
| 2012-05-19 23:00:00 | 10.66 |
| 2012-05-20 | 10.66 |
| 2012-05-20 01:00:00 | 9.88 |
| 2012-05-20 02:00:00 | 8.84 |
| 2012-05-20 03:00:00 | 8.58 |
| 2012-05-20 04:00:00 | 8.58 |
| 2012-05-20 05:00:00 | 7.8 |
| 2012-05-20 06:00:00 | 8.58 |
| 2012-05-20 07:00:00 | 7.54 |
| 2012-05-20 08:00:00 | 8.84 |
| 2012-05-20 09:00:00 | 9.62 |
| 2012-05-20 10:00:00 | 10.66 |
| 2012-05-20 11:00:00 | 10.92 |
| 2012-05-20 12:00:00 | 10.92 |
| 2012-05-20 13:00:00 | 10.66 |
| 2012-05-20 14:00:00 | 10.66 |
| 2012-05-20 15:00:00 | 10.66 |
| 2012-05-20 16:00:00 | 10.4 |
| 2012-05-20 17:00:00 | 10.66 |
| 2012-05-20 18:00:00 | 10.66 |
| 2012-05-20 19:00:00 | 10.14 |
| 2012-05-20 20:00:00 | 9.88 |
| 2012-05-20 21:00:00 | 10.4 |
| 2012-05-20 22:00:00 | 11.7 |
| 2012-05-20 23:00:00 | 11.44 |
| 2012-05-21 | 11.18 |
| 2012-05-21 01:00:00 | 9.36 |
| 2012-05-21 02:00:00 | 8.32 |
| 2012-05-21 03:00:00 | 8.06 |
| 2012-05-21 04:00:00 | 6.76 |
| 2012-05-21 05:00:00 | 8.06 |
| 2012-05-21 06:00:00 | 7.02 |
| 2012-05-21 07:00:00 | 8.32 |
| 2012-05-21 08:00:00 | 8.84 |
| 2012-05-21 09:00:00 | 10.66 |
| 2012-05-21 10:00:00 | 10.66 |
| 2012-05-21 11:00:00 | 9.88 |
| 2012-05-21 12:00:00 | 9.1 |
| 2012-05-21 13:00:00 | 9.62 |
| 2012-05-21 14:00:00 | 8.58 |
| 2012-05-21 15:00:00 | 9.62 |
| 2012-05-21 16:00:00 | 8.58 |
| 2012-05-21 17:00:00 | 8.58 |
| 2012-05-21 18:00:00 | 8.84 |
| 2012-05-21 19:00:00 | 9.36 |
| 2012-05-21 20:00:00 | 8.84 |
| 2012-05-21 21:00:00 | 9.88 |
| 2012-05-21 22:00:00 | 10.14 |
| 2012-05-21 23:00:00 | 9.62 |
| 2012-05-22 | 9.36 |
| 2012-05-22 01:00:00 | 8.58 |
| 2012-05-22 02:00:00 | 8.32 |
| 2012-05-22 03:00:00 | 7.02 |
| 2012-05-22 04:00:00 | 7.8 |
| 2012-05-22 05:00:00 | 6.76 |
| 2012-05-22 06:00:00 | 6.76 |
| 2012-05-22 07:00:00 | 8.06 |
| 2012-05-22 08:00:00 | 8.84 |
| 2012-05-22 09:00:00 | 9.62 |
| 2012-05-22 10:00:00 | 8.84 |
| 2012-05-22 11:00:00 | 9.62 |
| 2012-05-22 12:00:00 | 9.62 |
| 2012-05-22 13:00:00 | 9.88 |
| 2012-05-22 14:00:00 | 11.18 |
| 2012-05-22 15:00:00 | 18.2 |
| 2012-05-22 16:00:00 | 18.46 |
| 2012-05-22 17:00:00 | 15.6 |
| 2012-05-22 18:00:00 | 14.82 |
| 2012-05-22 19:00:00 | 13 |
| 2012-05-22 20:00:00 | 11.44 |
| 2012-05-22 21:00:00 | 12.48 |
| 2012-05-22 22:00:00 | 13.52 |
| 2012-05-22 23:00:00 | 14.3 |
| 2012-05-23 | 11.44 |
| 2012-05-23 01:00:00 | 8.84 |
| 2012-05-23 02:00:00 | 11.96 |
| 2012-05-23 03:00:00 | 8.32 |
| 2012-05-23 04:00:00 | 8.06 |
| 2012-05-23 05:00:00 | 10.4 |
| 2012-05-23 06:00:00 | 9.36 |
| 2012-05-23 07:00:00 | 10.66 |
| 2012-05-23 08:00:00 | 12.74 |
| 2012-05-23 09:00:00 | 10.92 |
| 2012-05-23 10:00:00 | 11.96 |
| 2012-05-23 11:00:00 | 13.26 |
| 2012-05-23 12:00:00 | 12.48 |
| 2012-05-23 13:00:00 | 13.52 |
| 2012-05-23 14:00:00 | 13 |
| 2012-05-23 15:00:00 | 12.22 |
| 2012-05-23 16:00:00 | 10.66 |
| 2012-05-23 17:00:00 | 11.7 |
| 2012-05-23 18:00:00 | 11.96 |
| 2012-05-23 19:00:00 | 10.4 |
| 2012-05-23 20:00:00 | 12.74 |
| 2012-05-23 21:00:00 | 12.22 |
| 2012-05-23 22:00:00 | 10.66 |
| 2012-05-23 23:00:00 | 11.96 |
| 2012-05-24 | 11.96 |
| 2012-05-24 01:00:00 | 8.84 |
| 2012-05-24 02:00:00 | 8.58 |
| 2012-05-24 03:00:00 | 9.1 |
| 2012-05-24 04:00:00 | 7.28 |
| 2012-05-24 05:00:00 | 8.58 |
| 2012-05-24 06:00:00 | 9.62 |
| 2012-05-24 07:00:00 | 8.84 |
| 2012-05-24 08:00:00 | 10.66 |
| 2012-05-24 09:00:00 | 11.44 |
| 2012-05-24 10:00:00 | 9.36 |
| 2012-05-24 11:00:00 | 10.66 |
| 2012-05-24 12:00:00 | 11.44 |
| 2012-05-24 13:00:00 | 9.36 |
| 2012-05-24 14:00:00 | 10.66 |
| 2012-05-24 15:00:00 | 11.44 |
| 2012-05-24 16:00:00 | 11.96 |
| 2012-05-24 17:00:00 | 9.88 |
| 2012-05-24 18:00:00 | 10.66 |
| 2012-05-24 19:00:00 | 11.18 |
| 2012-05-24 20:00:00 | 9.62 |
| 2012-05-24 21:00:00 | 11.18 |
| 2012-05-24 22:00:00 | 11.7 |
| 2012-05-24 23:00:00 | 11.44 |
| 2012-05-25 | 10.4 |
| 2012-05-25 01:00:00 | 10.66 |
| 2012-05-25 02:00:00 | 9.1 |
| 2012-05-25 03:00:00 | 8.58 |
| 2012-05-25 04:00:00 | 8.32 |
| 2012-05-25 05:00:00 | 7.02 |
| 2012-05-25 06:00:00 | 7.28 |
| 2012-05-25 07:00:00 | 7.28 |
| 2012-05-25 08:00:00 | 9.62 |
| 2012-05-25 09:00:00 | 10.14 |
| 2012-05-25 10:00:00 | 9.62 |
| 2012-05-25 11:00:00 | 8.84 |
| 2012-05-25 12:00:00 | 9.62 |
| 2012-05-25 13:00:00 | 8.58 |
| 2012-05-25 14:00:00 | 9.62 |
| 2012-05-25 15:00:00 | 12.74 |
| 2012-05-25 16:00:00 | 12.74 |
| 2012-05-25 17:00:00 | 12.22 |
| 2012-05-25 18:00:00 | 11.7 |
| 2012-05-25 19:00:00 | 12.74 |
| 2012-05-25 20:00:00 | 12.22 |
| 2012-05-25 21:00:00 | 8.84 |
| 2012-05-25 22:00:00 | 10.92 |
| 2012-05-25 23:00:00 | 9.88 |
| 2012-05-26 | 11.18 |
| 2012-05-26 01:00:00 | 9.36 |
| 2012-05-26 02:00:00 | 8.84 |
| 2012-05-26 03:00:00 | 8.32 |
| 2012-05-26 04:00:00 | 8.32 |
| 2012-05-26 05:00:00 | 8.06 |
| 2012-05-26 06:00:00 | 7.28 |
| 2012-05-26 07:00:00 | 7.8 |
| 2012-05-26 08:00:00 | 8.32 |
| 2012-05-26 09:00:00 | 8.06 |
| 2012-05-26 10:00:00 | 8.32 |
| 2012-05-26 11:00:00 | 9.88 |
| 2012-05-26 12:00:00 | 10.66 |
| 2012-05-26 13:00:00 | 9.62 |
| 2012-05-26 14:00:00 | 9.36 |
| 2012-05-26 15:00:00 | 8.32 |
| 2012-05-26 16:00:00 | 9.36 |
| 2012-05-26 17:00:00 | 8.06 |
| 2012-05-26 18:00:00 | 7.8 |
| 2012-05-26 19:00:00 | 8.06 |
| 2012-05-26 20:00:00 | 7.8 |
| 2012-05-26 21:00:00 | 8.84 |
| 2012-05-26 22:00:00 | 8.06 |
| 2012-05-26 23:00:00 | 8.84 |
| 2012-05-27 | 8.06 |
| 2012-05-27 01:00:00 | 7.8 |
| 2012-05-27 02:00:00 | 7.8 |
| 2012-05-27 03:00:00 | 6.76 |
| 2012-05-27 04:00:00 | 7.28 |
| 2012-05-27 05:00:00 | 6.5 |
| 2012-05-27 06:00:00 | 6.5 |
| 2012-05-27 07:00:00 | 7.54 |
| 2012-05-27 08:00:00 | 6.5 |
| 2012-05-27 09:00:00 | 8.06 |
| 2012-05-27 10:00:00 | 8.06 |
| 2012-05-27 11:00:00 | 9.1 |
| 2012-05-27 12:00:00 | 10.14 |
| 2012-05-27 13:00:00 | 9.62 |
| 2012-05-27 14:00:00 | 8.84 |
| 2012-05-27 15:00:00 | 8.58 |
| 2012-05-27 16:00:00 | 8.32 |
| 2012-05-27 17:00:00 | 7.8 |
| 2012-05-27 18:00:00 | 8.06 |
| 2012-05-27 19:00:00 | 9.36 |
| 2012-05-27 20:00:00 | 8.84 |
| 2012-05-27 21:00:00 | 9.62 |
| 2012-05-27 22:00:00 | 9.1 |
| 2012-05-27 23:00:00 | 9.62 |
| 2012-05-28 | 8.58 |
| 2012-05-28 01:00:00 | 8.58 |
| 2012-05-28 02:00:00 | 7.54 |
| 2012-05-28 03:00:00 | 8.06 |
| 2012-05-28 04:00:00 | 8.06 |
| 2012-05-28 05:00:00 | 7.54 |
| 2012-05-28 06:00:00 | 7.28 |
| 2012-05-28 07:00:00 | 9.1 |
| 2012-05-28 08:00:00 | 9.1 |
| 2012-05-28 09:00:00 | 10.14 |
| 2012-05-28 10:00:00 | 11.96 |
| 2012-05-28 11:00:00 | 13.52 |
| 2012-05-28 12:00:00 | 12.74 |
| 2012-05-28 13:00:00 | 12.22 |
| 2012-05-28 14:00:00 | 10.14 |
| 2012-05-28 15:00:00 | 14.82 |
| 2012-05-28 16:00:00 | 14.56 |
| 2012-05-28 17:00:00 | 10.92 |
| 2012-05-28 18:00:00 | 9.88 |
| 2012-05-28 19:00:00 | 12.22 |
| 2012-05-28 20:00:00 | 10.92 |
| 2012-05-28 21:00:00 | 11.7 |
| 2012-05-28 22:00:00 | 11.7 |
| 2012-05-28 23:00:00 | 11.7 |
| 2012-05-29 | 12.22 |
| 2012-05-29 01:00:00 | 10.92 |
| 2012-05-29 02:00:00 | 9.1 |
| 2012-05-29 03:00:00 | 8.06 |
| 2012-05-29 04:00:00 | 8.06 |
| 2012-05-29 05:00:00 | 7.8 |
| 2012-05-29 06:00:00 | 8.06 |
| 2012-05-29 07:00:00 | 8.32 |
| 2012-05-29 08:00:00 | 8.84 |
| 2012-05-29 09:00:00 | 10.4 |
| 2012-05-29 10:00:00 | 10.66 |
| 2012-05-29 11:00:00 | 12.22 |
| 2012-05-29 12:00:00 | 12.22 |
| 2012-05-29 13:00:00 | 11.96 |
| 2012-05-29 14:00:00 | 11.96 |
| 2012-05-29 15:00:00 | 12.22 |
| 2012-05-29 16:00:00 | 11.96 |
| 2012-05-29 17:00:00 | 10.92 |
| 2012-05-29 18:00:00 | 9.36 |
| 2012-05-29 19:00:00 | 10.66 |
| 2012-05-29 20:00:00 | 11.7 |
| 2012-05-29 21:00:00 | 11.7 |
| 2012-05-29 22:00:00 | 11.44 |
| 2012-05-29 23:00:00 | 11.44 |
| 2012-05-30 | 11.7 |
| 2012-05-30 01:00:00 | 10.66 |
| 2012-05-30 02:00:00 | 9.88 |
| 2012-05-30 03:00:00 | 8.58 |
| 2012-05-30 04:00:00 | 9.1 |
| 2012-05-30 05:00:00 | 8.32 |
| 2012-05-30 06:00:00 | 8.32 |
| 2012-05-30 07:00:00 | 7.54 |
| 2012-05-30 08:00:00 | 9.88 |
| 2012-05-30 09:00:00 | 9.88 |
| 2012-05-30 10:00:00 | 12.48 |
| 2012-05-30 11:00:00 | 12.22 |
| 2012-05-30 12:00:00 | 10.66 |
| 2012-05-30 13:00:00 | 10.14 |
| 2012-05-30 14:00:00 | 9.88 |
| 2012-05-30 15:00:00 | 10.92 |
| 2012-05-30 16:00:00 | 10.66 |
| 2012-05-30 17:00:00 | 10.66 |
| 2012-05-30 18:00:00 | 10.92 |
| 2012-05-30 19:00:00 | 10.92 |
| 2012-05-30 20:00:00 | 10.92 |
| 2012-05-30 21:00:00 | 10.92 |
| 2012-05-30 22:00:00 | 11.18 |
| 2012-05-30 23:00:00 | 11.18 |
| 2012-05-31 | 11.18 |
| 2012-05-31 01:00:00 | 10.14 |
| 2012-05-31 02:00:00 | 9.62 |
| 2012-05-31 03:00:00 | 8.84 |
| 2012-05-31 04:00:00 | 7.8 |
| 2012-05-31 05:00:00 | 8.32 |
| 2012-05-31 06:00:00 | 7.28 |
| 2012-05-31 07:00:00 | 7.8 |
| 2012-05-31 08:00:00 | 11.18 |
| 2012-05-31 09:00:00 | 10.92 |
| 2012-05-31 10:00:00 | 12.48 |
| 2012-05-31 11:00:00 | 9.1 |
| 2012-05-31 12:00:00 | 9.88 |
| 2012-05-31 13:00:00 | 11.18 |
| 2012-05-31 14:00:00 | 9.1 |
| 2012-05-31 15:00:00 | 10.92 |
| 2012-05-31 16:00:00 | 11.18 |
| 2012-05-31 17:00:00 | 9.1 |
| 2012-05-31 18:00:00 | 10.66 |
| 2012-05-31 19:00:00 | 10.66 |
| 2012-05-31 20:00:00 | 19.76 |
| 2012-05-31 21:00:00 | 21.84 |
| 2012-05-31 22:00:00 | 17.16 |
| 2012-05-31 23:00:00 | 17.94 |
| 2012-06-01 | 16.12 |
| 2012-06-01 01:00:00 | 12.48 |
| 2012-06-01 02:00:00 | 11.7 |
| 2012-06-01 03:00:00 | 10.4 |
| 2012-06-01 04:00:00 | 9.36 |
| 2012-06-01 05:00:00 | 11.18 |
| 2012-06-01 06:00:00 | 16.64 |
| 2012-06-01 07:00:00 | 20.8 |
| 2012-06-01 08:00:00 | 24.7 |
| 2012-06-01 09:00:00 | 40.56 |
| 2012-06-01 10:00:00 | 31.72 |
| 2012-06-01 11:00:00 | 18.2 |
| 2012-06-01 12:00:00 | 12.74 |
| 2012-06-01 13:00:00 | 11.44 |
| 2012-06-01 14:00:00 | 17.68 |
| 2012-06-01 15:00:00 | 34.06 |
| 2012-06-01 16:00:00 | 17.94 |
| 2012-06-01 17:00:00 | 13.52 |
| 2012-06-01 18:00:00 | 11.7 |
| 2012-06-01 19:00:00 | 11.7 |
| 2012-06-01 20:00:00 | 24.7 |
| 2012-06-01 21:00:00 | 76.44 |
| 2012-06-01 22:00:00 | 22.88 |
| 2012-06-01 23:00:00 | 14.56 |
| 2012-06-02 | 12.48 |
| 2012-06-02 01:00:00 | 10.66 |
| 2012-06-02 02:00:00 | 10.4 |
| 2012-06-02 03:00:00 | 8.32 |
| 2012-06-02 04:00:00 | 12.74 |
| 2012-06-02 05:00:00 | 12.22 |
| 2012-06-02 06:00:00 | 9.62 |
| 2012-06-02 07:00:00 | 9.62 |
| 2012-06-02 08:00:00 | 12.48 |
| 2012-06-02 09:00:00 | 11.18 |
| 2012-06-02 10:00:00 | 12.22 |
| 2012-06-02 11:00:00 | 13 |
| 2012-06-02 12:00:00 | 12.74 |
| 2012-06-02 13:00:00 | 10.92 |
| 2012-06-02 14:00:00 | 10.92 |
| 2012-06-02 15:00:00 | 11.44 |
| 2012-06-02 16:00:00 | 10.4 |
| 2012-06-02 17:00:00 | 10.4 |
| 2012-06-02 18:00:00 | 9.1 |
| 2012-06-02 19:00:00 | 10.14 |
| 2012-06-02 20:00:00 | 11.18 |
| 2012-06-02 21:00:00 | 10.14 |
| 2012-06-02 22:00:00 | 9.88 |
| 2012-06-02 23:00:00 | 9.36 |
| 2012-06-03 | 9.88 |
| 2012-06-03 01:00:00 | 10.92 |
| 2012-06-03 02:00:00 | 7.8 |
| 2012-06-03 03:00:00 | 7.8 |
| 2012-06-03 04:00:00 | 8.06 |
| 2012-06-03 05:00:00 | 7.8 |
| 2012-06-03 06:00:00 | 8.84 |
| 2012-06-03 07:00:00 | 9.88 |
| 2012-06-03 08:00:00 | 7.8 |
| 2012-06-03 09:00:00 | 8.84 |
| 2012-06-03 10:00:00 | 10.14 |
| 2012-06-03 11:00:00 | 10.92 |
| 2012-06-03 12:00:00 | 10.92 |
| 2012-06-03 13:00:00 | 13 |
| 2012-06-03 14:00:00 | 11.44 |
| 2012-06-03 15:00:00 | 14.3 |
| 2012-06-03 16:00:00 | 10.66 |
| 2012-06-03 17:00:00 | 9.1 |
| 2012-06-03 18:00:00 | 10.14 |
| 2012-06-03 19:00:00 | 10.14 |
| 2012-06-03 20:00:00 | 10.14 |
| 2012-06-03 21:00:00 | 12.74 |
| 2012-06-03 22:00:00 | 11.18 |
| 2012-06-03 23:00:00 | 11.18 |
| 2012-06-04 | 9.62 |
| 2012-06-04 01:00:00 | 18.2 |
| 2012-06-04 02:00:00 | 23.14 |
| 2012-06-04 03:00:00 | 20.02 |
| 2012-06-04 04:00:00 | 31.98 |
| 2012-06-04 05:00:00 | 27.82 |
| 2012-06-04 06:00:00 | 30.68 |
| 2012-06-04 07:00:00 | 18.98 |
| 2012-06-04 08:00:00 | 19.76 |
| 2012-06-04 09:00:00 | 15.08 |
| 2012-06-04 10:00:00 | 13.26 |
| 2012-06-04 11:00:00 | 13.52 |
| 2012-06-04 12:00:00 | 13 |
| 2012-06-04 13:00:00 | 13 |
| 2012-06-04 14:00:00 | 13 |
| 2012-06-04 15:00:00 | 12.74 |
| 2012-06-04 16:00:00 | 18.98 |
| 2012-06-04 17:00:00 | 50.44 |
| 2012-06-04 18:00:00 | 72.54 |
| 2012-06-04 19:00:00 | 29.9 |
| 2012-06-04 20:00:00 | 20.8 |
| 2012-06-04 21:00:00 | 21.32 |
| 2012-06-04 22:00:00 | 27.82 |
| 2012-06-04 23:00:00 | 24.44 |
| 2012-06-05 | 19.76 |
| 2012-06-05 01:00:00 | 14.82 |
| 2012-06-05 02:00:00 | 12.74 |
| 2012-06-05 03:00:00 | 11.7 |
| 2012-06-05 04:00:00 | 10.92 |
| 2012-06-05 05:00:00 | 10.66 |
| 2012-06-05 06:00:00 | 11.7 |
| 2012-06-05 07:00:00 | 12.48 |
| 2012-06-05 08:00:00 | 12.22 |
| 2012-06-05 09:00:00 | 12.48 |
| 2012-06-05 10:00:00 | 14.3 |
| 2012-06-05 11:00:00 | 13 |
| 2012-06-05 12:00:00 | 42.38 |
| 2012-06-05 13:00:00 | 60.06 |
| 2012-06-05 14:00:00 | 36.66 |
| 2012-06-05 15:00:00 | 27.3 |
| 2012-06-05 16:00:00 | 28.34 |
| 2012-06-05 17:00:00 | 30.42 |
| 2012-06-05 18:00:00 | 31.72 |
| 2012-06-05 19:00:00 | 31.46 |
| 2012-06-05 20:00:00 | 30.94 |
| 2012-06-05 21:00:00 | 30.16 |
| 2012-06-05 22:00:00 | 29.38 |
| 2012-06-05 23:00:00 | 28.86 |
| 2012-06-06 | 28.08 |
| 2012-06-06 01:00:00 | 28.08 |
| 2012-06-06 02:00:00 | 28.34 |
| 2012-06-06 03:00:00 | 26.52 |
| 2012-06-06 04:00:00 | 19.76 |
| 2012-06-06 05:00:00 | 20.02 |
| 2012-06-06 06:00:00 | 20.8 |
| 2012-06-06 07:00:00 | 17.94 |
| 2012-06-06 08:00:00 | 20.28 |
| 2012-06-06 09:00:00 | 19.24 |
| 2012-06-06 10:00:00 | 17.94 |
| 2012-06-06 11:00:00 | 14.3 |
| 2012-06-06 12:00:00 | 13.52 |
| 2012-06-06 13:00:00 | 13.26 |
| 2012-06-06 14:00:00 | 13.26 |
| 2012-06-06 15:00:00 | 13 |
| 2012-06-06 16:00:00 | 13.26 |
| 2012-06-06 17:00:00 | 12.22 |
| 2012-06-06 18:00:00 | 12.48 |
| 2012-06-06 19:00:00 | 12.74 |
| 2012-06-06 20:00:00 | 12.74 |
| 2012-06-06 21:00:00 | 14.56 |
| 2012-06-06 22:00:00 | 14.3 |
| 2012-06-06 23:00:00 | 12.48 |
| 2012-06-07 | 14.3 |
| 2012-06-07 01:00:00 | 12.22 |
| 2012-06-07 02:00:00 | 11.7 |
| 2012-06-07 03:00:00 | 12.22 |
| 2012-06-07 04:00:00 | 11.96 |
| 2012-06-07 05:00:00 | 11.18 |
| 2012-06-07 06:00:00 | 11.7 |
| 2012-06-07 07:00:00 | 12.74 |
| 2012-06-07 08:00:00 | 12.74 |
| 2012-06-07 09:00:00 | 14.82 |
| 2012-06-07 10:00:00 | 15.34 |
| 2012-06-07 11:00:00 | 14.56 |
| 2012-06-07 12:00:00 | 15.86 |
| 2012-06-07 13:00:00 | 14.56 |
| 2012-06-07 14:00:00 | 11.44 |
| 2012-06-07 15:00:00 | 11.18 |
| 2012-06-07 16:00:00 | 11.44 |
| 2012-06-07 17:00:00 | 11.44 |
| 2012-06-07 18:00:00 | 11.18 |
| 2012-06-07 19:00:00 | 11.7 |
| 2012-06-07 20:00:00 | 10.92 |
| 2012-06-07 21:00:00 | 10.4 |
| 2012-06-07 22:00:00 | 13.26 |
| 2012-06-07 23:00:00 | 11.44 |
| 2012-06-08 | 10.4 |
| 2012-06-08 01:00:00 | 10.92 |
| 2012-06-08 02:00:00 | 8.84 |
| 2012-06-08 03:00:00 | 8.06 |
| 2012-06-08 04:00:00 | 9.88 |
| 2012-06-08 05:00:00 | 8.58 |
| 2012-06-08 06:00:00 | 8.58 |
| 2012-06-08 07:00:00 | 10.66 |
| 2012-06-08 08:00:00 | 16.64 |
| 2012-06-08 09:00:00 | 11.44 |
| 2012-06-08 10:00:00 | 12.22 |
| 2012-06-08 11:00:00 | 10.92 |
| 2012-06-08 12:00:00 | 10.4 |
| 2012-06-08 13:00:00 | 11.96 |
| 2012-06-08 14:00:00 | 11.7 |
| 2012-06-08 15:00:00 | 11.96 |
| 2012-06-08 16:00:00 | 11.96 |
| 2012-06-08 17:00:00 | 12.22 |
| 2012-06-08 18:00:00 | 13 |
| 2012-06-08 19:00:00 | 13 |
| 2012-06-08 20:00:00 | 12.74 |
| 2012-06-08 21:00:00 | 11.7 |
| 2012-06-08 22:00:00 | 13.26 |
| 2012-06-08 23:00:00 | 13.52 |
| 2012-06-09 | 15.86 |
| 2012-06-09 01:00:00 | 34.06 |
| 2012-06-09 02:00:00 | 26.26 |
| 2012-06-09 03:00:00 | 14.82 |
| 2012-06-09 04:00:00 | 12.74 |
| 2012-06-09 05:00:00 | 12.74 |
| 2012-06-09 06:00:00 | 11.18 |
| 2012-06-09 07:00:00 | 8.06 |
| 2012-06-09 08:00:00 | 10.66 |
| 2012-06-09 09:00:00 | 9.88 |
| 2012-06-09 10:00:00 | 10.14 |
| 2012-06-09 11:00:00 | 10.14 |
| 2012-06-09 12:00:00 | 11.96 |
| 2012-06-09 13:00:00 | 15.6 |
| 2012-06-09 14:00:00 | 23.14 |
| 2012-06-09 15:00:00 | 17.68 |
| 2012-06-09 16:00:00 | 13 |
| 2012-06-09 17:00:00 | 11.44 |
| 2012-06-09 18:00:00 | 10.92 |
| 2012-06-09 19:00:00 | 11.44 |
| 2012-06-09 20:00:00 | 12.74 |
| 2012-06-09 21:00:00 | 11.7 |
| 2012-06-09 22:00:00 | 11.7 |
| 2012-06-09 23:00:00 | 11.18 |
| 2012-06-10 | 13 |
| 2012-06-10 01:00:00 | 10.66 |
| 2012-06-10 02:00:00 | 9.36 |
| 2012-06-10 03:00:00 | 9.36 |
| 2012-06-10 04:00:00 | 9.1 |
| 2012-06-10 05:00:00 | 8.84 |
| 2012-06-10 06:00:00 | 7.28 |
| 2012-06-10 07:00:00 | 9.88 |
| 2012-06-10 08:00:00 | 8.32 |
| 2012-06-10 09:00:00 | 8.58 |
| 2012-06-10 10:00:00 | 9.88 |
| 2012-06-10 11:00:00 | 10.66 |
| 2012-06-10 12:00:00 | 10.66 |
| 2012-06-10 13:00:00 | 11.44 |
| 2012-06-10 14:00:00 | 14.04 |
| 2012-06-10 15:00:00 | 59.8 |
| 2012-06-10 16:00:00 | 74.1 |
| 2012-06-10 17:00:00 | 18.72 |
| 2012-06-10 18:00:00 | 13 |
| 2012-06-10 19:00:00 | 12.74 |
| 2012-06-10 20:00:00 | 12.74 |
| 2012-06-10 21:00:00 | 13 |
| 2012-06-10 22:00:00 | 18.2 |
| 2012-06-10 23:00:00 | 31.98 |
| 2012-06-11 | 23.14 |
| 2012-06-11 01:00:00 | 17.68 |
| 2012-06-11 02:00:00 | 16.38 |
| 2012-06-11 03:00:00 | 16.9 |
| 2012-06-11 04:00:00 | 10.66 |
| 2012-06-11 05:00:00 | 10.4 |
| 2012-06-11 06:00:00 | 11.44 |
| 2012-06-11 07:00:00 | 10.66 |
| 2012-06-11 08:00:00 | 11.96 |
| 2012-06-11 09:00:00 | 14.82 |
| 2012-06-11 10:00:00 | 11.18 |
| 2012-06-11 11:00:00 | 14.04 |
| 2012-06-11 12:00:00 | 12.48 |
| 2012-06-11 13:00:00 | 11.44 |
| 2012-06-11 14:00:00 | 12.22 |
| 2012-06-11 15:00:00 | 12.48 |
| 2012-06-11 16:00:00 | 12.48 |
| 2012-06-11 17:00:00 | 11.96 |
| 2012-06-11 18:00:00 | 10.14 |
| 2012-06-11 19:00:00 | 11.96 |
| 2012-06-11 20:00:00 | 13.52 |
| 2012-06-11 21:00:00 | 13 |
| 2012-06-11 22:00:00 | 12.22 |
| 2012-06-11 23:00:00 | 13.78 |
| 2012-06-12 | 13.52 |
| 2012-06-12 01:00:00 | 10.92 |
| 2012-06-12 02:00:00 | 9.88 |
| 2012-06-12 03:00:00 | 11.44 |
| 2012-06-12 04:00:00 | 8.32 |
| 2012-06-12 05:00:00 | 10.4 |
| 2012-06-12 06:00:00 | 9.36 |
| 2012-06-12 07:00:00 | 9.36 |
| 2012-06-12 08:00:00 | 11.44 |
| 2012-06-12 09:00:00 | 12.48 |
| 2012-06-12 10:00:00 | 10.66 |
| 2012-06-12 11:00:00 | 11.96 |
| 2012-06-12 12:00:00 | 13 |
| 2012-06-12 13:00:00 | 10.4 |
| 2012-06-12 14:00:00 | 13.52 |
| 2012-06-12 15:00:00 | 11.96 |
| 2012-06-12 16:00:00 | 11.96 |
| 2012-06-12 17:00:00 | 15.08 |
| 2012-06-12 18:00:00 | 18.2 |
| 2012-06-12 19:00:00 | 31.98 |
| 2012-06-12 20:00:00 | 22.88 |
| 2012-06-12 21:00:00 | 14.82 |
| 2012-06-12 22:00:00 | 14.04 |
| 2012-06-12 23:00:00 | 17.42 |
| 2012-06-13 | 21.58 |
| 2012-06-13 01:00:00 | 89.7 |
| 2012-06-13 02:00:00 | 105.3 |
| 2012-06-13 03:00:00 | 104.78 |
| 2012-06-13 04:00:00 | 104.52 |
| 2012-06-13 05:00:00 | 87.62 |
| 2012-06-13 06:00:00 | 24.96 |
| 2012-06-13 07:00:00 | 37.7 |
| 2012-06-13 08:00:00 | 97.5 |
| 2012-06-13 09:00:00 | 78.78 |
| 2012-06-13 10:00:00 | 61.62 |
| 2012-06-13 11:00:00 | 106.08 |
| 2012-06-13 12:00:00 | 104.52 |
| 2012-06-13 13:00:00 | 104.26 |
| 2012-06-13 14:00:00 | 102.18 |
| 2012-06-13 15:00:00 | 72.02 |
| 2012-06-13 16:00:00 | 44.72 |
| 2012-06-13 17:00:00 | 34.84 |
| 2012-06-13 18:00:00 | 28.86 |
| 2012-06-13 19:00:00 | 29.64 |
| 2012-06-13 20:00:00 | 28.34 |
| 2012-06-13 21:00:00 | 25.48 |
| 2012-06-13 22:00:00 | 27.04 |
| 2012-06-13 23:00:00 | 25.48 |
| 2012-06-14 | 35.1 |
| 2012-06-14 01:00:00 | 40.56 |
| 2012-06-14 02:00:00 | 40.82 |
| 2012-06-14 03:00:00 | 104 |
| 2012-06-14 04:00:00 | 104.52 |
| 2012-06-14 05:00:00 | 73.32 |
| 2012-06-14 06:00:00 | 31.72 |
| 2012-06-14 07:00:00 | 34.84 |
| 2012-06-14 08:00:00 | 47.84 |
| 2012-06-14 09:00:00 | 53.56 |
| 2012-06-14 10:00:00 | 54.08 |
| 2012-06-14 11:00:00 | 97.76 |
| 2012-06-14 12:00:00 | 78.26 |
| 2012-06-14 13:00:00 | 101.66 |
| 2012-06-14 14:00:00 | 104 |
| 2012-06-14 15:00:00 | 102.7 |
| 2012-06-14 16:00:00 | 102.44 |
| 2012-06-14 17:00:00 | 102.7 |
| 2012-06-14 18:00:00 | 93.86 |
| 2012-06-14 19:00:00 | 76.7 |
| 2012-06-14 20:00:00 | 55.38 |
| 2012-06-14 21:00:00 | 49.4 |
| 2012-06-14 22:00:00 | 48.1 |
| 2012-06-14 23:00:00 | 42.9 |
| 2012-06-15 | 37.44 |
| 2012-06-15 01:00:00 | 31.72 |
| 2012-06-15 02:00:00 | 33.28 |
| 2012-06-15 03:00:00 | 31.2 |
| 2012-06-15 04:00:00 | 28.34 |
| 2012-06-15 05:00:00 | 28.6 |
| 2012-06-15 06:00:00 | 27.3 |
| 2012-06-15 07:00:00 | 26.26 |
| 2012-06-15 08:00:00 | 27.82 |
| 2012-06-15 09:00:00 | 27.3 |
| 2012-06-15 10:00:00 | 24.96 |
| 2012-06-15 11:00:00 | 26 |
| 2012-06-15 12:00:00 | 25.48 |
| 2012-06-15 13:00:00 | 24.96 |
| 2012-06-15 14:00:00 | 22.88 |
| 2012-06-15 15:00:00 | 22.88 |
| 2012-06-15 16:00:00 | 23.66 |
| 2012-06-15 17:00:00 | 23.14 |
| 2012-06-15 18:00:00 | 20.28 |
| 2012-06-15 19:00:00 | 21.84 |
| 2012-06-15 20:00:00 | 22.1 |
| 2012-06-15 21:00:00 | 19.76 |
| 2012-06-15 22:00:00 | 21.84 |
| 2012-06-15 23:00:00 | 21.32 |
| 2012-06-16 | 21.06 |
| 2012-06-16 01:00:00 | 19.5 |
| 2012-06-16 02:00:00 | 18.72 |
| 2012-06-16 03:00:00 | 19.76 |
| 2012-06-16 04:00:00 | 18.72 |
| 2012-06-16 05:00:00 | 15.08 |
| 2012-06-16 06:00:00 | 20.28 |
| 2012-06-16 07:00:00 | 17.16 |
| 2012-06-16 08:00:00 | 16.38 |
| 2012-06-16 09:00:00 | 17.94 |
| 2012-06-16 10:00:00 | 22.1 |
| 2012-06-16 11:00:00 | 18.98 |
| 2012-06-16 12:00:00 | 18.72 |
| 2012-06-16 13:00:00 | 20.02 |
| 2012-06-16 14:00:00 | 20.02 |
| 2012-06-16 15:00:00 | 18.2 |
| 2012-06-16 16:00:00 | 18.72 |
| 2012-06-16 17:00:00 | 20.02 |
| 2012-06-16 18:00:00 | 17.16 |
| 2012-06-16 19:00:00 | 16.9 |
| 2012-06-16 20:00:00 | 16.38 |
| 2012-06-16 21:00:00 | 18.46 |
| 2012-06-16 22:00:00 | 19.24 |
| 2012-06-16 23:00:00 | 16.12 |
| 2012-06-17 | 15.08 |
| 2012-06-17 01:00:00 | 14.82 |
| 2012-06-17 02:00:00 | 13.78 |
| 2012-06-17 03:00:00 | 16.38 |
| 2012-06-17 04:00:00 | 11.44 |
| 2012-06-17 05:00:00 | 11.7 |
| 2012-06-17 06:00:00 | 11.44 |
| 2012-06-17 07:00:00 | 13.78 |
| 2012-06-17 08:00:00 | 15.34 |
| 2012-06-17 09:00:00 | 13.52 |
| 2012-06-17 10:00:00 | 17.42 |
| 2012-06-17 11:00:00 | 16.9 |
| 2012-06-17 12:00:00 | 15.6 |
| 2012-06-17 13:00:00 | 16.38 |
| 2012-06-17 14:00:00 | 17.16 |
| 2012-06-17 15:00:00 | 19.24 |
| 2012-06-17 16:00:00 | 14.04 |
| 2012-06-17 17:00:00 | 15.34 |
| 2012-06-17 18:00:00 | 14.82 |
| 2012-06-17 19:00:00 | 15.34 |
| 2012-06-17 20:00:00 | 15.86 |
| 2012-06-17 21:00:00 | 16.64 |
| 2012-06-17 22:00:00 | 15.34 |
| 2012-06-17 23:00:00 | 16.64 |
| 2012-06-18 | 17.16 |
| 2012-06-18 01:00:00 | 13.78 |
| 2012-06-18 02:00:00 | 11.7 |
| 2012-06-18 03:00:00 | 11.18 |
| 2012-06-18 04:00:00 | 11.96 |
| 2012-06-18 05:00:00 | 9.36 |
| 2012-06-18 06:00:00 | 11.18 |
| 2012-06-18 07:00:00 | 13.26 |
| 2012-06-18 08:00:00 | 10.92 |
| 2012-06-18 09:00:00 | 16.12 |
| 2012-06-18 10:00:00 | 15.6 |
| 2012-06-18 11:00:00 | 13.78 |
| 2012-06-18 12:00:00 | 16.9 |
| 2012-06-18 13:00:00 | 15.34 |
| 2012-06-18 14:00:00 | 13.26 |
| 2012-06-18 15:00:00 | 14.82 |
| 2012-06-18 16:00:00 | 16.9 |
| 2012-06-18 17:00:00 | 14.82 |
| 2012-06-18 18:00:00 | 11.7 |
| 2012-06-18 19:00:00 | 14.82 |
| 2012-06-18 20:00:00 | 14.04 |
| 2012-06-18 21:00:00 | 13.52 |
| 2012-06-18 22:00:00 | 17.68 |
| 2012-06-18 23:00:00 | 16.38 |
| 2012-06-19 | 15.08 |
| 2012-06-19 01:00:00 | 11.18 |
| 2012-06-19 02:00:00 | 13.26 |
| 2012-06-19 03:00:00 | 10.66 |
| 2012-06-19 04:00:00 | 10.66 |
| 2012-06-19 05:00:00 | 11.7 |
| 2012-06-19 06:00:00 | 10.4 |
| 2012-06-19 07:00:00 | 11.7 |
| 2012-06-19 08:00:00 | 15.34 |
| 2012-06-19 09:00:00 | 15.34 |
| 2012-06-19 10:00:00 | 11.7 |
| 2012-06-19 11:00:00 | 17.42 |
| 2012-06-19 12:00:00 | 16.12 |
| 2012-06-19 13:00:00 | 11.96 |
| 2012-06-19 14:00:00 | 15.86 |
| 2012-06-19 15:00:00 | 16.9 |
| 2012-06-19 16:00:00 | 16.64 |
| 2012-06-19 17:00:00 | 15.08 |
| 2012-06-19 18:00:00 | 11.96 |
| 2012-06-19 19:00:00 | 15.34 |
| 2012-06-19 20:00:00 | 15.08 |
| 2012-06-19 21:00:00 | 11.44 |
| 2012-06-19 22:00:00 | 14.82 |
| 2012-06-19 23:00:00 | 15.08 |
| 2012-06-20 | 13.78 |
| 2012-06-20 01:00:00 | 10.66 |
| 2012-06-20 02:00:00 | 10.92 |
| 2012-06-20 03:00:00 | 10.14 |
| 2012-06-20 04:00:00 | 9.1 |
| 2012-06-20 05:00:00 | 10.66 |
| 2012-06-20 06:00:00 | 9.88 |
| 2012-06-20 07:00:00 | 9.62 |
| 2012-06-20 08:00:00 | 13.26 |
| 2012-06-20 09:00:00 | 13.78 |
| 2012-06-20 10:00:00 | 14.04 |
| 2012-06-20 11:00:00 | 15.34 |
| 2012-06-20 12:00:00 | 17.16 |
| 2012-06-20 13:00:00 | 13.26 |
| 2012-06-20 14:00:00 | 14.3 |
| 2012-06-20 15:00:00 | 13.26 |
| 2012-06-20 16:00:00 | 13.52 |
| 2012-06-20 17:00:00 | 13.78 |
| 2012-06-20 18:00:00 | 14.04 |
| 2012-06-20 19:00:00 | 13.26 |
| 2012-06-20 20:00:00 | 10.66 |
| 2012-06-20 21:00:00 | 16.64 |
| 2012-06-20 22:00:00 | 15.08 |
| 2012-06-20 23:00:00 | 15.08 |
| 2012-06-21 | 11.44 |
| 2012-06-21 01:00:00 | 11.7 |
| 2012-06-21 02:00:00 | 11.7 |
| 2012-06-21 03:00:00 | 8.84 |
| 2012-06-21 04:00:00 | 10.66 |
| 2012-06-21 05:00:00 | 9.88 |
| 2012-06-21 06:00:00 | 9.88 |
| 2012-06-21 07:00:00 | 38.48 |
| 2012-06-21 08:00:00 | 43.94 |
| 2012-06-21 09:00:00 | 22.36 |
| 2012-06-21 10:00:00 | 14.04 |
| 2012-06-21 11:00:00 | 13.78 |
| 2012-06-21 12:00:00 | 14.3 |
| 2012-06-21 13:00:00 | 15.08 |
| 2012-06-21 14:00:00 | 12.74 |
| 2012-06-21 15:00:00 | 14.82 |
| 2012-06-21 16:00:00 | 14.3 |
| 2012-06-21 17:00:00 | 11.18 |
| 2012-06-21 18:00:00 | 13 |
| 2012-06-21 19:00:00 | 13.26 |
| 2012-06-21 20:00:00 | 13 |
| 2012-06-21 21:00:00 | 12.22 |
| 2012-06-21 22:00:00 | 16.64 |
| 2012-06-21 23:00:00 | 14.3 |
| 2012-06-22 | 14.04 |
| 2012-06-22 01:00:00 | 9.88 |
| 2012-06-22 02:00:00 | 10.92 |
| 2012-06-22 03:00:00 | 9.1 |
| 2012-06-22 04:00:00 | 9.62 |
| 2012-06-22 05:00:00 | 10.66 |
| 2012-06-22 06:00:00 | 32.24 |
| 2012-06-22 07:00:00 | 102.96 |
| 2012-06-22 08:00:00 | 103.48 |
| 2012-06-22 09:00:00 | 62.66 |
| 2012-06-22 10:00:00 | 20.8 |
| 2012-06-22 11:00:00 | 14.82 |
| 2012-06-22 12:00:00 | 15.34 |
| 2012-06-22 13:00:00 | 16.12 |
| 2012-06-22 14:00:00 | 11.18 |
| 2012-06-22 15:00:00 | 15.6 |
| 2012-06-22 16:00:00 | 30.16 |
| 2012-06-22 17:00:00 | 92.82 |
| 2012-06-22 18:00:00 | 36.14 |
| 2012-06-22 19:00:00 | 43.68 |
| 2012-06-22 20:00:00 | 25.74 |
| 2012-06-22 21:00:00 | 18.2 |
| 2012-06-22 22:00:00 | 15.6 |
| 2012-06-22 23:00:00 | 15.6 |
| 2012-06-23 | 16.64 |
| 2012-06-23 01:00:00 | 13 |
| 2012-06-23 02:00:00 | 10.92 |
| 2012-06-23 03:00:00 | 10.92 |
| 2012-06-23 04:00:00 | 12.74 |
| 2012-06-23 05:00:00 | 10.14 |
| 2012-06-23 06:00:00 | 11.18 |
| 2012-06-23 07:00:00 | 11.96 |
| 2012-06-23 08:00:00 | 13.52 |
| 2012-06-23 09:00:00 | 10.92 |
| 2012-06-23 10:00:00 | 10.92 |
| 2012-06-23 11:00:00 | 11.18 |
| 2012-06-23 12:00:00 | 15.34 |
| 2012-06-23 13:00:00 | 11.44 |
| 2012-06-23 14:00:00 | 15.08 |
| 2012-06-23 15:00:00 | 13.52 |
| 2012-06-23 16:00:00 | 11.96 |
| 2012-06-23 17:00:00 | 11.44 |
| 2012-06-23 18:00:00 | 13.78 |
| 2012-06-23 19:00:00 | 11.18 |
| 2012-06-23 20:00:00 | 10.66 |
| 2012-06-23 21:00:00 | 11.44 |
| 2012-06-23 22:00:00 | 12.74 |
| 2012-06-23 23:00:00 | 11.7 |
| 2012-06-24 | 11.44 |
| 2012-06-24 01:00:00 | 10.14 |
| 2012-06-24 02:00:00 | 9.36 |
| 2012-06-24 03:00:00 | 9.36 |
| 2012-06-24 04:00:00 | 9.1 |
| 2012-06-24 05:00:00 | 9.88 |
| 2012-06-24 06:00:00 | 8.58 |
| 2012-06-24 07:00:00 | 8.84 |
| 2012-06-24 08:00:00 | 9.1 |
| 2012-06-24 09:00:00 | 9.1 |
| 2012-06-24 10:00:00 | 10.92 |
| 2012-06-24 11:00:00 | 14.3 |
| 2012-06-24 12:00:00 | 10.92 |
| 2012-06-24 13:00:00 | 11.18 |
| 2012-06-24 14:00:00 | 11.18 |
| 2012-06-24 15:00:00 | 10.92 |
| 2012-06-24 16:00:00 | 11.18 |
| 2012-06-24 17:00:00 | 12.74 |
| 2012-06-24 18:00:00 | 10.92 |
| 2012-06-24 19:00:00 | 10.4 |
| 2012-06-24 20:00:00 | 10.92 |
| 2012-06-24 21:00:00 | 10.92 |
| 2012-06-24 22:00:00 | 11.18 |
| 2012-06-24 23:00:00 | 13.78 |
| 2012-06-25 | 10.92 |
| 2012-06-25 01:00:00 | 10.14 |
| 2012-06-25 02:00:00 | 9.36 |
| 2012-06-25 03:00:00 | 9.62 |
| 2012-06-25 04:00:00 | 11.44 |
| 2012-06-25 05:00:00 | 10.66 |
| 2012-06-25 06:00:00 | 10.4 |
| 2012-06-25 07:00:00 | 11.7 |
| 2012-06-25 08:00:00 | 14.04 |
| 2012-06-25 09:00:00 | 11.18 |
| 2012-06-25 10:00:00 | 13.52 |
| 2012-06-25 11:00:00 | 15.6 |
| 2012-06-25 12:00:00 | 13.78 |
| 2012-06-25 13:00:00 | 14.56 |
| 2012-06-25 14:00:00 | 13.26 |
| 2012-06-25 15:00:00 | 14.56 |
| 2012-06-25 16:00:00 | 14.04 |
| 2012-06-25 17:00:00 | 11.44 |
| 2012-06-25 18:00:00 | 12.22 |
| 2012-06-25 19:00:00 | 14.04 |
| 2012-06-25 20:00:00 | 11.44 |
| 2012-06-25 21:00:00 | 11.7 |
| 2012-06-25 22:00:00 | 15.6 |
| 2012-06-25 23:00:00 | 15.08 |
| 2012-06-26 | 13.78 |
| 2012-06-26 01:00:00 | 10.4 |
| 2012-06-26 02:00:00 | 11.18 |
| 2012-06-26 03:00:00 | 10.14 |
| 2012-06-26 04:00:00 | 8.84 |
| 2012-06-26 05:00:00 | 10.92 |
| 2012-06-26 06:00:00 | 10.4 |
| 2012-06-26 07:00:00 | 9.88 |
| 2012-06-26 08:00:00 | 12.74 |
| 2012-06-26 09:00:00 | 13 |
| 2012-06-26 10:00:00 | 13 |
| 2012-06-26 11:00:00 | 13.26 |
| 2012-06-26 12:00:00 | 13.78 |
| 2012-06-26 13:00:00 | 13 |
| 2012-06-26 14:00:00 | 13 |
| 2012-06-26 15:00:00 | 11.7 |
| 2012-06-26 16:00:00 | 15.08 |
| 2012-06-26 17:00:00 | 13 |
| 2012-06-26 18:00:00 | 11.96 |
| 2012-06-26 19:00:00 | 13.26 |
| 2012-06-26 20:00:00 | 12.48 |
| 2012-06-26 21:00:00 | 12.48 |
| 2012-06-26 22:00:00 | 14.82 |
| 2012-06-26 23:00:00 | 13.52 |
| 2012-06-27 | 13.52 |
| 2012-06-27 01:00:00 | 11.18 |
| 2012-06-27 02:00:00 | 11.7 |
| 2012-06-27 03:00:00 | 10.4 |
| 2012-06-27 04:00:00 | 9.1 |
| 2012-06-27 05:00:00 | 10.66 |
| 2012-06-27 06:00:00 | 9.88 |
| 2012-06-27 07:00:00 | 9.62 |
| 2012-06-27 08:00:00 | 13 |
| 2012-06-27 09:00:00 | 12.74 |
| 2012-06-27 10:00:00 | 11.7 |
| 2012-06-27 11:00:00 | 13.52 |
| 2012-06-27 12:00:00 | 13.26 |
| 2012-06-27 13:00:00 | 10.92 |
| 2012-06-27 14:00:00 | 13.78 |
| 2012-06-27 15:00:00 | 14.82 |
| 2012-06-27 16:00:00 | 13.26 |
| 2012-06-27 17:00:00 | 13.26 |
| 2012-06-27 18:00:00 | 12.48 |
| 2012-06-27 19:00:00 | 11.44 |
| 2012-06-27 20:00:00 | 14.82 |
| 2012-06-27 21:00:00 | 11.18 |
| 2012-06-27 22:00:00 | 14.3 |
| 2012-06-27 23:00:00 | 15.86 |
| 2012-06-28 | 14.04 |
| 2012-06-28 01:00:00 | 10.4 |
| 2012-06-28 02:00:00 | 10.92 |
| 2012-06-28 03:00:00 | 9.88 |
| 2012-06-28 04:00:00 | 9.1 |
| 2012-06-28 05:00:00 | 9.62 |
| 2012-06-28 06:00:00 | 13.26 |
| 2012-06-28 07:00:00 | 20.02 |
| 2012-06-28 08:00:00 | 17.94 |
| 2012-06-28 09:00:00 | 15.6 |
| 2012-06-28 10:00:00 | 12.74 |
| 2012-06-28 11:00:00 | 13 |
| 2012-06-28 12:00:00 | 12.74 |
| 2012-06-28 13:00:00 | 11.7 |
| 2012-06-28 14:00:00 | 13.52 |
| 2012-06-28 15:00:00 | 12.74 |
| 2012-06-28 16:00:00 | 13.52 |
| 2012-06-28 17:00:00 | 13.26 |
| 2012-06-28 18:00:00 | 10.92 |
| 2012-06-28 19:00:00 | 13.26 |
| 2012-06-28 20:00:00 | 12.22 |
| 2012-06-28 21:00:00 | 13.78 |
| 2012-06-28 22:00:00 | 14.56 |
| 2012-06-28 23:00:00 | 13.52 |
| 2012-06-29 | 14.04 |
| 2012-06-29 01:00:00 | 12.48 |
| 2012-06-29 02:00:00 | 9.62 |
| 2012-06-29 03:00:00 | 11.44 |
| 2012-06-29 04:00:00 | 10.4 |
| 2012-06-29 05:00:00 | 9.36 |
| 2012-06-29 06:00:00 | 9.1 |
| 2012-06-29 07:00:00 | 11.18 |
| 2012-06-29 08:00:00 | 12.74 |
| 2012-06-29 09:00:00 | 11.18 |
| 2012-06-29 10:00:00 | 15.34 |
| 2012-06-29 11:00:00 | 11.7 |
| 2012-06-29 12:00:00 | 11.44 |
| 2012-06-29 13:00:00 | 14.3 |
| 2012-06-29 14:00:00 | 11.96 |
| 2012-06-29 15:00:00 | 11.44 |
| 2012-06-29 16:00:00 | 13.26 |
| 2012-06-29 17:00:00 | 13.26 |
| 2012-06-29 18:00:00 | 11.44 |
| 2012-06-29 19:00:00 | 11.44 |
| 2012-06-29 20:00:00 | 13 |
| 2012-06-29 21:00:00 | 14.56 |
| 2012-06-29 22:00:00 | 10.66 |
| 2012-06-29 23:00:00 | 12.74 |
| 2012-06-30 | 13.52 |
| 2012-06-30 01:00:00 | 10.4 |
| 2012-06-30 02:00:00 | 9.62 |
| 2012-06-30 03:00:00 | 10.92 |
| 2012-06-30 04:00:00 | 9.1 |
| 2012-06-30 05:00:00 | 8.58 |
| 2012-06-30 06:00:00 | 9.62 |
| 2012-06-30 07:00:00 | 10.92 |
| 2012-06-30 08:00:00 | 9.62 |
| 2012-06-30 09:00:00 | 9.88 |
| 2012-06-30 10:00:00 | 10.92 |
| 2012-06-30 11:00:00 | 15.6 |
| 2012-06-30 12:00:00 | 11.18 |
| 2012-06-30 13:00:00 | 13.26 |
| 2012-06-30 14:00:00 | 14.04 |
| 2012-06-30 15:00:00 | 11.18 |
| 2012-06-30 16:00:00 | 11.44 |
| 2012-06-30 17:00:00 | 13 |
| 2012-06-30 18:00:00 | 11.18 |
| 2012-06-30 19:00:00 | 10.4 |
| 2012-06-30 20:00:00 | 10.92 |
| 2012-06-30 21:00:00 | 13 |
| 2012-06-30 22:00:00 | 11.18 |
| 2012-06-30 23:00:00 | 10.92 |
| 2012-07-01 | 12.74 |
| 2012-07-01 01:00:00 | 10.92 |
| 2012-07-01 02:00:00 | 9.88 |
| 2012-07-01 03:00:00 | 8.84 |
| 2012-07-01 04:00:00 | 8.84 |
| 2012-07-01 05:00:00 | 9.88 |
| 2012-07-01 06:00:00 | 8.58 |
| 2012-07-01 07:00:00 | 8.84 |
| 2012-07-01 08:00:00 | 8.84 |
| 2012-07-01 09:00:00 | 10.14 |
| 2012-07-01 10:00:00 | 11.7 |
| 2012-07-01 11:00:00 | 11.44 |
| 2012-07-01 12:00:00 | 14.3 |
| 2012-07-01 13:00:00 | 11.18 |
| 2012-07-01 14:00:00 | 11.18 |
| 2012-07-01 15:00:00 | 11.44 |
| 2012-07-01 16:00:00 | 13 |
| 2012-07-01 17:00:00 | 11.44 |
| 2012-07-01 18:00:00 | 11.18 |
| 2012-07-01 19:00:00 | 10.14 |
| 2012-07-01 20:00:00 | 10.92 |
| 2012-07-01 21:00:00 | 13.26 |
| 2012-07-01 22:00:00 | 10.92 |
| 2012-07-01 23:00:00 | 10.92 |
| 2012-07-02 | 10.92 |
| 2012-07-02 01:00:00 | 11.18 |
| 2012-07-02 02:00:00 | 9.62 |
| 2012-07-02 03:00:00 | 8.06 |
| 2012-07-02 04:00:00 | 9.88 |
| 2012-07-02 05:00:00 | 7.54 |
| 2012-07-02 06:00:00 | 7.54 |
| 2012-07-02 07:00:00 | 9.62 |
| 2012-07-02 08:00:00 | 9.62 |
| 2012-07-02 09:00:00 | 8.84 |
| 2012-07-02 10:00:00 | 14.04 |
| 2012-07-02 11:00:00 | 13.26 |
| 2012-07-02 12:00:00 | 10.4 |
| 2012-07-02 13:00:00 | 10.92 |
| 2012-07-02 14:00:00 | 11.18 |
| 2012-07-02 15:00:00 | 9.88 |
| 2012-07-02 16:00:00 | 10.4 |
| 2012-07-02 17:00:00 | 10.66 |
| 2012-07-02 18:00:00 | 8.84 |
| 2012-07-02 19:00:00 | 9.36 |
| 2012-07-02 20:00:00 | 9.88 |
| 2012-07-02 21:00:00 | 8.58 |
| 2012-07-02 22:00:00 | 10.4 |
| 2012-07-02 23:00:00 | 10.4 |
| 2012-07-03 | 10.4 |
| 2012-07-03 01:00:00 | 7.54 |
| 2012-07-03 02:00:00 | 7.54 |
| 2012-07-03 03:00:00 | 8.84 |
| 2012-07-03 04:00:00 | 5.46 |
| 2012-07-03 05:00:00 | 8.06 |
| 2012-07-03 06:00:00 | 8.58 |
| 2012-07-03 07:00:00 | 7.02 |
| 2012-07-03 08:00:00 | 9.36 |
| 2012-07-03 09:00:00 | 9.88 |
| 2012-07-03 10:00:00 | 8.84 |
| 2012-07-03 11:00:00 | 9.36 |
| 2012-07-03 12:00:00 | 9.62 |
| 2012-07-03 13:00:00 | 12.48 |
| 2012-07-03 14:00:00 | 8.84 |
| 2012-07-03 15:00:00 | 8.84 |
| 2012-07-03 16:00:00 | 10.4 |
| 2012-07-03 17:00:00 | 9.88 |
| 2012-07-03 18:00:00 | 8.58 |
| 2012-07-03 19:00:00 | 8.06 |
| 2012-07-03 20:00:00 | 10.4 |
| 2012-07-03 21:00:00 | 9.36 |
| 2012-07-03 22:00:00 | 8.58 |
| 2012-07-03 23:00:00 | 10.4 |
| 2012-07-04 | 10.4 |
| 2012-07-04 01:00:00 | 7.54 |
| 2012-07-04 02:00:00 | 7.54 |
| 2012-07-04 03:00:00 | 8.32 |
| 2012-07-04 04:00:00 | 8.58 |
| 2012-07-04 05:00:00 | 6.5 |
| 2012-07-04 06:00:00 | 7.8 |
| 2012-07-04 07:00:00 | 9.36 |
| 2012-07-04 08:00:00 | 9.36 |
| 2012-07-04 09:00:00 | 7.02 |
| 2012-07-04 10:00:00 | 8.58 |
| 2012-07-04 11:00:00 | 10.66 |
| 2012-07-04 12:00:00 | 8.58 |
| 2012-07-04 13:00:00 | 9.88 |
| 2012-07-04 14:00:00 | 10.66 |
| 2012-07-04 15:00:00 | 10.66 |
| 2012-07-04 16:00:00 | 10.4 |
| 2012-07-04 17:00:00 | 8.32 |
| 2012-07-04 18:00:00 | 10.4 |
| 2012-07-04 19:00:00 | 10.4 |
| 2012-07-04 20:00:00 | 8.84 |
| 2012-07-04 21:00:00 | 10.66 |
| 2012-07-04 22:00:00 | 10.92 |
| 2012-07-04 23:00:00 | 9.62 |
| 2012-07-05 | 9.62 |
| 2012-07-05 01:00:00 | 10.66 |
| 2012-07-05 02:00:00 | 9.88 |
| 2012-07-05 03:00:00 | 7.8 |
| 2012-07-05 04:00:00 | 7.54 |
| 2012-07-05 05:00:00 | 10.14 |
| 2012-07-05 06:00:00 | 9.62 |
| 2012-07-05 07:00:00 | 7.8 |
| 2012-07-05 08:00:00 | 10.14 |
| 2012-07-05 09:00:00 | 11.18 |
| 2012-07-05 10:00:00 | 10.14 |
| 2012-07-05 11:00:00 | 9.88 |
| 2012-07-05 12:00:00 | 10.66 |
| 2012-07-05 13:00:00 | 10.66 |
| 2012-07-05 14:00:00 | 9.1 |
| 2012-07-05 15:00:00 | 10.66 |
| 2012-07-05 16:00:00 | 10.66 |
| 2012-07-05 17:00:00 | 9.62 |
| 2012-07-05 18:00:00 | 8.84 |
| 2012-07-05 19:00:00 | 9.62 |
| 2012-07-05 20:00:00 | 9.36 |
| 2012-07-05 21:00:00 | 8.06 |
| 2012-07-05 22:00:00 | 10.66 |
| 2012-07-05 23:00:00 | 10.4 |
| 2012-07-06 | 9.36 |
| 2012-07-06 01:00:00 | 8.58 |
| 2012-07-06 02:00:00 | 9.36 |
| 2012-07-06 03:00:00 | 7.54 |
| 2012-07-06 04:00:00 | 7.28 |
| 2012-07-06 05:00:00 | 8.32 |
| 2012-07-06 06:00:00 | 6.5 |
| 2012-07-06 07:00:00 | 8.58 |
| 2012-07-06 08:00:00 | 8.06 |
| 2012-07-06 09:00:00 | 7.02 |
| 2012-07-06 10:00:00 | 9.62 |
| 2012-07-06 11:00:00 | 11.44 |
| 2012-07-06 12:00:00 | 12.48 |
| 2012-07-06 13:00:00 | 9.62 |
| 2012-07-06 14:00:00 | 10.14 |
| 2012-07-06 15:00:00 | 8.58 |
| 2012-07-06 16:00:00 | 10.14 |
| 2012-07-06 17:00:00 | 9.62 |
| 2012-07-06 18:00:00 | 8.58 |
| 2012-07-06 19:00:00 | 9.1 |
| 2012-07-06 20:00:00 | 9.88 |
| 2012-07-06 21:00:00 | 7.8 |
| 2012-07-06 22:00:00 | 8.32 |
| 2012-07-06 23:00:00 | 10.14 |
| 2012-07-07 | 14.3 |
| 2012-07-07 01:00:00 | 33.02 |
| 2012-07-07 02:00:00 | 54.86 |
| 2012-07-07 03:00:00 | 26.26 |
| 2012-07-07 04:00:00 | 16.12 |
| 2012-07-07 05:00:00 | 9.36 |
| 2012-07-07 06:00:00 | 8.84 |
| 2012-07-07 07:00:00 | 11.18 |
| 2012-07-07 08:00:00 | 9.1 |
| 2012-07-07 09:00:00 | 8.58 |
| 2012-07-07 10:00:00 | 8.84 |
| 2012-07-07 11:00:00 | 13 |
| 2012-07-07 12:00:00 | 10.4 |
| 2012-07-07 13:00:00 | 11.18 |
| 2012-07-07 14:00:00 | 9.36 |
| 2012-07-07 15:00:00 | 11.18 |
| 2012-07-07 16:00:00 | 9.62 |
| 2012-07-07 17:00:00 | 8.84 |
| 2012-07-07 18:00:00 | 8.84 |
| 2012-07-07 19:00:00 | 9.88 |
| 2012-07-07 20:00:00 | 9.1 |
| 2012-07-07 21:00:00 | 8.58 |
| 2012-07-07 22:00:00 | 9.1 |
| 2012-07-07 23:00:00 | 10.92 |
| 2012-07-08 | 8.32 |
| 2012-07-08 01:00:00 | 7.8 |
| 2012-07-08 02:00:00 | 7.8 |
| 2012-07-08 03:00:00 | 7.8 |
| 2012-07-08 04:00:00 | 8.06 |
| 2012-07-08 05:00:00 | 7.8 |
| 2012-07-08 06:00:00 | 7.54 |
| 2012-07-08 07:00:00 | 6.76 |
| 2012-07-08 08:00:00 | 8.84 |
| 2012-07-08 09:00:00 | 8.06 |
| 2012-07-08 10:00:00 | 9.1 |
| 2012-07-08 11:00:00 | 10.14 |
| 2012-07-08 12:00:00 | 10.92 |
| 2012-07-08 13:00:00 | 13.26 |
| 2012-07-08 14:00:00 | 10.4 |
| 2012-07-08 15:00:00 | 9.36 |
| 2012-07-08 16:00:00 | 10.14 |
| 2012-07-08 17:00:00 | 9.88 |
| 2012-07-08 18:00:00 | 9.1 |
| 2012-07-08 19:00:00 | 8.32 |
| 2012-07-08 20:00:00 | 17.42 |
| 2012-07-08 21:00:00 | 19.24 |
| 2012-07-08 22:00:00 | 21.06 |
| 2012-07-08 23:00:00 | 13.52 |
| 2012-07-09 | 10.4 |
| 2012-07-09 01:00:00 | 10.92 |
| 2012-07-09 02:00:00 | 10.66 |
| 2012-07-09 03:00:00 | 8.84 |
| 2012-07-09 04:00:00 | 8.84 |
| 2012-07-09 05:00:00 | 10.4 |
| 2012-07-09 06:00:00 | 10.14 |
| 2012-07-09 07:00:00 | 9.1 |
| 2012-07-09 08:00:00 | 11.18 |
| 2012-07-09 09:00:00 | 11.44 |
| 2012-07-09 10:00:00 | 13 |
| 2012-07-09 11:00:00 | 14.82 |
| 2012-07-09 12:00:00 | 11.96 |
| 2012-07-09 13:00:00 | 9.62 |
| 2012-07-09 14:00:00 | 10.92 |
| 2012-07-09 15:00:00 | 12.48 |
| 2012-07-09 16:00:00 | 12.48 |
| 2012-07-09 17:00:00 | 10.92 |
| 2012-07-09 18:00:00 | 9.88 |
| 2012-07-09 19:00:00 | 10.92 |
| 2012-07-09 20:00:00 | 11.44 |
| 2012-07-09 21:00:00 | 16.12 |
| 2012-07-09 22:00:00 | 10.92 |
| 2012-07-09 23:00:00 | 11.44 |
| 2012-07-10 | 13.52 |
| 2012-07-10 01:00:00 | 11.18 |
| 2012-07-10 02:00:00 | 8.84 |
| 2012-07-10 03:00:00 | 9.88 |
| 2012-07-10 04:00:00 | 9.62 |
| 2012-07-10 05:00:00 | 9.88 |
| 2012-07-10 06:00:00 | 7.54 |
| 2012-07-10 07:00:00 | 10.4 |
| 2012-07-10 08:00:00 | 10.66 |
| 2012-07-10 09:00:00 | 10.92 |
| 2012-07-10 10:00:00 | 10.4 |
| 2012-07-10 11:00:00 | 10.66 |
| 2012-07-10 12:00:00 | 10.92 |
| 2012-07-10 13:00:00 | 10.92 |
| 2012-07-10 14:00:00 | 10.66 |
| 2012-07-10 15:00:00 | 11.18 |
| 2012-07-10 16:00:00 | 11.18 |
| 2012-07-10 17:00:00 | 11.18 |
| 2012-07-10 18:00:00 | 10.14 |
| 2012-07-10 19:00:00 | 9.88 |
| 2012-07-10 20:00:00 | 10.4 |
| 2012-07-10 21:00:00 | 12.48 |
| 2012-07-10 22:00:00 | 10.4 |
| 2012-07-10 23:00:00 | 10.66 |
| 2012-07-11 | 11.18 |
| 2012-07-11 01:00:00 | 9.62 |
| 2012-07-11 02:00:00 | 10.14 |
| 2012-07-11 03:00:00 | 9.88 |
| 2012-07-11 04:00:00 | 8.06 |
| 2012-07-11 05:00:00 | 7.8 |
| 2012-07-11 06:00:00 | 9.62 |
| 2012-07-11 07:00:00 | 10.4 |
| 2012-07-11 08:00:00 | 10.4 |
| 2012-07-11 09:00:00 | 8.84 |
| 2012-07-11 10:00:00 | 10.4 |
| 2012-07-11 11:00:00 | 13.26 |
| 2012-07-11 12:00:00 | 13 |
| 2012-07-11 13:00:00 | 9.1 |
| 2012-07-11 14:00:00 | 10.66 |
| 2012-07-11 15:00:00 | 11.18 |
| 2012-07-11 16:00:00 | 43.16 |
| 2012-07-11 17:00:00 | 105.04 |
| 2012-07-11 18:00:00 | 68.64 |
| 2012-07-11 19:00:00 | 18.2 |
| 2012-07-11 20:00:00 | 15.08 |
| 2012-07-11 21:00:00 | 13 |
| 2012-07-11 22:00:00 | 13.26 |
| 2012-07-11 23:00:00 | 13.52 |
| 2012-07-12 | 13.52 |
| 2012-07-12 01:00:00 | 11.18 |
| 2012-07-12 02:00:00 | 9.88 |
| 2012-07-12 03:00:00 | 10.4 |
| 2012-07-12 04:00:00 | 10.4 |
| 2012-07-12 05:00:00 | 9.36 |
| 2012-07-12 06:00:00 | 8.06 |
| 2012-07-12 07:00:00 | 10.4 |
| 2012-07-12 08:00:00 | 11.44 |
| 2012-07-12 09:00:00 | 11.18 |
| 2012-07-12 10:00:00 | 10.66 |
| 2012-07-12 11:00:00 | 11.96 |
| 2012-07-12 12:00:00 | 11.7 |
| 2012-07-12 13:00:00 | 11.7 |
| 2012-07-12 14:00:00 | 9.36 |
| 2012-07-12 15:00:00 | 11.44 |
| 2012-07-12 16:00:00 | 11.44 |
| 2012-07-12 17:00:00 | 11.44 |
| 2012-07-12 18:00:00 | 10.66 |
| 2012-07-12 19:00:00 | 9.36 |
| 2012-07-12 20:00:00 | 11.18 |
| 2012-07-12 21:00:00 | 11.18 |
| 2012-07-12 22:00:00 | 10.4 |
| 2012-07-12 23:00:00 | 11.18 |
| 2012-07-13 | 11.44 |
| 2012-07-13 01:00:00 | 9.36 |
| 2012-07-13 02:00:00 | 9.1 |
| 2012-07-13 03:00:00 | 9.88 |
| 2012-07-13 04:00:00 | 8.58 |
| 2012-07-13 05:00:00 | 7.54 |
| 2012-07-13 06:00:00 | 9.1 |
| 2012-07-13 07:00:00 | 10.92 |
| 2012-07-13 08:00:00 | 10.66 |
| 2012-07-13 09:00:00 | 9.1 |
| 2012-07-13 10:00:00 | 10.4 |
| 2012-07-13 11:00:00 | 11.18 |
| 2012-07-13 12:00:00 | 11.18 |
| 2012-07-13 13:00:00 | 9.36 |
| 2012-07-13 14:00:00 | 11.7 |
| 2012-07-13 15:00:00 | 13.26 |
| 2012-07-13 16:00:00 | 16.64 |
| 2012-07-13 17:00:00 | 11.96 |
| 2012-07-13 18:00:00 | 10.4 |
| 2012-07-13 19:00:00 | 11.96 |
| 2012-07-13 20:00:00 | 15.86 |
| 2012-07-13 21:00:00 | 14.04 |
| 2012-07-13 22:00:00 | 11.7 |
| 2012-07-13 23:00:00 | 11.96 |
| 2012-07-14 | 11.7 |
| 2012-07-14 01:00:00 | 9.1 |
| 2012-07-14 02:00:00 | 9.36 |
| 2012-07-14 03:00:00 | 10.14 |
| 2012-07-14 04:00:00 | 9.36 |
| 2012-07-14 05:00:00 | 7.54 |
| 2012-07-14 06:00:00 | 9.88 |
| 2012-07-14 07:00:00 | 14.04 |
| 2012-07-14 08:00:00 | 17.16 |
| 2012-07-14 09:00:00 | 12.22 |
| 2012-07-14 10:00:00 | 10.4 |
| 2012-07-14 11:00:00 | 10.4 |
| 2012-07-14 12:00:00 | 11.44 |
| 2012-07-14 13:00:00 | 11.7 |
| 2012-07-14 14:00:00 | 10.66 |
| 2012-07-14 15:00:00 | 11.7 |
| 2012-07-14 16:00:00 | 11.44 |
| 2012-07-14 17:00:00 | 9.36 |
| 2012-07-14 18:00:00 | 9.62 |
| 2012-07-14 19:00:00 | 9.62 |
| 2012-07-14 20:00:00 | 10.66 |
| 2012-07-14 21:00:00 | 11.44 |
| 2012-07-14 22:00:00 | 11.44 |
| 2012-07-14 23:00:00 | 10.4 |
| 2012-07-15 | 9.62 |
| 2012-07-15 01:00:00 | 10.14 |
| 2012-07-15 02:00:00 | 9.1 |
| 2012-07-15 03:00:00 | 8.32 |
| 2012-07-15 04:00:00 | 7.54 |
| 2012-07-15 05:00:00 | 7.28 |
| 2012-07-15 06:00:00 | 7.8 |
| 2012-07-15 07:00:00 | 9.1 |
| 2012-07-15 08:00:00 | 7.8 |
| 2012-07-15 09:00:00 | 8.58 |
| 2012-07-15 10:00:00 | 9.1 |
| 2012-07-15 11:00:00 | 9.1 |
| 2012-07-15 12:00:00 | 11.44 |
| 2012-07-15 13:00:00 | 10.66 |
| 2012-07-15 14:00:00 | 10.4 |
| 2012-07-15 15:00:00 | 9.88 |
| 2012-07-15 16:00:00 | 10.4 |
| 2012-07-15 17:00:00 | 10.4 |
| 2012-07-15 18:00:00 | 8.58 |
| 2012-07-15 19:00:00 | 8.58 |
| 2012-07-15 20:00:00 | 9.88 |
| 2012-07-15 21:00:00 | 10.92 |
| 2012-07-15 22:00:00 | 10.92 |
| 2012-07-15 23:00:00 | 9.88 |
| 2012-07-16 | 9.88 |
| 2012-07-16 01:00:00 | 10.66 |
| 2012-07-16 02:00:00 | 8.84 |
| 2012-07-16 03:00:00 | 8.84 |
| 2012-07-16 04:00:00 | 9.36 |
| 2012-07-16 05:00:00 | 9.62 |
| 2012-07-16 06:00:00 | 8.84 |
| 2012-07-16 07:00:00 | 10.66 |
| 2012-07-16 08:00:00 | 11.7 |
| 2012-07-16 09:00:00 | 11.96 |
| 2012-07-16 10:00:00 | 27.82 |
| 2012-07-16 11:00:00 | 97.24 |
| 2012-07-16 12:00:00 | 33.02 |
| 2012-07-16 13:00:00 | 15.86 |
| 2012-07-16 14:00:00 | 12.74 |
| 2012-07-16 15:00:00 | 75.4 |
| 2012-07-16 16:00:00 | 76.96 |
| 2012-07-16 17:00:00 | 58.5 |
| 2012-07-16 18:00:00 | 53.82 |
| 2012-07-16 19:00:00 | 22.36 |
| 2012-07-16 20:00:00 | 16.12 |
| 2012-07-16 21:00:00 | 14.82 |
| 2012-07-16 22:00:00 | 15.08 |
| 2012-07-16 23:00:00 | 15.34 |
| 2012-07-17 | 12.74 |
| 2012-07-17 01:00:00 | 10.4 |
| 2012-07-17 02:00:00 | 11.96 |
| 2012-07-17 03:00:00 | 10.4 |
| 2012-07-17 04:00:00 | 8.58 |
| 2012-07-17 05:00:00 | 9.62 |
| 2012-07-17 06:00:00 | 10.4 |
| 2012-07-17 07:00:00 | 10.66 |
| 2012-07-17 08:00:00 | 9.62 |
| 2012-07-17 09:00:00 | 9.1 |
| 2012-07-17 10:00:00 | 11.44 |
| 2012-07-17 11:00:00 | 10.4 |
| 2012-07-17 12:00:00 | 15.6 |
| 2012-07-17 13:00:00 | 33.28 |
| 2012-07-17 14:00:00 | 15.86 |
| 2012-07-17 15:00:00 | 10.92 |
| 2012-07-17 16:00:00 | 11.18 |
| 2012-07-17 17:00:00 | 10.14 |
| 2012-07-17 18:00:00 | 9.36 |
| 2012-07-17 19:00:00 | 9.1 |
| 2012-07-17 20:00:00 | 11.18 |
| 2012-07-17 21:00:00 | 11.44 |
| 2012-07-17 22:00:00 | 14.04 |
| 2012-07-17 23:00:00 | 22.1 |
| 2012-07-18 | 14.82 |
| 2012-07-18 01:00:00 | 10.4 |
| 2012-07-18 02:00:00 | 10.14 |
| 2012-07-18 03:00:00 | 17.42 |
| 2012-07-18 04:00:00 | 9.88 |
| 2012-07-18 05:00:00 | 7.8 |
| 2012-07-18 06:00:00 | 9.1 |
| 2012-07-18 07:00:00 | 9.88 |
| 2012-07-18 08:00:00 | 9.1 |
| 2012-07-18 09:00:00 | 9.1 |
| 2012-07-18 10:00:00 | 2.08 |
| 2012-07-18 11:00:00 | 23.4 |
| 2012-07-18 12:00:00 | 9.88 |
| 2012-07-18 13:00:00 | 11.18 |
| 2012-07-18 14:00:00 | 11.44 |
| 2012-07-18 15:00:00 | 11.18 |
| 2012-07-18 16:00:00 | 9.36 |
| 2012-07-18 17:00:00 | 9.1 |
| 2012-07-18 18:00:00 | 10.14 |
| 2012-07-18 19:00:00 | 9.36 |
| 2012-07-18 20:00:00 | 9.36 |
| 2012-07-18 21:00:00 | 10.92 |
| 2012-07-18 22:00:00 | 11.18 |
| 2012-07-18 23:00:00 | 10.92 |
| 2012-07-19 | 8.32 |
| 2012-07-19 01:00:00 | 8.84 |
| 2012-07-19 02:00:00 | 9.88 |
| 2012-07-19 03:00:00 | 8.58 |
| 2012-07-19 04:00:00 | 6.5 |
| 2012-07-19 05:00:00 | 9.36 |
| 2012-07-19 06:00:00 | 9.1 |
| 2012-07-19 07:00:00 | 9.1 |
| 2012-07-19 08:00:00 | 8.32 |
| 2012-07-19 09:00:00 | 8.32 |
| 2012-07-19 10:00:00 | 10.4 |
| 2012-07-19 11:00:00 | 10.14 |
| 2012-07-19 12:00:00 | 8.58 |
| 2012-07-19 13:00:00 | 11.18 |
| 2012-07-19 14:00:00 | 10.4 |
| 2012-07-19 15:00:00 | 10.66 |
| 2012-07-19 16:00:00 | 10.14 |
| 2012-07-19 17:00:00 | 10.4 |
| 2012-07-19 18:00:00 | 8.32 |
| 2012-07-19 19:00:00 | 9.62 |
| 2012-07-19 20:00:00 | 10.66 |
| 2012-07-19 21:00:00 | 9.36 |
| 2012-07-19 22:00:00 | 9.62 |
| 2012-07-19 23:00:00 | 10.92 |
| 2012-07-20 | 10.92 |
| 2012-07-20 01:00:00 | 10.14 |
| 2012-07-20 02:00:00 | 7.02 |
| 2012-07-20 03:00:00 | 8.32 |
| 2012-07-20 04:00:00 | 8.84 |
| 2012-07-20 05:00:00 | 8.32 |
| 2012-07-20 06:00:00 | 7.54 |
| 2012-07-20 07:00:00 | 8.58 |
| 2012-07-20 08:00:00 | 9.62 |
| 2012-07-20 09:00:00 | 9.88 |
| 2012-07-20 10:00:00 | 9.62 |
| 2012-07-20 11:00:00 | 8.06 |
| 2012-07-20 12:00:00 | 10.14 |
| 2012-07-20 13:00:00 | 10.14 |
| 2012-07-20 14:00:00 | 10.4 |
| 2012-07-20 15:00:00 | 10.14 |
| 2012-07-20 16:00:00 | 9.36 |
| 2012-07-20 17:00:00 | 9.1 |
| 2012-07-20 18:00:00 | 9.36 |
| 2012-07-20 19:00:00 | 9.88 |
| 2012-07-20 20:00:00 | 9.88 |
| 2012-07-20 21:00:00 | 10.14 |
| 2012-07-20 22:00:00 | 9.1 |
| 2012-07-20 23:00:00 | 9.88 |
| 2012-07-21 | 10.14 |
| 2012-07-21 01:00:00 | 9.88 |
| 2012-07-21 02:00:00 | 31.72 |
| 2012-07-21 03:00:00 | 15.08 |
| 2012-07-21 04:00:00 | 11.44 |
| 2012-07-21 05:00:00 | 12.74 |
| 2012-07-21 06:00:00 | 10.92 |
| 2012-07-21 07:00:00 | 10.4 |
| 2012-07-21 08:00:00 | 8.58 |
| 2012-07-21 09:00:00 | 10.92 |
| 2012-07-21 10:00:00 | 11.7 |
| 2012-07-21 11:00:00 | 10.66 |
| 2012-07-21 12:00:00 | 11.18 |
| 2012-07-21 13:00:00 | 11.44 |
| 2012-07-21 14:00:00 | 11.44 |
| 2012-07-21 15:00:00 | 9.36 |
| 2012-07-21 16:00:00 | 11.96 |
| 2012-07-21 17:00:00 | 9.1 |
| 2012-07-21 18:00:00 | 9.1 |
| 2012-07-21 19:00:00 | 9.1 |
| 2012-07-21 20:00:00 | 8.84 |
| 2012-07-21 21:00:00 | 9.62 |
| 2012-07-21 22:00:00 | 10.14 |
| 2012-07-21 23:00:00 | 8.84 |
| 2012-07-22 | 8.84 |
| 2012-07-22 01:00:00 | 8.58 |
| 2012-07-22 02:00:00 | 8.58 |
| 2012-07-22 03:00:00 | 8.32 |
| 2012-07-22 04:00:00 | 6.76 |
| 2012-07-22 05:00:00 | 7.28 |
| 2012-07-22 06:00:00 | 6.76 |
| 2012-07-22 07:00:00 | 8.58 |
| 2012-07-22 08:00:00 | 9.36 |
| 2012-07-22 09:00:00 | 8.32 |
| 2012-07-22 10:00:00 | 8.58 |
| 2012-07-22 11:00:00 | 9.1 |
| 2012-07-22 12:00:00 | 9.62 |
| 2012-07-22 13:00:00 | 10.66 |
| 2012-07-22 14:00:00 | 10.66 |
| 2012-07-22 15:00:00 | 9.62 |
| 2012-07-22 16:00:00 | 8.58 |
| 2012-07-22 17:00:00 | 10.66 |
| 2012-07-22 18:00:00 | 9.62 |
| 2012-07-22 19:00:00 | 8.58 |
| 2012-07-22 20:00:00 | 9.1 |
| 2012-07-22 21:00:00 | 8.84 |
| 2012-07-22 22:00:00 | 9.36 |
| 2012-07-22 23:00:00 | 11.18 |
| 2012-07-23 | 9.1 |
| 2012-07-23 01:00:00 | 8.32 |
| 2012-07-23 02:00:00 | 9.62 |
| 2012-07-23 03:00:00 | 7.54 |
| 2012-07-23 04:00:00 | 7.02 |
| 2012-07-23 05:00:00 | 7.8 |
| 2012-07-23 06:00:00 | 9.36 |
| 2012-07-23 07:00:00 | 9.88 |
| 2012-07-23 08:00:00 | 8.58 |
| 2012-07-23 09:00:00 | 9.62 |
| 2012-07-23 10:00:00 | 11.18 |
| 2012-07-23 11:00:00 | 11.18 |
| 2012-07-23 12:00:00 | 11.44 |
| 2012-07-23 13:00:00 | 9.36 |
| 2012-07-23 14:00:00 | 11.44 |
| 2012-07-23 15:00:00 | 11.18 |
| 2012-07-23 16:00:00 | 11.44 |
| 2012-07-23 17:00:00 | 10.4 |
| 2012-07-23 18:00:00 | 9.36 |
| 2012-07-23 19:00:00 | 9.62 |
| 2012-07-23 20:00:00 | 10.92 |
| 2012-07-23 21:00:00 | 11.18 |
| 2012-07-23 22:00:00 | 9.62 |
| 2012-07-23 23:00:00 | 11.44 |
| 2012-07-24 | 11.18 |
| 2012-07-24 01:00:00 | 11.18 |
| 2012-07-24 02:00:00 | 7.28 |
| 2012-07-24 03:00:00 | 9.1 |
| 2012-07-24 04:00:00 | 9.36 |
| 2012-07-24 05:00:00 | 7.02 |
| 2012-07-24 06:00:00 | 7.02 |
| 2012-07-24 07:00:00 | 10.14 |
| 2012-07-24 08:00:00 | 9.88 |
| 2012-07-24 09:00:00 | 11.7 |
| 2012-07-24 10:00:00 | 8.58 |
| 2012-07-24 11:00:00 | 10.14 |
| 2012-07-24 12:00:00 | 13.52 |
| 2012-07-24 13:00:00 | 12.22 |
| 2012-07-24 14:00:00 | 9.1 |
| 2012-07-24 15:00:00 | 11.18 |
| 2012-07-24 16:00:00 | 11.96 |
| 2012-07-24 17:00:00 | 11.18 |
| 2012-07-24 18:00:00 | 9.62 |
| 2012-07-24 19:00:00 | 9.62 |
| 2012-07-24 20:00:00 | 11.96 |
| 2012-07-24 21:00:00 | 11.7 |
| 2012-07-24 22:00:00 | 11.96 |
| 2012-07-24 23:00:00 | 12.22 |
| 2012-07-25 | 11.18 |
| 2012-07-25 01:00:00 | 8.06 |
| 2012-07-25 02:00:00 | 9.62 |
| 2012-07-25 03:00:00 | 10.4 |
| 2012-07-25 04:00:00 | 6.5 |
| 2012-07-25 05:00:00 | 8.32 |
| 2012-07-25 06:00:00 | 9.36 |
| 2012-07-25 07:00:00 | 9.36 |
| 2012-07-25 08:00:00 | 11.18 |
| 2012-07-25 09:00:00 | 11.96 |
| 2012-07-25 10:00:00 | 11.96 |
| 2012-07-25 11:00:00 | 14.3 |
| 2012-07-25 12:00:00 | 14.82 |
| 2012-07-25 13:00:00 | 12.22 |
| 2012-07-25 14:00:00 | 9.62 |
| 2012-07-25 15:00:00 | 11.7 |
| 2012-07-25 16:00:00 | 11.96 |
| 2012-07-25 17:00:00 | 11.7 |
| 2012-07-25 18:00:00 | 9.88 |
| 2012-07-25 19:00:00 | 10.92 |
| 2012-07-25 20:00:00 | 11.44 |
| 2012-07-25 21:00:00 | 11.7 |
| 2012-07-25 22:00:00 | 10.14 |
| 2012-07-25 23:00:00 | 11.7 |
| 2012-07-26 | 11.96 |
| 2012-07-26 01:00:00 | 8.84 |
| 2012-07-26 02:00:00 | 9.62 |
| 2012-07-26 03:00:00 | 9.36 |
| 2012-07-26 04:00:00 | 8.32 |
| 2012-07-26 05:00:00 | 7.28 |
| 2012-07-26 06:00:00 | 10.66 |
| 2012-07-26 07:00:00 | 10.66 |
| 2012-07-26 08:00:00 | 11.18 |
| 2012-07-26 09:00:00 | 9.36 |
| 2012-07-26 10:00:00 | 10.14 |
| 2012-07-26 11:00:00 | 11.18 |
| 2012-07-26 12:00:00 | 10.14 |
| 2012-07-26 13:00:00 | 9.62 |
| 2012-07-26 14:00:00 | 10.92 |
| 2012-07-26 15:00:00 | 17.42 |
| 2012-07-26 16:00:00 | 20.28 |
| 2012-07-26 17:00:00 | 18.72 |
| 2012-07-26 18:00:00 | 12.22 |
| 2012-07-26 19:00:00 | 10.92 |
| 2012-07-26 20:00:00 | 11.18 |
| 2012-07-26 21:00:00 | 11.44 |
| 2012-07-26 22:00:00 | 10.4 |
| 2012-07-26 23:00:00 | 11.44 |
| 2012-07-27 | 13 |
| 2012-07-27 01:00:00 | 9.36 |
| 2012-07-27 02:00:00 | 7.8 |
| 2012-07-27 03:00:00 | 10.4 |
| 2012-07-27 04:00:00 | 8.32 |
| 2012-07-27 05:00:00 | 7.8 |
| 2012-07-27 06:00:00 | 9.1 |
| 2012-07-27 07:00:00 | 10.14 |
| 2012-07-27 08:00:00 | 10.14 |
| 2012-07-27 09:00:00 | 10.14 |
| 2012-07-27 10:00:00 | 9.36 |
| 2012-07-27 11:00:00 | 15.08 |
| 2012-07-27 12:00:00 | 10.66 |
| 2012-07-27 13:00:00 | 9.88 |
| 2012-07-27 14:00:00 | 11.7 |
| 2012-07-27 15:00:00 | 11.96 |
| 2012-07-27 16:00:00 | 11.7 |
| 2012-07-27 17:00:00 | 11.7 |
| 2012-07-27 18:00:00 | 9.62 |
| 2012-07-27 19:00:00 | 9.36 |
| 2012-07-27 20:00:00 | 11.7 |
| 2012-07-27 21:00:00 | 10.14 |
| 2012-07-27 22:00:00 | 10.14 |
| 2012-07-27 23:00:00 | 10.4 |
| 2012-07-28 | 11.7 |
| 2012-07-28 01:00:00 | 9.36 |
| 2012-07-28 02:00:00 | 8.32 |
| 2012-07-28 03:00:00 | 10.14 |
| 2012-07-28 04:00:00 | 7.02 |
| 2012-07-28 05:00:00 | 8.06 |
| 2012-07-28 06:00:00 | 9.36 |
| 2012-07-28 07:00:00 | 9.1 |
| 2012-07-28 08:00:00 | 9.36 |
| 2012-07-28 09:00:00 | 7.8 |
| 2012-07-28 10:00:00 | 10.14 |
| 2012-07-28 11:00:00 | 11.7 |
| 2012-07-28 12:00:00 | 10.4 |
| 2012-07-28 13:00:00 | 10.14 |
| 2012-07-28 14:00:00 | 11.96 |
| 2012-07-28 15:00:00 | 10.92 |
| 2012-07-28 16:00:00 | 9.36 |
| 2012-07-28 17:00:00 | 10.66 |
| 2012-07-28 18:00:00 | 10.66 |
| 2012-07-28 19:00:00 | 8.58 |
| 2012-07-28 20:00:00 | 9.1 |
| 2012-07-28 21:00:00 | 10.4 |
| 2012-07-28 22:00:00 | 10.14 |
| 2012-07-28 23:00:00 | 9.36 |
| 2012-07-29 | 10.14 |
| 2012-07-29 01:00:00 | 9.36 |
| 2012-07-29 02:00:00 | 8.06 |
| 2012-07-29 03:00:00 | 10.4 |
| 2012-07-29 04:00:00 | 16.64 |
| 2012-07-29 05:00:00 | 10.4 |
| 2012-07-29 06:00:00 | 13.26 |
| 2012-07-29 07:00:00 | 11.18 |
| 2012-07-29 08:00:00 | 9.1 |
| 2012-07-29 09:00:00 | 8.58 |
| 2012-07-29 10:00:00 | 11.18 |
| 2012-07-29 11:00:00 | 11.7 |
| 2012-07-29 12:00:00 | 10.4 |
| 2012-07-29 13:00:00 | 14.56 |
| 2012-07-29 14:00:00 | 12.48 |
| 2012-07-29 15:00:00 | 10.14 |
| 2012-07-29 16:00:00 | 9.88 |
| 2012-07-29 17:00:00 | 20.54 |
| 2012-07-29 18:00:00 | 21.06 |
| 2012-07-29 19:00:00 | 16.9 |
| 2012-07-29 20:00:00 | 13 |
| 2012-07-29 21:00:00 | 10.4 |
| 2012-07-29 22:00:00 | 10.66 |
| 2012-07-29 23:00:00 | 11.96 |
| 2012-07-30 | 11.96 |
| 2012-07-30 01:00:00 | 8.58 |
| 2012-07-30 02:00:00 | 8.06 |
| 2012-07-30 03:00:00 | 9.1 |
| 2012-07-30 04:00:00 | 9.36 |
| 2012-07-30 05:00:00 | 7.28 |
| 2012-07-30 06:00:00 | 6.76 |
| 2012-07-30 07:00:00 | 9.1 |
| 2012-07-30 08:00:00 | 8.32 |
| 2012-07-30 09:00:00 | 7.8 |
| 2012-07-30 10:00:00 | 8.84 |
| 2012-07-30 11:00:00 | 8.58 |
| 2012-07-30 12:00:00 | 9.36 |
| 2012-07-30 13:00:00 | 9.88 |
| 2012-07-30 14:00:00 | 8.84 |
| 2012-07-30 15:00:00 | 8.84 |
| 2012-07-30 16:00:00 | 10.4 |
| 2012-07-30 17:00:00 | 8.84 |
| 2012-07-30 18:00:00 | 8.06 |
| 2012-07-30 19:00:00 | 8.84 |
| 2012-07-30 20:00:00 | 8.06 |
| 2012-07-30 21:00:00 | 8.58 |
| 2012-07-30 22:00:00 | 10.14 |
| 2012-07-30 23:00:00 | 10.4 |
| 2012-07-31 | 8.58 |
| 2012-07-31 01:00:00 | 8.32 |
| 2012-07-31 02:00:00 | 7.8 |
| 2012-07-31 03:00:00 | 6.76 |
| 2012-07-31 04:00:00 | 6.5 |
| 2012-07-31 05:00:00 | 6.76 |
| 2012-07-31 06:00:00 | 8.06 |
| 2012-07-31 07:00:00 | 6.76 |
| 2012-07-31 08:00:00 | 7.8 |
| 2012-07-31 09:00:00 | 8.58 |
| 2012-07-31 10:00:00 | 9.36 |
| 2012-07-31 11:00:00 | 9.36 |
| 2012-07-31 12:00:00 | 8.06 |
| 2012-07-31 13:00:00 | 10.4 |
| 2012-07-31 14:00:00 | 9.1 |
| 2012-07-31 15:00:00 | 10.66 |
| 2012-07-31 16:00:00 | 9.1 |
| 2012-07-31 17:00:00 | 8.58 |
| 2012-07-31 18:00:00 | 7.28 |
| 2012-07-31 19:00:00 | 8.32 |
| 2012-07-31 20:00:00 | 8.32 |
| 2012-07-31 21:00:00 | 8.58 |
| 2012-07-31 22:00:00 | 10.66 |
| 2012-07-31 23:00:00 | 8.84 |
| 2012-08-01 | 8.58 |
| 2012-08-01 01:00:00 | 8.32 |
| 2012-08-01 02:00:00 | 7.02 |
| 2012-08-01 03:00:00 | 8.58 |
| 2012-08-01 04:00:00 | 6.5 |
| 2012-08-01 05:00:00 | 6.5 |
| 2012-08-01 06:00:00 | 6.24 |
| 2012-08-01 07:00:00 | 6.76 |
| 2012-08-01 08:00:00 | 8.84 |
| 2012-08-01 09:00:00 | 8.84 |
| 2012-08-01 10:00:00 | 8.58 |
| 2012-08-01 11:00:00 | 8.58 |
| 2012-08-01 12:00:00 | 9.1 |
| 2012-08-01 13:00:00 | 13 |
| 2012-08-01 14:00:00 | 8.58 |
| 2012-08-01 15:00:00 | 10.14 |
| 2012-08-01 16:00:00 | 9.88 |
| 2012-08-01 17:00:00 | 7.54 |
| 2012-08-01 18:00:00 | 8.32 |
| 2012-08-01 19:00:00 | 8.06 |
| 2012-08-01 20:00:00 | 10.66 |
| 2012-08-01 21:00:00 | 8.84 |
| 2012-08-01 22:00:00 | 8.84 |
| 2012-08-01 23:00:00 | 8.84 |
| 2012-08-02 | 8.06 |
| 2012-08-02 01:00:00 | 7.8 |
| 2012-08-02 02:00:00 | 9.88 |
| 2012-08-02 03:00:00 | 6.76 |
| 2012-08-02 04:00:00 | 6.24 |
| 2012-08-02 05:00:00 | 6.5 |
| 2012-08-02 06:00:00 | 6.76 |
| 2012-08-02 07:00:00 | 7.8 |
| 2012-08-02 08:00:00 | 8.32 |
| 2012-08-02 09:00:00 | 8.06 |
| 2012-08-02 10:00:00 | 7.8 |
| 2012-08-02 11:00:00 | 8.58 |
| 2012-08-02 12:00:00 | 8.58 |
| 2012-08-02 13:00:00 | 10.92 |
| 2012-08-02 14:00:00 | 8.58 |
| 2012-08-02 15:00:00 | 8.58 |
| 2012-08-02 16:00:00 | 10.4 |
| 2012-08-02 17:00:00 | 8.06 |
| 2012-08-02 18:00:00 | 8.84 |
| 2012-08-02 19:00:00 | 7.54 |
| 2012-08-02 20:00:00 | 8.58 |
| 2012-08-02 21:00:00 | 8.58 |
| 2012-08-02 22:00:00 | 8.58 |
| 2012-08-02 23:00:00 | 9.88 |
| 2012-08-03 | 8.84 |
| 2012-08-03 01:00:00 | 8.58 |
| 2012-08-03 02:00:00 | 7.28 |
| 2012-08-03 03:00:00 | 6.76 |
| 2012-08-03 04:00:00 | 8.58 |
| 2012-08-03 05:00:00 | 8.06 |
| 2012-08-03 06:00:00 | 7.02 |
| 2012-08-03 07:00:00 | 7.28 |
| 2012-08-03 08:00:00 | 8.32 |
| 2012-08-03 09:00:00 | 8.84 |
| 2012-08-03 10:00:00 | 11.96 |
| 2012-08-03 11:00:00 | 9.1 |
| 2012-08-03 12:00:00 | 9.88 |
| 2012-08-03 13:00:00 | 11.44 |
| 2012-08-03 14:00:00 | 11.96 |
| 2012-08-03 15:00:00 | 11.18 |
| 2012-08-03 16:00:00 | 8.84 |
| 2012-08-03 17:00:00 | 70.46 |
| 2012-08-03 18:00:00 | 106.6 |
| 2012-08-03 19:00:00 | 105.3 |
| 2012-08-03 20:00:00 | 27.82 |
| 2012-08-03 21:00:00 | 17.42 |
| 2012-08-03 22:00:00 | 18.72 |
| 2012-08-03 23:00:00 | 15.6 |
| 2012-08-04 | 12.48 |
| 2012-08-04 01:00:00 | 10.4 |
| 2012-08-04 02:00:00 | 9.62 |
| 2012-08-04 03:00:00 | 8.58 |
| 2012-08-04 04:00:00 | 7.28 |
| 2012-08-04 05:00:00 | 8.32 |
| 2012-08-04 06:00:00 | 9.62 |
| 2012-08-04 07:00:00 | 8.32 |
| 2012-08-04 08:00:00 | 8.84 |
| 2012-08-04 09:00:00 | 9.88 |
| 2012-08-04 10:00:00 | 10.14 |
| 2012-08-04 11:00:00 | 11.44 |
| 2012-08-04 12:00:00 | 10.66 |
| 2012-08-04 13:00:00 | 11.44 |
| 2012-08-04 14:00:00 | 12.74 |
| 2012-08-04 15:00:00 | 10.66 |
| 2012-08-04 16:00:00 | 10.66 |
| 2012-08-04 17:00:00 | 10.66 |
| 2012-08-04 18:00:00 | 9.36 |
| 2012-08-04 19:00:00 | 8.84 |
| 2012-08-04 20:00:00 | 9.36 |
| 2012-08-04 21:00:00 | 9.36 |
| 2012-08-04 22:00:00 | 8.84 |
| 2012-08-04 23:00:00 | 8.58 |
| 2012-08-05 | 9.1 |
| 2012-08-05 01:00:00 | 8.06 |
| 2012-08-05 02:00:00 | 7.8 |
| 2012-08-05 03:00:00 | 7.02 |
| 2012-08-05 04:00:00 | 7.54 |
| 2012-08-05 05:00:00 | 8.06 |
| 2012-08-05 06:00:00 | 7.54 |
| 2012-08-05 07:00:00 | 6.76 |
| 2012-08-05 08:00:00 | 8.06 |
| 2012-08-05 09:00:00 | 8.32 |
| 2012-08-05 10:00:00 | 10.14 |
| 2012-08-05 11:00:00 | 12.22 |
| 2012-08-05 12:00:00 | 12.48 |
| 2012-08-05 13:00:00 | 15.34 |
| 2012-08-05 14:00:00 | 10.66 |
| 2012-08-05 15:00:00 | 9.62 |
| 2012-08-05 16:00:00 | 8.58 |
| 2012-08-05 17:00:00 | 10.4 |
| 2012-08-05 18:00:00 | 9.1 |
| 2012-08-05 19:00:00 | 8.06 |
| 2012-08-05 20:00:00 | 9.36 |
| 2012-08-05 21:00:00 | 9.36 |
| 2012-08-05 22:00:00 | 9.62 |
| 2012-08-05 23:00:00 | 9.88 |
| 2012-08-06 | 10.66 |
| 2012-08-06 01:00:00 | 8.58 |
| 2012-08-06 02:00:00 | 8.32 |
| 2012-08-06 03:00:00 | 8.84 |
| 2012-08-06 04:00:00 | 8.06 |
| 2012-08-06 05:00:00 | 7.02 |
| 2012-08-06 06:00:00 | 8.32 |
| 2012-08-06 07:00:00 | 9.88 |
| 2012-08-06 08:00:00 | 9.36 |
| 2012-08-06 09:00:00 | 10.92 |
| 2012-08-06 10:00:00 | 12.74 |
| 2012-08-06 11:00:00 | 13.52 |
| 2012-08-06 12:00:00 | 11.7 |
| 2012-08-06 13:00:00 | 10.4 |
| 2012-08-06 14:00:00 | 9.62 |
| 2012-08-06 15:00:00 | 10.4 |
| 2012-08-06 16:00:00 | 11.7 |
| 2012-08-06 17:00:00 | 8.84 |
| 2012-08-06 18:00:00 | 9.36 |
| 2012-08-06 19:00:00 | 9.62 |
| 2012-08-06 20:00:00 | 10.14 |
| 2012-08-06 21:00:00 | 9.62 |
| 2012-08-06 22:00:00 | 11.7 |
| 2012-08-06 23:00:00 | 11.7 |
| 2012-08-07 | 22.88 |
| 2012-08-07 01:00:00 | 93.08 |
| 2012-08-07 02:00:00 | 75.66 |
| 2012-08-07 03:00:00 | 94.64 |
| 2012-08-07 04:00:00 | 104 |
| 2012-08-07 05:00:00 | 102.7 |
| 2012-08-07 06:00:00 | 28.34 |
| 2012-08-07 07:00:00 | 19.76 |
| 2012-08-07 08:00:00 | 16.12 |
| 2012-08-07 09:00:00 | 12.48 |
| 2012-08-07 10:00:00 | 14.04 |
| 2012-08-07 11:00:00 | 16.12 |
| 2012-08-07 12:00:00 | 11.18 |
| 2012-08-07 13:00:00 | 10.92 |
| 2012-08-07 14:00:00 | 10.66 |
| 2012-08-07 15:00:00 | 13.78 |
| 2012-08-07 16:00:00 | 10.4 |
| 2012-08-07 17:00:00 | 10.4 |
| 2012-08-07 18:00:00 | 10.14 |
| 2012-08-07 19:00:00 | 10.14 |
| 2012-08-07 20:00:00 | 10.4 |
| 2012-08-07 21:00:00 | 11.7 |
| 2012-08-07 22:00:00 | 10.4 |
| 2012-08-07 23:00:00 | 10.4 |
| 2012-08-08 | 10.14 |
| 2012-08-08 01:00:00 | 8.58 |
| 2012-08-08 02:00:00 | 10.4 |
| 2012-08-08 03:00:00 | 7.28 |
| 2012-08-08 04:00:00 | 8.06 |
| 2012-08-08 05:00:00 | 7.8 |
| 2012-08-08 06:00:00 | 7.8 |
| 2012-08-08 07:00:00 | 9.88 |
| 2012-08-08 08:00:00 | 9.1 |
| 2012-08-08 09:00:00 | 8.84 |
| 2012-08-08 10:00:00 | 1.04 |
| 2012-08-08 11:00:00 | 14.56 |
| 2012-08-08 12:00:00 | 9.62 |
| 2012-08-08 13:00:00 | 11.18 |
| 2012-08-08 14:00:00 | 9.62 |
| 2012-08-08 15:00:00 | 9.62 |
| 2012-08-08 16:00:00 | 11.18 |
| 2012-08-08 17:00:00 | 8.84 |
| 2012-08-08 18:00:00 | 8.58 |
| 2012-08-08 19:00:00 | 8.84 |
| 2012-08-08 20:00:00 | 9.88 |
| 2012-08-08 21:00:00 | 9.62 |
| 2012-08-08 22:00:00 | 11.7 |
| 2012-08-08 23:00:00 | 10.92 |
| 2012-08-09 | 9.88 |
| 2012-08-09 01:00:00 | 9.1 |
| 2012-08-09 02:00:00 | 8.58 |
| 2012-08-09 03:00:00 | 8.58 |
| 2012-08-09 04:00:00 | 7.8 |
| 2012-08-09 05:00:00 | 9.36 |
| 2012-08-09 06:00:00 | 8.58 |
| 2012-08-09 07:00:00 | 7.8 |
| 2012-08-09 08:00:00 | 9.36 |
| 2012-08-09 09:00:00 | 9.36 |
| 2012-08-09 10:00:00 | 9.62 |
| 2012-08-09 11:00:00 | 11.18 |
| 2012-08-09 12:00:00 | 9.62 |
| 2012-08-09 13:00:00 | 11.44 |
| 2012-08-09 14:00:00 | 9.62 |
| 2012-08-09 15:00:00 | 9.62 |
| 2012-08-09 16:00:00 | 11.44 |
| 2012-08-09 17:00:00 | 8.84 |
| 2012-08-09 18:00:00 | 8.58 |
| 2012-08-09 19:00:00 | 9.36 |
| 2012-08-09 20:00:00 | 10.92 |
| 2012-08-09 21:00:00 | 9.1 |
| 2012-08-09 22:00:00 | 9.62 |
| 2012-08-09 23:00:00 | 9.36 |
| 2012-08-10 | 9.36 |
| 2012-08-10 01:00:00 | 8.58 |
| 2012-08-10 02:00:00 | 9.36 |
| 2012-08-10 03:00:00 | 7.28 |
| 2012-08-10 04:00:00 | 6.24 |
| 2012-08-10 05:00:00 | 7.02 |
| 2012-08-10 06:00:00 | 7.28 |
| 2012-08-10 07:00:00 | 7.28 |
| 2012-08-10 08:00:00 | 9.36 |
| 2012-08-10 09:00:00 | 9.1 |
| 2012-08-10 10:00:00 | 9.36 |
| 2012-08-10 11:00:00 | 9.1 |
| 2012-08-10 12:00:00 | 9.36 |
| 2012-08-10 13:00:00 | 10.92 |
| 2012-08-10 14:00:00 | 9.36 |
| 2012-08-10 15:00:00 | 9.36 |
| 2012-08-10 16:00:00 | 9.1 |
| 2012-08-10 17:00:00 | 9.36 |
| 2012-08-10 18:00:00 | 10.66 |
| 2012-08-10 19:00:00 | 9.36 |
| 2012-08-10 20:00:00 | 8.32 |
| 2012-08-10 21:00:00 | 10.92 |
| 2012-08-10 22:00:00 | 9.36 |
| 2012-08-10 23:00:00 | 9.1 |
| 2012-08-11 | 8.32 |
| 2012-08-11 01:00:00 | 8.32 |
| 2012-08-11 02:00:00 | 7.28 |
| 2012-08-11 03:00:00 | 7.28 |
| 2012-08-11 04:00:00 | 9.1 |
| 2012-08-11 05:00:00 | 9.88 |
| 2012-08-11 06:00:00 | 14.56 |
| 2012-08-11 07:00:00 | 81.12 |
| 2012-08-11 08:00:00 | 107.9 |
| 2012-08-11 09:00:00 | 107.12 |
| 2012-08-11 10:00:00 | 107.38 |
| 2012-08-11 11:00:00 | 107.64 |
| 2012-08-11 12:00:00 | 85.54 |
| 2012-08-11 13:00:00 | 35.88 |
| 2012-08-11 14:00:00 | 39 |
| 2012-08-11 15:00:00 | 22.36 |
| 2012-08-11 16:00:00 | 18.72 |
| 2012-08-11 17:00:00 | 18.72 |
| 2012-08-11 18:00:00 | 16.38 |
| 2012-08-11 19:00:00 | 15.34 |
| 2012-08-11 20:00:00 | 16.38 |
| 2012-08-11 21:00:00 | 17.16 |
| 2012-08-11 22:00:00 | 15.08 |
| 2012-08-11 23:00:00 | 14.3 |
| 2012-08-12 | 13.52 |
| 2012-08-12 01:00:00 | 13 |
| 2012-08-12 02:00:00 | 12.74 |
| 2012-08-12 03:00:00 | 13 |
| 2012-08-12 04:00:00 | 11.44 |
| 2012-08-12 05:00:00 | 10.14 |
| 2012-08-12 06:00:00 | 10.14 |
| 2012-08-12 07:00:00 | 9.88 |
| 2012-08-12 08:00:00 | 11.7 |
| 2012-08-12 09:00:00 | 13.26 |
| 2012-08-12 10:00:00 | 11.44 |
| 2012-08-12 11:00:00 | 13.26 |
| 2012-08-12 12:00:00 | 13.78 |
| 2012-08-12 13:00:00 | 15.86 |
| 2012-08-12 14:00:00 | 13.78 |
| 2012-08-12 15:00:00 | 14.04 |
| 2012-08-12 16:00:00 | 23.14 |
| 2012-08-12 17:00:00 | 14.04 |
| 2012-08-12 18:00:00 | 14.56 |
| 2012-08-12 19:00:00 | 11.7 |
| 2012-08-12 20:00:00 | 11.7 |
| 2012-08-12 21:00:00 | 11.96 |
| 2012-08-12 22:00:00 | 12.74 |
| 2012-08-12 23:00:00 | 13.52 |
| 2012-08-13 | 11.7 |
| 2012-08-13 01:00:00 | 11.18 |
| 2012-08-13 02:00:00 | 10.14 |
| 2012-08-13 03:00:00 | 8.84 |
| 2012-08-13 04:00:00 | 9.36 |
| 2012-08-13 05:00:00 | 9.36 |
| 2012-08-13 06:00:00 | 8.06 |
| 2012-08-13 07:00:00 | 9.36 |
| 2012-08-13 08:00:00 | 10.4 |
| 2012-08-13 09:00:00 | 9.62 |
| 2012-08-13 10:00:00 | 10.4 |
| 2012-08-13 11:00:00 | 10.66 |
| 2012-08-13 12:00:00 | 12.22 |
| 2012-08-13 13:00:00 | 8.58 |
| 2012-08-13 14:00:00 | 10.66 |
| 2012-08-13 15:00:00 | 10.4 |
| 2012-08-13 16:00:00 | 10.66 |
| 2012-08-13 17:00:00 | 9.62 |
| 2012-08-13 18:00:00 | 8.84 |
| 2012-08-13 19:00:00 | 10.14 |
| 2012-08-13 20:00:00 | 10.4 |
| 2012-08-13 21:00:00 | 9.62 |
| 2012-08-13 22:00:00 | 10.14 |
| 2012-08-13 23:00:00 | 10.66 |
| 2012-08-14 | 10.66 |
| 2012-08-14 01:00:00 | 9.62 |
| 2012-08-14 02:00:00 | 7.28 |
| 2012-08-14 03:00:00 | 8.58 |
| 2012-08-14 04:00:00 | 8.84 |
| 2012-08-14 05:00:00 | 6.76 |
| 2012-08-14 06:00:00 | 7.54 |
| 2012-08-14 07:00:00 | 9.62 |
| 2012-08-14 08:00:00 | 8.58 |
| 2012-08-14 09:00:00 | 8.58 |
| 2012-08-14 10:00:00 | 9.88 |
| 2012-08-14 11:00:00 | 9.62 |
| 2012-08-14 12:00:00 | 9.88 |
| 2012-08-14 13:00:00 | 11.7 |
| 2012-08-14 14:00:00 | 10.14 |
| 2012-08-14 15:00:00 | 9.36 |
| 2012-08-14 16:00:00 | 10.92 |
| 2012-08-14 17:00:00 | 9.88 |
| 2012-08-14 18:00:00 | 8.06 |
| 2012-08-14 19:00:00 | 10.4 |
| 2012-08-14 20:00:00 | 10.66 |
| 2012-08-14 21:00:00 | 9.88 |
| 2012-08-14 22:00:00 | 10.14 |
| 2012-08-14 23:00:00 | 10.92 |
| 2012-08-15 | 11.18 |
| 2012-08-15 01:00:00 | 10.14 |
| 2012-08-15 02:00:00 | 7.8 |
| 2012-08-15 03:00:00 | 9.1 |
| 2012-08-15 04:00:00 | 9.62 |
| 2012-08-15 05:00:00 | 8.58 |
| 2012-08-15 06:00:00 | 8.06 |
| 2012-08-15 07:00:00 | 10.66 |
| 2012-08-15 08:00:00 | 9.88 |
| 2012-08-15 09:00:00 | 9.1 |
| 2012-08-15 10:00:00 | 11.18 |
| 2012-08-15 11:00:00 | 10.66 |
| 2012-08-15 12:00:00 | 9.88 |
| 2012-08-15 13:00:00 | 10.92 |
| 2012-08-15 14:00:00 | 10.4 |
| 2012-08-15 15:00:00 | 10.66 |
| 2012-08-15 16:00:00 | 9.88 |
| 2012-08-15 17:00:00 | 7.8 |
| 2012-08-15 18:00:00 | 10.4 |
| 2012-08-15 19:00:00 | 9.62 |
| 2012-08-15 20:00:00 | 9.1 |
| 2012-08-15 21:00:00 | 8.84 |
| 2012-08-15 22:00:00 | 10.66 |
| 2012-08-15 23:00:00 | 10.4 |
| 2012-08-16 | 10.14 |
| 2012-08-16 01:00:00 | 8.06 |
| 2012-08-16 02:00:00 | 8.58 |
| 2012-08-16 03:00:00 | 8.32 |
| 2012-08-16 04:00:00 | 5.98 |
| 2012-08-16 05:00:00 | 8.32 |
| 2012-08-16 06:00:00 | 7.8 |
| 2012-08-16 07:00:00 | 7.02 |
| 2012-08-16 08:00:00 | 9.62 |
| 2012-08-16 09:00:00 | 8.58 |
| 2012-08-16 10:00:00 | 8.58 |
| 2012-08-16 11:00:00 | 10.4 |
| 2012-08-16 12:00:00 | 8.58 |
| 2012-08-16 13:00:00 | 8.84 |
| 2012-08-16 14:00:00 | 10.4 |
| 2012-08-16 15:00:00 | 10.66 |
| 2012-08-16 16:00:00 | 9.62 |
| 2012-08-16 17:00:00 | 7.54 |
| 2012-08-16 18:00:00 | 9.62 |
| 2012-08-16 19:00:00 | 9.36 |
| 2012-08-16 20:00:00 | 8.58 |
| 2012-08-16 21:00:00 | 8.06 |
| 2012-08-16 22:00:00 | 10.66 |
| 2012-08-16 23:00:00 | 10.66 |
| 2012-08-17 | 9.62 |
| 2012-08-17 01:00:00 | 7.8 |
| 2012-08-17 02:00:00 | 8.84 |
| 2012-08-17 03:00:00 | 8.32 |
| 2012-08-17 04:00:00 | 6.76 |
| 2012-08-17 05:00:00 | 7.28 |
| 2012-08-17 06:00:00 | 7.8 |
| 2012-08-17 07:00:00 | 8.58 |
| 2012-08-17 08:00:00 | 7.54 |
| 2012-08-17 09:00:00 | 8.84 |
| 2012-08-17 10:00:00 | 10.4 |
| 2012-08-17 11:00:00 | 7.8 |
| 2012-08-17 12:00:00 | 12.22 |
| 2012-08-17 13:00:00 | 18.98 |
| 2012-08-17 14:00:00 | 20.02 |
| 2012-08-17 15:00:00 | 32.5 |
| 2012-08-17 16:00:00 | 14.56 |
| 2012-08-17 17:00:00 | 10.66 |
| 2012-08-17 18:00:00 | 9.62 |
| 2012-08-17 19:00:00 | 8.84 |
| 2012-08-17 20:00:00 | 10.4 |
| 2012-08-17 21:00:00 | 9.1 |
| 2012-08-17 22:00:00 | 9.1 |
| 2012-08-17 23:00:00 | 10.92 |
| 2012-08-18 | 10.14 |
| 2012-08-18 01:00:00 | 7.8 |
| 2012-08-18 02:00:00 | 8.06 |
| 2012-08-18 03:00:00 | 8.32 |
| 2012-08-18 04:00:00 | 7.28 |
| 2012-08-18 05:00:00 | 6.24 |
| 2012-08-18 06:00:00 | 8.06 |
| 2012-08-18 07:00:00 | 8.06 |
| 2012-08-18 08:00:00 | 7.54 |
| 2012-08-18 09:00:00 | 7.8 |
| 2012-08-18 10:00:00 | 10.66 |
| 2012-08-18 11:00:00 | 10.92 |
| 2012-08-18 12:00:00 | 9.1 |
| 2012-08-18 13:00:00 | 8.58 |
| 2012-08-18 14:00:00 | 9.36 |
| 2012-08-18 15:00:00 | 10.4 |
| 2012-08-18 16:00:00 | 8.32 |
| 2012-08-18 17:00:00 | 8.06 |
| 2012-08-18 18:00:00 | 8.32 |
| 2012-08-18 19:00:00 | 8.06 |
| 2012-08-18 20:00:00 | 8.06 |
| 2012-08-18 21:00:00 | 8.32 |
| 2012-08-18 22:00:00 | 9.36 |
| 2012-08-18 23:00:00 | 9.88 |
| 2012-08-19 | 8.32 |
| 2012-08-19 01:00:00 | 7.8 |
| 2012-08-19 02:00:00 | 7.8 |
| 2012-08-19 03:00:00 | 6.5 |
| 2012-08-19 04:00:00 | 7.02 |
| 2012-08-19 05:00:00 | 7.02 |
| 2012-08-19 06:00:00 | 7.54 |
| 2012-08-19 07:00:00 | 6.24 |
| 2012-08-19 08:00:00 | 7.28 |
| 2012-08-19 09:00:00 | 7.02 |
| 2012-08-19 10:00:00 | 10.4 |
| 2012-08-19 11:00:00 | 9.62 |
| 2012-08-19 12:00:00 | 9.36 |
| 2012-08-19 13:00:00 | 9.1 |
| 2012-08-19 14:00:00 | 9.1 |
| 2012-08-19 15:00:00 | 8.32 |
| 2012-08-19 16:00:00 | 8.58 |
| 2012-08-19 17:00:00 | 9.62 |
| 2012-08-19 18:00:00 | 8.84 |
| 2012-08-19 19:00:00 | 7.54 |
| 2012-08-19 20:00:00 | 8.58 |
| 2012-08-19 21:00:00 | 9.1 |
| 2012-08-19 22:00:00 | 9.1 |
| 2012-08-19 23:00:00 | 8.84 |
| 2012-08-20 | 8.58 |
| 2012-08-20 01:00:00 | 8.84 |
| 2012-08-20 02:00:00 | 6.76 |
| 2012-08-20 03:00:00 | 7.54 |
| 2012-08-20 04:00:00 | 8.06 |
| 2012-08-20 05:00:00 | 8.32 |
| 2012-08-20 06:00:00 | 6.76 |
| 2012-08-20 07:00:00 | 8.32 |
| 2012-08-20 08:00:00 | 10.4 |
| 2012-08-20 09:00:00 | 8.84 |
| 2012-08-20 10:00:00 | 8.84 |
| 2012-08-20 11:00:00 | 12.22 |
| 2012-08-20 12:00:00 | 11.96 |
| 2012-08-20 13:00:00 | 8.84 |
| 2012-08-20 14:00:00 | 10.4 |
| 2012-08-20 15:00:00 | 10.4 |
| 2012-08-20 16:00:00 | 8.84 |
| 2012-08-20 17:00:00 | 10.4 |
| 2012-08-20 18:00:00 | 10.4 |
| 2012-08-20 19:00:00 | 8.84 |
| 2012-08-20 20:00:00 | 10.14 |
| 2012-08-20 21:00:00 | 10.66 |
| 2012-08-20 22:00:00 | 10.92 |
| 2012-08-20 23:00:00 | 10.92 |
| 2012-08-21 | 10.66 |
| 2012-08-21 01:00:00 | 8.06 |
| 2012-08-21 02:00:00 | 8.32 |
| 2012-08-21 03:00:00 | 9.1 |
| 2012-08-21 04:00:00 | 7.54 |
| 2012-08-21 05:00:00 | 6.5 |
| 2012-08-21 06:00:00 | 8.84 |
| 2012-08-21 07:00:00 | 9.1 |
| 2012-08-21 08:00:00 | 8.06 |
| 2012-08-21 09:00:00 | 8.06 |
| 2012-08-21 10:00:00 | 11.96 |
| 2012-08-21 11:00:00 | 8.84 |
| 2012-08-21 12:00:00 | 10.66 |
| 2012-08-21 13:00:00 | 10.4 |
| 2012-08-21 14:00:00 | 8.06 |
| 2012-08-21 15:00:00 | 10.66 |
| 2012-08-21 16:00:00 | 10.66 |
| 2012-08-21 17:00:00 | 9.1 |
| 2012-08-21 18:00:00 | 8.06 |
| 2012-08-21 19:00:00 | 10.4 |
| 2012-08-21 20:00:00 | 10.4 |
| 2012-08-21 21:00:00 | 8.84 |
| 2012-08-21 22:00:00 | 10.66 |
| 2012-08-21 23:00:00 | 10.66 |
| 2012-08-22 | 12.22 |
| 2012-08-22 01:00:00 | 7.8 |
| 2012-08-22 02:00:00 | 8.84 |
| 2012-08-22 03:00:00 | 8.58 |
| 2012-08-22 04:00:00 | 6.76 |
| 2012-08-22 05:00:00 | 7.54 |
| 2012-08-22 06:00:00 | 8.84 |
| 2012-08-22 07:00:00 | 8.58 |
| 2012-08-22 08:00:00 | 8.84 |
| 2012-08-22 09:00:00 | 8.58 |
| 2012-08-22 10:00:00 | 10.66 |
| 2012-08-22 11:00:00 | 10.14 |
| 2012-08-22 12:00:00 | 10.4 |
| 2012-08-22 13:00:00 | 10.4 |
| 2012-08-22 14:00:00 | 10.4 |
| 2012-08-22 15:00:00 | 8.58 |
| 2012-08-22 16:00:00 | 11.96 |
| 2012-08-22 17:00:00 | 8.84 |
| 2012-08-22 18:00:00 | 8.58 |
| 2012-08-22 19:00:00 | 10.4 |
| 2012-08-22 20:00:00 | 8.84 |
| 2012-08-22 21:00:00 | 9.62 |
| 2012-08-22 22:00:00 | 11.44 |
| 2012-08-22 23:00:00 | 12.48 |
| 2012-08-23 | 8.58 |
| 2012-08-23 01:00:00 | 8.06 |
| 2012-08-23 02:00:00 | 8.84 |
| 2012-08-23 03:00:00 | 7.8 |
| 2012-08-23 04:00:00 | 6.5 |
| 2012-08-23 05:00:00 | 8.84 |
| 2012-08-23 06:00:00 | 6.5 |
| 2012-08-23 07:00:00 | 7.8 |
| 2012-08-23 08:00:00 | 8.58 |
| 2012-08-23 09:00:00 | 8.84 |
| 2012-08-23 10:00:00 | 8.84 |
| 2012-08-23 11:00:00 | 10.4 |
| 2012-08-23 12:00:00 | 8.58 |
| 2012-08-23 13:00:00 | 10.4 |
| 2012-08-23 14:00:00 | 10.4 |
| 2012-08-23 15:00:00 | 10.4 |
| 2012-08-23 16:00:00 | 10.4 |
| 2012-08-23 17:00:00 | 8.58 |
| 2012-08-23 18:00:00 | 10.4 |
| 2012-08-23 19:00:00 | 9.1 |
| 2012-08-23 20:00:00 | 8.84 |
| 2012-08-23 21:00:00 | 12.48 |
| 2012-08-23 22:00:00 | 9.1 |
| 2012-08-23 23:00:00 | 10.4 |
| 2012-08-24 | 10.4 |
| 2012-08-24 01:00:00 | 8.84 |
| 2012-08-24 02:00:00 | 7.8 |
| 2012-08-24 03:00:00 | 9.1 |
| 2012-08-24 04:00:00 | 7.54 |
| 2012-08-24 05:00:00 | 6.76 |
| 2012-08-24 06:00:00 | 8.84 |
| 2012-08-24 07:00:00 | 8.58 |
| 2012-08-24 08:00:00 | 8.06 |
| 2012-08-24 09:00:00 | 9.1 |
| 2012-08-24 10:00:00 | 11.44 |
| 2012-08-24 11:00:00 | 8.58 |
| 2012-08-24 12:00:00 | 10.4 |
| 2012-08-24 13:00:00 | 10.66 |
| 2012-08-24 14:00:00 | 8.58 |
| 2012-08-24 15:00:00 | 11.44 |
| 2012-08-24 16:00:00 | 10.92 |
| 2012-08-24 17:00:00 | 10.4 |
| 2012-08-24 18:00:00 | 8.58 |
| 2012-08-24 19:00:00 | 10.4 |
| 2012-08-24 20:00:00 | 8.84 |
| 2012-08-24 21:00:00 | 8.84 |
| 2012-08-24 22:00:00 | 12.22 |
| 2012-08-24 23:00:00 | 15.6 |
| 2012-08-25 | 35.88 |
| 2012-08-25 01:00:00 | 62.14 |
| 2012-08-25 02:00:00 | 22.1 |
| 2012-08-25 03:00:00 | 10.92 |
| 2012-08-25 04:00:00 | 10.4 |
| 2012-08-25 05:00:00 | 8.58 |
| 2012-08-25 06:00:00 | 7.54 |
| 2012-08-25 07:00:00 | 7.28 |
| 2012-08-25 08:00:00 | 9.36 |
| 2012-08-25 09:00:00 | 7.54 |
| 2012-08-25 10:00:00 | 7.8 |
| 2012-08-25 11:00:00 | 9.36 |
| 2012-08-25 12:00:00 | 9.36 |
| 2012-08-25 13:00:00 | 8.58 |
| 2012-08-25 14:00:00 | 10.4 |
| 2012-08-25 15:00:00 | 9.1 |
| 2012-08-25 16:00:00 | 8.58 |
| 2012-08-25 17:00:00 | 8.32 |
| 2012-08-25 18:00:00 | 8.58 |
| 2012-08-25 19:00:00 | 9.36 |
| 2012-08-25 20:00:00 | 8.58 |
| 2012-08-25 21:00:00 | 8.32 |
| 2012-08-25 22:00:00 | 8.58 |
| 2012-08-25 23:00:00 | 9.36 |
| 2012-08-26 | 8.84 |
| 2012-08-26 01:00:00 | 8.58 |
| 2012-08-26 02:00:00 | 7.28 |
| 2012-08-26 03:00:00 | 7.28 |
| 2012-08-26 04:00:00 | 7.54 |
| 2012-08-26 05:00:00 | 6.5 |
| 2012-08-26 06:00:00 | 8.06 |
| 2012-08-26 07:00:00 | 8.32 |
| 2012-08-26 08:00:00 | 14.82 |
| 2012-08-26 09:00:00 | 40.56 |
| 2012-08-26 10:00:00 | 33.28 |
| 2012-08-26 11:00:00 | 20.8 |
| 2012-08-26 12:00:00 | 16.12 |
| 2012-08-26 13:00:00 | 12.22 |
| 2012-08-26 14:00:00 | 11.18 |
| 2012-08-26 15:00:00 | 10.14 |
| 2012-08-26 16:00:00 | 10.4 |
| 2012-08-26 17:00:00 | 10.4 |
| 2012-08-26 18:00:00 | 8.84 |
| 2012-08-26 19:00:00 | 8.84 |
| 2012-08-26 20:00:00 | 9.36 |
| 2012-08-26 21:00:00 | 9.1 |
| 2012-08-26 22:00:00 | 9.62 |
| 2012-08-26 23:00:00 | 9.88 |
| 2012-08-27 | 10.14 |
| 2012-08-27 01:00:00 | 7.8 |
| 2012-08-27 02:00:00 | 6.76 |
| 2012-08-27 03:00:00 | 5.98 |
| 2012-08-27 04:00:00 | 6.76 |
| 2012-08-27 05:00:00 | 7.54 |
| 2012-08-27 06:00:00 | 5.72 |
| 2012-08-27 07:00:00 | 5.98 |
| 2012-08-27 08:00:00 | 8.58 |
| 2012-08-27 09:00:00 | 9.1 |
| 2012-08-27 10:00:00 | 8.32 |
| 2012-08-27 11:00:00 | 9.1 |
| 2012-08-27 12:00:00 | 9.62 |
| 2012-08-27 13:00:00 | 7.54 |
| 2012-08-27 14:00:00 | 10.4 |
| 2012-08-27 15:00:00 | 9.36 |
| 2012-08-27 16:00:00 | 8.32 |
| 2012-08-27 17:00:00 | 8.32 |
| 2012-08-27 18:00:00 | 9.62 |
| 2012-08-27 19:00:00 | 8.06 |
| 2012-08-27 20:00:00 | 8.06 |
| 2012-08-27 21:00:00 | 10.14 |
| 2012-08-27 22:00:00 | 8.32 |
| 2012-08-27 23:00:00 | 9.88 |
| 2012-08-28 | 9.62 |
| 2012-08-28 01:00:00 | 8.06 |
| 2012-08-28 02:00:00 | 6.76 |
| 2012-08-28 03:00:00 | 7.02 |
| 2012-08-28 04:00:00 | 7.02 |
| 2012-08-28 05:00:00 | 5.72 |
| 2012-08-28 06:00:00 | 7.8 |
| 2012-08-28 07:00:00 | 7.28 |
| 2012-08-28 08:00:00 | 6.76 |
| 2012-08-28 09:00:00 | 9.36 |
| 2012-08-28 10:00:00 | 9.1 |
| 2012-08-28 11:00:00 | 8.06 |
| 2012-08-28 12:00:00 | 10.14 |
| 2012-08-28 13:00:00 | 9.88 |
| 2012-08-28 14:00:00 | 7.8 |
| 2012-08-28 15:00:00 | 9.1 |
| 2012-08-28 16:00:00 | 9.62 |
| 2012-08-28 17:00:00 | 9.36 |
| 2012-08-28 18:00:00 | 7.28 |
| 2012-08-28 19:00:00 | 8.84 |
| 2012-08-28 20:00:00 | 9.62 |
| 2012-08-28 21:00:00 | 9.36 |
| 2012-08-28 22:00:00 | 7.8 |
| 2012-08-28 23:00:00 | 10.14 |
| 2012-08-29 | 10.4 |
| 2012-08-29 01:00:00 | 7.8 |
| 2012-08-29 02:00:00 | 7.28 |
| 2012-08-29 03:00:00 | 8.06 |
| 2012-08-29 04:00:00 | 5.46 |
| 2012-08-29 05:00:00 | 6.5 |
| 2012-08-29 06:00:00 | 7.28 |
| 2012-08-29 07:00:00 | 7.54 |
| 2012-08-29 08:00:00 | 6.24 |
| 2012-08-29 09:00:00 | 9.1 |
| 2012-08-29 10:00:00 | 8.84 |
| 2012-08-29 11:00:00 | 7.54 |
| 2012-08-29 12:00:00 | 9.62 |
| 2012-08-29 13:00:00 | 9.1 |
| 2012-08-29 14:00:00 | 8.58 |
| 2012-08-29 15:00:00 | 8.84 |
| 2012-08-29 16:00:00 | 9.62 |
| 2012-08-29 17:00:00 | 9.1 |
| 2012-08-29 18:00:00 | 7.28 |
| 2012-08-29 19:00:00 | 8.84 |
| 2012-08-29 20:00:00 | 9.36 |
| 2012-08-29 21:00:00 | 8.06 |
| 2012-08-29 22:00:00 | 9.62 |
| 2012-08-29 23:00:00 | 10.4 |
| 2012-08-30 | 8.84 |
| 2012-08-30 01:00:00 | 7.54 |
| 2012-08-30 02:00:00 | 7.8 |
| 2012-08-30 03:00:00 | 7.54 |
| 2012-08-30 04:00:00 | 5.46 |
| 2012-08-30 05:00:00 | 7.8 |
| 2012-08-30 06:00:00 | 7.28 |
| 2012-08-30 07:00:00 | 6.24 |
| 2012-08-30 08:00:00 | 8.84 |
| 2012-08-30 09:00:00 | 8.58 |
| 2012-08-30 10:00:00 | 7.54 |
| 2012-08-30 11:00:00 | 10.14 |
| 2012-08-30 12:00:00 | 9.62 |
| 2012-08-30 13:00:00 | 8.84 |
| 2012-08-30 14:00:00 | 9.88 |
| 2012-08-30 15:00:00 | 9.36 |
| 2012-08-30 16:00:00 | 9.36 |
| 2012-08-30 17:00:00 | 7.8 |
| 2012-08-30 18:00:00 | 8.06 |
| 2012-08-30 19:00:00 | 10.4 |
| 2012-08-30 20:00:00 | 7.54 |
| 2012-08-30 21:00:00 | 7.54 |
| 2012-08-30 22:00:00 | 9.88 |
| 2012-08-30 23:00:00 | 9.62 |
| 2012-08-31 | 7.28 |
| 2012-08-31 01:00:00 | 8.06 |
| 2012-08-31 02:00:00 | 8.58 |
| 2012-08-31 03:00:00 | 6.76 |
| 2012-08-31 04:00:00 | 6.5 |
| 2012-08-31 05:00:00 | 7.8 |
| 2012-08-31 06:00:00 | 7.8 |
| 2012-08-31 07:00:00 | 7.8 |
| 2012-08-31 08:00:00 | 8.06 |
| 2012-08-31 09:00:00 | 7.02 |
| 2012-08-31 10:00:00 | 8.58 |
| 2012-08-31 11:00:00 | 9.62 |
| 2012-08-31 12:00:00 | 7.54 |
| 2012-08-31 13:00:00 | 8.32 |
| 2012-08-31 14:00:00 | 9.62 |
| 2012-08-31 15:00:00 | 9.1 |
| 2012-08-31 16:00:00 | 8.84 |
| 2012-08-31 17:00:00 | 8.84 |
| 2012-08-31 18:00:00 | 9.36 |
| 2012-08-31 19:00:00 | 9.36 |
| 2012-08-31 20:00:00 | 8.84 |
| 2012-08-31 21:00:00 | 7.54 |
| 2012-08-31 22:00:00 | 9.62 |
| 2012-08-31 23:00:00 | 10.66 |
| 2012-09-01 | 10.14 |
| 2012-09-01 01:00:00 | 11.18 |
| 2012-09-01 02:00:00 | 12.22 |
| 2012-09-01 03:00:00 | 10.14 |
| 2012-09-01 04:00:00 | 7.54 |
| 2012-09-01 05:00:00 | 8.58 |
| 2012-09-01 06:00:00 | 7.54 |
| 2012-09-01 07:00:00 | 5.98 |
| 2012-09-01 08:00:00 | 8.58 |
| 2012-09-01 09:00:00 | 7.28 |
| 2012-09-01 10:00:00 | 8.06 |
| 2012-09-01 11:00:00 | 11.18 |
| 2012-09-01 12:00:00 | 22.62 |
| 2012-09-01 13:00:00 | 13 |
| 2012-09-01 14:00:00 | 10.14 |
| 2012-09-01 15:00:00 | 11.18 |
| 2012-09-01 16:00:00 | 11.18 |
| 2012-09-01 17:00:00 | 11.44 |
| 2012-09-01 18:00:00 | 8.58 |
| 2012-09-01 19:00:00 | 8.32 |
| 2012-09-01 20:00:00 | 8.06 |
| 2012-09-01 21:00:00 | 10.14 |
| 2012-09-01 22:00:00 | 7.8 |
| 2012-09-01 23:00:00 | 7.28 |
| 2012-09-02 | 7.8 |
| 2012-09-02 01:00:00 | 6.5 |
| 2012-09-02 02:00:00 | 6.76 |
| 2012-09-02 03:00:00 | 6.24 |
| 2012-09-02 04:00:00 | 5.72 |
| 2012-09-02 05:00:00 | 7.54 |
| 2012-09-02 06:00:00 | 5.72 |
| 2012-09-02 07:00:00 | 6.24 |
| 2012-09-02 08:00:00 | 5.72 |
| 2012-09-02 09:00:00 | 7.28 |
| 2012-09-02 10:00:00 | 9.36 |
| 2012-09-02 11:00:00 | 8.58 |
| 2012-09-02 12:00:00 | 7.54 |
| 2012-09-02 13:00:00 | 8.84 |
| 2012-09-02 14:00:00 | 12.48 |
| 2012-09-02 15:00:00 | 9.1 |
| 2012-09-02 16:00:00 | 8.06 |
| 2012-09-02 17:00:00 | 8.06 |
| 2012-09-02 18:00:00 | 9.62 |
| 2012-09-02 19:00:00 | 7.8 |
| 2012-09-02 20:00:00 | 7.54 |
| 2012-09-02 21:00:00 | 9.62 |
| 2012-09-02 22:00:00 | 9.62 |
| 2012-09-02 23:00:00 | 9.1 |
| 2012-09-03 | 7.8 |
| 2012-09-03 01:00:00 | 8.58 |
| 2012-09-03 02:00:00 | 7.8 |
| 2012-09-03 03:00:00 | 7.02 |
| 2012-09-03 04:00:00 | 8.58 |
| 2012-09-03 05:00:00 | 8.58 |
| 2012-09-03 06:00:00 | 6.24 |
| 2012-09-03 07:00:00 | 8.32 |
| 2012-09-03 08:00:00 | 9.62 |
| 2012-09-03 09:00:00 | 9.36 |
| 2012-09-03 10:00:00 | 7.8 |
| 2012-09-03 11:00:00 | 9.62 |
| 2012-09-03 12:00:00 | 9.62 |
| 2012-09-03 13:00:00 | 7.8 |
| 2012-09-03 14:00:00 | 8.58 |
| 2012-09-03 15:00:00 | 9.62 |
| 2012-09-03 16:00:00 | 10.92 |
| 2012-09-03 17:00:00 | 9.62 |
| 2012-09-03 18:00:00 | 8.58 |
| 2012-09-03 19:00:00 | 9.62 |
| 2012-09-03 20:00:00 | 9.62 |
| 2012-09-03 21:00:00 | 9.62 |
| 2012-09-03 22:00:00 | 9.62 |
| 2012-09-03 23:00:00 | 10.92 |
| 2012-09-04 | 9.88 |
| 2012-09-04 01:00:00 | 8.58 |
| 2012-09-04 02:00:00 | 6.5 |
| 2012-09-04 03:00:00 | 6.5 |
| 2012-09-04 04:00:00 | 8.58 |
| 2012-09-04 05:00:00 | 6.5 |
| 2012-09-04 06:00:00 | 6.76 |
| 2012-09-04 07:00:00 | 9.36 |
| 2012-09-04 08:00:00 | 8.58 |
| 2012-09-04 09:00:00 | 8.58 |
| 2012-09-04 10:00:00 | 9.1 |
| 2012-09-04 11:00:00 | 10.92 |
| 2012-09-04 12:00:00 | 9.1 |
| 2012-09-04 13:00:00 | 8.06 |
| 2012-09-04 14:00:00 | 9.88 |
| 2012-09-04 15:00:00 | 9.88 |
| 2012-09-04 16:00:00 | 9.88 |
| 2012-09-04 17:00:00 | 7.8 |
| 2012-09-04 18:00:00 | 9.62 |
| 2012-09-04 19:00:00 | 9.62 |
| 2012-09-04 20:00:00 | 8.84 |
| 2012-09-04 21:00:00 | 9.36 |
| 2012-09-04 22:00:00 | 12.22 |
| 2012-09-04 23:00:00 | 10.66 |
| 2012-09-05 | 9.1 |
| 2012-09-05 01:00:00 | 7.54 |
| 2012-09-05 02:00:00 | 7.02 |
| 2012-09-05 03:00:00 | 9.1 |
| 2012-09-05 04:00:00 | 5.98 |
| 2012-09-05 05:00:00 | 6.5 |
| 2012-09-05 06:00:00 | 7.54 |
| 2012-09-05 07:00:00 | 9.1 |
| 2012-09-05 08:00:00 | 8.32 |
| 2012-09-05 09:00:00 | 8.58 |
| 2012-09-05 10:00:00 | 9.88 |
| 2012-09-05 11:00:00 | 10.4 |
| 2012-09-05 12:00:00 | 9.62 |
| 2012-09-05 13:00:00 | 9.36 |
| 2012-09-05 14:00:00 | 9.36 |
| 2012-09-05 15:00:00 | 9.36 |
| 2012-09-05 16:00:00 | 9.36 |
| 2012-09-05 17:00:00 | 8.32 |
| 2012-09-05 18:00:00 | 9.36 |
| 2012-09-05 19:00:00 | 9.36 |
| 2012-09-05 20:00:00 | 10.92 |
| 2012-09-05 21:00:00 | 9.36 |
| 2012-09-05 22:00:00 | 9.36 |
| 2012-09-05 23:00:00 | 10.92 |
| 2012-09-06 | 10.92 |
| 2012-09-06 01:00:00 | 9.1 |
| 2012-09-06 02:00:00 | 6.24 |
| 2012-09-06 03:00:00 | 8.32 |
| 2012-09-06 04:00:00 | 8.32 |
| 2012-09-06 05:00:00 | 6.76 |
| 2012-09-06 06:00:00 | 6.76 |
| 2012-09-06 07:00:00 | 8.32 |
| 2012-09-06 08:00:00 | 9.36 |
| 2012-09-06 09:00:00 | 9.36 |
| 2012-09-06 10:00:00 | 8.32 |
| 2012-09-06 11:00:00 | 9.1 |
| 2012-09-06 12:00:00 | 9.36 |
| 2012-09-06 13:00:00 | 8.58 |
| 2012-09-06 14:00:00 | 9.62 |
| 2012-09-06 15:00:00 | 9.62 |
| 2012-09-06 16:00:00 | 9.88 |
| 2012-09-06 17:00:00 | 7.8 |
| 2012-09-06 18:00:00 | 10.14 |
| 2012-09-06 19:00:00 | 10.92 |
| 2012-09-06 20:00:00 | 9.62 |
| 2012-09-06 21:00:00 | 8.58 |
| 2012-09-06 22:00:00 | 12.22 |
| 2012-09-06 23:00:00 | 10.92 |
| 2012-09-07 | 8.84 |
| 2012-09-07 01:00:00 | 8.06 |
| 2012-09-07 02:00:00 | 9.62 |
| 2012-09-07 03:00:00 | 7.02 |
| 2012-09-07 04:00:00 | 7.02 |
| 2012-09-07 05:00:00 | 7.8 |
| 2012-09-07 06:00:00 | 6.76 |
| 2012-09-07 07:00:00 | 8.32 |
| 2012-09-07 08:00:00 | 9.62 |
| 2012-09-07 09:00:00 | 9.62 |
| 2012-09-07 10:00:00 | 8.32 |
| 2012-09-07 11:00:00 | 9.1 |
| 2012-09-07 12:00:00 | 9.88 |
| 2012-09-07 13:00:00 | 10.92 |
| 2012-09-07 14:00:00 | 7.8 |
| 2012-09-07 15:00:00 | 9.62 |
| 2012-09-07 16:00:00 | 11.18 |
| 2012-09-07 17:00:00 | 9.88 |
| 2012-09-07 18:00:00 | 7.54 |
| 2012-09-07 19:00:00 | 9.88 |
| 2012-09-07 20:00:00 | 9.62 |
| 2012-09-07 21:00:00 | 9.1 |
| 2012-09-07 22:00:00 | 8.84 |
| 2012-09-07 23:00:00 | 9.62 |
| 2012-09-08 | 11.18 |
| 2012-09-08 01:00:00 | 7.28 |
| 2012-09-08 02:00:00 | 7.8 |
| 2012-09-08 03:00:00 | 8.58 |
| 2012-09-08 04:00:00 | 7.8 |
| 2012-09-08 05:00:00 | 5.72 |
| 2012-09-08 06:00:00 | 8.32 |
| 2012-09-08 07:00:00 | 6.76 |
| 2012-09-08 08:00:00 | 6.5 |
| 2012-09-08 09:00:00 | 6.5 |
| 2012-09-08 10:00:00 | 8.58 |
| 2012-09-08 11:00:00 | 8.32 |
| 2012-09-08 12:00:00 | 10.92 |
| 2012-09-08 13:00:00 | 8.58 |
| 2012-09-08 14:00:00 | 8.58 |
| 2012-09-08 15:00:00 | 9.36 |
| 2012-09-08 16:00:00 | 10.92 |
| 2012-09-08 17:00:00 | 7.8 |
| 2012-09-08 18:00:00 | 8.06 |
| 2012-09-08 19:00:00 | 8.06 |
| 2012-09-08 20:00:00 | 7.8 |
| 2012-09-08 21:00:00 | 9.36 |
| 2012-09-08 22:00:00 | 8.32 |
| 2012-09-08 23:00:00 | 8.58 |
| 2012-09-09 | 7.54 |
| 2012-09-09 01:00:00 | 9.36 |
| 2012-09-09 02:00:00 | 7.02 |
| 2012-09-09 03:00:00 | 5.98 |
| 2012-09-09 04:00:00 | 6.24 |
| 2012-09-09 05:00:00 | 6.5 |
| 2012-09-09 06:00:00 | 5.72 |
| 2012-09-09 07:00:00 | 8.32 |
| 2012-09-09 08:00:00 | 5.72 |
| 2012-09-09 09:00:00 | 7.02 |
| 2012-09-09 10:00:00 | 7.8 |
| 2012-09-09 11:00:00 | 8.84 |
| 2012-09-09 12:00:00 | 9.1 |
| 2012-09-09 13:00:00 | 11.18 |
| 2012-09-09 14:00:00 | 10.66 |
| 2012-09-09 15:00:00 | 9.36 |
| 2012-09-09 16:00:00 | 9.1 |
| 2012-09-09 17:00:00 | 9.1 |
| 2012-09-09 18:00:00 | 9.1 |
| 2012-09-09 19:00:00 | 7.8 |
| 2012-09-09 20:00:00 | 9.1 |
| 2012-09-09 21:00:00 | 10.14 |
| 2012-09-09 22:00:00 | 9.62 |
| 2012-09-09 23:00:00 | 8.84 |
| 2012-09-10 | 10.92 |
| 2012-09-10 01:00:00 | 7.54 |
| 2012-09-10 02:00:00 | 6.24 |
| 2012-09-10 03:00:00 | 5.98 |
| 2012-09-10 04:00:00 | 6.24 |
| 2012-09-10 05:00:00 | 7.28 |
| 2012-09-10 06:00:00 | 5.46 |
| 2012-09-10 07:00:00 | 7.28 |
| 2012-09-10 08:00:00 | 8.06 |
| 2012-09-10 09:00:00 | 8.06 |
| 2012-09-10 10:00:00 | 7.54 |
| 2012-09-10 11:00:00 | 9.88 |
| 2012-09-10 12:00:00 | 9.62 |
| 2012-09-10 13:00:00 | 14.56 |
| 2012-09-10 14:00:00 | 14.3 |
| 2012-09-10 15:00:00 | 9.62 |
| 2012-09-10 16:00:00 | 10.14 |
| 2012-09-10 17:00:00 | 7.8 |
| 2012-09-10 18:00:00 | 8.06 |
| 2012-09-10 19:00:00 | 9.88 |
| 2012-09-10 20:00:00 | 9.36 |
| 2012-09-10 21:00:00 | 7.28 |
| 2012-09-10 22:00:00 | 10.66 |
| 2012-09-10 23:00:00 | 9.88 |
| 2012-09-11 | 9.1 |
| 2012-09-11 01:00:00 | 6.24 |
| 2012-09-11 02:00:00 | 7.28 |
| 2012-09-11 03:00:00 | 8.32 |
| 2012-09-11 04:00:00 | 6.24 |
| 2012-09-11 05:00:00 | 7.02 |
| 2012-09-11 06:00:00 | 8.06 |
| 2012-09-11 07:00:00 | 7.54 |
| 2012-09-11 08:00:00 | 6.76 |
| 2012-09-11 09:00:00 | 10.92 |
| 2012-09-11 10:00:00 | 10.92 |
| 2012-09-11 11:00:00 | 9.1 |
| 2012-09-11 12:00:00 | 10.66 |
| 2012-09-11 13:00:00 | 10.4 |
| 2012-09-11 14:00:00 | 10.92 |
| 2012-09-11 15:00:00 | 11.18 |
| 2012-09-11 16:00:00 | 10.92 |
| 2012-09-11 17:00:00 | 8.32 |
| 2012-09-11 18:00:00 | 10.66 |
| 2012-09-11 19:00:00 | 10.66 |
| 2012-09-11 20:00:00 | 10.4 |
| 2012-09-11 21:00:00 | 9.36 |
| 2012-09-11 22:00:00 | 11.7 |
| 2012-09-11 23:00:00 | 10.92 |
| 2012-09-12 | 9.88 |
| 2012-09-12 01:00:00 | 7.02 |
| 2012-09-12 02:00:00 | 8.84 |
| 2012-09-12 03:00:00 | 8.58 |
| 2012-09-12 04:00:00 | 5.98 |
| 2012-09-12 05:00:00 | 8.32 |
| 2012-09-12 06:00:00 | 8.58 |
| 2012-09-12 07:00:00 | 8.58 |
| 2012-09-12 08:00:00 | 8.06 |
| 2012-09-12 09:00:00 | 9.62 |
| 2012-09-12 10:00:00 | 8.58 |
| 2012-09-12 11:00:00 | 8.06 |
| 2012-09-12 12:00:00 | 9.1 |
| 2012-09-12 13:00:00 | 8.32 |
| 2012-09-12 14:00:00 | 6.76 |
| 2012-09-12 15:00:00 | 8.84 |
| 2012-09-12 16:00:00 | 9.88 |
| 2012-09-12 17:00:00 | 8.58 |
| 2012-09-12 18:00:00 | 6.5 |
| 2012-09-12 19:00:00 | 8.58 |
| 2012-09-12 20:00:00 | 15.08 |
| 2012-09-12 21:00:00 | 57.46 |
| 2012-09-12 22:00:00 | 42.9 |
| 2012-09-12 23:00:00 | 76.96 |
| 2012-09-13 | 108.42 |
| 2012-09-13 01:00:00 | 87.36 |
| 2012-09-13 02:00:00 | 56.68 |
| 2012-09-13 03:00:00 | 108.94 |
| 2012-09-13 04:00:00 | 108.94 |
| 2012-09-13 05:00:00 | 107.38 |
| 2012-09-13 06:00:00 | 106.86 |
| 2012-09-13 07:00:00 | 105.56 |
| 2012-09-13 08:00:00 | 104.52 |
| 2012-09-13 09:00:00 | 103.22 |
| 2012-09-13 10:00:00 | 103.74 |
| 2012-09-13 11:00:00 | 104.26 |
| 2012-09-13 12:00:00 | 103.22 |
| 2012-09-13 13:00:00 | 100.36 |
| 2012-09-13 14:00:00 | 82.68 |
| 2012-09-13 15:00:00 | 90.22 |
| 2012-09-13 16:00:00 | 100.62 |
| 2012-09-13 17:00:00 | 82.68 |
| 2012-09-13 18:00:00 | 61.36 |
| 2012-09-13 19:00:00 | 37.7 |
| 2012-09-13 20:00:00 | 35.1 |
| 2012-09-13 21:00:00 | 31.46 |
| 2012-09-13 22:00:00 | 27.82 |
| 2012-09-13 23:00:00 | 25.22 |
| 2012-09-14 | 24.44 |
| 2012-09-14 01:00:00 | 20.8 |
| 2012-09-14 02:00:00 | 18.46 |
| 2012-09-14 03:00:00 | 19.24 |
| 2012-09-14 04:00:00 | 17.94 |
| 2012-09-14 05:00:00 | 17.68 |
| 2012-09-14 06:00:00 | 11.7 |
| 2012-09-14 07:00:00 | 15.86 |
| 2012-09-14 08:00:00 | 13.26 |
| 2012-09-14 09:00:00 | 13 |
| 2012-09-14 10:00:00 | 14.56 |
| 2012-09-14 11:00:00 | 11.44 |
| 2012-09-14 12:00:00 | 11.44 |
| 2012-09-14 13:00:00 | 11.44 |
| 2012-09-14 14:00:00 | 11.44 |
| 2012-09-14 15:00:00 | 11.96 |
| 2012-09-14 16:00:00 | 15.86 |
| 2012-09-14 17:00:00 | 11.7 |
| 2012-09-14 18:00:00 | 9.88 |
| 2012-09-14 19:00:00 | 11.18 |
| 2012-09-14 20:00:00 | 11.44 |
| 2012-09-14 21:00:00 | 10.14 |
| 2012-09-14 22:00:00 | 11.18 |
| 2012-09-14 23:00:00 | 10.92 |
| 2012-09-15 | 10.4 |
| 2012-09-15 01:00:00 | 10.66 |
| 2012-09-15 02:00:00 | 11.44 |
| 2012-09-15 03:00:00 | 9.36 |
| 2012-09-15 04:00:00 | 7.54 |
| 2012-09-15 05:00:00 | 8.58 |
| 2012-09-15 06:00:00 | 8.84 |
| 2012-09-15 07:00:00 | 6.5 |
| 2012-09-15 08:00:00 | 8.58 |
| 2012-09-15 09:00:00 | 9.1 |
| 2012-09-15 10:00:00 | 8.84 |
| 2012-09-15 11:00:00 | 9.1 |
| 2012-09-15 12:00:00 | 13.52 |
| 2012-09-15 13:00:00 | 19.24 |
| 2012-09-15 14:00:00 | 12.74 |
| 2012-09-15 15:00:00 | 10.92 |
| 2012-09-15 16:00:00 | 8.58 |
| 2012-09-15 17:00:00 | 8.84 |
| 2012-09-15 18:00:00 | 8.06 |
| 2012-09-15 19:00:00 | 7.8 |
| 2012-09-15 20:00:00 | 9.88 |
| 2012-09-15 21:00:00 | 8.84 |
| 2012-09-15 22:00:00 | 9.1 |
| 2012-09-15 23:00:00 | 8.32 |
| 2012-09-16 | 7.8 |
| 2012-09-16 01:00:00 | 7.54 |
| 2012-09-16 02:00:00 | 8.32 |
| 2012-09-16 03:00:00 | 7.54 |
| 2012-09-16 04:00:00 | 6.24 |
| 2012-09-16 05:00:00 | 6.5 |
| 2012-09-16 06:00:00 | 6.5 |
| 2012-09-16 07:00:00 | 5.98 |
| 2012-09-16 08:00:00 | 7.28 |
| 2012-09-16 09:00:00 | 9.1 |
| 2012-09-16 10:00:00 | 7.8 |
| 2012-09-16 11:00:00 | 8.58 |
| 2012-09-16 12:00:00 | 8.58 |
| 2012-09-16 13:00:00 | 9.1 |
| 2012-09-16 14:00:00 | 9.88 |
| 2012-09-16 15:00:00 | 9.88 |
| 2012-09-16 16:00:00 | 8.32 |
| 2012-09-16 17:00:00 | 7.8 |
| 2012-09-16 18:00:00 | 7.8 |
| 2012-09-16 19:00:00 | 8.06 |
| 2012-09-16 20:00:00 | 9.62 |
| 2012-09-16 21:00:00 | 9.1 |
| 2012-09-16 22:00:00 | 9.1 |
| 2012-09-16 23:00:00 | 8.32 |
| 2012-09-17 | 7.8 |
| 2012-09-17 01:00:00 | 7.8 |
| 2012-09-17 02:00:00 | 9.36 |
| 2012-09-17 03:00:00 | 7.02 |
| 2012-09-17 04:00:00 | 6.76 |
| 2012-09-17 05:00:00 | 7.28 |
| 2012-09-17 06:00:00 | 6.24 |
| 2012-09-17 07:00:00 | 9.36 |
| 2012-09-17 08:00:00 | 9.62 |
| 2012-09-17 09:00:00 | 9.36 |
| 2012-09-17 10:00:00 | 10.92 |
| 2012-09-17 11:00:00 | 10.92 |
| 2012-09-17 12:00:00 | 9.36 |
| 2012-09-17 13:00:00 | 13 |
| 2012-09-17 14:00:00 | 18.2 |
| 2012-09-17 15:00:00 | 17.16 |
| 2012-09-17 16:00:00 | 15.34 |
| 2012-09-17 17:00:00 | 13.52 |
| 2012-09-17 18:00:00 | 16.64 |
| 2012-09-17 19:00:00 | 16.64 |
| 2012-09-17 20:00:00 | 15.08 |
| 2012-09-17 21:00:00 | 15.86 |
| 2012-09-17 22:00:00 | 16.64 |
| 2012-09-17 23:00:00 | 16.64 |
| 2012-09-18 | 16.12 |
| 2012-09-18 01:00:00 | 13.78 |
| 2012-09-18 02:00:00 | 13.52 |
| 2012-09-18 03:00:00 | 13.52 |
| 2012-09-18 04:00:00 | 12.48 |
| 2012-09-18 05:00:00 | 10.92 |
| 2012-09-18 06:00:00 | 12.48 |
| 2012-09-18 07:00:00 | 13.52 |
| 2012-09-18 08:00:00 | 14.3 |
| 2012-09-18 09:00:00 | 13.52 |
| 2012-09-18 10:00:00 | 15.6 |
| 2012-09-18 11:00:00 | 14.56 |
| 2012-09-18 12:00:00 | 10.4 |
| 2012-09-18 13:00:00 | 11.18 |
| 2012-09-18 14:00:00 | 10.66 |
| 2012-09-18 15:00:00 | 10.4 |
| 2012-09-18 16:00:00 | 10.4 |
| 2012-09-18 17:00:00 | 10.4 |
| 2012-09-18 18:00:00 | 8.06 |
| 2012-09-18 19:00:00 | 8.84 |
| 2012-09-18 20:00:00 | 10.4 |
| 2012-09-18 21:00:00 | 9.1 |
| 2012-09-18 22:00:00 | 10.66 |
| 2012-09-18 23:00:00 | 11.96 |
| 2012-09-19 | 9.1 |
| 2012-09-19 01:00:00 | 8.06 |
| 2012-09-19 02:00:00 | 8.84 |
| 2012-09-19 03:00:00 | 7.8 |
| 2012-09-19 04:00:00 | 6.5 |
| 2012-09-19 05:00:00 | 8.84 |
| 2012-09-19 06:00:00 | 7.54 |
| 2012-09-19 07:00:00 | 7.8 |
| 2012-09-19 08:00:00 | 8.84 |
| 2012-09-19 09:00:00 | 10.14 |
| 2012-09-19 10:00:00 | 8.58 |
| 2012-09-19 11:00:00 | 10.4 |
| 2012-09-19 12:00:00 | 13.78 |
| 2012-09-19 13:00:00 | 26 |
| 2012-09-19 14:00:00 | 87.36 |
| 2012-09-19 15:00:00 | 93.34 |
| 2012-09-19 16:00:00 | 49.66 |
| 2012-09-19 17:00:00 | 40.3 |
| 2012-09-19 18:00:00 | 18.2 |
| 2012-09-19 19:00:00 | 13.26 |
| 2012-09-19 20:00:00 | 13.78 |
| 2012-09-19 21:00:00 | 13.78 |
| 2012-09-19 22:00:00 | 13.78 |
| 2012-09-19 23:00:00 | 11.44 |
| 2012-09-20 | 11.96 |
| 2012-09-20 01:00:00 | 10.14 |
| 2012-09-20 02:00:00 | 8.58 |
| 2012-09-20 03:00:00 | 9.88 |
| 2012-09-20 04:00:00 | 8.84 |
| 2012-09-20 05:00:00 | 8.32 |
| 2012-09-20 06:00:00 | 7.28 |
| 2012-09-20 07:00:00 | 9.1 |
| 2012-09-20 08:00:00 | 10.14 |
| 2012-09-20 09:00:00 | 10.4 |
| 2012-09-20 10:00:00 | 9.36 |
| 2012-09-20 11:00:00 | 11.18 |
| 2012-09-20 12:00:00 | 11.18 |
| 2012-09-20 13:00:00 | 9.1 |
| 2012-09-20 14:00:00 | 12.48 |
| 2012-09-20 15:00:00 | 14.3 |
| 2012-09-20 16:00:00 | 10.66 |
| 2012-09-20 17:00:00 | 9.36 |
| 2012-09-20 18:00:00 | 9.1 |
| 2012-09-20 19:00:00 | 12.48 |
| 2012-09-20 20:00:00 | 9.1 |
| 2012-09-20 21:00:00 | 10.92 |
| 2012-09-20 22:00:00 | 11.96 |
| 2012-09-20 23:00:00 | 12.48 |
| 2012-09-21 | 12.22 |
| 2012-09-21 01:00:00 | 9.36 |
| 2012-09-21 02:00:00 | 7.28 |
| 2012-09-21 03:00:00 | 9.1 |
| 2012-09-21 04:00:00 | 9.36 |
| 2012-09-21 05:00:00 | 6.76 |
| 2012-09-21 06:00:00 | 9.36 |
| 2012-09-21 07:00:00 | 9.1 |
| 2012-09-21 08:00:00 | 10.66 |
| 2012-09-21 09:00:00 | 8.84 |
| 2012-09-21 10:00:00 | 10.14 |
| 2012-09-21 11:00:00 | 10.14 |
| 2012-09-21 12:00:00 | 10.4 |
| 2012-09-21 13:00:00 | 9.1 |
| 2012-09-21 14:00:00 | 9.1 |
| 2012-09-21 15:00:00 | 10.14 |
| 2012-09-21 16:00:00 | 10.14 |
| 2012-09-21 17:00:00 | 9.36 |
| 2012-09-21 18:00:00 | 9.1 |
| 2012-09-21 19:00:00 | 9.1 |
| 2012-09-21 20:00:00 | 9.1 |
| 2012-09-21 21:00:00 | 10.92 |
| 2012-09-21 22:00:00 | 12.22 |
| 2012-09-21 23:00:00 | 10.92 |
| 2012-09-22 | 9.1 |
| 2012-09-22 01:00:00 | 8.06 |
| 2012-09-22 02:00:00 | 9.1 |
| 2012-09-22 03:00:00 | 8.32 |
| 2012-09-22 04:00:00 | 6.5 |
| 2012-09-22 05:00:00 | 7.8 |
| 2012-09-22 06:00:00 | 8.84 |
| 2012-09-22 07:00:00 | 6.76 |
| 2012-09-22 08:00:00 | 7.8 |
| 2012-09-22 09:00:00 | 8.84 |
| 2012-09-22 10:00:00 | 8.84 |
| 2012-09-22 11:00:00 | 8.84 |
| 2012-09-22 12:00:00 | 9.1 |
| 2012-09-22 13:00:00 | 8.84 |
| 2012-09-22 14:00:00 | 9.1 |
| 2012-09-22 15:00:00 | 10.66 |
| 2012-09-22 16:00:00 | 9.62 |
| 2012-09-22 17:00:00 | 8.32 |
| 2012-09-22 18:00:00 | 8.84 |
| 2012-09-22 19:00:00 | 14.3 |
| 2012-09-22 20:00:00 | 26.78 |
| 2012-09-22 21:00:00 | 17.16 |
| 2012-09-22 22:00:00 | 10.92 |
| 2012-09-22 23:00:00 | 9.1 |
| 2012-09-23 | 8.58 |
| 2012-09-23 01:00:00 | 7.28 |
| 2012-09-23 02:00:00 | 7.28 |
| 2012-09-23 03:00:00 | 7.02 |
| 2012-09-23 04:00:00 | 8.32 |
| 2012-09-23 05:00:00 | 6.76 |
| 2012-09-23 06:00:00 | 5.98 |
| 2012-09-23 07:00:00 | 5.98 |
| 2012-09-23 08:00:00 | 6.76 |
| 2012-09-23 09:00:00 | 7.02 |
| 2012-09-23 10:00:00 | 9.36 |
| 2012-09-23 11:00:00 | 9.36 |
| 2012-09-23 12:00:00 | 9.36 |
| 2012-09-23 13:00:00 | 9.36 |
| 2012-09-23 14:00:00 | 9.1 |
| 2012-09-23 15:00:00 | 9.88 |
| 2012-09-23 16:00:00 | 10.4 |
| 2012-09-23 17:00:00 | 8.32 |
| 2012-09-23 18:00:00 | 9.1 |
| 2012-09-23 19:00:00 | 8.32 |
| 2012-09-23 20:00:00 | 9.1 |
| 2012-09-23 21:00:00 | 9.36 |
| 2012-09-23 22:00:00 | 11.18 |
| 2012-09-23 23:00:00 | 10.66 |
| 2012-09-24 | 8.32 |
| 2012-09-24 01:00:00 | 7.28 |
| 2012-09-24 02:00:00 | 6.5 |
| 2012-09-24 03:00:00 | 7.02 |
| 2012-09-24 04:00:00 | 6.5 |
| 2012-09-24 05:00:00 | 6.5 |
| 2012-09-24 06:00:00 | 5.72 |
| 2012-09-24 07:00:00 | 8.58 |
| 2012-09-24 08:00:00 | 9.1 |
| 2012-09-24 09:00:00 | 8.58 |
| 2012-09-24 10:00:00 | 8.06 |
| 2012-09-24 11:00:00 | 10.14 |
| 2012-09-24 12:00:00 | 8.84 |
| 2012-09-24 13:00:00 | 8.58 |
| 2012-09-24 14:00:00 | 9.62 |
| 2012-09-24 15:00:00 | 9.36 |
| 2012-09-24 16:00:00 | 9.1 |
| 2012-09-24 17:00:00 | 6.76 |
| 2012-09-24 18:00:00 | 8.58 |
| 2012-09-24 19:00:00 | 8.32 |
| 2012-09-24 20:00:00 | 7.28 |
| 2012-09-24 21:00:00 | 8.58 |
| 2012-09-24 22:00:00 | 10.14 |
| 2012-09-24 23:00:00 | 9.62 |
| 2012-09-25 | 7.8 |
| 2012-09-25 01:00:00 | 8.84 |
| 2012-09-25 02:00:00 | 7.28 |
| 2012-09-25 03:00:00 | 5.72 |
| 2012-09-25 04:00:00 | 5.98 |
| 2012-09-25 05:00:00 | 7.02 |
| 2012-09-25 06:00:00 | 5.72 |
| 2012-09-25 07:00:00 | 11.44 |
| 2012-09-25 08:00:00 | 23.4 |
| 2012-09-25 09:00:00 | 21.06 |
| 2012-09-25 10:00:00 | 12.48 |
| 2012-09-25 11:00:00 | 10.92 |
| 2012-09-25 12:00:00 | 11.7 |
| 2012-09-25 13:00:00 | 8.32 |
| 2012-09-25 14:00:00 | 8.06 |
| 2012-09-25 15:00:00 | 9.62 |
| 2012-09-25 16:00:00 | 9.88 |
| 2012-09-25 17:00:00 | 6.76 |
| 2012-09-25 18:00:00 | 8.84 |
| 2012-09-25 19:00:00 | 9.1 |
| 2012-09-25 20:00:00 | 9.1 |
| 2012-09-25 21:00:00 | 8.32 |
| 2012-09-25 22:00:00 | 10.14 |
| 2012-09-25 23:00:00 | 8.32 |
| 2012-09-26 | 8.32 |
| 2012-09-26 01:00:00 | 8.32 |
| 2012-09-26 02:00:00 | 5.46 |
| 2012-09-26 03:00:00 | 7.8 |
| 2012-09-26 04:00:00 | 7.02 |
| 2012-09-26 05:00:00 | 5.2 |
| 2012-09-26 06:00:00 | 7.8 |
| 2012-09-26 07:00:00 | 7.8 |
| 2012-09-26 08:00:00 | 7.8 |
| 2012-09-26 09:00:00 | 7.28 |
| 2012-09-26 10:00:00 | 8.84 |
| 2012-09-26 11:00:00 | 9.1 |
| 2012-09-26 12:00:00 | 6.76 |
| 2012-09-26 13:00:00 | 8.84 |
| 2012-09-26 14:00:00 | 9.36 |
| 2012-09-26 15:00:00 | 8.84 |
| 2012-09-26 16:00:00 | 7.54 |
| 2012-09-26 17:00:00 | 7.8 |
| 2012-09-26 18:00:00 | 8.84 |
| 2012-09-26 19:00:00 | 6.76 |
| 2012-09-26 20:00:00 | 8.58 |
| 2012-09-26 21:00:00 | 9.1 |
| 2012-09-26 22:00:00 | 8.84 |
| 2012-09-26 23:00:00 | 9.1 |
| 2012-09-27 | 8.84 |
| 2012-09-27 01:00:00 | 6.76 |
| 2012-09-27 02:00:00 | 6.24 |
| 2012-09-27 03:00:00 | 7.54 |
| 2012-09-27 04:00:00 | 5.72 |
| 2012-09-27 05:00:00 | 6.24 |
| 2012-09-27 06:00:00 | 7.02 |
| 2012-09-27 07:00:00 | 6.24 |
| 2012-09-27 08:00:00 | 5.98 |
| 2012-09-27 09:00:00 | 7.02 |
| 2012-09-27 10:00:00 | 8.84 |
| 2012-09-27 11:00:00 | 7.28 |
| 2012-09-27 12:00:00 | 7.54 |
| 2012-09-27 13:00:00 | 9.36 |
| 2012-09-27 14:00:00 | 7.54 |
| 2012-09-27 15:00:00 | 7.28 |
| 2012-09-27 16:00:00 | 8.84 |
| 2012-09-27 17:00:00 | 7.54 |
| 2012-09-27 18:00:00 | 7.02 |
| 2012-09-27 19:00:00 | 7.8 |
| 2012-09-27 20:00:00 | 7.54 |
| 2012-09-27 21:00:00 | 7.28 |
| 2012-09-27 22:00:00 | 7.8 |
| 2012-09-27 23:00:00 | 8.84 |
| 2012-09-28 | 7.02 |
| 2012-09-28 01:00:00 | 7.02 |
| 2012-09-28 02:00:00 | 7.54 |
| 2012-09-28 03:00:00 | 6.76 |
| 2012-09-28 04:00:00 | 5.46 |
| 2012-09-28 05:00:00 | 8.06 |
| 2012-09-28 06:00:00 | 5.98 |
| 2012-09-28 07:00:00 | 5.98 |
| 2012-09-28 08:00:00 | 8.06 |
| 2012-09-28 09:00:00 | 5.98 |
| 2012-09-28 10:00:00 | 7.28 |
| 2012-09-28 11:00:00 | 8.84 |
| 2012-09-28 12:00:00 | 8.84 |
| 2012-09-28 13:00:00 | 8.84 |
| 2012-09-28 14:00:00 | 7.54 |
| 2012-09-28 15:00:00 | 8.32 |
| 2012-09-28 16:00:00 | 8.84 |
| 2012-09-28 17:00:00 | 7.28 |
| 2012-09-28 18:00:00 | 6.24 |
| 2012-09-28 19:00:00 | 7.28 |
| 2012-09-28 20:00:00 | 7.02 |
| 2012-09-28 21:00:00 | 8.58 |
| 2012-09-28 22:00:00 | 7.28 |
| 2012-09-28 23:00:00 | 6.24 |
| 2012-09-29 | 8.84 |
| 2012-09-29 01:00:00 | 5.98 |
| 2012-09-29 02:00:00 | 5.98 |
| 2012-09-29 03:00:00 | 6.76 |
| 2012-09-29 04:00:00 | 5.72 |
| 2012-09-29 05:00:00 | 5.2 |
| 2012-09-29 06:00:00 | 4.42 |
| 2012-09-29 07:00:00 | 4.68 |
| 2012-09-29 08:00:00 | 6.76 |
| 2012-09-29 09:00:00 | 6.24 |
| 2012-09-29 10:00:00 | 6.24 |
| 2012-09-29 11:00:00 | 8.06 |
| 2012-09-29 12:00:00 | 8.06 |
| 2012-09-29 13:00:00 | 7.8 |
| 2012-09-29 14:00:00 | 8.32 |
| 2012-09-29 15:00:00 | 9.1 |
| 2012-09-29 16:00:00 | 6.5 |
| 2012-09-29 17:00:00 | 7.28 |
| 2012-09-29 18:00:00 | 5.98 |
| 2012-09-29 19:00:00 | 6.76 |
| 2012-09-29 20:00:00 | 5.98 |
| 2012-09-29 21:00:00 | 7.54 |
| 2012-09-29 22:00:00 | 9.88 |
| 2012-09-29 23:00:00 | 16.64 |
| 2012-09-30 | 70.46 |
| 2012-09-30 01:00:00 | 113.62 |
| 2012-09-30 02:00:00 | 110.5 |
| 2012-09-30 03:00:00 | 53.56 |
| 2012-09-30 04:00:00 | 16.38 |
| 2012-09-30 05:00:00 | 12.48 |
| 2012-09-30 06:00:00 | 9.36 |
| 2012-09-30 07:00:00 | 8.58 |
| 2012-09-30 08:00:00 | 10.14 |
| 2012-09-30 09:00:00 | 7.8 |
| 2012-09-30 10:00:00 | 9.62 |
| 2012-09-30 11:00:00 | 9.1 |
| 2012-09-30 12:00:00 | 10.4 |
| 2012-09-30 13:00:00 | 9.88 |
| 2012-09-30 14:00:00 | 8.58 |
| 2012-09-30 15:00:00 | 9.36 |
| 2012-09-30 16:00:00 | 8.06 |
| 2012-09-30 17:00:00 | 8.06 |
| 2012-09-30 18:00:00 | 7.8 |
| 2012-09-30 19:00:00 | 9.62 |
| 2012-09-30 20:00:00 | 8.32 |
| 2012-09-30 21:00:00 | 9.62 |
| 2012-09-30 22:00:00 | 9.36 |
| 2012-09-30 23:00:00 | 8.58 |
| 2012-10-01 | 7.8 |
| 2012-10-01 01:00:00 | 6.5 |
| 2012-10-01 02:00:00 | 9.1 |
| 2012-10-01 03:00:00 | 7.02 |
| 2012-10-01 04:00:00 | 5.72 |
| 2012-10-01 05:00:00 | 6.5 |
| 2012-10-01 06:00:00 | 5.72 |
| 2012-10-01 07:00:00 | 9.1 |
| 2012-10-01 08:00:00 | 8.32 |
| 2012-10-01 09:00:00 | 8.06 |
| 2012-10-01 10:00:00 | 8.32 |
| 2012-10-01 11:00:00 | 9.88 |
| 2012-10-01 12:00:00 | 8.32 |
| 2012-10-01 13:00:00 | 9.1 |
| 2012-10-01 14:00:00 | 10.66 |
| 2012-10-01 15:00:00 | 8.58 |
| 2012-10-01 16:00:00 | 10.66 |
| 2012-10-01 17:00:00 | 8.84 |
| 2012-10-01 18:00:00 | 7.54 |
| 2012-10-01 19:00:00 | 9.36 |
| 2012-10-01 20:00:00 | 9.1 |
| 2012-10-01 21:00:00 | 9.1 |
| 2012-10-01 22:00:00 | 9.36 |
| 2012-10-01 23:00:00 | 10.4 |
| 2012-10-02 | 8.06 |
| 2012-10-02 01:00:00 | 7.02 |
| 2012-10-02 02:00:00 | 8.84 |
| 2012-10-02 03:00:00 | 6.24 |
| 2012-10-02 04:00:00 | 6.5 |
| 2012-10-02 05:00:00 | 7.8 |
| 2012-10-02 06:00:00 | 8.84 |
| 2012-10-02 07:00:00 | 7.8 |
| 2012-10-02 08:00:00 | 8.58 |
| 2012-10-02 09:00:00 | 10.4 |
| 2012-10-02 10:00:00 | 10.4 |
| 2012-10-02 11:00:00 | 8.84 |
| 2012-10-02 12:00:00 | 10.14 |
| 2012-10-02 13:00:00 | 10.92 |
| 2012-10-02 14:00:00 | 8.84 |
| 2012-10-02 15:00:00 | 10.66 |
| 2012-10-02 16:00:00 | 10.4 |
| 2012-10-02 17:00:00 | 10.14 |
| 2012-10-02 18:00:00 | 8.84 |
| 2012-10-02 19:00:00 | 8.84 |
| 2012-10-02 20:00:00 | 10.4 |
| 2012-10-02 21:00:00 | 10.4 |
| 2012-10-02 22:00:00 | 8.84 |
| 2012-10-02 23:00:00 | 12.22 |
| 2012-10-03 | 10.4 |
| 2012-10-03 01:00:00 | 7.8 |
| 2012-10-03 02:00:00 | 7.8 |
| 2012-10-03 03:00:00 | 8.58 |
| 2012-10-03 04:00:00 | 7.28 |
| 2012-10-03 05:00:00 | 5.72 |
| 2012-10-03 06:00:00 | 8.84 |
| 2012-10-03 07:00:00 | 8.84 |
| 2012-10-03 08:00:00 | 8.58 |
| 2012-10-03 09:00:00 | 8.06 |
| 2012-10-03 10:00:00 | 10.4 |
| 2012-10-03 11:00:00 | 10.14 |
| 2012-10-03 12:00:00 | 9.36 |
| 2012-10-03 13:00:00 | 9.36 |
| 2012-10-03 14:00:00 | 8.84 |
| 2012-10-03 15:00:00 | 8.58 |
| 2012-10-03 16:00:00 | 9.36 |
| 2012-10-03 17:00:00 | 9.36 |
| 2012-10-03 18:00:00 | 8.32 |
| 2012-10-03 19:00:00 | 9.36 |
| 2012-10-03 20:00:00 | 9.36 |
| 2012-10-03 21:00:00 | 8.06 |
| 2012-10-03 22:00:00 | 9.88 |
| 2012-10-03 23:00:00 | 11.44 |
| 2012-10-04 | 9.62 |
| 2012-10-04 01:00:00 | 7.02 |
| 2012-10-04 02:00:00 | 7.54 |
| 2012-10-04 03:00:00 | 8.84 |
| 2012-10-04 04:00:00 | 5.2 |
| 2012-10-04 05:00:00 | 6.24 |
| 2012-10-04 06:00:00 | 8.06 |
| 2012-10-04 07:00:00 | 8.58 |
| 2012-10-04 08:00:00 | 7.8 |
| 2012-10-04 09:00:00 | 7.8 |
| 2012-10-04 10:00:00 | 10.66 |
| 2012-10-04 11:00:00 | 8.84 |
| 2012-10-04 12:00:00 | 8.58 |
| 2012-10-04 13:00:00 | 10.66 |
| 2012-10-04 14:00:00 | 8.84 |
| 2012-10-04 15:00:00 | 8.58 |
| 2012-10-04 16:00:00 | 10.4 |
| 2012-10-04 17:00:00 | 8.84 |
| 2012-10-04 18:00:00 | 8.84 |
| 2012-10-04 19:00:00 | 8.84 |
| 2012-10-04 20:00:00 | 8.84 |
| 2012-10-04 21:00:00 | 10.14 |
| 2012-10-04 22:00:00 | 18.46 |
| 2012-10-04 23:00:00 | 104.78 |
| 2012-10-05 | 111.54 |
| 2012-10-05 01:00:00 | 34.84 |
| 2012-10-05 02:00:00 | 16.12 |
| 2012-10-05 03:00:00 | 11.44 |
| 2012-10-05 04:00:00 | 8.32 |
| 2012-10-05 05:00:00 | 11.18 |
| 2012-10-05 06:00:00 | 8.32 |
| 2012-10-05 07:00:00 | 9.62 |
| 2012-10-05 08:00:00 | 10.4 |
| 2012-10-05 09:00:00 | 11.18 |
| 2012-10-05 10:00:00 | 9.36 |
| 2012-10-05 11:00:00 | 10.92 |
| 2012-10-05 12:00:00 | 10.92 |
| 2012-10-05 13:00:00 | 8.58 |
| 2012-10-05 14:00:00 | 10.92 |
| 2012-10-05 15:00:00 | 10.92 |
| 2012-10-05 16:00:00 | 10.92 |
| 2012-10-05 17:00:00 | 9.62 |
| 2012-10-05 18:00:00 | 8.58 |
| 2012-10-05 19:00:00 | 9.62 |
| 2012-10-05 20:00:00 | 9.62 |
| 2012-10-05 21:00:00 | 8.58 |
| 2012-10-05 22:00:00 | 10.92 |
| 2012-10-05 23:00:00 | 9.62 |
| 2012-10-06 | 8.84 |
| 2012-10-06 01:00:00 | 7.28 |
| 2012-10-06 02:00:00 | 9.36 |
| 2012-10-06 03:00:00 | 8.58 |
| 2012-10-06 04:00:00 | 7.28 |
| 2012-10-06 05:00:00 | 5.72 |
| 2012-10-06 06:00:00 | 7.54 |
| 2012-10-06 07:00:00 | 7.28 |
| 2012-10-06 08:00:00 | 5.98 |
| 2012-10-06 09:00:00 | 7.28 |
| 2012-10-06 10:00:00 | 8.84 |
| 2012-10-06 11:00:00 | 9.62 |
| 2012-10-06 12:00:00 | 9.36 |
| 2012-10-06 13:00:00 | 8.84 |
| 2012-10-06 14:00:00 | 8.58 |
| 2012-10-06 15:00:00 | 8.84 |
| 2012-10-06 16:00:00 | 9.62 |
| 2012-10-06 17:00:00 | 8.58 |
| 2012-10-06 18:00:00 | 7.8 |
| 2012-10-06 19:00:00 | 7.28 |
| 2012-10-06 20:00:00 | 8.58 |
| 2012-10-06 21:00:00 | 9.62 |
| 2012-10-06 22:00:00 | 7.8 |
| 2012-10-06 23:00:00 | 7.8 |
| 2012-10-07 | 7.02 |
| 2012-10-07 01:00:00 | 7.28 |
| 2012-10-07 02:00:00 | 8.06 |
| 2012-10-07 03:00:00 | 5.98 |
| 2012-10-07 04:00:00 | 5.98 |
| 2012-10-07 05:00:00 | 7.28 |
| 2012-10-07 06:00:00 | 8.58 |
| 2012-10-07 07:00:00 | 8.58 |
| 2012-10-07 08:00:00 | 9.62 |
| 2012-10-07 09:00:00 | 9.88 |
| 2012-10-07 10:00:00 | 13 |
| 2012-10-07 11:00:00 | 17.16 |
| 2012-10-07 12:00:00 | 32.76 |
| 2012-10-07 13:00:00 | 69.94 |
| 2012-10-07 14:00:00 | 59.8 |
| 2012-10-07 15:00:00 | 108.42 |
| 2012-10-07 16:00:00 | 111.54 |
| 2012-10-07 17:00:00 | 109.2 |
| 2012-10-07 18:00:00 | 106.34 |
| 2012-10-07 19:00:00 | 104.78 |
| 2012-10-07 20:00:00 | 86.06 |
| 2012-10-07 21:00:00 | 24.18 |
| 2012-10-07 22:00:00 | 20.8 |
| 2012-10-07 23:00:00 | 19.24 |
| 2012-10-08 | 17.42 |
| 2012-10-08 01:00:00 | 16.64 |
| 2012-10-08 02:00:00 | 15.6 |
| 2012-10-08 03:00:00 | 14.04 |
| 2012-10-08 04:00:00 | 11.18 |
| 2012-10-08 05:00:00 | 11.44 |
| 2012-10-08 06:00:00 | 11.18 |
| 2012-10-08 07:00:00 | 12.22 |
| 2012-10-08 08:00:00 | 11.96 |
| 2012-10-08 09:00:00 | 13.52 |
| 2012-10-08 10:00:00 | 13.26 |
| 2012-10-08 11:00:00 | 11.18 |
| 2012-10-08 12:00:00 | 11.44 |
| 2012-10-08 13:00:00 | 13.26 |
| 2012-10-08 14:00:00 | 10.4 |
| 2012-10-08 15:00:00 | 11.44 |
| 2012-10-08 16:00:00 | 11.44 |
| 2012-10-08 17:00:00 | 10.66 |
| 2012-10-08 18:00:00 | 10.4 |
| 2012-10-08 19:00:00 | 11.44 |
| 2012-10-08 20:00:00 | 9.62 |
| 2012-10-08 21:00:00 | 10.92 |
| 2012-10-08 22:00:00 | 11.44 |
| 2012-10-08 23:00:00 | 11.7 |
| 2012-10-09 | 9.62 |
| 2012-10-09 01:00:00 | 8.58 |
| 2012-10-09 02:00:00 | 8.06 |
| 2012-10-09 03:00:00 | 10.4 |
| 2012-10-09 04:00:00 | 7.28 |
| 2012-10-09 05:00:00 | 8.32 |
| 2012-10-09 06:00:00 | 10.92 |
| 2012-10-09 07:00:00 | 8.58 |
| 2012-10-09 08:00:00 | 10.92 |
| 2012-10-09 09:00:00 | 11.96 |
| 2012-10-09 10:00:00 | 12.22 |
| 2012-10-09 11:00:00 | 12.22 |
| 2012-10-09 12:00:00 | 13.26 |
| 2012-10-09 13:00:00 | 12.74 |
| 2012-10-09 14:00:00 | 10.4 |
| 2012-10-09 15:00:00 | 11.7 |
| 2012-10-09 16:00:00 | 11.7 |
| 2012-10-09 17:00:00 | 10.4 |
| 2012-10-09 18:00:00 | 9.1 |
| 2012-10-09 19:00:00 | 11.44 |
| 2012-10-09 20:00:00 | 10.66 |
| 2012-10-09 21:00:00 | 10.92 |
| 2012-10-09 22:00:00 | 11.7 |
| 2012-10-09 23:00:00 | 11.96 |
| 2012-10-10 | 9.1 |
| 2012-10-10 01:00:00 | 8.58 |
| 2012-10-10 02:00:00 | 9.36 |
| 2012-10-10 03:00:00 | 7.28 |
| 2012-10-10 04:00:00 | 7.02 |
| 2012-10-10 05:00:00 | 8.84 |
| 2012-10-10 06:00:00 | 7.02 |
| 2012-10-10 07:00:00 | 8.32 |
| 2012-10-10 08:00:00 | 10.14 |
| 2012-10-10 09:00:00 | 9.1 |
| 2012-10-10 10:00:00 | 10.92 |
| 2012-10-10 11:00:00 | 10.66 |
| 2012-10-10 12:00:00 | 10.14 |
| 2012-10-10 13:00:00 | 8.84 |
| 2012-10-10 14:00:00 | 10.92 |
| 2012-10-10 15:00:00 | 11.7 |
| 2012-10-10 16:00:00 | 11.44 |
| 2012-10-10 17:00:00 | 9.36 |
| 2012-10-10 18:00:00 | 10.92 |
| 2012-10-10 19:00:00 | 10.92 |
| 2012-10-10 20:00:00 | 10.14 |
| 2012-10-10 21:00:00 | 11.96 |
| 2012-10-10 22:00:00 | 11.96 |
| 2012-10-10 23:00:00 | 11.18 |
| 2012-10-11 | 10.4 |
| 2012-10-11 01:00:00 | 10.14 |
| 2012-10-11 02:00:00 | 8.58 |
| 2012-10-11 03:00:00 | 8.58 |
| 2012-10-11 04:00:00 | 7.28 |
| 2012-10-11 05:00:00 | 9.62 |
| 2012-10-11 06:00:00 | 7.54 |
| 2012-10-11 07:00:00 | 9.88 |
| 2012-10-11 08:00:00 | 10.92 |
| 2012-10-11 09:00:00 | 9.36 |
| 2012-10-11 10:00:00 | 10.14 |
| 2012-10-11 11:00:00 | 11.96 |
| 2012-10-11 12:00:00 | 10.14 |
| 2012-10-11 13:00:00 | 9.88 |
| 2012-10-11 14:00:00 | 10.14 |
| 2012-10-11 15:00:00 | 10.14 |
| 2012-10-11 16:00:00 | 8.58 |
| 2012-10-11 17:00:00 | 9.62 |
| 2012-10-11 18:00:00 | 9.1 |
| 2012-10-11 19:00:00 | 7.8 |
| 2012-10-11 20:00:00 | 9.62 |
| 2012-10-11 21:00:00 | 10.92 |
| 2012-10-11 22:00:00 | 9.88 |
| 2012-10-11 23:00:00 | 10.92 |
| 2012-10-12 | 9.62 |
| 2012-10-12 01:00:00 | 8.06 |
| 2012-10-12 02:00:00 | 6.5 |
| 2012-10-12 03:00:00 | 8.06 |
| 2012-10-12 04:00:00 | 6.5 |
| 2012-10-12 05:00:00 | 5.72 |
| 2012-10-12 06:00:00 | 5.98 |
| 2012-10-12 07:00:00 | 8.58 |
| 2012-10-12 08:00:00 | 9.88 |
| 2012-10-12 09:00:00 | 7.8 |
| 2012-10-12 10:00:00 | 7.8 |
| 2012-10-12 11:00:00 | 9.88 |
| 2012-10-12 12:00:00 | 9.36 |
| 2012-10-12 13:00:00 | 8.32 |
| 2012-10-12 14:00:00 | 9.62 |
| 2012-10-12 15:00:00 | 10.66 |
| 2012-10-12 16:00:00 | 9.88 |
| 2012-10-12 17:00:00 | 9.36 |
| 2012-10-12 18:00:00 | 8.32 |
| 2012-10-12 19:00:00 | 8.84 |
| 2012-10-12 20:00:00 | 9.36 |
| 2012-10-12 21:00:00 | 8.32 |
| 2012-10-12 22:00:00 | 9.62 |
| 2012-10-12 23:00:00 | 10.66 |
| 2012-10-13 | 8.32 |
| 2012-10-13 01:00:00 | 12.22 |
| 2012-10-13 02:00:00 | 21.32 |
| 2012-10-13 03:00:00 | 18.2 |
| 2012-10-13 04:00:00 | 17.94 |
| 2012-10-13 05:00:00 | 16.9 |
| 2012-10-13 06:00:00 | 9.36 |
| 2012-10-13 07:00:00 | 7.8 |
| 2012-10-13 08:00:00 | 9.36 |
| 2012-10-13 09:00:00 | 7.8 |
| 2012-10-13 10:00:00 | 8.06 |
| 2012-10-13 11:00:00 | 8.84 |
| 2012-10-13 12:00:00 | 8.84 |
| 2012-10-13 13:00:00 | 8.58 |
| 2012-10-13 14:00:00 | 8.84 |
| 2012-10-13 15:00:00 | 10.4 |
| 2012-10-13 16:00:00 | 8.58 |
| 2012-10-13 17:00:00 | 8.32 |
| 2012-10-13 18:00:00 | 8.06 |
| 2012-10-13 19:00:00 | 8.06 |
| 2012-10-13 20:00:00 | 7.8 |
| 2012-10-13 21:00:00 | 8.84 |
| 2012-10-13 22:00:00 | 9.36 |
| 2012-10-13 23:00:00 | 8.58 |
| 2012-10-14 | 7.8 |
| 2012-10-14 01:00:00 | 6.5 |
| 2012-10-14 02:00:00 | 6.76 |
| 2012-10-14 03:00:00 | 6.5 |
| 2012-10-14 04:00:00 | 6.5 |
| 2012-10-14 05:00:00 | 7.54 |
| 2012-10-14 06:00:00 | 5.72 |
| 2012-10-14 07:00:00 | 6.5 |
| 2012-10-14 08:00:00 | 5.98 |
| 2012-10-14 09:00:00 | 8.06 |
| 2012-10-14 10:00:00 | 7.8 |
| 2012-10-14 11:00:00 | 8.58 |
| 2012-10-14 12:00:00 | 8.58 |
| 2012-10-14 13:00:00 | 9.36 |
| 2012-10-14 14:00:00 | 8.58 |
| 2012-10-14 15:00:00 | 10.92 |
| 2012-10-14 16:00:00 | 8.32 |
| 2012-10-14 17:00:00 | 7.8 |
| 2012-10-14 18:00:00 | 7.54 |
| 2012-10-14 19:00:00 | 8.06 |
| 2012-10-14 20:00:00 | 8.58 |
| 2012-10-14 21:00:00 | 9.36 |
| 2012-10-14 22:00:00 | 9.36 |
| 2012-10-14 23:00:00 | 9.36 |
| 2012-10-15 | 7.8 |
| 2012-10-15 01:00:00 | 7.54 |
| 2012-10-15 02:00:00 | 6.24 |
| 2012-10-15 03:00:00 | 9.36 |
| 2012-10-15 04:00:00 | 7.02 |
| 2012-10-15 05:00:00 | 6.76 |
| 2012-10-15 06:00:00 | 8.84 |
| 2012-10-15 07:00:00 | 8.32 |
| 2012-10-15 08:00:00 | 8.06 |
| 2012-10-15 09:00:00 | 10.4 |
| 2012-10-15 10:00:00 | 9.36 |
| 2012-10-15 11:00:00 | 8.58 |
| 2012-10-15 12:00:00 | 9.36 |
| 2012-10-15 13:00:00 | 10.4 |
| 2012-10-15 14:00:00 | 8.58 |
| 2012-10-15 15:00:00 | 9.36 |
| 2012-10-15 16:00:00 | 10.4 |
| 2012-10-15 17:00:00 | 9.1 |
| 2012-10-15 18:00:00 | 7.8 |
| 2012-10-15 19:00:00 | 10.14 |
| 2012-10-15 20:00:00 | 10.4 |
| 2012-10-15 21:00:00 | 12.22 |
| 2012-10-15 22:00:00 | 21.06 |
| 2012-10-15 23:00:00 | 23.4 |
| 2012-10-16 | 16.12 |
| 2012-10-16 01:00:00 | 10.66 |
| 2012-10-16 02:00:00 | 7.54 |
| 2012-10-16 03:00:00 | 8.84 |
| 2012-10-16 04:00:00 | 8.84 |
| 2012-10-16 05:00:00 | 9.88 |
| 2012-10-16 06:00:00 | 9.88 |
| 2012-10-16 07:00:00 | 15.08 |
| 2012-10-16 08:00:00 | 35.36 |
| 2012-10-16 09:00:00 | 28.86 |
| 2012-10-16 10:00:00 | 16.38 |
| 2012-10-16 11:00:00 | 11.96 |
| 2012-10-16 12:00:00 | 12.74 |
| 2012-10-16 13:00:00 | 38.48 |
| 2012-10-16 14:00:00 | 42.64 |
| 2012-10-16 15:00:00 | 51.22 |
| 2012-10-16 16:00:00 | 106.08 |
| 2012-10-16 17:00:00 | 108.42 |
| 2012-10-16 18:00:00 | 106.86 |
| 2012-10-16 19:00:00 | 105.56 |
| 2012-10-16 20:00:00 | 91.26 |
| 2012-10-16 21:00:00 | 26 |
| 2012-10-16 22:00:00 | 23.14 |
| 2012-10-16 23:00:00 | 20.8 |
| 2012-10-17 | 18.72 |
| 2012-10-17 01:00:00 | 18.46 |
| 2012-10-17 02:00:00 | 17.42 |
| 2012-10-17 03:00:00 | 14.56 |
| 2012-10-17 04:00:00 | 13 |
| 2012-10-17 05:00:00 | 15.08 |
| 2012-10-17 06:00:00 | 14.3 |
| 2012-10-17 07:00:00 | 12.22 |
| 2012-10-17 08:00:00 | 14.3 |
| 2012-10-17 09:00:00 | 16.9 |
| 2012-10-17 10:00:00 | 14.82 |
| 2012-10-17 11:00:00 | 15.34 |
| 2012-10-17 12:00:00 | 16.12 |
| 2012-10-17 13:00:00 | 13.52 |
| 2012-10-17 14:00:00 | 12.74 |
| 2012-10-17 15:00:00 | 13.78 |
| 2012-10-17 16:00:00 | 14.56 |
| 2012-10-17 17:00:00 | 13 |
| 2012-10-17 18:00:00 | 11.44 |
| 2012-10-17 19:00:00 | 12.74 |
| 2012-10-17 20:00:00 | 13 |
| 2012-10-17 21:00:00 | 13 |
| 2012-10-17 22:00:00 | 12.74 |
| 2012-10-17 23:00:00 | 14.56 |
| 2012-10-18 | 13 |
| 2012-10-18 01:00:00 | 11.44 |
| 2012-10-18 02:00:00 | 9.36 |
| 2012-10-18 03:00:00 | 10.14 |
| 2012-10-18 04:00:00 | 9.36 |
| 2012-10-18 05:00:00 | 8.84 |
| 2012-10-18 06:00:00 | 9.36 |
| 2012-10-18 07:00:00 | 11.18 |
| 2012-10-18 08:00:00 | 11.18 |
| 2012-10-18 09:00:00 | 11.18 |
| 2012-10-18 10:00:00 | 11.44 |
| 2012-10-18 11:00:00 | 12.74 |
| 2012-10-18 12:00:00 | 11.18 |
| 2012-10-18 13:00:00 | 11.18 |
| 2012-10-18 14:00:00 | 13 |
| 2012-10-18 15:00:00 | 12.74 |
| 2012-10-18 16:00:00 | 10.4 |
| 2012-10-18 17:00:00 | 10.66 |
| 2012-10-18 18:00:00 | 11.18 |
| 2012-10-18 19:00:00 | 12.48 |
| 2012-10-18 20:00:00 | 10.66 |
| 2012-10-18 21:00:00 | 12.74 |
| 2012-10-18 22:00:00 | 12.74 |
| 2012-10-18 23:00:00 | 13 |
| 2012-10-19 | 10.66 |
| 2012-10-19 01:00:00 | 9.62 |
| 2012-10-19 02:00:00 | 9.88 |
| 2012-10-19 03:00:00 | 9.88 |
| 2012-10-19 04:00:00 | 7.8 |
| 2012-10-19 05:00:00 | 7.8 |
| 2012-10-19 06:00:00 | 10.14 |
| 2012-10-19 07:00:00 | 11.18 |
| 2012-10-19 08:00:00 | 9.1 |
| 2012-10-19 09:00:00 | 10.4 |
| 2012-10-19 10:00:00 | 11.44 |
| 2012-10-19 11:00:00 | 10.92 |
| 2012-10-19 12:00:00 | 11.18 |
| 2012-10-19 13:00:00 | 11.18 |
| 2012-10-19 14:00:00 | 11.44 |
| 2012-10-19 15:00:00 | 10.4 |
| 2012-10-19 16:00:00 | 12.48 |
| 2012-10-19 17:00:00 | 11.18 |
| 2012-10-19 18:00:00 | 10.14 |
| 2012-10-19 19:00:00 | 12.48 |
| 2012-10-19 20:00:00 | 11.18 |
| 2012-10-19 21:00:00 | 10.66 |
| 2012-10-19 22:00:00 | 13.52 |
| 2012-10-19 23:00:00 | 11.7 |
| 2012-10-20 | 11.7 |
| 2012-10-20 01:00:00 | 11.18 |
| 2012-10-20 02:00:00 | 11.18 |
| 2012-10-20 03:00:00 | 9.36 |
| 2012-10-20 04:00:00 | 9.36 |
| 2012-10-20 05:00:00 | 9.1 |
| 2012-10-20 06:00:00 | 8.32 |
| 2012-10-20 07:00:00 | 9.62 |
| 2012-10-20 08:00:00 | 9.36 |
| 2012-10-20 09:00:00 | 9.1 |
| 2012-10-20 10:00:00 | 10.4 |
| 2012-10-20 11:00:00 | 10.92 |
| 2012-10-20 12:00:00 | 11.18 |
| 2012-10-20 13:00:00 | 11.44 |
| 2012-10-20 14:00:00 | 11.44 |
| 2012-10-20 15:00:00 | 13 |
| 2012-10-20 16:00:00 | 10.66 |
| 2012-10-20 17:00:00 | 10.66 |
| 2012-10-20 18:00:00 | 10.4 |
| 2012-10-20 19:00:00 | 9.62 |
| 2012-10-20 20:00:00 | 11.44 |
| 2012-10-20 21:00:00 | 10.66 |
| 2012-10-20 22:00:00 | 10.4 |
| 2012-10-20 23:00:00 | 9.62 |
| 2012-10-21 | 9.36 |
| 2012-10-21 01:00:00 | 9.36 |
| 2012-10-21 02:00:00 | 10.4 |
| 2012-10-21 03:00:00 | 8.06 |
| 2012-10-21 04:00:00 | 7.54 |
| 2012-10-21 05:00:00 | 7.54 |
| 2012-10-21 06:00:00 | 7.02 |
| 2012-10-21 07:00:00 | 7.54 |
| 2012-10-21 08:00:00 | 8.06 |
| 2012-10-21 09:00:00 | 9.88 |
| 2012-10-21 10:00:00 | 9.62 |
| 2012-10-21 11:00:00 | 10.4 |
| 2012-10-21 12:00:00 | 10.66 |
| 2012-10-21 13:00:00 | 11.44 |
| 2012-10-21 14:00:00 | 11.18 |
| 2012-10-21 15:00:00 | 11.44 |
| 2012-10-21 16:00:00 | 10.14 |
| 2012-10-21 17:00:00 | 10.4 |
| 2012-10-21 18:00:00 | 9.1 |
| 2012-10-21 19:00:00 | 10.4 |
| 2012-10-21 20:00:00 | 10.14 |
| 2012-10-21 21:00:00 | 11.7 |
| 2012-10-21 22:00:00 | 11.18 |
| 2012-10-21 23:00:00 | 11.44 |
| 2012-10-22 | 9.88 |
| 2012-10-22 01:00:00 | 8.32 |
| 2012-10-22 02:00:00 | 7.8 |
| 2012-10-22 03:00:00 | 7.28 |
| 2012-10-22 04:00:00 | 7.28 |
| 2012-10-22 05:00:00 | 8.32 |
| 2012-10-22 06:00:00 | 6.76 |
| 2012-10-22 07:00:00 | 6.76 |
| 2012-10-22 08:00:00 | 9.88 |
| 2012-10-22 09:00:00 | 9.88 |
| 2012-10-22 10:00:00 | 8.84 |
| 2012-10-22 11:00:00 | 10.92 |
| 2012-10-22 12:00:00 | 11.18 |
| 2012-10-22 13:00:00 | 8.84 |
| 2012-10-22 14:00:00 | 10.92 |
| 2012-10-22 15:00:00 | 11.18 |
| 2012-10-22 16:00:00 | 9.88 |
| 2012-10-22 17:00:00 | 8.84 |
| 2012-10-22 18:00:00 | 9.36 |
| 2012-10-22 19:00:00 | 10.4 |
| 2012-10-22 20:00:00 | 8.58 |
| 2012-10-22 21:00:00 | 9.88 |
| 2012-10-22 22:00:00 | 11.96 |
| 2012-10-22 23:00:00 | 10.66 |
| 2012-10-23 | 8.84 |
| 2012-10-23 01:00:00 | 8.32 |
| 2012-10-23 02:00:00 | 9.62 |
| 2012-10-23 03:00:00 | 7.28 |
| 2012-10-23 04:00:00 | 6.5 |
| 2012-10-23 05:00:00 | 8.84 |
| 2012-10-23 06:00:00 | 8.58 |
| 2012-10-23 07:00:00 | 8.58 |
| 2012-10-23 08:00:00 | 10.14 |
| 2012-10-23 09:00:00 | 9.88 |
| 2012-10-23 10:00:00 | 9.62 |
| 2012-10-23 11:00:00 | 9.62 |
| 2012-10-23 12:00:00 | 10.14 |
| 2012-10-23 13:00:00 | 10.14 |
| 2012-10-23 14:00:00 | 8.58 |
| 2012-10-23 15:00:00 | 11.96 |
| 2012-10-23 16:00:00 | 11.7 |
| 2012-10-23 17:00:00 | 11.44 |
| 2012-10-23 18:00:00 | 9.1 |
| 2012-10-23 19:00:00 | 10.14 |
| 2012-10-23 20:00:00 | 11.18 |
| 2012-10-23 21:00:00 | 10.14 |
| 2012-10-23 22:00:00 | 10.14 |
| 2012-10-23 23:00:00 | 11.18 |
| 2012-10-24 | 11.18 |
| 2012-10-24 01:00:00 | 7.28 |
| 2012-10-24 02:00:00 | 8.84 |
| 2012-10-24 03:00:00 | 7.28 |
| 2012-10-24 04:00:00 | 7.02 |
| 2012-10-24 05:00:00 | 8.58 |
| 2012-10-24 06:00:00 | 8.32 |
| 2012-10-24 07:00:00 | 7.02 |
| 2012-10-24 08:00:00 | 9.88 |
| 2012-10-24 09:00:00 | 8.84 |
| 2012-10-24 10:00:00 | 8.84 |
| 2012-10-24 11:00:00 | 11.18 |
| 2012-10-24 12:00:00 | 12.22 |
| 2012-10-24 13:00:00 | 10.92 |
| 2012-10-24 14:00:00 | 12.48 |
| 2012-10-24 15:00:00 | 11.7 |
| 2012-10-24 16:00:00 | 12.48 |
| 2012-10-24 17:00:00 | 11.18 |
| 2012-10-24 18:00:00 | 9.36 |
| 2012-10-24 19:00:00 | 11.96 |
| 2012-10-24 20:00:00 | 12.22 |
| 2012-10-24 21:00:00 | 10.4 |
| 2012-10-24 22:00:00 | 12.22 |
| 2012-10-24 23:00:00 | 12.74 |
| 2012-10-25 | 10.92 |
| 2012-10-25 01:00:00 | 15.6 |
| 2012-10-25 02:00:00 | 28.34 |
| 2012-10-25 03:00:00 | 21.06 |
| 2012-10-25 04:00:00 | 11.44 |
| 2012-10-25 05:00:00 | 11.7 |
| 2012-10-25 06:00:00 | 10.92 |
| 2012-10-25 07:00:00 | 9.62 |
| 2012-10-25 08:00:00 | 12.48 |
| 2012-10-25 09:00:00 | 12.74 |
| 2012-10-25 10:00:00 | 10.66 |
| 2012-10-25 11:00:00 | 12.74 |
| 2012-10-25 12:00:00 | 12.74 |
| 2012-10-25 13:00:00 | 10.66 |
| 2012-10-25 14:00:00 | 11.7 |
| 2012-10-25 15:00:00 | 12.74 |
| 2012-10-25 16:00:00 | 11.96 |
| 2012-10-25 17:00:00 | 11.96 |
| 2012-10-25 18:00:00 | 10.66 |
| 2012-10-25 19:00:00 | 10.92 |
| 2012-10-25 20:00:00 | 12.74 |
| 2012-10-25 21:00:00 | 13 |
| 2012-10-25 22:00:00 | 11.7 |
| 2012-10-25 23:00:00 | 12.22 |
| 2012-10-26 | 12.74 |
| 2012-10-26 01:00:00 | 10.4 |
| 2012-10-26 02:00:00 | 9.1 |
| 2012-10-26 03:00:00 | 10.92 |
| 2012-10-26 04:00:00 | 11.18 |
| 2012-10-26 05:00:00 | 11.44 |
| 2012-10-26 06:00:00 | 16.64 |
| 2012-10-26 07:00:00 | 20.02 |
| 2012-10-26 08:00:00 | 14.04 |
| 2012-10-26 09:00:00 | 10.92 |
| 2012-10-26 10:00:00 | 13 |
| 2012-10-26 11:00:00 | 11.7 |
| 2012-10-26 12:00:00 | 10.92 |
| 2012-10-26 13:00:00 | 11.18 |
| 2012-10-26 14:00:00 | 10.92 |
| 2012-10-26 15:00:00 | 10.66 |
| 2012-10-26 16:00:00 | 12.22 |
| 2012-10-26 17:00:00 | 10.4 |
| 2012-10-26 18:00:00 | 9.36 |
| 2012-10-26 19:00:00 | 10.66 |
| 2012-10-26 20:00:00 | 11.96 |
| 2012-10-26 21:00:00 | 11.18 |
| 2012-10-26 22:00:00 | 13.78 |
| 2012-10-26 23:00:00 | 13 |
| 2012-10-27 | 13 |
| 2012-10-27 01:00:00 | 10.66 |
| 2012-10-27 02:00:00 | 12.74 |
| 2012-10-27 03:00:00 | 23.14 |
| 2012-10-27 04:00:00 | 40.82 |
| 2012-10-27 05:00:00 | 83.98 |
| 2012-10-27 06:00:00 | 73.84 |
| 2012-10-27 07:00:00 | 31.72 |
| 2012-10-27 08:00:00 | 68.9 |
| 2012-10-27 09:00:00 | 105.56 |
| 2012-10-27 10:00:00 | 105.56 |
| 2012-10-27 11:00:00 | 105.3 |
| 2012-10-27 12:00:00 | 105.3 |
| 2012-10-27 13:00:00 | 104.78 |
| 2012-10-27 14:00:00 | 49.92 |
| 2012-10-27 15:00:00 | 34.06 |
| 2012-10-27 16:00:00 | 76.96 |
| 2012-10-27 17:00:00 | 104.78 |
| 2012-10-27 18:00:00 | 104 |
| 2012-10-27 19:00:00 | 101.14 |
| 2012-10-27 20:00:00 | 51.22 |
| 2012-10-27 21:00:00 | 37.7 |
| 2012-10-27 22:00:00 | 31.46 |
| 2012-10-27 23:00:00 | 28.34 |
| 2012-10-28 | 26.52 |
| 2012-10-28 01:00:00 | 25.74 |
| 2012-10-28 02:00:00 | 23.92 |
| 2012-10-28 02:00:00 | 22.36 |
| 2012-10-28 03:00:00 | 21.84 |
| 2012-10-28 04:00:00 | 20.8 |
| 2012-10-28 05:00:00 | 20.54 |
| 2012-10-28 06:00:00 | 20.8 |
| 2012-10-28 07:00:00 | 23.14 |
| 2012-10-28 08:00:00 | 21.32 |
| 2012-10-28 09:00:00 | 23.14 |
| 2012-10-28 10:00:00 | 24.18 |
| 2012-10-28 11:00:00 | 23.4 |
| 2012-10-28 12:00:00 | 23.66 |
| 2012-10-28 13:00:00 | 24.7 |
| 2012-10-28 14:00:00 | 23.4 |
| 2012-10-28 15:00:00 | 23.4 |
| 2012-10-28 16:00:00 | 22.62 |
| 2012-10-28 17:00:00 | 22.88 |
| 2012-10-28 18:00:00 | 21.32 |
| 2012-10-28 19:00:00 | 20.54 |
| 2012-10-28 20:00:00 | 20.28 |
| 2012-10-28 21:00:00 | 21.06 |
| 2012-10-28 22:00:00 | 19.5 |
| 2012-10-28 23:00:00 | 19.76 |
| 2012-10-29 | 17.94 |
| 2012-10-29 01:00:00 | 19.5 |
| 2012-10-29 02:00:00 | 18.46 |
| 2012-10-29 03:00:00 | 17.42 |
| 2012-10-29 04:00:00 | 15.86 |
| 2012-10-29 05:00:00 | 15.08 |
| 2012-10-29 06:00:00 | 16.9 |
| 2012-10-29 07:00:00 | 18.72 |
| 2012-10-29 08:00:00 | 17.68 |
| 2012-10-29 09:00:00 | 17.68 |
| 2012-10-29 10:00:00 | 18.72 |
| 2012-10-29 11:00:00 | 20.02 |
| 2012-10-29 12:00:00 | 19.76 |
| 2012-10-29 13:00:00 | 22.88 |
| 2012-10-29 14:00:00 | 20.28 |
| 2012-10-29 15:00:00 | 21.06 |
| 2012-10-29 16:00:00 | 20.02 |
| 2012-10-29 17:00:00 | 17.42 |
| 2012-10-29 18:00:00 | 17.16 |
| 2012-10-29 19:00:00 | 18.98 |
| 2012-10-29 20:00:00 | 19.24 |
| 2012-10-29 21:00:00 | 19.24 |
| 2012-10-29 22:00:00 | 20.02 |
| 2012-10-29 23:00:00 | 21.84 |
| 2012-10-30 | 18.98 |
| 2012-10-30 01:00:00 | 16.9 |
| 2012-10-30 02:00:00 | 16.12 |
| 2012-10-30 03:00:00 | 14.82 |
| 2012-10-30 04:00:00 | 15.6 |
| 2012-10-30 05:00:00 | 16.38 |
| 2012-10-30 06:00:00 | 14.56 |
| 2012-10-30 07:00:00 | 14.56 |
| 2012-10-30 08:00:00 | 18.72 |
| 2012-10-30 09:00:00 | 17.42 |
| 2012-10-30 10:00:00 | 16.38 |
| 2012-10-30 11:00:00 | 17.68 |
| 2012-10-30 12:00:00 | 23.4 |
| 2012-10-30 13:00:00 | 23.92 |
| 2012-10-30 14:00:00 | 23.14 |
| 2012-10-30 15:00:00 | 23.14 |
| 2012-10-30 16:00:00 | 22.62 |
| 2012-10-30 17:00:00 | 20.54 |
| 2012-10-30 18:00:00 | 20.28 |
| 2012-10-30 19:00:00 | 20.54 |
| 2012-10-30 20:00:00 | 20.28 |
| 2012-10-30 21:00:00 | 20.54 |
| 2012-10-30 22:00:00 | 22.1 |
| 2012-10-30 23:00:00 | 21.32 |
| 2012-10-31 | 18.98 |
| 2012-10-31 01:00:00 | 20.54 |
| 2012-10-31 02:00:00 | 21.06 |
| 2012-10-31 03:00:00 | 21.06 |
| 2012-10-31 04:00:00 | 20.28 |
| 2012-10-31 05:00:00 | 19.76 |
| 2012-10-31 06:00:00 | 18.46 |
| 2012-10-31 07:00:00 | 21.58 |
| 2012-10-31 08:00:00 | 20.02 |
| 2012-10-31 09:00:00 | 21.58 |
| 2012-10-31 10:00:00 | 23.14 |
| 2012-10-31 11:00:00 | 23.4 |
| 2012-10-31 12:00:00 | 22.1 |
| 2012-10-31 13:00:00 | 23.92 |
| 2012-10-31 14:00:00 | 22.36 |
| 2012-10-31 15:00:00 | 21.32 |
| 2012-10-31 16:00:00 | 21.06 |
| 2012-10-31 17:00:00 | 19.24 |
| 2012-10-31 18:00:00 | 21.06 |
| 2012-10-31 19:00:00 | 19.24 |
| 2012-10-31 20:00:00 | 18.72 |
| 2012-10-31 21:00:00 | 21.32 |
| 2012-10-31 22:00:00 | 19.24 |
| 2012-10-31 23:00:00 | 18.2 |
| 2012-11-01 | 18.2 |
| 2012-11-01 01:00:00 | 15.86 |
| 2012-11-01 02:00:00 | 15.08 |
| 2012-11-01 03:00:00 | 15.08 |
| 2012-11-01 04:00:00 | 13 |
| 2012-11-01 05:00:00 | 13.78 |
| 2012-11-01 06:00:00 | 16.12 |
| 2012-11-01 07:00:00 | 14.56 |
| 2012-11-01 08:00:00 | 15.86 |
| 2012-11-01 09:00:00 | 19.24 |
| 2012-11-01 10:00:00 | 17.94 |
| 2012-11-01 11:00:00 | 13.52 |
| 2012-11-01 12:00:00 | 17.68 |
| 2012-11-01 13:00:00 | 17.42 |
| 2012-11-01 14:00:00 | 18.46 |
| 2012-11-01 15:00:00 | 23.92 |
| 2012-11-01 16:00:00 | 21.32 |
| 2012-11-01 17:00:00 | 18.72 |
| 2012-11-01 18:00:00 | 14.3 |
| 2012-11-01 19:00:00 | 18.46 |
| 2012-11-01 20:00:00 | 16.12 |
| 2012-11-01 21:00:00 | 16.12 |
| 2012-11-01 22:00:00 | 18.72 |
| 2012-11-01 23:00:00 | 17.16 |
| 2012-11-02 | 15.86 |
| 2012-11-02 01:00:00 | 14.04 |
| 2012-11-02 02:00:00 | 15.08 |
| 2012-11-02 03:00:00 | 13 |
| 2012-11-02 04:00:00 | 11.18 |
| 2012-11-02 05:00:00 | 14.82 |
| 2012-11-02 06:00:00 | 11.18 |
| 2012-11-02 07:00:00 | 14.82 |
| 2012-11-02 08:00:00 | 14.82 |
| 2012-11-02 09:00:00 | 15.08 |
| 2012-11-02 10:00:00 | 14.56 |
| 2012-11-02 11:00:00 | 16.38 |
| 2012-11-02 12:00:00 | 16.64 |
| 2012-11-02 13:00:00 | 14.56 |
| 2012-11-02 14:00:00 | 15.34 |
| 2012-11-02 15:00:00 | 16.38 |
| 2012-11-02 16:00:00 | 17.68 |
| 2012-11-02 17:00:00 | 15.34 |
| 2012-11-02 18:00:00 | 13.52 |
| 2012-11-02 19:00:00 | 17.94 |
| 2012-11-02 20:00:00 | 13.78 |
| 2012-11-02 21:00:00 | 15.86 |
| 2012-11-02 22:00:00 | 15.34 |
| 2012-11-02 23:00:00 | 15.34 |
| 2012-11-03 | 13.52 |
| 2012-11-03 01:00:00 | 15.08 |
| 2012-11-03 02:00:00 | 12.22 |
| 2012-11-03 03:00:00 | 12.48 |
| 2012-11-03 04:00:00 | 13.26 |
| 2012-11-03 05:00:00 | 13.26 |
| 2012-11-03 06:00:00 | 10.92 |
| 2012-11-03 07:00:00 | 11.18 |
| 2012-11-03 08:00:00 | 13.26 |
| 2012-11-03 09:00:00 | 13.26 |
| 2012-11-03 10:00:00 | 13.26 |
| 2012-11-03 11:00:00 | 15.08 |
| 2012-11-03 12:00:00 | 13.52 |
| 2012-11-03 13:00:00 | 15.08 |
| 2012-11-03 14:00:00 | 16.38 |
| 2012-11-03 15:00:00 | 15.86 |
| 2012-11-03 16:00:00 | 13.52 |
| 2012-11-03 17:00:00 | 13.26 |
| 2012-11-03 18:00:00 | 13.52 |
| 2012-11-03 19:00:00 | 13.26 |
| 2012-11-03 20:00:00 | 13.52 |
| 2012-11-03 21:00:00 | 13.52 |
| 2012-11-03 22:00:00 | 15.6 |
| 2012-11-03 23:00:00 | 13.26 |
| 2012-11-04 | 12.48 |
| 2012-11-04 01:00:00 | 12.22 |
| 2012-11-04 02:00:00 | 11.96 |
| 2012-11-04 03:00:00 | 10.92 |
| 2012-11-04 04:00:00 | 10.92 |
| 2012-11-04 05:00:00 | 11.7 |
| 2012-11-04 06:00:00 | 10.92 |
| 2012-11-04 07:00:00 | 10.92 |
| 2012-11-04 08:00:00 | 10.92 |
| 2012-11-04 09:00:00 | 10.92 |
| 2012-11-04 10:00:00 | 12.74 |
| 2012-11-04 11:00:00 | 15.6 |
| 2012-11-04 12:00:00 | 13.52 |
| 2012-11-04 13:00:00 | 13.26 |
| 2012-11-04 14:00:00 | 13.26 |
| 2012-11-04 15:00:00 | 13.26 |
| 2012-11-04 16:00:00 | 13.52 |
| 2012-11-04 17:00:00 | 13.26 |
| 2012-11-04 18:00:00 | 13.26 |
| 2012-11-04 19:00:00 | 15.08 |
| 2012-11-04 20:00:00 | 13.26 |
| 2012-11-04 21:00:00 | 13.52 |
| 2012-11-04 22:00:00 | 15.08 |
| 2012-11-04 23:00:00 | 13.52 |
| 2012-11-05 | 12.48 |
| 2012-11-05 01:00:00 | 12.48 |
| 2012-11-05 02:00:00 | 11.7 |
| 2012-11-05 03:00:00 | 10.4 |
| 2012-11-05 04:00:00 | 13.26 |
| 2012-11-05 05:00:00 | 44.98 |
| 2012-11-05 06:00:00 | 61.1 |
| 2012-11-05 07:00:00 | 24.18 |
| 2012-11-05 08:00:00 | 3.12 |
| 2012-11-05 09:00:00 | 3.12 |
| 2012-11-05 10:00:00 | 3.12 |
| 2012-11-05 11:00:00 | 3.38 |
| 2012-11-05 12:00:00 | 3.12 |
| 2012-11-05 13:00:00 | 3.12 |
| 2012-11-05 14:00:00 | 3.38 |
| 2012-11-05 15:00:00 | 54.34 |
| 2012-11-05 16:00:00 | 47.58 |
| 2012-11-05 17:00:00 | 35.36 |
| 2012-11-05 18:00:00 | 35.36 |
| 2012-11-05 19:00:00 | 32.5 |
| 2012-11-05 20:00:00 | 30.68 |
| 2012-11-05 21:00:00 | 31.46 |
| 2012-11-05 22:00:00 | 29.12 |
| 2012-11-05 23:00:00 | 28.08 |
| 2012-11-06 | 27.04 |
| 2012-11-06 01:00:00 | 24.44 |
| 2012-11-06 02:00:00 | 24.18 |
| 2012-11-06 03:00:00 | 24.44 |
| 2012-11-06 04:00:00 | 22.1 |
| 2012-11-06 05:00:00 | 23.92 |
| 2012-11-06 06:00:00 | 21.84 |
| 2012-11-06 07:00:00 | 21.58 |
| 2012-11-06 08:00:00 | 23.66 |
| 2012-11-06 09:00:00 | 22.88 |
| 2012-11-06 10:00:00 | 23.4 |
| 2012-11-06 11:00:00 | 36.66 |
| 2012-11-06 12:00:00 | 45.24 |
| 2012-11-06 13:00:00 | 43.42 |
| 2012-11-06 14:00:00 | 25.22 |
| 2012-11-06 15:00:00 | 23.66 |
| 2012-11-06 16:00:00 | 23.4 |
| 2012-11-06 17:00:00 | 22.1 |
| 2012-11-06 18:00:00 | 22.88 |
| 2012-11-06 19:00:00 | 24.18 |
| 2012-11-06 20:00:00 | 21.84 |
| 2012-11-06 21:00:00 | 20.54 |
| 2012-11-06 22:00:00 | 22.36 |
| 2012-11-06 23:00:00 | 21.32 |
| 2012-11-07 | 20.28 |
| 2012-11-07 01:00:00 | 19.76 |
| 2012-11-07 02:00:00 | 17.42 |
| 2012-11-07 03:00:00 | 18.46 |
| 2012-11-07 04:00:00 | 19.76 |
| 2012-11-07 05:00:00 | 16.12 |
| 2012-11-07 06:00:00 | 17.94 |
| 2012-11-07 07:00:00 | 20.8 |
| 2012-11-07 08:00:00 | 20.28 |
| 2012-11-07 09:00:00 | 20.02 |
| 2012-11-07 10:00:00 | 20.28 |
| 2012-11-07 11:00:00 | 20.02 |
| 2012-11-07 12:00:00 | 21.06 |
| 2012-11-07 13:00:00 | 21.06 |
| 2012-11-07 14:00:00 | 21.32 |
| 2012-11-07 15:00:00 | 20.54 |
| 2012-11-07 16:00:00 | 20.28 |
| 2012-11-07 17:00:00 | 18.46 |
| 2012-11-07 18:00:00 | 16.64 |
| 2012-11-07 19:00:00 | 20.54 |
| 2012-11-07 20:00:00 | 16.12 |
| 2012-11-07 21:00:00 | 19.76 |
| 2012-11-07 22:00:00 | 22.62 |
| 2012-11-07 23:00:00 | 16.64 |
| 2012-11-08 | 17.42 |
| 2012-11-08 01:00:00 | 18.2 |
| 2012-11-08 02:00:00 | 13.26 |
| 2012-11-08 03:00:00 | 13.52 |
| 2012-11-08 04:00:00 | 13.26 |
| 2012-11-08 05:00:00 | 13.52 |
| 2012-11-08 06:00:00 | 15.6 |
| 2012-11-08 07:00:00 | 13.52 |
| 2012-11-08 08:00:00 | 17.16 |
| 2012-11-08 09:00:00 | 17.94 |
| 2012-11-08 10:00:00 | 16.38 |
| 2012-11-08 11:00:00 | 17.42 |
| 2012-11-08 12:00:00 | 23.66 |
| 2012-11-08 13:00:00 | 15.6 |
| 2012-11-08 14:00:00 | 15.86 |
| 2012-11-08 15:00:00 | 21.06 |
| 2012-11-08 16:00:00 | 16.9 |
| 2012-11-08 17:00:00 | 13.52 |
| 2012-11-08 18:00:00 | 17.16 |
| 2012-11-08 19:00:00 | 16.38 |
| 2012-11-08 20:00:00 | 13.78 |
| 2012-11-08 21:00:00 | 19.76 |
| 2012-11-08 22:00:00 | 16.64 |
| 2012-11-08 23:00:00 | 15.6 |
| 2012-11-09 | 17.42 |
| 2012-11-09 01:00:00 | 13.26 |
| 2012-11-09 02:00:00 | 12.74 |
| 2012-11-09 03:00:00 | 12.48 |
| 2012-11-09 04:00:00 | 13.52 |
| 2012-11-09 05:00:00 | 13.26 |
| 2012-11-09 06:00:00 | 13.52 |
| 2012-11-09 07:00:00 | 13.52 |
| 2012-11-09 08:00:00 | 15.86 |
| 2012-11-09 09:00:00 | 13.52 |
| 2012-11-09 10:00:00 | 13.52 |
| 2012-11-09 11:00:00 | 17.42 |
| 2012-11-09 12:00:00 | 13.52 |
| 2012-11-09 13:00:00 | 13.52 |
| 2012-11-09 14:00:00 | 13.52 |
| 2012-11-09 15:00:00 | 16.9 |
| 2012-11-09 16:00:00 | 15.86 |
| 2012-11-09 17:00:00 | 13.52 |
| 2012-11-09 18:00:00 | 13.52 |
| 2012-11-09 19:00:00 | 17.16 |
| 2012-11-09 20:00:00 | 14.04 |
| 2012-11-09 21:00:00 | 13.52 |
| 2012-11-09 22:00:00 | 16.38 |
| 2012-11-09 23:00:00 | 13.78 |
| 2012-11-10 | 13.52 |
| 2012-11-10 01:00:00 | 13.52 |
| 2012-11-10 02:00:00 | 12.22 |
| 2012-11-10 03:00:00 | 11.96 |
| 2012-11-10 04:00:00 | 13.26 |
| 2012-11-10 05:00:00 | 10.66 |
| 2012-11-10 06:00:00 | 10.92 |
| 2012-11-10 07:00:00 | 11.44 |
| 2012-11-10 08:00:00 | 11.96 |
| 2012-11-10 09:00:00 | 12.74 |
| 2012-11-10 10:00:00 | 15.6 |
| 2012-11-10 11:00:00 | 13.52 |
| 2012-11-10 12:00:00 | 14.04 |
| 2012-11-10 13:00:00 | 14.04 |
| 2012-11-10 14:00:00 | 15.86 |
| 2012-11-10 15:00:00 | 16.12 |
| 2012-11-10 16:00:00 | 14.04 |
| 2012-11-10 17:00:00 | 13.52 |
| 2012-11-10 18:00:00 | 13 |
| 2012-11-10 19:00:00 | 13.26 |
| 2012-11-10 20:00:00 | 13.26 |
| 2012-11-10 21:00:00 | 13.26 |
| 2012-11-10 22:00:00 | 13.26 |
| 2012-11-10 23:00:00 | 13.26 |
| 2012-11-11 | 12.74 |
| 2012-11-11 01:00:00 | 12.22 |
| 2012-11-11 02:00:00 | 10.92 |
| 2012-11-11 03:00:00 | 10.92 |
| 2012-11-11 04:00:00 | 10.14 |
| 2012-11-11 05:00:00 | 10.66 |
| 2012-11-11 06:00:00 | 10.14 |
| 2012-11-11 07:00:00 | 10.66 |
| 2012-11-11 08:00:00 | 11.44 |
| 2012-11-11 09:00:00 | 12.22 |
| 2012-11-11 10:00:00 | 12.22 |
| 2012-11-11 11:00:00 | 13 |
| 2012-11-11 12:00:00 | 13.26 |
| 2012-11-11 13:00:00 | 14.3 |
| 2012-11-11 14:00:00 | 15.86 |
| 2012-11-11 15:00:00 | 13 |
| 2012-11-11 16:00:00 | 12.22 |
| 2012-11-11 17:00:00 | 12.22 |
| 2012-11-11 18:00:00 | 13 |
| 2012-11-11 19:00:00 | 11.96 |
| 2012-11-11 20:00:00 | 13.26 |
| 2012-11-11 21:00:00 | 15.6 |
| 2012-11-11 22:00:00 | 13 |
| 2012-11-11 23:00:00 | 12.22 |
| 2012-11-12 | 11.44 |
| 2012-11-12 01:00:00 | 12.48 |
| 2012-11-12 02:00:00 | 12.22 |
| 2012-11-12 03:00:00 | 11.7 |
| 2012-11-12 04:00:00 | 10.92 |
| 2012-11-12 05:00:00 | 11.7 |
| 2012-11-12 06:00:00 | 13 |
| 2012-11-12 07:00:00 | 11.96 |
| 2012-11-12 08:00:00 | 11.96 |
| 2012-11-12 09:00:00 | 15.08 |
| 2012-11-12 10:00:00 | 17.42 |
| 2012-11-12 11:00:00 | 23.66 |
| 2012-11-12 12:00:00 | 18.2 |
| 2012-11-12 13:00:00 | 20.8 |
| 2012-11-12 14:00:00 | 16.12 |
| 2012-11-12 15:00:00 | 15.86 |
| 2012-11-12 16:00:00 | 15.34 |
| 2012-11-12 17:00:00 | 12.22 |
| 2012-11-12 18:00:00 | 12.22 |
| 2012-11-12 19:00:00 | 13.78 |
| 2012-11-12 20:00:00 | 13 |
| 2012-11-12 21:00:00 | 13.26 |
| 2012-11-12 22:00:00 | 15.6 |
| 2012-11-12 23:00:00 | 14.3 |
| 2012-11-13 | 13 |
| 2012-11-13 01:00:00 | 11.96 |
| 2012-11-13 02:00:00 | 12.22 |
| 2012-11-13 03:00:00 | 11.96 |
| 2012-11-13 04:00:00 | 10.14 |
| 2012-11-13 05:00:00 | 9.88 |
| 2012-11-13 06:00:00 | 11.18 |
| 2012-11-13 07:00:00 | 11.96 |
| 2012-11-13 08:00:00 | 13.26 |
| 2012-11-13 09:00:00 | 11.7 |
| 2012-11-13 10:00:00 | 13 |
| 2012-11-13 11:00:00 | 13.78 |
| 2012-11-13 12:00:00 | 14.3 |
| 2012-11-13 13:00:00 | 12.74 |
| 2012-11-13 14:00:00 | 15.08 |
| 2012-11-13 15:00:00 | 13.78 |
| 2012-11-13 16:00:00 | 13.78 |
| 2012-11-13 17:00:00 | 12.74 |
| 2012-11-13 18:00:00 | 13.52 |
| 2012-11-13 19:00:00 | 13.26 |
| 2012-11-13 20:00:00 | 12.22 |
| 2012-11-13 21:00:00 | 14.82 |
| 2012-11-13 22:00:00 | 16.64 |
| 2012-11-13 23:00:00 | 14.3 |
| 2012-11-14 | 13.52 |
| 2012-11-14 01:00:00 | 12.48 |
| 2012-11-14 02:00:00 | 11.18 |
| 2012-11-14 03:00:00 | 13.26 |
| 2012-11-14 04:00:00 | 10.14 |
| 2012-11-14 05:00:00 | 10.4 |
| 2012-11-14 06:00:00 | 12.74 |
| 2012-11-14 07:00:00 | 11.96 |
| 2012-11-14 08:00:00 | 12.22 |
| 2012-11-14 09:00:00 | 14.3 |
| 2012-11-14 10:00:00 | 12.74 |
| 2012-11-14 11:00:00 | 13.26 |
| 2012-11-14 12:00:00 | 15.86 |
| 2012-11-14 13:00:00 | 13.52 |
| 2012-11-14 14:00:00 | 13.52 |
| 2012-11-14 15:00:00 | 15.34 |
| 2012-11-14 16:00:00 | 13.52 |
| 2012-11-14 17:00:00 | 12.74 |
| 2012-11-14 18:00:00 | 13.52 |
| 2012-11-14 19:00:00 | 12.74 |
| 2012-11-14 20:00:00 | 13 |
| 2012-11-14 21:00:00 | 15.08 |
| 2012-11-14 22:00:00 | 13.78 |
| 2012-11-14 23:00:00 | 15.34 |
| 2012-11-15 | 13.78 |
| 2012-11-15 01:00:00 | 12.48 |
| 2012-11-15 02:00:00 | 14.04 |
| 2012-11-15 03:00:00 | 15.6 |
| 2012-11-15 04:00:00 | 12.74 |
| 2012-11-15 05:00:00 | 14.3 |
| 2012-11-15 06:00:00 | 15.34 |
| 2012-11-15 07:00:00 | 14.82 |
| 2012-11-15 08:00:00 | 15.6 |
| 2012-11-15 09:00:00 | 15.6 |
| 2012-11-15 10:00:00 | 13 |
| 2012-11-15 11:00:00 | 15.08 |
| 2012-11-15 12:00:00 | 13.26 |
| 2012-11-15 13:00:00 | 12.22 |
| 2012-11-15 14:00:00 | 14.82 |
| 2012-11-15 15:00:00 | 13.52 |
| 2012-11-15 16:00:00 | 14.04 |
| 2012-11-15 17:00:00 | 13 |
| 2012-11-15 18:00:00 | 13.78 |
| 2012-11-15 19:00:00 | 14.82 |
| 2012-11-15 20:00:00 | 13.26 |
| 2012-11-15 21:00:00 | 15.08 |
| 2012-11-15 22:00:00 | 14.82 |
| 2012-11-15 23:00:00 | 13.26 |
| 2012-11-16 | 14.82 |
| 2012-11-16 01:00:00 | 10.66 |
| 2012-11-16 02:00:00 | 11.44 |
| 2012-11-16 03:00:00 | 12.74 |
| 2012-11-16 04:00:00 | 14.3 |
| 2012-11-16 05:00:00 | 13.52 |
| 2012-11-16 06:00:00 | 12.22 |
| 2012-11-16 07:00:00 | 12.74 |
| 2012-11-16 08:00:00 | 12.22 |
| 2012-11-16 09:00:00 | 12.48 |
| 2012-11-16 10:00:00 | 13 |
| 2012-11-16 11:00:00 | 13.26 |
| 2012-11-16 12:00:00 | 12.22 |
| 2012-11-16 13:00:00 | 12.22 |
| 2012-11-16 14:00:00 | 13.78 |
| 2012-11-16 15:00:00 | 13.78 |
| 2012-11-16 16:00:00 | 12.22 |
| 2012-11-16 17:00:00 | 13.78 |
| 2012-11-16 18:00:00 | 12.48 |
| 2012-11-16 19:00:00 | 12.22 |
| 2012-11-16 20:00:00 | 14.04 |
| 2012-11-16 21:00:00 | 14.3 |
| 2012-11-16 22:00:00 | 12.48 |
| 2012-11-16 23:00:00 | 16.12 |
| 2012-11-17 | 12.48 |
| 2012-11-17 01:00:00 | 11.44 |
| 2012-11-17 02:00:00 | 11.44 |
| 2012-11-17 03:00:00 | 12.48 |
| 2012-11-17 04:00:00 | 10.4 |
| 2012-11-17 05:00:00 | 10.14 |
| 2012-11-17 06:00:00 | 10.4 |
| 2012-11-17 07:00:00 | 13 |
| 2012-11-17 08:00:00 | 13 |
| 2012-11-17 09:00:00 | 13.52 |
| 2012-11-17 10:00:00 | 12.48 |
| 2012-11-17 11:00:00 | 14.56 |
| 2012-11-17 12:00:00 | 14.3 |
| 2012-11-17 13:00:00 | 14.04 |
| 2012-11-17 14:00:00 | 12.48 |
| 2012-11-17 15:00:00 | 12.74 |
| 2012-11-17 16:00:00 | 12.48 |
| 2012-11-17 17:00:00 | 14.3 |
| 2012-11-17 18:00:00 | 12.48 |
| 2012-11-17 19:00:00 | 11.7 |
| 2012-11-17 20:00:00 | 12.48 |
| 2012-11-17 21:00:00 | 11.96 |
| 2012-11-17 22:00:00 | 12.22 |
| 2012-11-17 23:00:00 | 12.22 |
| 2012-11-18 | 13.52 |
| 2012-11-18 01:00:00 | 10.4 |
| 2012-11-18 02:00:00 | 11.7 |
| 2012-11-18 03:00:00 | 10.66 |
| 2012-11-18 04:00:00 | 9.88 |
| 2012-11-18 05:00:00 | 10.14 |
| 2012-11-18 06:00:00 | 9.62 |
| 2012-11-18 07:00:00 | 11.18 |
| 2012-11-18 08:00:00 | 10.92 |
| 2012-11-18 09:00:00 | 10.66 |
| 2012-11-18 10:00:00 | 11.18 |
| 2012-11-18 11:00:00 | 11.96 |
| 2012-11-18 12:00:00 | 13.52 |
| 2012-11-18 13:00:00 | 13.52 |
| 2012-11-18 14:00:00 | 12.74 |
| 2012-11-18 15:00:00 | 14.56 |
| 2012-11-18 16:00:00 | 13.52 |
| 2012-11-18 17:00:00 | 14.56 |
| 2012-11-18 18:00:00 | 13.78 |
| 2012-11-18 19:00:00 | 13 |
| 2012-11-18 20:00:00 | 13.78 |
| 2012-11-18 21:00:00 | 15.86 |
| 2012-11-18 22:00:00 | 15.08 |
| 2012-11-18 23:00:00 | 15.86 |
| 2012-11-19 | 13.52 |
| 2012-11-19 01:00:00 | 11.7 |
| 2012-11-19 02:00:00 | 10.14 |
| 2012-11-19 03:00:00 | 8.84 |
| 2012-11-19 04:00:00 | 8.84 |
| 2012-11-19 05:00:00 | 9.62 |
| 2012-11-19 06:00:00 | 9.36 |
| 2012-11-19 07:00:00 | 10.92 |
| 2012-11-19 08:00:00 | 9.88 |
| 2012-11-19 09:00:00 | 10.92 |
| 2012-11-19 10:00:00 | 12.22 |
| 2012-11-19 11:00:00 | 13.52 |
| 2012-11-19 12:00:00 | 10.92 |
| 2012-11-19 13:00:00 | 10.92 |
| 2012-11-19 14:00:00 | 11.7 |
| 2012-11-19 15:00:00 | 13 |
| 2012-11-19 16:00:00 | 10.92 |
| 2012-11-19 17:00:00 | 10.14 |
| 2012-11-19 18:00:00 | 12.48 |
| 2012-11-19 19:00:00 | 10.66 |
| 2012-11-19 20:00:00 | 10.66 |
| 2012-11-19 21:00:00 | 12.74 |
| 2012-11-19 22:00:00 | 12.74 |
| 2012-11-19 23:00:00 | 11.18 |
| 2012-11-20 | 13.26 |
| 2012-11-20 01:00:00 | 9.62 |
| 2012-11-20 02:00:00 | 9.62 |
| 2012-11-20 03:00:00 | 8.84 |
| 2012-11-20 04:00:00 | 9.1 |
| 2012-11-20 05:00:00 | 10.14 |
| 2012-11-20 06:00:00 | 8.84 |
| 2012-11-20 07:00:00 | 9.62 |
| 2012-11-20 08:00:00 | 12.22 |
| 2012-11-20 09:00:00 | 10.14 |
| 2012-11-20 10:00:00 | 10.92 |
| 2012-11-20 11:00:00 | 13 |
| 2012-11-20 12:00:00 | 11.44 |
| 2012-11-20 13:00:00 | 10.14 |
| 2012-11-20 14:00:00 | 13 |
| 2012-11-20 15:00:00 | 12.22 |
| 2012-11-20 16:00:00 | 11.44 |
| 2012-11-20 17:00:00 | 10.14 |
| 2012-11-20 18:00:00 | 11.96 |
| 2012-11-20 19:00:00 | 11.18 |
| 2012-11-20 20:00:00 | 10.92 |
| 2012-11-20 21:00:00 | 11.7 |
| 2012-11-20 22:00:00 | 13.26 |
| 2012-11-20 23:00:00 | 13 |
| 2012-11-21 | 10.4 |
| 2012-11-21 01:00:00 | 10.92 |
| 2012-11-21 02:00:00 | 10.14 |
| 2012-11-21 03:00:00 | 8.32 |
| 2012-11-21 04:00:00 | 9.88 |
| 2012-11-21 05:00:00 | 9.36 |
| 2012-11-21 06:00:00 | 8.58 |
| 2012-11-21 07:00:00 | 10.66 |
| 2012-11-21 08:00:00 | 10.66 |
| 2012-11-21 09:00:00 | 10.14 |
| 2012-11-21 10:00:00 | 12.74 |
| 2012-11-21 11:00:00 | 10.14 |
| 2012-11-21 12:00:00 | 11.96 |
| 2012-11-21 13:00:00 | 12.22 |
| 2012-11-21 14:00:00 | 10.14 |
| 2012-11-21 15:00:00 | 12.22 |
| 2012-11-21 16:00:00 | 11.96 |
| 2012-11-21 17:00:00 | 10.4 |
| 2012-11-21 18:00:00 | 11.96 |
| 2012-11-21 19:00:00 | 12.22 |
| 2012-11-21 20:00:00 | 10.4 |
| 2012-11-21 21:00:00 | 12.74 |
| 2012-11-21 22:00:00 | 12.22 |
| 2012-11-21 23:00:00 | 12.22 |
| 2012-11-22 | 13.26 |
| 2012-11-22 01:00:00 | 13.52 |
| 2012-11-22 02:00:00 | 10.14 |
| 2012-11-22 03:00:00 | 11.7 |
| 2012-11-22 04:00:00 | 9.36 |
| 2012-11-22 05:00:00 | 8.58 |
| 2012-11-22 06:00:00 | 10.4 |
| 2012-11-22 07:00:00 | 10.92 |
| 2012-11-22 08:00:00 | 10.14 |
| 2012-11-22 09:00:00 | 12.74 |
| 2012-11-22 10:00:00 | 11.18 |
| 2012-11-22 11:00:00 | 10.92 |
| 2012-11-22 12:00:00 | 13.78 |
| 2012-11-22 13:00:00 | 13.78 |
| 2012-11-22 14:00:00 | 11.7 |
| 2012-11-22 15:00:00 | 13.52 |
| 2012-11-22 16:00:00 | 13 |
| 2012-11-22 17:00:00 | 10.4 |
| 2012-11-22 18:00:00 | 12.74 |
| 2012-11-22 19:00:00 | 10.92 |
| 2012-11-22 20:00:00 | 11.7 |
| 2012-11-22 21:00:00 | 12.48 |
| 2012-11-22 22:00:00 | 12.22 |
| 2012-11-22 23:00:00 | 11.96 |
| 2012-11-23 | 12.48 |
| 2012-11-23 01:00:00 | 10.4 |
| 2012-11-23 02:00:00 | 9.62 |
| 2012-11-23 03:00:00 | 9.62 |
| 2012-11-23 04:00:00 | 10.4 |
| 2012-11-23 05:00:00 | 8.84 |
| 2012-11-23 06:00:00 | 9.62 |
| 2012-11-23 07:00:00 | 10.4 |
| 2012-11-23 08:00:00 | 10.4 |
| 2012-11-23 09:00:00 | 11.44 |
| 2012-11-23 10:00:00 | 12.22 |
| 2012-11-23 11:00:00 | 12.48 |
| 2012-11-23 12:00:00 | 11.96 |
| 2012-11-23 13:00:00 | 12.74 |
| 2012-11-23 14:00:00 | 12.74 |
| 2012-11-23 15:00:00 | 11.96 |
| 2012-11-23 16:00:00 | 13.52 |
| 2012-11-23 17:00:00 | 10.66 |
| 2012-11-23 18:00:00 | 10.92 |
| 2012-11-23 19:00:00 | 13.26 |
| 2012-11-23 20:00:00 | 12.22 |
| 2012-11-23 21:00:00 | 11.44 |
| 2012-11-23 22:00:00 | 13.52 |
| 2012-11-23 23:00:00 | 12.48 |
| 2012-11-24 | 11.18 |
| 2012-11-24 01:00:00 | 10.66 |
| 2012-11-24 02:00:00 | 10.14 |
| 2012-11-24 03:00:00 | 9.1 |
| 2012-11-24 04:00:00 | 10.4 |
| 2012-11-24 05:00:00 | 9.88 |
| 2012-11-24 06:00:00 | 8.84 |
| 2012-11-24 07:00:00 | 9.1 |
| 2012-11-24 08:00:00 | 9.62 |
| 2012-11-24 09:00:00 | 10.4 |
| 2012-11-24 10:00:00 | 11.7 |
| 2012-11-24 11:00:00 | 11.7 |
| 2012-11-24 12:00:00 | 11.7 |
| 2012-11-24 13:00:00 | 13 |
| 2012-11-24 14:00:00 | 13 |
| 2012-11-24 15:00:00 | 11.7 |
| 2012-11-24 16:00:00 | 13.26 |
| 2012-11-24 17:00:00 | 11.7 |
| 2012-11-24 18:00:00 | 10.66 |
| 2012-11-24 19:00:00 | 12.22 |
| 2012-11-24 20:00:00 | 12.48 |
| 2012-11-24 21:00:00 | 10.66 |
| 2012-11-24 22:00:00 | 10.92 |
| 2012-11-24 23:00:00 | 11.7 |
| 2012-11-25 | 11.44 |
| 2012-11-25 01:00:00 | 10.66 |
| 2012-11-25 02:00:00 | 10.14 |
| 2012-11-25 03:00:00 | 9.88 |
| 2012-11-25 04:00:00 | 10.4 |
| 2012-11-25 05:00:00 | 9.36 |
| 2012-11-25 06:00:00 | 8.58 |
| 2012-11-25 07:00:00 | 10.4 |
| 2012-11-25 08:00:00 | 9.88 |
| 2012-11-25 09:00:00 | 9.1 |
| 2012-11-25 10:00:00 | 11.7 |
| 2012-11-25 11:00:00 | 12.22 |
| 2012-11-25 12:00:00 | 11.7 |
| 2012-11-25 13:00:00 | 11.7 |
| 2012-11-25 14:00:00 | 12.48 |
| 2012-11-25 15:00:00 | 12.74 |
| 2012-11-25 16:00:00 | 10.92 |
| 2012-11-25 17:00:00 | 11.18 |
| 2012-11-25 18:00:00 | 13.52 |
| 2012-11-25 19:00:00 | 10.66 |
| 2012-11-25 20:00:00 | 10.92 |
| 2012-11-25 21:00:00 | 12.22 |
| 2012-11-25 22:00:00 | 13 |
| 2012-11-25 23:00:00 | 11.18 |
| 2012-11-26 | 10.4 |
| 2012-11-26 01:00:00 | 13.26 |
| 2012-11-26 02:00:00 | 10.92 |
| 2012-11-26 03:00:00 | 10.66 |
| 2012-11-26 04:00:00 | 10.4 |
| 2012-11-26 05:00:00 | 12.48 |
| 2012-11-26 06:00:00 | 10.14 |
| 2012-11-26 07:00:00 | 10.66 |
| 2012-11-26 08:00:00 | 13.78 |
| 2012-11-26 09:00:00 | 11.7 |
| 2012-11-26 10:00:00 | 12.74 |
| 2012-11-26 11:00:00 | 14.82 |
| 2012-11-26 12:00:00 | 12.48 |
| 2012-11-26 13:00:00 | 12.22 |
| 2012-11-26 14:00:00 | 14.04 |
| 2012-11-26 15:00:00 | 13 |
| 2012-11-26 16:00:00 | 12.22 |
| 2012-11-26 17:00:00 | 13.26 |
| 2012-11-26 18:00:00 | 13 |
| 2012-11-26 19:00:00 | 11.96 |
| 2012-11-26 20:00:00 | 14.04 |
| 2012-11-26 21:00:00 | 12.48 |
| 2012-11-26 22:00:00 | 12.48 |
| 2012-11-26 23:00:00 | 14.3 |
| 2012-11-27 | 14.3 |
| 2012-11-27 01:00:00 | 11.18 |
| 2012-11-27 02:00:00 | 11.96 |
| 2012-11-27 03:00:00 | 12.48 |
| 2012-11-27 04:00:00 | 10.14 |
| 2012-11-27 05:00:00 | 9.88 |
| 2012-11-27 06:00:00 | 11.7 |
| 2012-11-27 07:00:00 | 12.48 |
| 2012-11-27 08:00:00 | 11.44 |
| 2012-11-27 09:00:00 | 11.7 |
| 2012-11-27 10:00:00 | 15.34 |
| 2012-11-27 11:00:00 | 15.6 |
| 2012-11-27 12:00:00 | 13.26 |
| 2012-11-27 13:00:00 | 15.34 |
| 2012-11-27 14:00:00 | 13.26 |
| 2012-11-27 15:00:00 | 14.3 |
| 2012-11-27 16:00:00 | 14.04 |
| 2012-11-27 17:00:00 | 11.7 |
| 2012-11-27 18:00:00 | 13.52 |
| 2012-11-27 19:00:00 | 12.48 |
| 2012-11-27 20:00:00 | 13.78 |
| 2012-11-27 21:00:00 | 14.04 |
| 2012-11-27 22:00:00 | 14.82 |
| 2012-11-27 23:00:00 | 14.3 |
| 2012-11-28 | 13.52 |
| 2012-11-28 01:00:00 | 11.18 |
| 2012-11-28 02:00:00 | 12.22 |
| 2012-11-28 03:00:00 | 10.92 |
| 2012-11-28 04:00:00 | 10.92 |
| 2012-11-28 05:00:00 | 11.96 |
| 2012-11-28 06:00:00 | 9.62 |
| 2012-11-28 07:00:00 | 10.92 |
| 2012-11-28 08:00:00 | 13.52 |
| 2012-11-28 09:00:00 | 12.22 |
| 2012-11-28 10:00:00 | 13.52 |
| 2012-11-28 11:00:00 | 13.26 |
| 2012-11-28 12:00:00 | 13.26 |
| 2012-11-28 13:00:00 | 13.52 |
| 2012-11-28 14:00:00 | 12.74 |
| 2012-11-28 15:00:00 | 13.78 |
| 2012-11-28 16:00:00 | 13.26 |
| 2012-11-28 17:00:00 | 11.7 |
| 2012-11-28 18:00:00 | 13.26 |
| 2012-11-28 19:00:00 | 11.96 |
| 2012-11-28 20:00:00 | 11.7 |
| 2012-11-28 21:00:00 | 15.08 |
| 2012-11-28 22:00:00 | 13.78 |
| 2012-11-28 23:00:00 | 14.04 |
| 2012-11-29 | 13.78 |
| 2012-11-29 01:00:00 | 11.7 |
| 2012-11-29 02:00:00 | 11.7 |
| 2012-11-29 03:00:00 | 10.92 |
| 2012-11-29 04:00:00 | 9.62 |
| 2012-11-29 05:00:00 | 11.96 |
| 2012-11-29 06:00:00 | 11.96 |
| 2012-11-29 07:00:00 | 11.7 |
| 2012-11-29 08:00:00 | 14.04 |
| 2012-11-29 09:00:00 | 16.12 |
| 2012-11-29 10:00:00 | 26.26 |
| 2012-11-29 11:00:00 | 26.78 |
| 2012-11-29 12:00:00 | 21.58 |
| 2012-11-29 13:00:00 | 18.98 |
| 2012-11-29 14:00:00 | 19.76 |
| 2012-11-29 15:00:00 | 21.32 |
| 2012-11-29 16:00:00 | 22.1 |
| 2012-11-29 17:00:00 | 27.04 |
| 2012-11-29 18:00:00 | 27.04 |
| 2012-11-29 19:00:00 | 20.8 |
| 2012-11-29 20:00:00 | 18.2 |
| 2012-11-29 21:00:00 | 21.32 |
| 2012-11-29 22:00:00 | 22.1 |
| 2012-11-29 23:00:00 | 19.5 |
| 2012-11-30 | 18.72 |
| 2012-11-30 01:00:00 | 15.6 |
| 2012-11-30 02:00:00 | 17.42 |
| 2012-11-30 03:00:00 | 16.64 |
| 2012-11-30 04:00:00 | 13.52 |
| 2012-11-30 05:00:00 | 14.04 |
| 2012-11-30 06:00:00 | 15.86 |
| 2012-11-30 07:00:00 | 14.82 |
| 2012-11-30 08:00:00 | 19.24 |
| 2012-11-30 09:00:00 | 16.38 |
| 2012-11-30 10:00:00 | 20.02 |
| 2012-11-30 11:00:00 | 19.76 |
| 2012-11-30 12:00:00 | 16.9 |
| 2012-11-30 13:00:00 | 17.42 |
| 2012-11-30 14:00:00 | 19.76 |
| 2012-11-30 15:00:00 | 19.24 |
| 2012-11-30 16:00:00 | 18.2 |
| 2012-11-30 17:00:00 | 14.56 |
| 2012-11-30 18:00:00 | 18.46 |
| 2012-11-30 19:00:00 | 21.58 |
| 2012-11-30 20:00:00 | 21.58 |
| 2012-11-30 21:00:00 | 18.2 |
| 2012-11-30 22:00:00 | 18.98 |
| 2012-11-30 23:00:00 | 18.72 |
| 2012-12-01 | 16.12 |
| 2012-12-01 01:00:00 | 14.82 |
| 2012-12-01 02:00:00 | 13.26 |
| 2012-12-01 03:00:00 | 12.22 |
| 2012-12-01 04:00:00 | 11.7 |
| 2012-12-01 05:00:00 | 11.7 |
| 2012-12-01 06:00:00 | 12.48 |
| 2012-12-01 07:00:00 | 10.66 |
| 2012-12-01 08:00:00 | 10.4 |
| 2012-12-01 09:00:00 | 11.44 |
| 2012-12-01 10:00:00 | 12.48 |
| 2012-12-01 11:00:00 | 14.56 |
| 2012-12-01 12:00:00 | 14.04 |
| 2012-12-01 13:00:00 | 15.86 |
| 2012-12-01 14:00:00 | 14.04 |
| 2012-12-01 15:00:00 | 13 |
| 2012-12-01 16:00:00 | 12.74 |
| 2012-12-01 17:00:00 | 13 |
| 2012-12-01 18:00:00 | 13.52 |
| 2012-12-01 19:00:00 | 13 |
| 2012-12-01 20:00:00 | 14.3 |
| 2012-12-01 21:00:00 | 14.04 |
| 2012-12-01 22:00:00 | 14.3 |
| 2012-12-01 23:00:00 | 13.26 |
| 2012-12-02 | 14.04 |
| 2012-12-02 01:00:00 | 13.26 |
| 2012-12-02 02:00:00 | 13 |
| 2012-12-02 03:00:00 | 13.52 |
| 2012-12-02 04:00:00 | 12.22 |
| 2012-12-02 05:00:00 | 12.22 |
| 2012-12-02 06:00:00 | 11.7 |
| 2012-12-02 07:00:00 | 11.18 |
| 2012-12-02 08:00:00 | 11.7 |
| 2012-12-02 09:00:00 | 14.04 |
| 2012-12-02 10:00:00 | 14.04 |
| 2012-12-02 11:00:00 | 13.52 |
| 2012-12-02 12:00:00 | 12.22 |
| 2012-12-02 13:00:00 | 11.96 |
| 2012-12-02 14:00:00 | 12.74 |
| 2012-12-02 15:00:00 | 12.74 |
| 2012-12-02 16:00:00 | 11.7 |
| 2012-12-02 17:00:00 | 13.52 |
| 2012-12-02 18:00:00 | 11.96 |
| 2012-12-02 19:00:00 | 11.7 |
| 2012-12-02 20:00:00 | 11.18 |
| 2012-12-02 21:00:00 | 13.26 |
| 2012-12-02 22:00:00 | 13.26 |
| 2012-12-02 23:00:00 | 13 |
| 2012-12-03 | 12.22 |
| 2012-12-03 01:00:00 | 12.22 |
| 2012-12-03 02:00:00 | 10.66 |
| 2012-12-03 03:00:00 | 9.88 |
| 2012-12-03 04:00:00 | 9.88 |
| 2012-12-03 05:00:00 | 9.88 |
| 2012-12-03 06:00:00 | 10.92 |
| 2012-12-03 07:00:00 | 13 |
| 2012-12-03 08:00:00 | 12.22 |
| 2012-12-03 09:00:00 | 12.22 |
| 2012-12-03 10:00:00 | 12.48 |
| 2012-12-03 11:00:00 | 14.04 |
| 2012-12-03 12:00:00 | 11.96 |
| 2012-12-03 13:00:00 | 10.92 |
| 2012-12-03 14:00:00 | 13.26 |
| 2012-12-03 15:00:00 | 13.26 |
| 2012-12-03 16:00:00 | 11.96 |
| 2012-12-03 17:00:00 | 10.92 |
| 2012-12-03 18:00:00 | 13 |
| 2012-12-03 19:00:00 | 12.22 |
| 2012-12-03 20:00:00 | 11.96 |
| 2012-12-03 21:00:00 | 11.96 |
| 2012-12-03 22:00:00 | 14.04 |
| 2012-12-03 23:00:00 | 16.64 |
| 2012-12-04 | 14.3 |
| 2012-12-04 01:00:00 | 14.04 |
| 2012-12-04 02:00:00 | 13.26 |
| 2012-12-04 03:00:00 | 14.82 |
| 2012-12-04 04:00:00 | 13 |
| 2012-12-04 05:00:00 | 10.92 |
| 2012-12-04 06:00:00 | 13 |
| 2012-12-04 07:00:00 | 15.08 |
| 2012-12-04 08:00:00 | 13.78 |
| 2012-12-04 09:00:00 | 16.64 |
| 2012-12-04 10:00:00 | 15.08 |
| 2012-12-04 11:00:00 | 14.04 |
| 2012-12-04 12:00:00 | 15.34 |
| 2012-12-04 13:00:00 | 13.52 |
| 2012-12-04 14:00:00 | 12.48 |
| 2012-12-04 15:00:00 | 15.6 |
| 2012-12-04 16:00:00 | 15.34 |
| 2012-12-04 17:00:00 | 13.52 |
| 2012-12-04 18:00:00 | 12.48 |
| 2012-12-04 19:00:00 | 14.82 |
| 2012-12-04 20:00:00 | 12.74 |
| 2012-12-04 21:00:00 | 14.82 |
| 2012-12-04 22:00:00 | 14.3 |
| 2012-12-04 23:00:00 | 14.56 |
| 2012-12-05 | 13.78 |
| 2012-12-05 01:00:00 | 11.44 |
| 2012-12-05 02:00:00 | 12.74 |
| 2012-12-05 03:00:00 | 10.66 |
| 2012-12-05 04:00:00 | 13 |
| 2012-12-05 05:00:00 | 13.26 |
| 2012-12-05 06:00:00 | 13 |
| 2012-12-05 07:00:00 | 16.12 |
| 2012-12-05 08:00:00 | 14.56 |
| 2012-12-05 09:00:00 | 15.34 |
| 2012-12-05 10:00:00 | 16.12 |
| 2012-12-05 11:00:00 | 13 |
| 2012-12-05 12:00:00 | 15.6 |
| 2012-12-05 13:00:00 | 16.38 |
| 2012-12-05 14:00:00 | 21.32 |
| 2012-12-05 15:00:00 | 22.62 |
| 2012-12-05 16:00:00 | 19.76 |
| 2012-12-05 17:00:00 | 15.6 |
| 2012-12-05 18:00:00 | 15.34 |
| 2012-12-05 19:00:00 | 16.64 |
| 2012-12-05 20:00:00 | 15.6 |
| 2012-12-05 21:00:00 | 16.9 |
| 2012-12-05 22:00:00 | 17.16 |
| 2012-12-05 23:00:00 | 16.38 |
| 2012-12-06 | 17.16 |
| 2012-12-06 01:00:00 | 14.82 |
| 2012-12-06 02:00:00 | 15.08 |
| 2012-12-06 03:00:00 | 14.56 |
| 2012-12-06 04:00:00 | 13.52 |
| 2012-12-06 05:00:00 | 14.04 |
| 2012-12-06 06:00:00 | 13 |
| 2012-12-06 07:00:00 | 15.34 |
| 2012-12-06 08:00:00 | 15.34 |
| 2012-12-06 09:00:00 | 14.82 |
| 2012-12-06 10:00:00 | 16.12 |
| 2012-12-06 11:00:00 | 14.04 |
| 2012-12-06 12:00:00 | 14.04 |
| 2012-12-06 13:00:00 | 13.52 |
| 2012-12-06 14:00:00 | 13.52 |
| 2012-12-06 15:00:00 | 15.34 |
| 2012-12-06 16:00:00 | 14.3 |
| 2012-12-06 17:00:00 | 14.3 |
| 2012-12-06 18:00:00 | 13.52 |
| 2012-12-06 19:00:00 | 16.9 |
| 2012-12-06 20:00:00 | 18.46 |
| 2012-12-06 21:00:00 | 17.16 |
| 2012-12-06 22:00:00 | 15.86 |
| 2012-12-06 23:00:00 | 17.68 |
| 2012-12-07 | 18.46 |
| 2012-12-07 01:00:00 | 14.56 |
| 2012-12-07 02:00:00 | 14.04 |
| 2012-12-07 03:00:00 | 15.08 |
| 2012-12-07 04:00:00 | 13.78 |
| 2012-12-07 05:00:00 | 14.82 |
| 2012-12-07 06:00:00 | 13.52 |
| 2012-12-07 07:00:00 | 15.34 |
| 2012-12-07 08:00:00 | 16.38 |
| 2012-12-07 09:00:00 | 13.26 |
| 2012-12-07 10:00:00 | 17.94 |
| 2012-12-07 11:00:00 | 14.56 |
| 2012-12-07 12:00:00 | 16.38 |
| 2012-12-07 13:00:00 | 16.38 |
| 2012-12-07 14:00:00 | 15.86 |
| 2012-12-07 15:00:00 | 17.16 |
| 2012-12-07 16:00:00 | 17.16 |
| 2012-12-07 17:00:00 | 14.82 |
| 2012-12-07 18:00:00 | 15.08 |
| 2012-12-07 19:00:00 | 16.12 |
| 2012-12-07 20:00:00 | 16.12 |
| 2012-12-07 21:00:00 | 15.08 |
| 2012-12-07 22:00:00 | 13.78 |
| 2012-12-07 23:00:00 | 16.12 |
| 2012-12-08 | 14.82 |
| 2012-12-08 01:00:00 | 13.26 |
| 2012-12-08 02:00:00 | 13 |
| 2012-12-08 03:00:00 | 12.48 |
| 2012-12-08 04:00:00 | 11.96 |
| 2012-12-08 05:00:00 | 11.96 |
| 2012-12-08 06:00:00 | 13.26 |
| 2012-12-08 07:00:00 | 13.26 |
| 2012-12-08 08:00:00 | 12.48 |
| 2012-12-08 09:00:00 | 13 |
| 2012-12-08 10:00:00 | 13.26 |
| 2012-12-08 11:00:00 | 15.08 |
| 2012-12-08 12:00:00 | 14.04 |
| 2012-12-08 13:00:00 | 15.08 |
| 2012-12-08 14:00:00 | 16.12 |
| 2012-12-08 15:00:00 | 17.16 |
| 2012-12-08 16:00:00 | 14.3 |
| 2012-12-08 17:00:00 | 13.78 |
| 2012-12-08 18:00:00 | 14.56 |
| 2012-12-08 19:00:00 | 13.26 |
| 2012-12-08 20:00:00 | 14.56 |
| 2012-12-08 21:00:00 | 13.52 |
| 2012-12-08 22:00:00 | 15.08 |
| 2012-12-08 23:00:00 | 15.34 |
| 2012-12-09 | 13.52 |
| 2012-12-09 01:00:00 | 13.52 |
| 2012-12-09 02:00:00 | 12.74 |
| 2012-12-09 03:00:00 | 12.48 |
| 2012-12-09 04:00:00 | 12.48 |
| 2012-12-09 05:00:00 | 12.22 |
| 2012-12-09 06:00:00 | 14.04 |
| 2012-12-09 07:00:00 | 12.22 |
| 2012-12-09 08:00:00 | 12.48 |
| 2012-12-09 09:00:00 | 13.78 |
| 2012-12-09 10:00:00 | 14.3 |
| 2012-12-09 11:00:00 | 16.9 |
| 2012-12-09 12:00:00 | 17.42 |
| 2012-12-09 13:00:00 | 16.64 |
| 2012-12-09 14:00:00 | 17.42 |
| 2012-12-09 15:00:00 | 16.12 |
| 2012-12-09 16:00:00 | 16.12 |
| 2012-12-09 17:00:00 | 15.86 |
| 2012-12-09 18:00:00 | 15.34 |
| 2012-12-09 19:00:00 | 16.64 |
| 2012-12-09 20:00:00 | 16.12 |
| 2012-12-09 21:00:00 | 16.38 |
| 2012-12-09 22:00:00 | 16.9 |
| 2012-12-09 23:00:00 | 17.16 |
| 2012-12-10 | 16.9 |
| 2012-12-10 01:00:00 | 15.86 |
| 2012-12-10 02:00:00 | 16.12 |
| 2012-12-10 03:00:00 | 15.08 |
| 2012-12-10 04:00:00 | 15.08 |
| 2012-12-10 05:00:00 | 15.08 |
| 2012-12-10 06:00:00 | 14.82 |
| 2012-12-10 07:00:00 | 16.9 |
| 2012-12-10 08:00:00 | 16.9 |
| 2012-12-10 09:00:00 | 16.9 |
| 2012-12-10 10:00:00 | 16.9 |
| 2012-12-10 11:00:00 | 20.02 |
| 2012-12-10 12:00:00 | 17.42 |
| 2012-12-10 13:00:00 | 17.16 |
| 2012-12-10 14:00:00 | 17.68 |
| 2012-12-10 15:00:00 | 20.28 |
| 2012-12-10 16:00:00 | 17.16 |
| 2012-12-10 17:00:00 | 16.38 |
| 2012-12-10 18:00:00 | 16.64 |
| 2012-12-10 19:00:00 | 16.64 |
| 2012-12-10 20:00:00 | 15.6 |
| 2012-12-10 21:00:00 | 15.6 |
| 2012-12-10 22:00:00 | 16.64 |
| 2012-12-10 23:00:00 | 17.94 |
| 2012-12-11 | 16.38 |
| 2012-12-11 01:00:00 | 15.08 |
| 2012-12-11 02:00:00 | 13.78 |
| 2012-12-11 03:00:00 | 16.12 |
| 2012-12-11 04:00:00 | 13.26 |
| 2012-12-11 05:00:00 | 13.78 |
| 2012-12-11 06:00:00 | 13.78 |
| 2012-12-11 07:00:00 | 15.6 |
| 2012-12-11 08:00:00 | 16.38 |
| 2012-12-11 09:00:00 | 14.82 |
| 2012-12-11 10:00:00 | 16.12 |
| 2012-12-11 11:00:00 | 16.9 |
| 2012-12-11 12:00:00 | 17.68 |
| 2012-12-11 13:00:00 | 15.6 |
| 2012-12-11 14:00:00 | 17.16 |
| 2012-12-11 15:00:00 | 17.16 |
| 2012-12-11 16:00:00 | 16.9 |
| 2012-12-11 17:00:00 | 14.04 |
| 2012-12-11 18:00:00 | 16.64 |
| 2012-12-11 19:00:00 | 16.64 |
| 2012-12-11 20:00:00 | 15.34 |
| 2012-12-11 21:00:00 | 16.9 |
| 2012-12-11 22:00:00 | 17.42 |
| 2012-12-11 23:00:00 | 17.42 |
| 2012-12-12 | 15.86 |
| 2012-12-12 01:00:00 | 14.3 |
| 2012-12-12 02:00:00 | 16.12 |
| 2012-12-12 03:00:00 | 14.82 |
| 2012-12-12 04:00:00 | 13.26 |
| 2012-12-12 05:00:00 | 14.56 |
| 2012-12-12 06:00:00 | 16.64 |
| 2012-12-12 07:00:00 | 16.64 |
| 2012-12-12 08:00:00 | 15.6 |
| 2012-12-12 09:00:00 | 18.2 |
| 2012-12-12 10:00:00 | 17.94 |
| 2012-12-12 11:00:00 | 16.9 |
| 2012-12-12 12:00:00 | 20.02 |
| 2012-12-12 13:00:00 | 18.2 |
| 2012-12-12 14:00:00 | 16.12 |
| 2012-12-12 15:00:00 | 16.38 |
| 2012-12-12 16:00:00 | 18.46 |
| 2012-12-12 17:00:00 | 16.9 |
| 2012-12-12 18:00:00 | 15.08 |
| 2012-12-12 19:00:00 | 17.16 |
| 2012-12-12 20:00:00 | 17.16 |
| 2012-12-12 21:00:00 | 16.12 |
| 2012-12-12 22:00:00 | 17.68 |
| 2012-12-12 23:00:00 | 17.42 |
| 2012-12-13 | 16.38 |
| 2012-12-13 01:00:00 | 15.86 |
| 2012-12-13 02:00:00 | 15.34 |
| 2012-12-13 03:00:00 | 13.26 |
| 2012-12-13 04:00:00 | 13.78 |
| 2012-12-13 05:00:00 | 15.08 |
| 2012-12-13 06:00:00 | 12.74 |
| 2012-12-13 07:00:00 | 15.6 |
| 2012-12-13 08:00:00 | 16.38 |
| 2012-12-13 09:00:00 | 14.04 |
| 2012-12-13 10:00:00 | 16.12 |
| 2012-12-13 11:00:00 | 17.16 |
| 2012-12-13 12:00:00 | 15.86 |
| 2012-12-13 13:00:00 | 17.16 |
| 2012-12-13 14:00:00 | 17.42 |
| 2012-12-13 15:00:00 | 17.42 |
| 2012-12-13 16:00:00 | 17.42 |
| 2012-12-13 17:00:00 | 16.12 |
| 2012-12-13 18:00:00 | 15.08 |
| 2012-12-13 19:00:00 | 16.9 |
| 2012-12-13 20:00:00 | 16.12 |
| 2012-12-13 21:00:00 | 16.64 |
| 2012-12-13 22:00:00 | 17.42 |
| 2012-12-13 23:00:00 | 17.94 |
| 2012-12-14 | 17.42 |
| 2012-12-14 01:00:00 | 14.3 |
| 2012-12-14 02:00:00 | 13.78 |
| 2012-12-14 03:00:00 | 16.38 |
| 2012-12-14 04:00:00 | 12.74 |
| 2012-12-14 05:00:00 | 14.56 |
| 2012-12-14 06:00:00 | 14.82 |
| 2012-12-14 07:00:00 | 15.6 |
| 2012-12-14 08:00:00 | 16.38 |
| 2012-12-14 09:00:00 | 15.34 |
| 2012-12-14 10:00:00 | 15.6 |
| 2012-12-14 11:00:00 | 18.2 |
| 2012-12-14 12:00:00 | 15.6 |
| 2012-12-14 13:00:00 | 15.6 |
| 2012-12-14 14:00:00 | 17.94 |
| 2012-12-14 15:00:00 | 16.64 |
| 2012-12-14 16:00:00 | 16.64 |
| 2012-12-14 17:00:00 | 15.6 |
| 2012-12-14 18:00:00 | 16.64 |
| 2012-12-14 19:00:00 | 15.86 |
| 2012-12-14 20:00:00 | 15.6 |
| 2012-12-14 21:00:00 | 15.86 |
| 2012-12-14 22:00:00 | 17.94 |
| 2012-12-14 23:00:00 | 16.64 |
| 2012-12-15 | 16.64 |
| 2012-12-15 01:00:00 | 15.6 |
| 2012-12-15 02:00:00 | 13.52 |
| 2012-12-15 03:00:00 | 13 |
| 2012-12-15 04:00:00 | 14.3 |
| 2012-12-15 05:00:00 | 19.76 |
| 2012-12-15 06:00:00 | 28.6 |
| 2012-12-15 07:00:00 | 26.26 |
| 2012-12-15 08:00:00 | 29.38 |
| 2012-12-15 09:00:00 | 24.96 |
| 2012-12-15 10:00:00 | 26.26 |
| 2012-12-15 11:00:00 | 25.74 |
| 2012-12-15 12:00:00 | 24.18 |
| 2012-12-15 13:00:00 | 24.44 |
| 2012-12-15 14:00:00 | 27.3 |
| 2012-12-15 15:00:00 | 33.28 |
| 2012-12-15 16:00:00 | 30.94 |
| 2012-12-15 17:00:00 | 29.38 |
| 2012-12-15 18:00:00 | 24.7 |
| 2012-12-15 19:00:00 | 22.62 |
| 2012-12-15 20:00:00 | 23.66 |
| 2012-12-15 21:00:00 | 24.96 |
| 2012-12-15 22:00:00 | 26 |
| 2012-12-15 23:00:00 | 22.62 |
| 2012-12-16 | 19.76 |
| 2012-12-16 01:00:00 | 17.68 |
| 2012-12-16 02:00:00 | 18.46 |
| 2012-12-16 03:00:00 | 14.82 |
| 2012-12-16 04:00:00 | 15.08 |
| 2012-12-16 05:00:00 | 14.82 |
| 2012-12-16 06:00:00 | 14.3 |
| 2012-12-16 07:00:00 | 14.04 |
| 2012-12-16 08:00:00 | 14.3 |
| 2012-12-16 09:00:00 | 14.3 |
| 2012-12-16 10:00:00 | 16.12 |
| 2012-12-16 11:00:00 | 18.46 |
| 2012-12-16 12:00:00 | 18.72 |
| 2012-12-16 13:00:00 | 18.46 |
| 2012-12-16 14:00:00 | 16.9 |
| 2012-12-16 15:00:00 | 17.16 |
| 2012-12-16 16:00:00 | 16.9 |
| 2012-12-16 17:00:00 | 16.12 |
| 2012-12-16 18:00:00 | 16.12 |
| 2012-12-16 19:00:00 | 16.12 |
| 2012-12-16 20:00:00 | 16.38 |
| 2012-12-16 21:00:00 | 16.38 |
| 2012-12-16 22:00:00 | 18.46 |
| 2012-12-16 23:00:00 | 17.42 |
| 2012-12-17 | 14.82 |
| 2012-12-17 01:00:00 | 14.56 |
| 2012-12-17 02:00:00 | 13 |
| 2012-12-17 03:00:00 | 12.74 |
| 2012-12-17 04:00:00 | 12.22 |
| 2012-12-17 05:00:00 | 12.22 |
| 2012-12-17 06:00:00 | 12.74 |
| 2012-12-17 07:00:00 | 12.74 |
| 2012-12-17 08:00:00 | 13.26 |
| 2012-12-17 09:00:00 | 15.6 |
| 2012-12-17 10:00:00 | 14.3 |
| 2012-12-17 11:00:00 | 14.3 |
| 2012-12-17 12:00:00 | 14.3 |
| 2012-12-17 13:00:00 | 14.56 |
| 2012-12-17 14:00:00 | 15.34 |
| 2012-12-17 15:00:00 | 14.56 |
| 2012-12-17 16:00:00 | 16.12 |
| 2012-12-17 17:00:00 | 13.78 |
| 2012-12-17 18:00:00 | 13.52 |
| 2012-12-17 19:00:00 | 14.82 |
| 2012-12-17 20:00:00 | 18.2 |
| 2012-12-17 21:00:00 | 17.94 |
| 2012-12-17 22:00:00 | 16.38 |
| 2012-12-17 23:00:00 | 16.38 |
| 2012-12-18 | 16.12 |
| 2012-12-18 01:00:00 | 13.52 |
| 2012-12-18 02:00:00 | 13 |
| 2012-12-18 03:00:00 | 11.96 |
| 2012-12-18 04:00:00 | 12.22 |
| 2012-12-18 05:00:00 | 13 |
| 2012-12-18 06:00:00 | 12.22 |
| 2012-12-18 07:00:00 | 11.18 |
| 2012-12-18 08:00:00 | 13 |
| 2012-12-18 09:00:00 | 15.86 |
| 2012-12-18 10:00:00 | 14.82 |
| 2012-12-18 11:00:00 | 15.6 |
| 2012-12-18 12:00:00 | 15.6 |
| 2012-12-18 13:00:00 | 14.3 |
| 2012-12-18 14:00:00 | 14.3 |
| 2012-12-18 15:00:00 | 13.52 |
| 2012-12-18 16:00:00 | 15.08 |
| 2012-12-18 17:00:00 | 13.52 |
| 2012-12-18 18:00:00 | 13.26 |
| 2012-12-18 19:00:00 | 13 |
| 2012-12-18 20:00:00 | 13.52 |
| 2012-12-18 21:00:00 | 15.86 |
| 2012-12-18 22:00:00 | 15.08 |
| 2012-12-18 23:00:00 | 14.3 |
| 2012-12-19 | 14.04 |
| 2012-12-19 01:00:00 | 14.3 |
| 2012-12-19 02:00:00 | 12.48 |
| 2012-12-19 03:00:00 | 11.96 |
| 2012-12-19 04:00:00 | 11.44 |
| 2012-12-19 05:00:00 | 10.92 |
| 2012-12-19 06:00:00 | 13.26 |
| 2012-12-19 07:00:00 | 14.3 |
| 2012-12-19 08:00:00 | 12.48 |
| 2012-12-19 09:00:00 | 14.82 |
| 2012-12-19 10:00:00 | 14.3 |
| 2012-12-19 11:00:00 | 15.34 |
| 2012-12-19 12:00:00 | 15.86 |
| 2012-12-19 13:00:00 | 14.56 |
| 2012-12-19 14:00:00 | 13.26 |
| 2012-12-19 15:00:00 | 14.3 |
| 2012-12-19 16:00:00 | 16.12 |
| 2012-12-19 17:00:00 | 14.82 |
| 2012-12-19 18:00:00 | 14.3 |
| 2012-12-19 19:00:00 | 13.52 |
| 2012-12-19 20:00:00 | 14.04 |
| 2012-12-19 21:00:00 | 13.26 |
| 2012-12-19 22:00:00 | 15.08 |
| 2012-12-19 23:00:00 | 15.08 |
| 2012-12-20 | 13.26 |
| 2012-12-20 01:00:00 | 12.74 |
| 2012-12-20 02:00:00 | 11.96 |
| 2012-12-20 03:00:00 | 11.18 |
| 2012-12-20 04:00:00 | 10.66 |
| 2012-12-20 05:00:00 | 12.48 |
| 2012-12-20 06:00:00 | 12.74 |
| 2012-12-20 07:00:00 | 14.04 |
| 2012-12-20 08:00:00 | 15.34 |
| 2012-12-20 09:00:00 | 17.68 |
| 2012-12-20 10:00:00 | 16.64 |
| 2012-12-20 11:00:00 | 15.86 |
| 2012-12-20 12:00:00 | 15.86 |
| 2012-12-20 13:00:00 | 15.86 |
| 2012-12-20 14:00:00 | 17.68 |
| 2012-12-20 15:00:00 | 15.6 |
| 2012-12-20 16:00:00 | 15.6 |
| 2012-12-20 17:00:00 | 15.86 |
| 2012-12-20 18:00:00 | 15.34 |
| 2012-12-20 19:00:00 | 15.6 |
| 2012-12-20 20:00:00 | 17.42 |
| 2012-12-20 21:00:00 | 16.12 |
| 2012-12-20 22:00:00 | 16.12 |
| 2012-12-20 23:00:00 | 16.64 |
| 2012-12-21 | 15.86 |
| 2012-12-21 01:00:00 | 15.34 |
| 2012-12-21 02:00:00 | 16.38 |
| 2012-12-21 03:00:00 | 15.08 |
| 2012-12-21 04:00:00 | 14.3 |
| 2012-12-21 05:00:00 | 13.52 |
| 2012-12-21 06:00:00 | 14.3 |
| 2012-12-21 07:00:00 | 15.08 |
| 2012-12-21 08:00:00 | 15.86 |
| 2012-12-21 09:00:00 | 15.34 |
| 2012-12-21 10:00:00 | 16.12 |
| 2012-12-21 11:00:00 | 15.6 |
| 2012-12-21 12:00:00 | 15.6 |
| 2012-12-21 13:00:00 | 15.6 |
| 2012-12-21 14:00:00 | 15.6 |
| 2012-12-21 15:00:00 | 18.2 |
| 2012-12-21 16:00:00 | 15.86 |
| 2012-12-21 17:00:00 | 15.34 |
| 2012-12-21 18:00:00 | 14.82 |
| 2012-12-21 19:00:00 | 15.6 |
| 2012-12-21 20:00:00 | 15.6 |
| 2012-12-21 21:00:00 | 15.34 |
| 2012-12-21 22:00:00 | 15.34 |
| 2012-12-21 23:00:00 | 15.08 |
| 2012-12-22 | 15.34 |
| 2012-12-22 01:00:00 | 16.12 |
| 2012-12-22 02:00:00 | 14.04 |
| 2012-12-22 03:00:00 | 13.78 |
| 2012-12-22 04:00:00 | 13 |
| 2012-12-22 05:00:00 | 12.74 |
| 2012-12-22 06:00:00 | 13 |
| 2012-12-22 07:00:00 | 13.26 |
| 2012-12-22 08:00:00 | 14.56 |
| 2012-12-22 09:00:00 | 14.82 |
| 2012-12-22 10:00:00 | 14.82 |
| 2012-12-22 11:00:00 | 15.34 |
| 2012-12-22 12:00:00 | 16.64 |
| 2012-12-22 13:00:00 | 16.64 |
| 2012-12-22 14:00:00 | 18.46 |
| 2012-12-22 15:00:00 | 16.38 |
| 2012-12-22 16:00:00 | 16.38 |
| 2012-12-22 17:00:00 | 15.34 |
| 2012-12-22 18:00:00 | 15.86 |
| 2012-12-22 19:00:00 | 15.6 |
| 2012-12-22 20:00:00 | 15.6 |
| 2012-12-22 21:00:00 | 16.12 |
| 2012-12-22 22:00:00 | 15.6 |
| 2012-12-22 23:00:00 | 16.12 |
| 2012-12-23 | 15.6 |
| 2012-12-23 01:00:00 | 16.38 |
| 2012-12-23 02:00:00 | 15.08 |
| 2012-12-23 03:00:00 | 13.78 |
| 2012-12-23 04:00:00 | 14.3 |
| 2012-12-23 05:00:00 | 13.52 |
| 2012-12-23 06:00:00 | 13 |
| 2012-12-23 07:00:00 | 13.26 |
| 2012-12-23 08:00:00 | 15.08 |
| 2012-12-23 09:00:00 | 15.86 |
| 2012-12-23 10:00:00 | 15.08 |
| 2012-12-23 11:00:00 | 16.38 |
| 2012-12-23 12:00:00 | 17.42 |
| 2012-12-23 13:00:00 | 17.94 |
| 2012-12-23 14:00:00 | 18.2 |
| 2012-12-23 15:00:00 | 17.42 |
| 2012-12-23 16:00:00 | 16.64 |
| 2012-12-23 17:00:00 | 16.12 |
| 2012-12-23 18:00:00 | 16.12 |
| 2012-12-23 19:00:00 | 16.12 |
| 2012-12-23 20:00:00 | 16.38 |
| 2012-12-23 21:00:00 | 18.2 |
| 2012-12-23 22:00:00 | 24.18 |
| 2012-12-23 23:00:00 | 33.02 |
| 2012-12-24 | 31.46 |
| 2012-12-24 01:00:00 | 30.42 |
| 2012-12-24 02:00:00 | 38.74 |
| 2012-12-24 03:00:00 | 92.82 |
| 2012-12-24 04:00:00 | 116.22 |
| 2012-12-24 05:00:00 | 119.34 |
| 2012-12-24 06:00:00 | 82.94 |
| 2012-12-24 07:00:00 | 62.92 |
| 2012-12-24 08:00:00 | 65 |
| 2012-12-24 09:00:00 | 57.46 |
| 2012-12-24 10:00:00 | 41.6 |
| 2012-12-24 11:00:00 | 39 |
| 2012-12-24 12:00:00 | 36.66 |
| 2012-12-24 13:00:00 | 34.58 |
| 2012-12-24 14:00:00 | 27.56 |
| 2012-12-24 15:00:00 | 25.74 |
| 2012-12-24 16:00:00 | 24.96 |
| 2012-12-24 17:00:00 | 23.92 |
| 2012-12-24 18:00:00 | 23.92 |
| 2012-12-24 19:00:00 | 23.14 |
| 2012-12-24 20:00:00 | 21.58 |
| 2012-12-24 21:00:00 | 20.8 |
| 2012-12-24 22:00:00 | 20.28 |
| 2012-12-24 23:00:00 | 19.5 |
| 2012-12-25 | 19.24 |
| 2012-12-25 01:00:00 | 18.98 |
| 2012-12-25 02:00:00 | 18.46 |
| 2012-12-25 03:00:00 | 19.5 |
| 2012-12-25 04:00:00 | 16.12 |
| 2012-12-25 05:00:00 | 15.86 |
| 2012-12-25 06:00:00 | 15.86 |
| 2012-12-25 07:00:00 | 15.08 |
| 2012-12-25 08:00:00 | 15.34 |
| 2012-12-25 09:00:00 | 17.42 |
| 2012-12-25 10:00:00 | 17.16 |
| 2012-12-25 11:00:00 | 21.06 |
| 2012-12-25 12:00:00 | 19.5 |
| 2012-12-25 13:00:00 | 18.98 |
| 2012-12-25 14:00:00 | 18.98 |
| 2012-12-25 15:00:00 | 18.46 |
| 2012-12-25 16:00:00 | 16.38 |
| 2012-12-25 17:00:00 | 18.98 |
| 2012-12-25 18:00:00 | 18.2 |
| 2012-12-25 19:00:00 | 16.12 |
| 2012-12-25 20:00:00 | 17.94 |
| 2012-12-25 21:00:00 | 16.12 |
| 2012-12-25 22:00:00 | 18.2 |
| 2012-12-25 23:00:00 | 17.68 |
| 2012-12-26 | 16.38 |
| 2012-12-26 01:00:00 | 16.12 |
| 2012-12-26 02:00:00 | 14.56 |
| 2012-12-26 03:00:00 | 14.56 |
| 2012-12-26 04:00:00 | 17.42 |
| 2012-12-26 05:00:00 | 14.56 |
| 2012-12-26 06:00:00 | 14.3 |
| 2012-12-26 07:00:00 | 14.3 |
| 2012-12-26 08:00:00 | 14.56 |
| 2012-12-26 09:00:00 | 14.3 |
| 2012-12-26 10:00:00 | 15.86 |
| 2012-12-26 11:00:00 | 18.46 |
| 2012-12-26 12:00:00 | 20.28 |
| 2012-12-26 13:00:00 | 18.98 |
| 2012-12-26 14:00:00 | 18.2 |
| 2012-12-26 15:00:00 | 16.64 |
| 2012-12-26 16:00:00 | 17.68 |
| 2012-12-26 17:00:00 | 15.86 |
| 2012-12-26 18:00:00 | 16.12 |
| 2012-12-26 19:00:00 | 16.12 |
| 2012-12-26 20:00:00 | 17.68 |
| 2012-12-26 21:00:00 | 16.12 |
| 2012-12-26 22:00:00 | 17.94 |
| 2012-12-26 23:00:00 | 18.98 |
| 2012-12-27 | 15.86 |
| 2012-12-27 01:00:00 | 14.56 |
| 2012-12-27 02:00:00 | 14.82 |
| 2012-12-27 03:00:00 | 14.56 |
| 2012-12-27 04:00:00 | 14.3 |
| 2012-12-27 05:00:00 | 14.56 |
| 2012-12-27 06:00:00 | 14.3 |
| 2012-12-27 07:00:00 | 14.3 |
| 2012-12-27 08:00:00 | 14.3 |
| 2012-12-27 09:00:00 | 14.56 |
| 2012-12-27 10:00:00 | 17.42 |
| 2012-12-27 11:00:00 | 17.68 |
| 2012-12-27 12:00:00 | 18.46 |
| 2012-12-27 13:00:00 | 21.84 |
| 2012-12-27 14:00:00 | 19.5 |
| 2012-12-27 15:00:00 | 18.72 |
| 2012-12-27 16:00:00 | 16.12 |
| 2012-12-27 17:00:00 | 16.12 |
| 2012-12-27 18:00:00 | 16.38 |
| 2012-12-27 19:00:00 | 15.86 |
| 2012-12-27 20:00:00 | 16.38 |
| 2012-12-27 21:00:00 | 22.62 |
| 2012-12-27 22:00:00 | 63.18 |
| 2012-12-27 23:00:00 | 61.1 |
| 2012-12-28 | 35.62 |
| 2012-12-28 01:00:00 | 26.52 |
| 2012-12-28 02:00:00 | 24.18 |
| 2012-12-28 03:00:00 | 24.44 |
| 2012-12-28 04:00:00 | 26.52 |
| 2012-12-28 05:00:00 | 20.28 |
| 2012-12-28 06:00:00 | 17.42 |
| 2012-12-28 07:00:00 | 17.16 |
| 2012-12-28 08:00:00 | 17.16 |
| 2012-12-28 09:00:00 | 16.9 |
| 2012-12-28 10:00:00 | 19.5 |
| 2012-12-28 11:00:00 | 19.5 |
| 2012-12-28 12:00:00 | 19.5 |
| 2012-12-28 13:00:00 | 20.54 |
| 2012-12-28 14:00:00 | 19.24 |
| 2012-12-28 15:00:00 | 17.42 |
| 2012-12-28 16:00:00 | 18.2 |
| 2012-12-28 17:00:00 | 16.64 |
| 2012-12-28 18:00:00 | 20.54 |
| 2012-12-28 19:00:00 | 19.5 |
| 2012-12-28 20:00:00 | 19.24 |
| 2012-12-28 21:00:00 | 21.06 |
| 2012-12-28 22:00:00 | 19.24 |
| 2012-12-28 23:00:00 | 19.24 |
| 2012-12-29 | 19.5 |
| 2012-12-29 01:00:00 | 18.98 |
| 2012-12-29 02:00:00 | 17.68 |
| 2012-12-29 03:00:00 | 17.68 |
| 2012-12-29 04:00:00 | 17.68 |
| 2012-12-29 05:00:00 | 17.42 |
| 2012-12-29 06:00:00 | 17.68 |
| 2012-12-29 07:00:00 | 16.9 |
| 2012-12-29 08:00:00 | 16.9 |
| 2012-12-29 09:00:00 | 17.42 |
| 2012-12-29 10:00:00 | 18.98 |
| 2012-12-29 11:00:00 | 20.28 |
| 2012-12-29 12:00:00 | 16.9 |
| 2012-12-29 13:00:00 | 18.72 |
| 2012-12-29 14:00:00 | 18.98 |
| 2012-12-29 15:00:00 | 17.42 |
| 2012-12-29 16:00:00 | 17.42 |
| 2012-12-29 17:00:00 | 16.38 |
| 2012-12-29 18:00:00 | 18.2 |
| 2012-12-29 19:00:00 | 18.98 |
| 2012-12-29 20:00:00 | 18.72 |
| 2012-12-29 21:00:00 | 20.8 |
| 2012-12-29 22:00:00 | 20.28 |
| 2012-12-29 23:00:00 | 19.24 |
| 2012-12-30 | 17.94 |
| 2012-12-30 01:00:00 | 17.94 |
| 2012-12-30 02:00:00 | 17.94 |
| 2012-12-30 03:00:00 | 17.68 |
| 2012-12-30 04:00:00 | 16.64 |
| 2012-12-30 05:00:00 | 16.38 |
| 2012-12-30 06:00:00 | 14.04 |
| 2012-12-30 07:00:00 | 14.04 |
| 2012-12-30 08:00:00 | 14.56 |
| 2012-12-30 09:00:00 | 13.78 |
| 2012-12-30 10:00:00 | 14.82 |
| 2012-12-30 11:00:00 | 16.38 |
| 2012-12-30 12:00:00 | 17.42 |
| 2012-12-30 13:00:00 | 17.42 |
| 2012-12-30 14:00:00 | 16.64 |
| 2012-12-30 15:00:00 | 18.46 |
| 2012-12-30 16:00:00 | 16.9 |
| 2012-12-30 17:00:00 | 16.12 |
| 2012-12-30 18:00:00 | 14.82 |
| 2012-12-30 19:00:00 | 15.6 |
| 2012-12-30 20:00:00 | 15.34 |
| 2012-12-30 21:00:00 | 14.82 |
| 2012-12-30 22:00:00 | 16.38 |
| 2012-12-30 23:00:00 | 14.82 |
| 2012-12-31 | 15.08 |
| 2012-12-31 | 14.56 |
| 2012-12-31 | 13 |
| 2012-12-31 | 13.78 |
| 2012-12-31 | 14.04 |
| 2012-12-31 | 13 |
| 2012-12-31 | 12.48 |
| 2012-12-31 | 12.74 |
| 2012-12-31 | 11.96 |
| 2012-12-31 | 14.3 |
| 2012-12-31 | 15.08 |
| 2012-12-31 | 14.56 |
| 2012-12-31 | 15.86 |
| 2012-12-31 | 16.12 |
| 2012-12-31 | 16.12 |
| 2012-12-31 | 15.08 |
| 2012-12-31 | 14.56 |
| 2012-12-31 | 15.34 |
| 2012-12-31 | 15.34 |
| 2012-12-31 | 15.34 |
| 2012-12-31 | 15.34 |
| 2012-12-31 | 14.56 |
| 2012-12-31 | 15.6 |
| 2012-12-31 | 14.3 |
| 2013-01-01 | 13.78 |